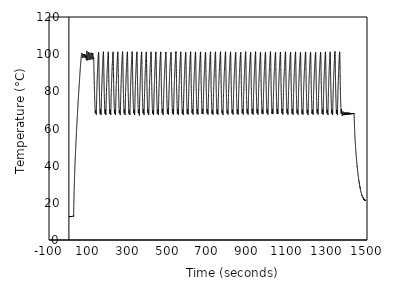
| Category | Series 0 |
|---|---|
| 0.0 | 12.5 |
| 0.63 | 12.5 |
| 0.7 | 12.5 |
| 0.77 | 12.5 |
| 0.84 | 12.5 |
| 0.91 | 12.5 |
| 0.97 | 12.5 |
| 1.04 | 12.5 |
| 1.11 | 12.5 |
| 1.18 | 12.5 |
| 1.25 | 12.5 |
| 1.31 | 12.5 |
| 1.38 | 12.5 |
| 1.45 | 12.5 |
| 1.52 | 12.5 |
| 1.59 | 12.5 |
| 1.65 | 12.5 |
| 1.72 | 12.5 |
| 1.79 | 12.5 |
| 1.86 | 12.5 |
| 1.93 | 12.5 |
| 2.0 | 12.5 |
| 2.06 | 12.5 |
| 2.13 | 12.5 |
| 2.2 | 12.5 |
| 2.27 | 12.5 |
| 2.34 | 12.5 |
| 2.4 | 12.5 |
| 2.47 | 12.5 |
| 2.54 | 12.5 |
| 2.61 | 12.5 |
| 2.68 | 12.5 |
| 2.74 | 12.5 |
| 2.81 | 12.5 |
| 2.88 | 12.5 |
| 2.95 | 12.5 |
| 3.02 | 12.5 |
| 3.08 | 12.5 |
| 3.15 | 12.5 |
| 3.22 | 12.5 |
| 3.29 | 12.5 |
| 3.36 | 12.5 |
| 3.42 | 12.5 |
| 3.49 | 12.5 |
| 3.56 | 12.5 |
| 3.63 | 12.5 |
| 3.7 | 12.5 |
| 3.76 | 12.5 |
| 3.83 | 12.5 |
| 3.9 | 12.5 |
| 3.97 | 12.5 |
| 4.04 | 12.5 |
| 4.1 | 12.5 |
| 4.17 | 12.5 |
| 4.24 | 12.5 |
| 4.31 | 12.5 |
| 4.38 | 12.5 |
| 4.44 | 12.5 |
| 4.51 | 12.5 |
| 4.58 | 12.5 |
| 4.65 | 12.5 |
| 4.72 | 12.5 |
| 4.78 | 12.5 |
| 4.85 | 12.75 |
| 4.92 | 12.5 |
| 4.99 | 12.5 |
| 5.06 | 12.5 |
| 5.12 | 12.5 |
| 5.19 | 12.5 |
| 5.26 | 12.5 |
| 5.33 | 12.75 |
| 5.4 | 12.5 |
| 5.47 | 12.75 |
| 5.53 | 12.75 |
| 5.6 | 12.5 |
| 5.67 | 12.75 |
| 5.74 | 12.75 |
| 5.8 | 12.5 |
| 5.87 | 12.5 |
| 5.94 | 12.5 |
| 6.01 | 12.5 |
| 6.08 | 12.5 |
| 6.15 | 12.5 |
| 6.21 | 12.5 |
| 6.28 | 12.5 |
| 6.35 | 12.5 |
| 6.42 | 12.75 |
| 6.48 | 12.5 |
| 6.55 | 12.5 |
| 6.62 | 12.5 |
| 6.69 | 12.75 |
| 6.76 | 12.75 |
| 6.82 | 12.5 |
| 6.89 | 12.5 |
| 6.96 | 12.5 |
| 7.03 | 12.5 |
| 7.1 | 12.5 |
| 7.17 | 12.5 |
| 7.23 | 12.75 |
| 7.3 | 12.75 |
| 7.37 | 12.75 |
| 7.44 | 12.75 |
| 7.51 | 12.5 |
| 7.57 | 12.75 |
| 7.64 | 12.75 |
| 7.71 | 12.5 |
| 7.78 | 12.75 |
| 7.84 | 12.5 |
| 7.91 | 12.5 |
| 7.98 | 12.75 |
| 8.05 | 12.5 |
| 8.12 | 12.75 |
| 8.19 | 12.75 |
| 8.25 | 12.5 |
| 8.32 | 12.5 |
| 8.39 | 12.5 |
| 8.46 | 12.75 |
| 8.52 | 12.5 |
| 8.59 | 12.5 |
| 8.66 | 12.5 |
| 8.73 | 12.5 |
| 8.8 | 12.75 |
| 8.87 | 12.5 |
| 8.93 | 12.5 |
| 9.0 | 12.75 |
| 9.07 | 12.5 |
| 9.14 | 12.5 |
| 9.21 | 12.5 |
| 9.27 | 12.5 |
| 9.34 | 12.5 |
| 9.41 | 12.75 |
| 9.48 | 12.5 |
| 9.55 | 12.5 |
| 9.61 | 12.5 |
| 9.68 | 12.75 |
| 9.75 | 12.75 |
| 9.82 | 12.75 |
| 9.89 | 12.5 |
| 9.96 | 12.75 |
| 10.02 | 12.5 |
| 10.09 | 12.75 |
| 10.16 | 12.75 |
| 10.23 | 12.5 |
| 10.3 | 12.75 |
| 10.36 | 12.75 |
| 10.43 | 12.5 |
| 10.5 | 12.75 |
| 10.57 | 12.75 |
| 10.64 | 12.75 |
| 10.7 | 12.75 |
| 10.77 | 12.75 |
| 10.84 | 12.75 |
| 10.91 | 12.5 |
| 10.98 | 12.5 |
| 11.04 | 12.75 |
| 11.11 | 12.75 |
| 11.18 | 12.75 |
| 11.25 | 12.5 |
| 11.32 | 12.5 |
| 11.38 | 12.5 |
| 11.45 | 12.5 |
| 11.52 | 12.75 |
| 11.59 | 12.75 |
| 11.66 | 12.75 |
| 11.73 | 12.75 |
| 11.79 | 12.5 |
| 11.86 | 12.75 |
| 11.93 | 12.75 |
| 12.0 | 12.75 |
| 12.06 | 12.75 |
| 12.13 | 12.75 |
| 12.2 | 12.75 |
| 12.27 | 12.75 |
| 12.34 | 12.75 |
| 12.41 | 12.75 |
| 12.47 | 12.75 |
| 12.54 | 12.75 |
| 12.61 | 12.5 |
| 12.68 | 12.75 |
| 12.75 | 12.75 |
| 12.81 | 12.75 |
| 12.88 | 12.75 |
| 12.95 | 12.75 |
| 13.02 | 12.75 |
| 13.09 | 12.75 |
| 13.15 | 12.5 |
| 13.22 | 12.75 |
| 13.29 | 12.75 |
| 13.36 | 12.75 |
| 13.43 | 12.5 |
| 13.5 | 12.75 |
| 13.56 | 12.75 |
| 13.63 | 12.75 |
| 13.7 | 12.75 |
| 13.77 | 12.75 |
| 13.84 | 12.75 |
| 13.9 | 12.75 |
| 13.97 | 12.75 |
| 14.04 | 12.75 |
| 14.11 | 12.75 |
| 14.18 | 12.75 |
| 14.24 | 12.75 |
| 14.31 | 12.75 |
| 14.38 | 12.75 |
| 14.45 | 12.75 |
| 14.52 | 12.75 |
| 14.59 | 12.75 |
| 14.65 | 12.75 |
| 14.72 | 12.75 |
| 14.79 | 12.75 |
| 14.86 | 12.75 |
| 14.93 | 12.75 |
| 14.99 | 12.75 |
| 15.06 | 12.75 |
| 15.13 | 12.75 |
| 15.2 | 12.75 |
| 15.27 | 12.75 |
| 15.33 | 12.75 |
| 15.4 | 12.75 |
| 15.47 | 12.75 |
| 15.54 | 12.75 |
| 15.61 | 12.75 |
| 15.67 | 12.75 |
| 15.74 | 12.75 |
| 15.81 | 12.75 |
| 15.88 | 12.75 |
| 15.95 | 12.75 |
| 16.01 | 12.75 |
| 16.08 | 12.75 |
| 16.15 | 12.75 |
| 16.22 | 12.75 |
| 16.29 | 12.75 |
| 16.35 | 12.75 |
| 16.42 | 12.75 |
| 16.49 | 12.75 |
| 16.56 | 12.75 |
| 16.63 | 12.75 |
| 16.7 | 12.75 |
| 16.76 | 12.75 |
| 16.83 | 12.75 |
| 16.9 | 12.75 |
| 16.97 | 12.75 |
| 17.04 | 12.75 |
| 17.1 | 12.75 |
| 17.17 | 12.75 |
| 17.24 | 12.75 |
| 17.31 | 12.75 |
| 17.38 | 12.75 |
| 17.44 | 12.75 |
| 17.51 | 12.75 |
| 17.58 | 12.75 |
| 17.65 | 12.75 |
| 17.72 | 12.75 |
| 17.78 | 12.75 |
| 17.85 | 12.75 |
| 17.92 | 12.75 |
| 17.99 | 12.75 |
| 18.06 | 12.75 |
| 18.12 | 12.75 |
| 18.19 | 12.75 |
| 18.26 | 12.75 |
| 18.33 | 12.75 |
| 18.4 | 12.75 |
| 18.46 | 12.75 |
| 18.53 | 12.75 |
| 18.6 | 12.75 |
| 18.67 | 12.75 |
| 18.74 | 12.75 |
| 18.81 | 12.75 |
| 18.87 | 12.75 |
| 18.94 | 12.75 |
| 19.01 | 12.75 |
| 19.08 | 12.75 |
| 19.15 | 12.75 |
| 19.21 | 12.75 |
| 19.28 | 12.75 |
| 19.35 | 12.75 |
| 19.42 | 12.75 |
| 19.49 | 12.75 |
| 19.55 | 12.75 |
| 19.62 | 12.75 |
| 19.69 | 12.75 |
| 19.76 | 12.75 |
| 19.83 | 12.75 |
| 19.9 | 12.75 |
| 19.96 | 12.75 |
| 20.03 | 12.75 |
| 20.1 | 12.75 |
| 20.17 | 12.75 |
| 20.24 | 12.75 |
| 20.3 | 12.75 |
| 20.37 | 12.75 |
| 20.44 | 12.75 |
| 20.51 | 12.75 |
| 20.58 | 12.75 |
| 20.64 | 12.75 |
| 20.71 | 12.75 |
| 20.78 | 12.75 |
| 20.85 | 12.75 |
| 20.92 | 12.75 |
| 20.98 | 12.75 |
| 21.05 | 12.75 |
| 21.12 | 12.75 |
| 21.19 | 12.75 |
| 21.26 | 12.75 |
| 21.32 | 12.75 |
| 21.39 | 12.75 |
| 21.46 | 13 |
| 21.53 | 12.75 |
| 21.6 | 12.75 |
| 21.67 | 12.75 |
| 21.73 | 12.75 |
| 21.8 | 12.75 |
| 21.87 | 12.75 |
| 21.94 | 12.75 |
| 22.0 | 12.75 |
| 22.07 | 12.75 |
| 22.14 | 12.75 |
| 22.21 | 12.75 |
| 22.28 | 12.75 |
| 22.35 | 12.75 |
| 22.41 | 12.75 |
| 22.48 | 12.75 |
| 22.55 | 12.75 |
| 22.62 | 12.75 |
| 22.69 | 13 |
| 22.75 | 12.75 |
| 22.82 | 12.75 |
| 22.89 | 12.75 |
| 22.96 | 13 |
| 23.03 | 13 |
| 23.09 | 12.75 |
| 23.16 | 13 |
| 23.23 | 12.75 |
| 23.3 | 12.75 |
| 23.37 | 13 |
| 23.44 | 13 |
| 23.5 | 13 |
| 23.57 | 13 |
| 23.64 | 13 |
| 23.71 | 12.75 |
| 23.78 | 12.75 |
| 23.84 | 12.75 |
| 23.91 | 13.75 |
| 23.98 | 14.25 |
| 24.05 | 14.75 |
| 24.12 | 15.25 |
| 24.18 | 15.5 |
| 24.25 | 15.5 |
| 24.32 | 16 |
| 24.39 | 16.5 |
| 24.46 | 16.75 |
| 24.52 | 17.25 |
| 24.59 | 17.5 |
| 24.66 | 18 |
| 24.73 | 18.5 |
| 24.8 | 18.75 |
| 24.86 | 19.25 |
| 24.93 | 19.5 |
| 25.0 | 20 |
| 25.07 | 20 |
| 25.14 | 20.25 |
| 25.21 | 20.75 |
| 25.27 | 21 |
| 25.34 | 21.5 |
| 25.41 | 21.75 |
| 25.48 | 22.25 |
| 25.55 | 22.5 |
| 25.61 | 22.75 |
| 25.68 | 23.25 |
| 25.75 | 23.5 |
| 25.82 | 24 |
| 25.89 | 24 |
| 25.95 | 24.25 |
| 26.02 | 24.5 |
| 26.09 | 25 |
| 26.16 | 25.25 |
| 26.23 | 25.5 |
| 26.3 | 26 |
| 26.36 | 26.25 |
| 26.43 | 26.5 |
| 26.5 | 27 |
| 26.57 | 27.25 |
| 26.64 | 27.25 |
| 26.7 | 27.5 |
| 26.77 | 27.75 |
| 26.84 | 28 |
| 26.91 | 28.5 |
| 26.98 | 28.5 |
| 27.04 | 28.75 |
| 27.11 | 29 |
| 27.18 | 29.25 |
| 27.25 | 29.5 |
| 27.32 | 30 |
| 27.38 | 30 |
| 27.45 | 30 |
| 27.52 | 30.5 |
| 27.59 | 30.75 |
| 27.66 | 31 |
| 27.72 | 31.25 |
| 27.79 | 31.5 |
| 27.86 | 31.75 |
| 27.93 | 32 |
| 28.0 | 32.25 |
| 28.07 | 32.5 |
| 28.13 | 32.75 |
| 28.2 | 33 |
| 28.27 | 33 |
| 28.34 | 33.25 |
| 28.41 | 33.75 |
| 28.47 | 33.75 |
| 28.54 | 34 |
| 28.61 | 34.25 |
| 28.68 | 34.5 |
| 28.75 | 34.75 |
| 28.81 | 35 |
| 28.88 | 35.25 |
| 28.95 | 35.5 |
| 29.02 | 35.75 |
| 29.09 | 35.75 |
| 29.16 | 36 |
| 29.22 | 36.25 |
| 29.29 | 36.5 |
| 29.36 | 36.75 |
| 29.43 | 36.75 |
| 29.5 | 37.25 |
| 29.56 | 37.25 |
| 29.63 | 37.5 |
| 29.7 | 37.75 |
| 29.77 | 38 |
| 29.84 | 38.25 |
| 29.9 | 38.25 |
| 29.97 | 38.5 |
| 30.04 | 38.75 |
| 30.11 | 38.75 |
| 30.18 | 39 |
| 30.25 | 39.25 |
| 30.31 | 39.5 |
| 30.38 | 39.75 |
| 30.45 | 40 |
| 30.52 | 40.25 |
| 30.58 | 40.25 |
| 30.65 | 40.5 |
| 30.72 | 40.5 |
| 30.79 | 40.75 |
| 30.86 | 41 |
| 30.93 | 41.25 |
| 30.99 | 41.25 |
| 31.06 | 41.5 |
| 31.13 | 41.75 |
| 31.2 | 41.75 |
| 31.27 | 42.25 |
| 31.33 | 42.25 |
| 31.4 | 42.5 |
| 31.47 | 42.5 |
| 31.54 | 42.75 |
| 31.61 | 43 |
| 31.67 | 43 |
| 31.74 | 43.25 |
| 31.81 | 43.5 |
| 31.88 | 43.75 |
| 31.95 | 43.75 |
| 32.02 | 44 |
| 32.08 | 44.25 |
| 32.15 | 44.5 |
| 32.22 | 44.5 |
| 32.29 | 44.5 |
| 32.36 | 44.75 |
| 32.42 | 45 |
| 32.49 | 45.25 |
| 32.56 | 45.25 |
| 32.63 | 45.5 |
| 32.7 | 45.75 |
| 32.76 | 46 |
| 32.83 | 46 |
| 32.9 | 46.25 |
| 32.97 | 46.5 |
| 33.04 | 46.5 |
| 33.11 | 46.5 |
| 33.17 | 46.75 |
| 33.24 | 47 |
| 33.31 | 47.25 |
| 33.38 | 47.25 |
| 33.45 | 47.5 |
| 33.51 | 47.75 |
| 33.58 | 47.75 |
| 33.65 | 48 |
| 33.72 | 48 |
| 33.79 | 48.25 |
| 33.85 | 48.5 |
| 33.92 | 48.5 |
| 33.99 | 48.75 |
| 34.06 | 49 |
| 34.13 | 49 |
| 34.2 | 49.25 |
| 34.26 | 49.25 |
| 34.33 | 49.5 |
| 34.4 | 49.75 |
| 34.47 | 50 |
| 34.54 | 50.25 |
| 34.6 | 50.25 |
| 34.67 | 50.5 |
| 34.74 | 50.5 |
| 34.81 | 50.5 |
| 34.88 | 50.75 |
| 34.94 | 51 |
| 35.01 | 51 |
| 35.08 | 51.25 |
| 35.15 | 51.25 |
| 35.22 | 51.5 |
| 35.28 | 51.5 |
| 35.35 | 51.75 |
| 35.42 | 52 |
| 35.49 | 52.25 |
| 35.56 | 52.25 |
| 35.62 | 52.5 |
| 35.69 | 52.5 |
| 35.76 | 52.75 |
| 35.83 | 52.75 |
| 35.9 | 53 |
| 35.97 | 53.25 |
| 36.03 | 53.25 |
| 36.1 | 53.5 |
| 36.17 | 53.75 |
| 36.24 | 53.75 |
| 36.31 | 53.75 |
| 36.37 | 54 |
| 36.44 | 54 |
| 36.51 | 54.25 |
| 36.58 | 54.5 |
| 36.65 | 54.5 |
| 36.71 | 54.75 |
| 36.78 | 55 |
| 36.85 | 55 |
| 36.92 | 55.25 |
| 36.99 | 55.25 |
| 37.06 | 55.5 |
| 37.12 | 55.5 |
| 37.19 | 55.75 |
| 37.26 | 56 |
| 37.33 | 56 |
| 37.4 | 56.25 |
| 37.46 | 56.25 |
| 37.53 | 56.75 |
| 37.6 | 56.75 |
| 37.67 | 56.75 |
| 37.74 | 57 |
| 37.8 | 57.25 |
| 37.87 | 57.25 |
| 37.94 | 57.25 |
| 38.01 | 57.5 |
| 38.08 | 57.75 |
| 38.15 | 57.75 |
| 38.21 | 58 |
| 38.28 | 58 |
| 38.35 | 58.25 |
| 38.42 | 58.5 |
| 38.48 | 58.5 |
| 38.55 | 58.75 |
| 38.62 | 59 |
| 38.69 | 59 |
| 38.76 | 59 |
| 38.83 | 59.25 |
| 38.89 | 59.25 |
| 38.96 | 59.5 |
| 39.03 | 59.75 |
| 39.1 | 59.75 |
| 39.17 | 60 |
| 39.23 | 60 |
| 39.3 | 60.25 |
| 39.37 | 60.5 |
| 39.44 | 60.5 |
| 39.51 | 60.75 |
| 39.57 | 60.75 |
| 39.64 | 60.75 |
| 39.71 | 61 |
| 39.78 | 61.25 |
| 39.85 | 61.25 |
| 39.92 | 61.5 |
| 39.98 | 61.75 |
| 40.05 | 61.75 |
| 40.12 | 62 |
| 40.19 | 62 |
| 40.26 | 62.25 |
| 40.32 | 62.5 |
| 40.39 | 62.5 |
| 40.46 | 62.75 |
| 40.53 | 62.75 |
| 40.6 | 62.75 |
| 40.66 | 63 |
| 40.73 | 63 |
| 40.8 | 63.25 |
| 40.87 | 63.5 |
| 40.94 | 63.5 |
| 41.01 | 63.75 |
| 41.07 | 63.75 |
| 41.14 | 63.75 |
| 41.21 | 64 |
| 41.28 | 64.25 |
| 41.35 | 64.25 |
| 41.41 | 64.5 |
| 41.48 | 64.5 |
| 41.55 | 64.75 |
| 41.62 | 65 |
| 41.69 | 65 |
| 41.75 | 65.25 |
| 41.82 | 65.25 |
| 41.89 | 65.5 |
| 41.96 | 65.5 |
| 42.03 | 65.5 |
| 42.09 | 65.75 |
| 42.16 | 65.75 |
| 42.23 | 66 |
| 42.3 | 66.25 |
| 42.37 | 66.25 |
| 42.43 | 66.5 |
| 42.5 | 66.5 |
| 42.57 | 66.75 |
| 42.64 | 67 |
| 42.71 | 67 |
| 42.78 | 67 |
| 42.84 | 67 |
| 42.91 | 67.25 |
| 42.98 | 67.5 |
| 43.05 | 67.5 |
| 43.12 | 67.75 |
| 43.18 | 68 |
| 43.25 | 68 |
| 43.32 | 68.25 |
| 43.39 | 68.25 |
| 43.46 | 68.5 |
| 43.52 | 68.5 |
| 43.59 | 68.5 |
| 43.66 | 68.75 |
| 43.73 | 68.75 |
| 43.8 | 69 |
| 43.87 | 69 |
| 43.93 | 69.25 |
| 44.0 | 69.25 |
| 44.07 | 69.5 |
| 44.14 | 69.75 |
| 44.21 | 69.75 |
| 44.27 | 70 |
| 44.34 | 70 |
| 44.41 | 70 |
| 44.48 | 70.25 |
| 44.55 | 70.5 |
| 44.61 | 70.5 |
| 44.68 | 70.75 |
| 44.75 | 70.75 |
| 44.82 | 71 |
| 44.89 | 71.25 |
| 44.95 | 71.25 |
| 45.02 | 71.5 |
| 45.09 | 71.5 |
| 45.16 | 71.5 |
| 45.22 | 71.5 |
| 45.29 | 71.75 |
| 45.36 | 72 |
| 45.43 | 72 |
| 45.5 | 72.25 |
| 45.57 | 72.25 |
| 45.63 | 72.5 |
| 45.7 | 72.75 |
| 45.77 | 72.75 |
| 45.84 | 73 |
| 45.91 | 73 |
| 45.97 | 73 |
| 46.04 | 73.25 |
| 46.11 | 73.25 |
| 46.18 | 73.5 |
| 46.25 | 73.5 |
| 46.31 | 73.75 |
| 46.38 | 74 |
| 46.45 | 74 |
| 46.52 | 74.25 |
| 46.59 | 74.25 |
| 46.66 | 74.5 |
| 46.72 | 74.5 |
| 46.79 | 74.5 |
| 46.86 | 74.75 |
| 46.93 | 75 |
| 47.0 | 75 |
| 47.06 | 75 |
| 47.13 | 75.25 |
| 47.2 | 75.5 |
| 47.27 | 75.5 |
| 47.34 | 75.75 |
| 47.4 | 75.75 |
| 47.47 | 76 |
| 47.54 | 76.25 |
| 47.61 | 76.25 |
| 47.68 | 76.25 |
| 47.75 | 76.25 |
| 47.81 | 76.5 |
| 47.88 | 76.5 |
| 47.95 | 76.75 |
| 48.02 | 76.75 |
| 48.09 | 77 |
| 48.15 | 77 |
| 48.22 | 77.25 |
| 48.29 | 77.5 |
| 48.36 | 77.5 |
| 48.43 | 77.5 |
| 48.49 | 77.5 |
| 48.56 | 77.75 |
| 48.63 | 77.75 |
| 48.7 | 78 |
| 48.77 | 78.25 |
| 48.83 | 78.25 |
| 48.9 | 78.5 |
| 48.97 | 78.75 |
| 49.04 | 78.75 |
| 49.11 | 78.75 |
| 49.18 | 79 |
| 49.24 | 79 |
| 49.31 | 79.25 |
| 49.38 | 79.25 |
| 49.45 | 79.25 |
| 49.52 | 79.5 |
| 49.58 | 79.5 |
| 49.65 | 79.75 |
| 49.72 | 79.75 |
| 49.79 | 80 |
| 49.86 | 80 |
| 49.92 | 80.25 |
| 49.99 | 80.25 |
| 50.06 | 80.25 |
| 50.13 | 80.5 |
| 50.2 | 80.5 |
| 50.27 | 80.75 |
| 50.33 | 80.75 |
| 50.4 | 81 |
| 50.47 | 81 |
| 50.54 | 81.25 |
| 50.61 | 81.25 |
| 50.67 | 81.5 |
| 50.74 | 81.5 |
| 50.81 | 81.5 |
| 50.88 | 81.75 |
| 50.95 | 81.75 |
| 51.01 | 82 |
| 51.08 | 82 |
| 51.15 | 82.25 |
| 51.22 | 82.25 |
| 51.29 | 82.25 |
| 51.35 | 82.5 |
| 51.42 | 82.5 |
| 51.49 | 82.75 |
| 51.56 | 82.75 |
| 51.63 | 82.75 |
| 51.69 | 83 |
| 51.76 | 83 |
| 51.83 | 83.25 |
| 51.9 | 83.5 |
| 51.97 | 83.5 |
| 52.04 | 83.75 |
| 52.1 | 83.75 |
| 52.17 | 83.75 |
| 52.24 | 84 |
| 52.31 | 84 |
| 52.38 | 84.25 |
| 52.44 | 84.25 |
| 52.51 | 84.5 |
| 52.58 | 84.5 |
| 52.65 | 84.75 |
| 52.72 | 84.75 |
| 52.78 | 85 |
| 52.85 | 85 |
| 52.92 | 85.25 |
| 52.99 | 85.25 |
| 53.06 | 85.25 |
| 53.13 | 85.5 |
| 53.19 | 85.5 |
| 53.26 | 85.5 |
| 53.33 | 85.75 |
| 53.4 | 85.75 |
| 53.47 | 86 |
| 53.53 | 86 |
| 53.6 | 86.25 |
| 53.67 | 86.25 |
| 53.74 | 86.5 |
| 53.81 | 86.5 |
| 53.87 | 86.75 |
| 53.94 | 86.75 |
| 54.01 | 87 |
| 54.08 | 87 |
| 54.15 | 87 |
| 54.21 | 87.25 |
| 54.28 | 87.25 |
| 54.35 | 87.5 |
| 54.42 | 87.5 |
| 54.49 | 87.5 |
| 54.55 | 87.75 |
| 54.62 | 88 |
| 54.69 | 88 |
| 54.76 | 88 |
| 54.83 | 88.25 |
| 54.9 | 88.25 |
| 54.96 | 88.5 |
| 55.03 | 88.5 |
| 55.1 | 88.5 |
| 55.17 | 88.75 |
| 55.24 | 89 |
| 55.3 | 89 |
| 55.37 | 89 |
| 55.44 | 89.25 |
| 55.51 | 89.5 |
| 55.58 | 89.5 |
| 55.64 | 89.5 |
| 55.71 | 89.5 |
| 55.78 | 89.75 |
| 55.85 | 90 |
| 55.92 | 90 |
| 55.99 | 90.25 |
| 56.05 | 90.25 |
| 56.12 | 90.5 |
| 56.19 | 90.5 |
| 56.26 | 90.5 |
| 56.33 | 90.5 |
| 56.39 | 90.75 |
| 56.46 | 90.75 |
| 56.53 | 90.75 |
| 56.6 | 91 |
| 56.67 | 91 |
| 56.73 | 91 |
| 56.8 | 91.25 |
| 56.87 | 91.25 |
| 56.94 | 91.5 |
| 57.01 | 91.5 |
| 57.07 | 91.75 |
| 57.14 | 91.75 |
| 57.21 | 92 |
| 57.28 | 92 |
| 57.35 | 92 |
| 57.41 | 92.25 |
| 57.48 | 92.25 |
| 57.55 | 92.5 |
| 57.62 | 92.5 |
| 57.69 | 92.5 |
| 57.76 | 92.5 |
| 57.82 | 92.75 |
| 57.89 | 92.75 |
| 57.96 | 93 |
| 58.03 | 93 |
| 58.1 | 93 |
| 58.16 | 93.25 |
| 58.23 | 93.25 |
| 58.3 | 93.5 |
| 58.37 | 93.5 |
| 58.44 | 93.5 |
| 58.5 | 93.75 |
| 58.57 | 93.75 |
| 58.64 | 94 |
| 58.71 | 94 |
| 58.78 | 94 |
| 58.85 | 94.25 |
| 58.91 | 94.25 |
| 58.98 | 94.25 |
| 59.05 | 94.25 |
| 59.12 | 94.5 |
| 59.19 | 94.5 |
| 59.25 | 94.75 |
| 59.32 | 94.75 |
| 59.39 | 95 |
| 59.46 | 95.25 |
| 59.53 | 95.25 |
| 59.59 | 95.25 |
| 59.66 | 95.5 |
| 59.73 | 95.5 |
| 59.8 | 95.5 |
| 59.87 | 95.75 |
| 59.93 | 95.75 |
| 60.0 | 95.75 |
| 60.07 | 96 |
| 60.14 | 96 |
| 60.21 | 96.25 |
| 60.27 | 96.25 |
| 60.34 | 96.25 |
| 60.41 | 96.25 |
| 60.48 | 96.5 |
| 60.55 | 96.5 |
| 60.62 | 96.5 |
| 60.68 | 96.5 |
| 60.75 | 96.75 |
| 60.82 | 96.75 |
| 60.89 | 97 |
| 60.96 | 97 |
| 61.02 | 97 |
| 61.09 | 97.25 |
| 61.16 | 97.25 |
| 61.23 | 97.25 |
| 61.3 | 97.25 |
| 61.36 | 97.5 |
| 61.43 | 97.5 |
| 61.5 | 97.5 |
| 61.57 | 97.75 |
| 61.64 | 98 |
| 61.71 | 98 |
| 61.77 | 98 |
| 61.84 | 98.25 |
| 61.91 | 98.25 |
| 61.98 | 98.5 |
| 62.04 | 98.5 |
| 62.11 | 98.5 |
| 62.18 | 98.5 |
| 62.25 | 98.75 |
| 62.32 | 98.75 |
| 62.39 | 99 |
| 62.45 | 99 |
| 62.52 | 99 |
| 62.59 | 99 |
| 62.66 | 99.25 |
| 62.73 | 99.25 |
| 62.79 | 99.25 |
| 62.86 | 99.25 |
| 62.93 | 99.25 |
| 63.0 | 99.25 |
| 63.07 | 99.5 |
| 63.13 | 99.5 |
| 63.2 | 99.5 |
| 63.27 | 99.5 |
| 63.34 | 99.75 |
| 63.41 | 99.75 |
| 63.47 | 99.75 |
| 63.54 | 100 |
| 63.61 | 100 |
| 63.68 | 100 |
| 63.75 | 100 |
| 63.82 | 100 |
| 63.88 | 100.25 |
| 63.95 | 100.25 |
| 64.02 | 100.25 |
| 64.09 | 100.25 |
| 64.16 | 100.25 |
| 64.23 | 100.25 |
| 64.29 | 100.25 |
| 64.36 | 100.25 |
| 64.43 | 100.25 |
| 64.5 | 100.25 |
| 64.57 | 100.25 |
| 64.63 | 100.25 |
| 64.7 | 100.5 |
| 64.77 | 100.25 |
| 64.84 | 100.25 |
| 64.91 | 100.5 |
| 64.98 | 100.25 |
| 65.04 | 100.25 |
| 65.11 | 100.25 |
| 65.18 | 100.25 |
| 65.25 | 100.25 |
| 65.32 | 100.25 |
| 65.38 | 100.25 |
| 65.45 | 100.25 |
| 65.52 | 100.25 |
| 65.59 | 100.25 |
| 65.66 | 100.25 |
| 65.73 | 100.25 |
| 65.79 | 100.25 |
| 65.86 | 100.25 |
| 65.93 | 100.25 |
| 66.0 | 100.25 |
| 66.07 | 100.25 |
| 66.14 | 100.25 |
| 66.2 | 100.25 |
| 66.27 | 100.25 |
| 66.34 | 100.25 |
| 66.41 | 100.25 |
| 66.48 | 100 |
| 66.54 | 100 |
| 66.61 | 100 |
| 66.68 | 100 |
| 66.75 | 100 |
| 66.82 | 99.75 |
| 66.88 | 99.75 |
| 66.95 | 99.75 |
| 67.02 | 99.75 |
| 67.09 | 99.75 |
| 67.16 | 99.5 |
| 67.23 | 99.5 |
| 67.29 | 99.5 |
| 67.36 | 99.25 |
| 67.43 | 99.25 |
| 67.5 | 99.25 |
| 67.57 | 99.25 |
| 67.64 | 99 |
| 67.7 | 99 |
| 67.77 | 99 |
| 67.84 | 99 |
| 67.91 | 98.75 |
| 67.98 | 98.75 |
| 68.04 | 98.75 |
| 68.11 | 98.5 |
| 68.18 | 98.5 |
| 68.25 | 98.5 |
| 68.32 | 98.5 |
| 68.38 | 98.25 |
| 68.45 | 98.25 |
| 68.52 | 98.25 |
| 68.59 | 98.25 |
| 68.66 | 98.25 |
| 68.72 | 98.25 |
| 68.79 | 98 |
| 68.86 | 98 |
| 68.93 | 98 |
| 69.0 | 98 |
| 69.07 | 98 |
| 69.13 | 98 |
| 69.2 | 98 |
| 69.27 | 98 |
| 69.34 | 98 |
| 69.41 | 98 |
| 69.48 | 98 |
| 69.54 | 98 |
| 69.61 | 98 |
| 69.68 | 98 |
| 69.75 | 98 |
| 69.82 | 98 |
| 69.88 | 98.25 |
| 69.95 | 98.25 |
| 70.02 | 98.25 |
| 70.09 | 98.25 |
| 70.16 | 98.25 |
| 70.22 | 98.5 |
| 70.29 | 98.5 |
| 70.36 | 98.5 |
| 70.43 | 98.5 |
| 70.5 | 98.5 |
| 70.56 | 98.75 |
| 70.63 | 98.75 |
| 70.7 | 98.75 |
| 70.77 | 98.75 |
| 70.84 | 98.75 |
| 70.91 | 99 |
| 70.97 | 99 |
| 71.04 | 99.25 |
| 71.11 | 99.25 |
| 71.18 | 99.25 |
| 71.25 | 99.25 |
| 71.32 | 99.25 |
| 71.38 | 99.25 |
| 71.45 | 99.5 |
| 71.52 | 99.5 |
| 71.59 | 99.5 |
| 71.66 | 99.5 |
| 71.72 | 99.5 |
| 71.79 | 99.75 |
| 71.86 | 99.75 |
| 71.93 | 99.75 |
| 72.0 | 99.75 |
| 72.07 | 99.75 |
| 72.13 | 99.75 |
| 72.2 | 100 |
| 72.27 | 100 |
| 72.34 | 100 |
| 72.41 | 100 |
| 72.47 | 100 |
| 72.54 | 100 |
| 72.61 | 100 |
| 72.68 | 100 |
| 72.75 | 100 |
| 72.81 | 100 |
| 72.88 | 100 |
| 72.95 | 100 |
| 73.02 | 100 |
| 73.09 | 100 |
| 73.16 | 100 |
| 73.22 | 100 |
| 73.29 | 100 |
| 73.36 | 100 |
| 73.43 | 99.75 |
| 73.5 | 99.75 |
| 73.57 | 99.75 |
| 73.63 | 99.75 |
| 73.7 | 99.75 |
| 73.77 | 99.5 |
| 73.84 | 99.75 |
| 73.91 | 99.5 |
| 73.97 | 99.5 |
| 74.04 | 99.5 |
| 74.11 | 99.5 |
| 74.18 | 99.25 |
| 74.25 | 99.25 |
| 74.31 | 99.25 |
| 74.38 | 99.25 |
| 74.45 | 99.25 |
| 74.52 | 99 |
| 74.59 | 99 |
| 74.66 | 99 |
| 74.72 | 99 |
| 74.79 | 99 |
| 74.86 | 98.75 |
| 74.93 | 98.75 |
| 75.0 | 98.75 |
| 75.06 | 98.75 |
| 75.13 | 98.75 |
| 75.2 | 98.75 |
| 75.27 | 98.5 |
| 75.34 | 98.5 |
| 75.41 | 98.5 |
| 75.47 | 98.5 |
| 75.54 | 98.5 |
| 75.61 | 98.25 |
| 75.68 | 98.25 |
| 75.75 | 98.25 |
| 75.81 | 98.25 |
| 75.88 | 98.25 |
| 75.95 | 98.25 |
| 76.02 | 98.25 |
| 76.09 | 98.25 |
| 76.15 | 98.25 |
| 76.22 | 98.25 |
| 76.29 | 98.25 |
| 76.36 | 98.25 |
| 76.43 | 98.25 |
| 76.5 | 98.25 |
| 76.56 | 98.25 |
| 76.63 | 98.25 |
| 76.7 | 98.25 |
| 76.77 | 98.25 |
| 76.84 | 98.25 |
| 76.9 | 98.25 |
| 76.97 | 98.25 |
| 77.04 | 98.25 |
| 77.11 | 98.25 |
| 77.18 | 98.25 |
| 77.25 | 98.25 |
| 77.31 | 98.25 |
| 77.38 | 98.5 |
| 77.45 | 98.5 |
| 77.52 | 98.5 |
| 77.59 | 98.5 |
| 77.65 | 98.5 |
| 77.72 | 98.5 |
| 77.79 | 98.5 |
| 77.86 | 98.75 |
| 77.93 | 98.75 |
| 78.0 | 98.75 |
| 78.06 | 98.75 |
| 78.13 | 98.75 |
| 78.2 | 99 |
| 78.27 | 99 |
| 78.34 | 99 |
| 78.4 | 99 |
| 78.47 | 99 |
| 78.54 | 99.25 |
| 78.61 | 99.25 |
| 78.68 | 99.25 |
| 78.75 | 99.25 |
| 78.81 | 99.25 |
| 78.88 | 99.5 |
| 78.95 | 99.5 |
| 79.02 | 99.5 |
| 79.09 | 99.5 |
| 79.15 | 99.5 |
| 79.22 | 99.5 |
| 79.29 | 99.5 |
| 79.36 | 99.75 |
| 79.43 | 99.75 |
| 79.5 | 99.75 |
| 79.56 | 99.75 |
| 79.63 | 99.75 |
| 79.7 | 99.75 |
| 79.77 | 99.75 |
| 79.84 | 99.75 |
| 79.9 | 99.75 |
| 79.97 | 99.75 |
| 80.04 | 99.5 |
| 80.11 | 99.5 |
| 80.18 | 99.75 |
| 80.24 | 99.75 |
| 80.31 | 99.5 |
| 80.38 | 99.5 |
| 80.45 | 99.75 |
| 80.52 | 99.5 |
| 80.58 | 99.5 |
| 80.65 | 99.5 |
| 80.72 | 99.5 |
| 80.79 | 99.5 |
| 80.86 | 99.5 |
| 80.93 | 99.5 |
| 81.0 | 99.25 |
| 81.06 | 99.25 |
| 81.13 | 99.25 |
| 81.2 | 99.25 |
| 81.27 | 99.25 |
| 81.33 | 99.25 |
| 81.4 | 99.25 |
| 81.47 | 99 |
| 81.54 | 99 |
| 81.61 | 99 |
| 81.68 | 99 |
| 81.74 | 99 |
| 81.81 | 99 |
| 81.88 | 98.75 |
| 81.95 | 98.75 |
| 82.02 | 98.75 |
| 82.08 | 98.75 |
| 82.15 | 98.75 |
| 82.22 | 98.75 |
| 82.29 | 98.5 |
| 82.36 | 98.75 |
| 82.43 | 98.5 |
| 82.49 | 98.5 |
| 82.56 | 98.5 |
| 82.63 | 98.5 |
| 82.7 | 98.25 |
| 82.77 | 98.25 |
| 82.83 | 98.25 |
| 82.9 | 98 |
| 82.97 | 98 |
| 83.04 | 98 |
| 83.11 | 98 |
| 83.18 | 98 |
| 83.24 | 98 |
| 83.31 | 98 |
| 83.38 | 98 |
| 83.45 | 98 |
| 83.52 | 98 |
| 83.58 | 98.25 |
| 83.65 | 98 |
| 83.72 | 98 |
| 83.79 | 98 |
| 83.86 | 98.25 |
| 83.92 | 98.25 |
| 83.99 | 98.25 |
| 84.06 | 98.25 |
| 84.13 | 98.25 |
| 84.2 | 98.25 |
| 84.26 | 98.25 |
| 84.33 | 98.25 |
| 84.4 | 98.25 |
| 84.47 | 98.25 |
| 84.54 | 98.5 |
| 84.61 | 98.5 |
| 84.68 | 98.5 |
| 84.74 | 98.5 |
| 84.81 | 98.5 |
| 84.88 | 98.75 |
| 84.95 | 98.75 |
| 85.01 | 98.75 |
| 85.08 | 98.75 |
| 85.15 | 98.75 |
| 85.22 | 98.75 |
| 85.29 | 99 |
| 85.36 | 99 |
| 85.43 | 99 |
| 85.49 | 99.25 |
| 85.56 | 99.25 |
| 85.63 | 99.25 |
| 85.7 | 99.5 |
| 85.77 | 99.5 |
| 85.83 | 99.5 |
| 85.9 | 99.5 |
| 85.97 | 99.5 |
| 86.04 | 99.5 |
| 86.11 | 99.5 |
| 86.17 | 99.5 |
| 86.24 | 99.5 |
| 86.31 | 99.5 |
| 86.38 | 99.25 |
| 86.45 | 99 |
| 86.51 | 99 |
| 86.58 | 99 |
| 86.65 | 98.75 |
| 86.72 | 98.5 |
| 86.79 | 98.5 |
| 86.86 | 98.25 |
| 86.92 | 98 |
| 86.99 | 98 |
| 87.06 | 98 |
| 87.13 | 97.75 |
| 87.2 | 97.5 |
| 87.26 | 97.5 |
| 87.33 | 97.25 |
| 87.4 | 97.25 |
| 87.47 | 97.25 |
| 87.54 | 97 |
| 87.61 | 97 |
| 87.67 | 97 |
| 87.74 | 97 |
| 87.81 | 96.75 |
| 87.88 | 96.75 |
| 87.95 | 96.75 |
| 88.01 | 97 |
| 88.08 | 97 |
| 88.15 | 97.25 |
| 88.22 | 97.25 |
| 88.29 | 97.5 |
| 88.36 | 97.75 |
| 88.42 | 97.75 |
| 88.49 | 98.25 |
| 88.56 | 98.25 |
| 88.63 | 98.5 |
| 88.7 | 98.75 |
| 88.76 | 98.75 |
| 88.83 | 99 |
| 88.9 | 99.25 |
| 88.97 | 99.25 |
| 89.04 | 99.25 |
| 89.11 | 99.5 |
| 89.17 | 99.75 |
| 89.24 | 100 |
| 89.31 | 100 |
| 89.38 | 100.25 |
| 89.45 | 100.25 |
| 89.51 | 100.5 |
| 89.58 | 100.5 |
| 89.65 | 100.75 |
| 89.72 | 101 |
| 89.79 | 101 |
| 89.86 | 101 |
| 89.92 | 101.25 |
| 89.99 | 101.25 |
| 90.06 | 101.5 |
| 90.13 | 101.5 |
| 90.2 | 101.5 |
| 90.26 | 101.5 |
| 90.33 | 101.5 |
| 90.4 | 101.75 |
| 90.47 | 101.75 |
| 90.54 | 101.75 |
| 90.61 | 101.75 |
| 90.67 | 101.75 |
| 90.74 | 101.75 |
| 90.81 | 101.75 |
| 90.88 | 101.75 |
| 90.95 | 101.5 |
| 91.01 | 101.5 |
| 91.08 | 101.5 |
| 91.15 | 101.5 |
| 91.22 | 101.5 |
| 91.29 | 101.5 |
| 91.36 | 101.5 |
| 91.42 | 101.25 |
| 91.49 | 101.25 |
| 91.56 | 101.25 |
| 91.63 | 101.25 |
| 91.7 | 101 |
| 91.76 | 100.75 |
| 91.83 | 100.75 |
| 91.9 | 100.75 |
| 91.97 | 100.5 |
| 92.04 | 100.5 |
| 92.11 | 100.25 |
| 92.17 | 100.25 |
| 92.24 | 100.25 |
| 92.31 | 100.25 |
| 92.38 | 100 |
| 92.45 | 100 |
| 92.51 | 99.75 |
| 92.58 | 99.5 |
| 92.65 | 99.5 |
| 92.72 | 99.25 |
| 92.79 | 99.25 |
| 92.86 | 99 |
| 92.92 | 99 |
| 92.99 | 98.75 |
| 93.06 | 98.75 |
| 93.13 | 98.75 |
| 93.2 | 98.5 |
| 93.26 | 98.25 |
| 93.33 | 98.25 |
| 93.4 | 98 |
| 93.47 | 98 |
| 93.54 | 97.75 |
| 93.61 | 97.75 |
| 93.67 | 97.5 |
| 93.74 | 97.5 |
| 93.81 | 97.25 |
| 93.88 | 97.25 |
| 93.95 | 97.25 |
| 94.01 | 97.25 |
| 94.08 | 97 |
| 94.15 | 97 |
| 94.22 | 97 |
| 94.29 | 97 |
| 94.36 | 97 |
| 94.42 | 97 |
| 94.49 | 97 |
| 94.56 | 96.75 |
| 94.63 | 96.75 |
| 94.7 | 96.75 |
| 94.76 | 96.75 |
| 94.83 | 96.75 |
| 94.9 | 97 |
| 94.97 | 96.75 |
| 95.04 | 97 |
| 95.11 | 97 |
| 95.17 | 97 |
| 95.24 | 97 |
| 95.31 | 97 |
| 95.38 | 97.25 |
| 95.45 | 97.25 |
| 95.51 | 97.25 |
| 95.58 | 97.25 |
| 95.65 | 97.5 |
| 95.72 | 97.5 |
| 95.79 | 97.75 |
| 95.86 | 97.75 |
| 95.92 | 98 |
| 95.99 | 98 |
| 96.06 | 98.25 |
| 96.13 | 98.25 |
| 96.2 | 98.5 |
| 96.26 | 98.5 |
| 96.33 | 98.75 |
| 96.4 | 98.75 |
| 96.47 | 98.75 |
| 96.54 | 99 |
| 96.61 | 99.25 |
| 96.67 | 99.25 |
| 96.74 | 99.5 |
| 96.81 | 99.75 |
| 96.88 | 99.75 |
| 96.95 | 99.75 |
| 97.01 | 100 |
| 97.08 | 100 |
| 97.15 | 100 |
| 97.22 | 100 |
| 97.29 | 100.25 |
| 97.36 | 100.25 |
| 97.42 | 100.5 |
| 97.49 | 100.5 |
| 97.56 | 100.5 |
| 97.63 | 100.75 |
| 97.7 | 100.75 |
| 97.76 | 100.75 |
| 97.83 | 100.75 |
| 97.9 | 100.75 |
| 97.97 | 101 |
| 98.04 | 101 |
| 98.11 | 101 |
| 98.17 | 101 |
| 98.24 | 101 |
| 98.31 | 101 |
| 98.38 | 101 |
| 98.45 | 101 |
| 98.51 | 101 |
| 98.58 | 101 |
| 98.65 | 101 |
| 98.72 | 101 |
| 98.79 | 100.75 |
| 98.86 | 100.75 |
| 98.92 | 100.75 |
| 98.99 | 100.75 |
| 99.06 | 100.75 |
| 99.13 | 100.5 |
| 99.2 | 100.5 |
| 99.26 | 100.5 |
| 99.33 | 100.25 |
| 99.4 | 100.25 |
| 99.47 | 100.25 |
| 99.54 | 100 |
| 99.61 | 100 |
| 99.67 | 100 |
| 99.74 | 100 |
| 99.81 | 99.75 |
| 99.88 | 99.75 |
| 99.95 | 99.5 |
| 100.01 | 99.5 |
| 100.08 | 99.25 |
| 100.15 | 99.25 |
| 100.22 | 99 |
| 100.29 | 99 |
| 100.36 | 98.75 |
| 100.42 | 98.75 |
| 100.49 | 98.75 |
| 100.56 | 98.75 |
| 100.63 | 98.5 |
| 100.7 | 98.25 |
| 100.76 | 98.25 |
| 100.83 | 98.25 |
| 100.9 | 98 |
| 100.97 | 98 |
| 101.04 | 98 |
| 101.11 | 97.75 |
| 101.17 | 97.75 |
| 101.24 | 97.5 |
| 101.31 | 97.5 |
| 101.38 | 97.5 |
| 101.45 | 97.25 |
| 101.51 | 97.25 |
| 101.58 | 97.25 |
| 101.65 | 97.25 |
| 101.72 | 97.25 |
| 101.79 | 97 |
| 101.86 | 97 |
| 101.92 | 97 |
| 101.99 | 97 |
| 102.06 | 97 |
| 102.13 | 97 |
| 102.2 | 97 |
| 102.26 | 97 |
| 102.33 | 97 |
| 102.4 | 97.25 |
| 102.47 | 97 |
| 102.54 | 97.25 |
| 102.61 | 97.25 |
| 102.67 | 97.25 |
| 102.74 | 97.25 |
| 102.81 | 97.5 |
| 102.88 | 97.5 |
| 102.95 | 97.5 |
| 103.01 | 97.5 |
| 103.08 | 97.75 |
| 103.15 | 97.75 |
| 103.22 | 98 |
| 103.29 | 98 |
| 103.36 | 98 |
| 103.43 | 98.25 |
| 103.49 | 98.25 |
| 103.56 | 98.5 |
| 103.63 | 98.5 |
| 103.7 | 98.75 |
| 103.77 | 98.75 |
| 103.83 | 99 |
| 103.9 | 99 |
| 103.97 | 99.25 |
| 104.04 | 99.25 |
| 104.11 | 99.5 |
| 104.18 | 99.5 |
| 104.24 | 99.75 |
| 104.31 | 99.75 |
| 104.38 | 100 |
| 104.45 | 100 |
| 104.52 | 100 |
| 104.58 | 100 |
| 104.65 | 100.25 |
| 104.72 | 100.25 |
| 104.79 | 100.25 |
| 104.86 | 100.25 |
| 104.93 | 100.5 |
| 104.99 | 100.5 |
| 105.06 | 100.5 |
| 105.13 | 100.5 |
| 105.2 | 100.5 |
| 105.27 | 100.75 |
| 105.33 | 100.75 |
| 105.4 | 100.75 |
| 105.47 | 100.75 |
| 105.54 | 100.75 |
| 105.61 | 100.75 |
| 105.68 | 100.75 |
| 105.75 | 100.75 |
| 105.81 | 100.75 |
| 105.88 | 100.75 |
| 105.95 | 100.75 |
| 106.02 | 100.75 |
| 106.09 | 100.5 |
| 106.15 | 100.5 |
| 106.22 | 100.5 |
| 106.29 | 100.5 |
| 106.36 | 100.5 |
| 106.43 | 100.5 |
| 106.5 | 100.5 |
| 106.56 | 100.5 |
| 106.63 | 100.25 |
| 106.7 | 100.25 |
| 106.77 | 100.25 |
| 106.84 | 100 |
| 106.9 | 100 |
| 106.97 | 100 |
| 107.04 | 99.75 |
| 107.11 | 99.75 |
| 107.18 | 99.75 |
| 107.25 | 99.5 |
| 107.31 | 99.5 |
| 107.38 | 99.5 |
| 107.45 | 99.25 |
| 107.52 | 99.25 |
| 107.59 | 99 |
| 107.66 | 99 |
| 107.72 | 98.75 |
| 107.79 | 98.75 |
| 107.86 | 98.5 |
| 107.93 | 98.5 |
| 108.0 | 98.5 |
| 108.06 | 98.25 |
| 108.13 | 98.25 |
| 108.2 | 98 |
| 108.27 | 98 |
| 108.34 | 98 |
| 108.4 | 98 |
| 108.47 | 97.75 |
| 108.54 | 97.75 |
| 108.61 | 97.5 |
| 108.68 | 97.5 |
| 108.75 | 97.5 |
| 108.81 | 97.5 |
| 108.88 | 97.5 |
| 108.95 | 97.25 |
| 109.02 | 97.25 |
| 109.09 | 97.25 |
| 109.16 | 97.25 |
| 109.22 | 97.25 |
| 109.29 | 97.25 |
| 109.36 | 97.25 |
| 109.43 | 97.25 |
| 109.5 | 97.25 |
| 109.56 | 97.25 |
| 109.63 | 97.25 |
| 109.7 | 97.25 |
| 109.77 | 97.25 |
| 109.84 | 97.25 |
| 109.91 | 97.25 |
| 109.97 | 97.25 |
| 110.04 | 97.5 |
| 110.11 | 97.5 |
| 110.18 | 97.5 |
| 110.25 | 97.75 |
| 110.31 | 97.75 |
| 110.38 | 97.75 |
| 110.45 | 97.75 |
| 110.52 | 98 |
| 110.59 | 98.25 |
| 110.66 | 98.25 |
| 110.72 | 98.25 |
| 110.79 | 98.25 |
| 110.86 | 98.5 |
| 110.93 | 98.75 |
| 111.0 | 98.75 |
| 111.07 | 98.75 |
| 111.13 | 99 |
| 111.2 | 99 |
| 111.27 | 99 |
| 111.34 | 99 |
| 111.41 | 99.25 |
| 111.47 | 99.5 |
| 111.54 | 99.5 |
| 111.61 | 99.75 |
| 111.68 | 99.75 |
| 111.75 | 99.75 |
| 111.81 | 100 |
| 111.88 | 100 |
| 111.95 | 100 |
| 112.02 | 100 |
| 112.09 | 100.25 |
| 112.16 | 100.25 |
| 112.22 | 100.25 |
| 112.29 | 100.25 |
| 112.36 | 100.5 |
| 112.43 | 100.5 |
| 112.5 | 100.5 |
| 112.57 | 100.5 |
| 112.63 | 100.5 |
| 112.7 | 100.5 |
| 112.77 | 100.5 |
| 112.84 | 100.5 |
| 112.91 | 100.5 |
| 112.97 | 100.5 |
| 113.04 | 100.75 |
| 113.11 | 100.75 |
| 113.18 | 100.75 |
| 113.25 | 100.75 |
| 113.32 | 100.5 |
| 113.38 | 100.5 |
| 113.45 | 100.5 |
| 113.52 | 100.5 |
| 113.59 | 100.5 |
| 113.66 | 100.5 |
| 113.73 | 100.25 |
| 113.79 | 100.25 |
| 113.86 | 100.25 |
| 113.93 | 100.25 |
| 114.0 | 100.25 |
| 114.07 | 100 |
| 114.14 | 100 |
| 114.2 | 99.75 |
| 114.27 | 99.75 |
| 114.34 | 99.75 |
| 114.41 | 99.5 |
| 114.48 | 99.5 |
| 114.54 | 99.5 |
| 114.61 | 99.5 |
| 114.68 | 99.25 |
| 114.75 | 99.25 |
| 114.82 | 99 |
| 114.89 | 99 |
| 114.95 | 99 |
| 115.02 | 98.75 |
| 115.09 | 98.75 |
| 115.16 | 98.5 |
| 115.23 | 98.5 |
| 115.3 | 98.5 |
| 115.36 | 98.5 |
| 115.43 | 98.25 |
| 115.5 | 98.25 |
| 115.57 | 98.25 |
| 115.64 | 98 |
| 115.7 | 98 |
| 115.77 | 97.75 |
| 115.84 | 97.75 |
| 115.91 | 97.75 |
| 115.98 | 97.5 |
| 116.05 | 97.5 |
| 116.11 | 97.5 |
| 116.18 | 97.5 |
| 116.25 | 97.5 |
| 116.32 | 97.5 |
| 116.39 | 97.25 |
| 116.45 | 97.25 |
| 116.52 | 97.5 |
| 116.59 | 97.5 |
| 116.66 | 97.25 |
| 116.73 | 97.25 |
| 116.8 | 97.25 |
| 116.86 | 97.25 |
| 116.93 | 97.5 |
| 117.0 | 97.5 |
| 117.07 | 97.5 |
| 117.14 | 97.5 |
| 117.21 | 97.5 |
| 117.27 | 97.75 |
| 117.34 | 97.75 |
| 117.41 | 97.75 |
| 117.48 | 98 |
| 117.55 | 98 |
| 117.61 | 98 |
| 117.68 | 98 |
| 117.75 | 98 |
| 117.82 | 98 |
| 117.89 | 98.25 |
| 117.95 | 98.25 |
| 118.02 | 98.5 |
| 118.09 | 98.5 |
| 118.16 | 98.75 |
| 118.23 | 98.75 |
| 118.3 | 98.75 |
| 118.36 | 99 |
| 118.43 | 99 |
| 118.5 | 99.25 |
| 118.57 | 99.25 |
| 118.64 | 99.25 |
| 118.71 | 99.25 |
| 118.77 | 99.5 |
| 118.84 | 99.5 |
| 118.91 | 99.75 |
| 118.98 | 99.75 |
| 119.05 | 99.75 |
| 119.11 | 100 |
| 119.18 | 100 |
| 119.25 | 100 |
| 119.32 | 100 |
| 119.39 | 100 |
| 119.46 | 100 |
| 119.52 | 100.25 |
| 119.59 | 100.25 |
| 119.66 | 100.25 |
| 119.73 | 100.25 |
| 119.8 | 100.25 |
| 119.87 | 100.25 |
| 119.93 | 100.5 |
| 120.0 | 100.25 |
| 120.07 | 100.5 |
| 120.14 | 100.5 |
| 120.21 | 100.5 |
| 120.27 | 100.5 |
| 120.34 | 100.5 |
| 120.41 | 100.5 |
| 120.48 | 100.5 |
| 120.55 | 100.25 |
| 120.62 | 100.25 |
| 120.68 | 100.25 |
| 120.75 | 100.25 |
| 120.82 | 100.25 |
| 120.89 | 100.25 |
| 120.96 | 100.25 |
| 121.03 | 100 |
| 121.09 | 100 |
| 121.16 | 100 |
| 121.23 | 100 |
| 121.3 | 99.75 |
| 121.37 | 99.75 |
| 121.44 | 99.75 |
| 121.5 | 99.75 |
| 121.57 | 99.5 |
| 121.64 | 99.5 |
| 121.71 | 99.5 |
| 121.78 | 99.25 |
| 121.84 | 99.25 |
| 121.91 | 99.25 |
| 121.98 | 99.25 |
| 122.05 | 99 |
| 122.12 | 99 |
| 122.18 | 98.75 |
| 122.25 | 98.75 |
| 122.32 | 98.75 |
| 122.39 | 98.5 |
| 122.46 | 98.5 |
| 122.53 | 98.25 |
| 122.59 | 98.25 |
| 122.66 | 98 |
| 122.73 | 98 |
| 122.8 | 98.25 |
| 122.87 | 98 |
| 122.94 | 98 |
| 123.0 | 98 |
| 123.07 | 97.75 |
| 123.14 | 97.75 |
| 123.21 | 97.75 |
| 123.28 | 97.75 |
| 123.34 | 97.75 |
| 123.41 | 97.5 |
| 123.48 | 97.5 |
| 123.55 | 97.5 |
| 123.62 | 97.5 |
| 123.69 | 97.5 |
| 123.75 | 97.5 |
| 123.82 | 97.5 |
| 123.89 | 97.5 |
| 123.96 | 97.5 |
| 124.03 | 97.5 |
| 124.09 | 97.5 |
| 124.16 | 97.75 |
| 124.23 | 97.75 |
| 124.3 | 97.5 |
| 124.37 | 97.5 |
| 124.44 | 97.75 |
| 124.5 | 97.75 |
| 124.57 | 97.75 |
| 124.64 | 98 |
| 124.71 | 98 |
| 124.78 | 97.75 |
| 124.84 | 97.25 |
| 124.91 | 97.25 |
| 124.98 | 97 |
| 125.05 | 97 |
| 125.12 | 96.75 |
| 125.19 | 96.75 |
| 125.25 | 96.5 |
| 125.32 | 96 |
| 125.39 | 95.75 |
| 125.46 | 95.5 |
| 125.53 | 95 |
| 125.59 | 94.5 |
| 125.66 | 94.25 |
| 125.73 | 94 |
| 125.8 | 93.5 |
| 125.87 | 93.25 |
| 125.93 | 92.75 |
| 126.0 | 92.75 |
| 126.07 | 92.5 |
| 126.14 | 92 |
| 126.21 | 91.5 |
| 126.27 | 91.25 |
| 126.34 | 90.75 |
| 126.41 | 90.5 |
| 126.48 | 90 |
| 126.55 | 89.75 |
| 126.61 | 89.25 |
| 126.68 | 88.75 |
| 126.75 | 88.5 |
| 126.82 | 88.5 |
| 126.89 | 88 |
| 126.95 | 87.75 |
| 127.02 | 87.25 |
| 127.09 | 87 |
| 127.16 | 86.5 |
| 127.23 | 86.25 |
| 127.3 | 85.75 |
| 127.36 | 85.5 |
| 127.43 | 85.25 |
| 127.5 | 85 |
| 127.57 | 84.5 |
| 127.64 | 84.5 |
| 127.7 | 84.25 |
| 127.77 | 84 |
| 127.84 | 83.75 |
| 127.91 | 83.25 |
| 127.98 | 83 |
| 128.05 | 82.75 |
| 128.11 | 82.25 |
| 128.18 | 82.25 |
| 128.25 | 81.75 |
| 128.32 | 81.5 |
| 128.39 | 81.25 |
| 128.45 | 81.25 |
| 128.52 | 80.75 |
| 128.59 | 80.75 |
| 128.66 | 80.5 |
| 128.73 | 80.25 |
| 128.79 | 80 |
| 128.86 | 79.5 |
| 128.93 | 79.5 |
| 129.0 | 79 |
| 129.07 | 79 |
| 129.13 | 78.75 |
| 129.2 | 78.75 |
| 129.27 | 78.25 |
| 129.34 | 78 |
| 129.41 | 77.75 |
| 129.47 | 77.5 |
| 129.54 | 77.5 |
| 129.61 | 77 |
| 129.68 | 77 |
| 129.75 | 76.75 |
| 129.82 | 76.5 |
| 129.88 | 76 |
| 129.95 | 76 |
| 130.02 | 76 |
| 130.09 | 75.75 |
| 130.16 | 75.5 |
| 130.22 | 75.25 |
| 130.29 | 75 |
| 130.36 | 74.75 |
| 130.43 | 74.5 |
| 130.5 | 74.5 |
| 130.56 | 74.25 |
| 130.63 | 74 |
| 130.7 | 73.75 |
| 130.77 | 73.5 |
| 130.84 | 73.5 |
| 130.91 | 73.25 |
| 130.97 | 73 |
| 131.04 | 73 |
| 131.11 | 72.75 |
| 131.18 | 72.5 |
| 131.25 | 72.25 |
| 131.31 | 72 |
| 131.38 | 71.75 |
| 131.45 | 71.5 |
| 131.52 | 71.5 |
| 131.59 | 71.25 |
| 131.65 | 71.25 |
| 131.72 | 71 |
| 131.79 | 71 |
| 131.86 | 70.75 |
| 131.93 | 70.5 |
| 131.99 | 70.25 |
| 132.06 | 70 |
| 132.13 | 69.75 |
| 132.2 | 69.75 |
| 132.27 | 69.5 |
| 132.33 | 69.25 |
| 132.4 | 69.25 |
| 132.47 | 69.25 |
| 132.54 | 69 |
| 132.61 | 68.75 |
| 132.67 | 68.5 |
| 132.74 | 68.5 |
| 132.81 | 68.25 |
| 132.88 | 68.25 |
| 132.95 | 68.5 |
| 133.02 | 68.5 |
| 133.08 | 68.5 |
| 133.15 | 68.5 |
| 133.22 | 68.75 |
| 133.29 | 68.75 |
| 133.36 | 68.75 |
| 133.43 | 68.75 |
| 133.49 | 68.75 |
| 133.56 | 69 |
| 133.63 | 69 |
| 133.7 | 69.25 |
| 133.77 | 69.25 |
| 133.83 | 69.25 |
| 133.9 | 69.25 |
| 133.97 | 69.5 |
| 134.04 | 69.5 |
| 134.11 | 69.5 |
| 134.17 | 69.5 |
| 134.24 | 69.75 |
| 134.31 | 69.75 |
| 134.38 | 69.75 |
| 134.45 | 69.75 |
| 134.52 | 69.75 |
| 134.58 | 69.75 |
| 134.65 | 69.75 |
| 134.72 | 69.75 |
| 134.79 | 69.75 |
| 134.86 | 69.75 |
| 134.93 | 69.75 |
| 134.99 | 69.75 |
| 135.06 | 69.75 |
| 135.13 | 69.75 |
| 135.2 | 69.75 |
| 135.27 | 69.75 |
| 135.33 | 69.75 |
| 135.4 | 69.5 |
| 135.47 | 69.5 |
| 135.54 | 69.5 |
| 135.61 | 69.5 |
| 135.68 | 69.25 |
| 135.74 | 69.25 |
| 135.81 | 69.25 |
| 135.88 | 69.25 |
| 135.95 | 69.25 |
| 136.02 | 69 |
| 136.08 | 69 |
| 136.15 | 69 |
| 136.22 | 69 |
| 136.29 | 68.75 |
| 136.36 | 68.75 |
| 136.43 | 68.75 |
| 136.49 | 68.75 |
| 136.56 | 68.75 |
| 136.63 | 68.5 |
| 136.7 | 68.5 |
| 136.77 | 68.5 |
| 136.84 | 68.5 |
| 136.9 | 68.25 |
| 136.97 | 68.25 |
| 137.04 | 68.25 |
| 137.11 | 68.25 |
| 137.18 | 68 |
| 137.24 | 68 |
| 137.31 | 68 |
| 137.38 | 68 |
| 137.45 | 68 |
| 137.52 | 67.75 |
| 137.58 | 67.75 |
| 137.65 | 67.75 |
| 137.72 | 67.75 |
| 137.79 | 67.5 |
| 137.86 | 67.5 |
| 137.93 | 67.5 |
| 137.99 | 67.5 |
| 138.06 | 67.5 |
| 138.13 | 68 |
| 138.2 | 68 |
| 138.27 | 68.25 |
| 138.33 | 68.75 |
| 138.4 | 69.25 |
| 138.47 | 69.5 |
| 138.54 | 70 |
| 138.61 | 70.5 |
| 138.68 | 71 |
| 138.74 | 71.25 |
| 138.81 | 71.5 |
| 138.88 | 72 |
| 138.95 | 72.25 |
| 139.02 | 72.25 |
| 139.08 | 72.75 |
| 139.15 | 73 |
| 139.22 | 73.25 |
| 139.29 | 73.75 |
| 139.36 | 74 |
| 139.42 | 74.5 |
| 139.49 | 74.75 |
| 139.56 | 75 |
| 139.63 | 75.5 |
| 139.7 | 75.75 |
| 139.76 | 75.75 |
| 139.83 | 76 |
| 139.9 | 76.5 |
| 139.97 | 76.75 |
| 140.04 | 77 |
| 140.11 | 77.25 |
| 140.17 | 77.75 |
| 140.24 | 78 |
| 140.31 | 78.25 |
| 140.38 | 78.75 |
| 140.45 | 79 |
| 140.51 | 79.25 |
| 140.58 | 79.25 |
| 140.65 | 79.5 |
| 140.72 | 80 |
| 140.79 | 80.25 |
| 140.86 | 80.5 |
| 140.92 | 80.75 |
| 140.99 | 81 |
| 141.06 | 81.25 |
| 141.13 | 81.5 |
| 141.2 | 82 |
| 141.26 | 82.25 |
| 141.33 | 82.5 |
| 141.4 | 82.5 |
| 141.47 | 82.75 |
| 141.54 | 83 |
| 141.6 | 83.25 |
| 141.67 | 83.5 |
| 141.74 | 83.75 |
| 141.81 | 84 |
| 141.88 | 84.25 |
| 141.94 | 84.5 |
| 142.01 | 84.75 |
| 142.08 | 85 |
| 142.15 | 85.25 |
| 142.22 | 85.25 |
| 142.29 | 85.5 |
| 142.35 | 85.5 |
| 142.42 | 86 |
| 142.49 | 86.25 |
| 142.56 | 86.5 |
| 142.63 | 86.75 |
| 142.69 | 86.75 |
| 142.76 | 87 |
| 142.83 | 87.5 |
| 142.9 | 87.5 |
| 142.97 | 87.75 |
| 143.03 | 87.75 |
| 143.1 | 88 |
| 143.17 | 88.25 |
| 143.24 | 88.5 |
| 143.31 | 88.75 |
| 143.38 | 89 |
| 143.44 | 89 |
| 143.51 | 89.25 |
| 143.58 | 89.5 |
| 143.65 | 89.75 |
| 143.72 | 90 |
| 143.78 | 90.25 |
| 143.85 | 90.25 |
| 143.92 | 90.25 |
| 143.99 | 90.5 |
| 144.06 | 90.75 |
| 144.12 | 91 |
| 144.19 | 91 |
| 144.26 | 91.25 |
| 144.33 | 91.5 |
| 144.4 | 91.75 |
| 144.47 | 91.75 |
| 144.53 | 92 |
| 144.6 | 92.25 |
| 144.67 | 92.25 |
| 144.74 | 92.5 |
| 144.8 | 92.5 |
| 144.87 | 92.75 |
| 144.94 | 93 |
| 145.01 | 93.25 |
| 145.08 | 93.25 |
| 145.15 | 93.5 |
| 145.21 | 93.75 |
| 145.28 | 93.75 |
| 145.35 | 94 |
| 145.42 | 94.25 |
| 145.49 | 94.25 |
| 145.55 | 94.25 |
| 145.62 | 94.5 |
| 145.69 | 94.75 |
| 145.76 | 94.75 |
| 145.83 | 95 |
| 145.9 | 95.25 |
| 145.96 | 95.5 |
| 146.03 | 95.5 |
| 146.1 | 95.75 |
| 146.17 | 95.75 |
| 146.24 | 96 |
| 146.3 | 96 |
| 146.37 | 96.25 |
| 146.44 | 96.25 |
| 146.51 | 96.5 |
| 146.58 | 96.5 |
| 146.64 | 96.75 |
| 146.71 | 97 |
| 146.78 | 97 |
| 146.85 | 97.25 |
| 146.92 | 97.5 |
| 146.99 | 97.5 |
| 147.05 | 97.5 |
| 147.12 | 97.75 |
| 147.19 | 98 |
| 147.26 | 98 |
| 147.33 | 98.25 |
| 147.39 | 98.25 |
| 147.46 | 98.5 |
| 147.53 | 98.5 |
| 147.6 | 98.75 |
| 147.67 | 98.75 |
| 147.74 | 99 |
| 147.8 | 99.25 |
| 147.87 | 99.25 |
| 147.94 | 99.25 |
| 148.01 | 99.25 |
| 148.08 | 99.5 |
| 148.14 | 99.5 |
| 148.21 | 99.75 |
| 148.28 | 99.75 |
| 148.35 | 100 |
| 148.42 | 100 |
| 148.49 | 100.25 |
| 148.55 | 100.25 |
| 148.62 | 100.25 |
| 148.69 | 100.25 |
| 148.76 | 100.5 |
| 148.83 | 100.5 |
| 148.89 | 100.5 |
| 148.96 | 100.75 |
| 149.03 | 100.75 |
| 149.1 | 100.75 |
| 149.17 | 100.75 |
| 149.24 | 101 |
| 149.3 | 101 |
| 149.37 | 101 |
| 149.44 | 101 |
| 149.51 | 101 |
| 149.58 | 101 |
| 149.65 | 101 |
| 149.71 | 101 |
| 149.78 | 101 |
| 149.85 | 101 |
| 149.92 | 101 |
| 149.99 | 101 |
| 150.05 | 100.75 |
| 150.12 | 100.25 |
| 150.19 | 99.75 |
| 150.26 | 99.5 |
| 150.33 | 99.5 |
| 150.39 | 99.25 |
| 150.46 | 99 |
| 150.53 | 98.5 |
| 150.6 | 98 |
| 150.67 | 97.75 |
| 150.73 | 97.25 |
| 150.8 | 96.75 |
| 150.87 | 96.25 |
| 150.94 | 95.75 |
| 151.01 | 95 |
| 151.08 | 94.5 |
| 151.14 | 94.5 |
| 151.21 | 94 |
| 151.28 | 93.5 |
| 151.35 | 93 |
| 151.41 | 92.5 |
| 151.48 | 92 |
| 151.55 | 91.25 |
| 151.62 | 90.75 |
| 151.69 | 90.25 |
| 151.76 | 89.75 |
| 151.82 | 89.25 |
| 151.89 | 88.75 |
| 151.96 | 88.75 |
| 152.03 | 88.25 |
| 152.1 | 87.75 |
| 152.16 | 87.25 |
| 152.23 | 87 |
| 152.3 | 86.5 |
| 152.37 | 86 |
| 152.44 | 85.5 |
| 152.51 | 85.25 |
| 152.57 | 84.75 |
| 152.64 | 84.25 |
| 152.71 | 84 |
| 152.78 | 84 |
| 152.85 | 83.5 |
| 152.91 | 83 |
| 152.98 | 82.75 |
| 153.05 | 82.5 |
| 153.12 | 82 |
| 153.19 | 81.75 |
| 153.25 | 81.25 |
| 153.32 | 81 |
| 153.39 | 80.5 |
| 153.46 | 80.25 |
| 153.53 | 80 |
| 153.59 | 80 |
| 153.66 | 79.75 |
| 153.73 | 79.25 |
| 153.8 | 79 |
| 153.87 | 78.75 |
| 153.93 | 78.25 |
| 154.0 | 78 |
| 154.07 | 77.75 |
| 154.14 | 77.25 |
| 154.21 | 77 |
| 154.27 | 76.75 |
| 154.34 | 76.75 |
| 154.41 | 76.5 |
| 154.48 | 76.25 |
| 154.55 | 76 |
| 154.62 | 75.5 |
| 154.68 | 75.25 |
| 154.75 | 75 |
| 154.82 | 74.75 |
| 154.89 | 74.5 |
| 154.96 | 74.25 |
| 155.02 | 74 |
| 155.09 | 73.75 |
| 155.16 | 73.75 |
| 155.23 | 73.5 |
| 155.3 | 73.25 |
| 155.36 | 73 |
| 155.43 | 72.5 |
| 155.5 | 72.25 |
| 155.57 | 72 |
| 155.64 | 72 |
| 155.71 | 71.5 |
| 155.77 | 71.5 |
| 155.84 | 71.25 |
| 155.91 | 71 |
| 155.98 | 71 |
| 156.05 | 70.75 |
| 156.11 | 70.5 |
| 156.18 | 70.25 |
| 156.25 | 70 |
| 156.32 | 69.75 |
| 156.39 | 69.5 |
| 156.45 | 69.25 |
| 156.52 | 69 |
| 156.59 | 68.75 |
| 156.66 | 68.75 |
| 156.73 | 68.5 |
| 156.79 | 68.5 |
| 156.86 | 68.25 |
| 156.93 | 68 |
| 157.0 | 68.25 |
| 157.07 | 68.5 |
| 157.13 | 68.5 |
| 157.2 | 68.75 |
| 157.27 | 68.75 |
| 157.34 | 68.75 |
| 157.41 | 69 |
| 157.48 | 69 |
| 157.54 | 69.25 |
| 157.61 | 69.25 |
| 157.68 | 69.25 |
| 157.75 | 69.25 |
| 157.82 | 69.25 |
| 157.88 | 69.5 |
| 157.95 | 69.5 |
| 158.02 | 69.75 |
| 158.09 | 69.75 |
| 158.16 | 69.75 |
| 158.23 | 70 |
| 158.3 | 70 |
| 158.36 | 70 |
| 158.43 | 70 |
| 158.5 | 70.25 |
| 158.57 | 70.25 |
| 158.64 | 70.25 |
| 158.7 | 70.25 |
| 158.77 | 70.5 |
| 158.84 | 70.5 |
| 158.91 | 70.5 |
| 158.98 | 70.5 |
| 159.05 | 70.25 |
| 159.11 | 70.25 |
| 159.18 | 70.25 |
| 159.25 | 70.25 |
| 159.32 | 70.25 |
| 159.39 | 70.25 |
| 159.45 | 70 |
| 159.52 | 69.75 |
| 159.59 | 69.75 |
| 159.66 | 69.75 |
| 159.73 | 69.75 |
| 159.8 | 69.5 |
| 159.86 | 69.5 |
| 159.93 | 69.25 |
| 160.0 | 69.25 |
| 160.07 | 69.25 |
| 160.14 | 69.25 |
| 160.2 | 69.25 |
| 160.27 | 69 |
| 160.34 | 69 |
| 160.41 | 69 |
| 160.48 | 68.75 |
| 160.55 | 68.75 |
| 160.61 | 68.75 |
| 160.68 | 68.5 |
| 160.75 | 68.5 |
| 160.82 | 68.5 |
| 160.89 | 68.5 |
| 160.96 | 68.5 |
| 161.02 | 68.25 |
| 161.09 | 68.25 |
| 161.16 | 68.25 |
| 161.23 | 68 |
| 161.3 | 68 |
| 161.36 | 68 |
| 161.43 | 68 |
| 161.5 | 67.75 |
| 161.57 | 67.75 |
| 161.64 | 67.5 |
| 161.7 | 67.5 |
| 161.77 | 67.5 |
| 161.84 | 67.5 |
| 161.91 | 67.25 |
| 161.98 | 67.25 |
| 162.05 | 67.25 |
| 162.11 | 67.5 |
| 162.18 | 67.75 |
| 162.25 | 68 |
| 162.32 | 68.25 |
| 162.38 | 68.75 |
| 162.45 | 69.25 |
| 162.52 | 69.25 |
| 162.59 | 69.75 |
| 162.66 | 70.25 |
| 162.73 | 70.75 |
| 162.8 | 71 |
| 162.86 | 71.25 |
| 162.93 | 71.5 |
| 163.0 | 72 |
| 163.07 | 72.25 |
| 163.13 | 72.75 |
| 163.2 | 73 |
| 163.27 | 73.25 |
| 163.34 | 73.25 |
| 163.41 | 73.5 |
| 163.48 | 74 |
| 163.54 | 74.25 |
| 163.61 | 74.5 |
| 163.68 | 75 |
| 163.75 | 75.25 |
| 163.82 | 75.5 |
| 163.88 | 76 |
| 163.95 | 76.25 |
| 164.02 | 76.5 |
| 164.09 | 76.75 |
| 164.16 | 76.75 |
| 164.23 | 77.25 |
| 164.29 | 77.25 |
| 164.36 | 77.5 |
| 164.43 | 78 |
| 164.5 | 78.25 |
| 164.57 | 78.5 |
| 164.63 | 79 |
| 164.7 | 79.25 |
| 164.77 | 79.5 |
| 164.84 | 79.75 |
| 164.91 | 80 |
| 164.97 | 80 |
| 165.04 | 80.25 |
| 165.11 | 80.5 |
| 165.18 | 80.75 |
| 165.25 | 81 |
| 165.32 | 81.25 |
| 165.38 | 81.5 |
| 165.45 | 81.75 |
| 165.52 | 82 |
| 165.59 | 82.25 |
| 165.66 | 82.5 |
| 165.72 | 83 |
| 165.79 | 83 |
| 165.86 | 83 |
| 165.93 | 83.25 |
| 166.0 | 83.5 |
| 166.07 | 83.75 |
| 166.13 | 84 |
| 166.2 | 84.25 |
| 166.27 | 84.5 |
| 166.34 | 84.75 |
| 166.41 | 85 |
| 166.47 | 85.25 |
| 166.54 | 85.25 |
| 166.61 | 85.5 |
| 166.68 | 85.5 |
| 166.75 | 85.75 |
| 166.81 | 86.25 |
| 166.88 | 86.5 |
| 166.95 | 86.5 |
| 167.02 | 86.75 |
| 167.09 | 87 |
| 167.15 | 87.25 |
| 167.22 | 87.5 |
| 167.29 | 87.75 |
| 167.36 | 87.75 |
| 167.43 | 87.75 |
| 167.49 | 88 |
| 167.56 | 88.25 |
| 167.63 | 88.5 |
| 167.7 | 88.75 |
| 167.77 | 88.75 |
| 167.84 | 89 |
| 167.9 | 89.25 |
| 167.97 | 89.25 |
| 168.04 | 89.75 |
| 168.11 | 89.75 |
| 168.18 | 89.75 |
| 168.24 | 90 |
| 168.31 | 90.25 |
| 168.38 | 90.5 |
| 168.45 | 90.75 |
| 168.52 | 90.75 |
| 168.58 | 91 |
| 168.65 | 91.25 |
| 168.72 | 91.5 |
| 168.79 | 91.5 |
| 168.86 | 91.75 |
| 168.93 | 92 |
| 168.99 | 92 |
| 169.06 | 92 |
| 169.13 | 92.25 |
| 169.2 | 92.5 |
| 169.27 | 92.75 |
| 169.33 | 93 |
| 169.4 | 93 |
| 169.47 | 93.25 |
| 169.54 | 93.5 |
| 169.61 | 93.5 |
| 169.67 | 93.75 |
| 169.74 | 94 |
| 169.81 | 94 |
| 169.88 | 94 |
| 169.95 | 94.25 |
| 170.01 | 94.25 |
| 170.08 | 94.5 |
| 170.15 | 94.75 |
| 170.22 | 95 |
| 170.29 | 95 |
| 170.36 | 95.25 |
| 170.42 | 95.5 |
| 170.49 | 95.5 |
| 170.56 | 95.75 |
| 170.63 | 95.75 |
| 170.7 | 96 |
| 170.76 | 96 |
| 170.83 | 96.25 |
| 170.9 | 96.5 |
| 170.97 | 96.5 |
| 171.04 | 96.75 |
| 171.11 | 97 |
| 171.17 | 97 |
| 171.24 | 97.25 |
| 171.31 | 97.25 |
| 171.38 | 97.5 |
| 171.45 | 97.5 |
| 171.51 | 97.5 |
| 171.58 | 97.75 |
| 171.65 | 98 |
| 171.72 | 98 |
| 171.79 | 98.25 |
| 171.85 | 98.25 |
| 171.92 | 98.5 |
| 171.99 | 98.75 |
| 172.06 | 98.75 |
| 172.13 | 99 |
| 172.19 | 99 |
| 172.26 | 99 |
| 172.33 | 99.25 |
| 172.4 | 99.25 |
| 172.47 | 99.5 |
| 172.54 | 99.75 |
| 172.6 | 99.75 |
| 172.67 | 99.75 |
| 172.74 | 100 |
| 172.81 | 100 |
| 172.88 | 100.25 |
| 172.95 | 100.25 |
| 173.01 | 100.5 |
| 173.08 | 100.5 |
| 173.15 | 100.5 |
| 173.22 | 100.5 |
| 173.29 | 100.75 |
| 173.36 | 100.75 |
| 173.42 | 100.75 |
| 173.49 | 101 |
| 173.56 | 101 |
| 173.63 | 101 |
| 173.7 | 101 |
| 173.76 | 101 |
| 173.83 | 101.25 |
| 173.9 | 101.25 |
| 173.97 | 101 |
| 174.04 | 101.25 |
| 174.11 | 101.25 |
| 174.17 | 101 |
| 174.24 | 101 |
| 174.31 | 100.75 |
| 174.38 | 100.75 |
| 174.45 | 100.25 |
| 174.51 | 99.75 |
| 174.58 | 99.5 |
| 174.65 | 99.25 |
| 174.72 | 99.25 |
| 174.79 | 98.75 |
| 174.85 | 98.5 |
| 174.92 | 98 |
| 174.99 | 97.5 |
| 175.06 | 97 |
| 175.13 | 96.5 |
| 175.2 | 96 |
| 175.26 | 95.5 |
| 175.33 | 95 |
| 175.4 | 94.5 |
| 175.47 | 94 |
| 175.54 | 94 |
| 175.6 | 93.25 |
| 175.67 | 92.75 |
| 175.74 | 92.25 |
| 175.81 | 91.75 |
| 175.88 | 91.25 |
| 175.94 | 90.75 |
| 176.01 | 90 |
| 176.08 | 89.5 |
| 176.15 | 89.25 |
| 176.22 | 88.75 |
| 176.28 | 88.75 |
| 176.35 | 88 |
| 176.42 | 87.75 |
| 176.49 | 87.25 |
| 176.56 | 86.75 |
| 176.62 | 86.25 |
| 176.69 | 85.75 |
| 176.76 | 85.25 |
| 176.83 | 85 |
| 176.9 | 84.5 |
| 176.96 | 84.25 |
| 177.03 | 83.75 |
| 177.1 | 83.75 |
| 177.17 | 83.25 |
| 177.24 | 83 |
| 177.3 | 82.5 |
| 177.37 | 82.25 |
| 177.44 | 81.75 |
| 177.51 | 81.25 |
| 177.58 | 81 |
| 177.65 | 80.75 |
| 177.71 | 80.25 |
| 177.78 | 80 |
| 177.85 | 79.5 |
| 177.92 | 79.5 |
| 177.99 | 79.25 |
| 178.05 | 79 |
| 178.12 | 78.5 |
| 178.19 | 78.25 |
| 178.26 | 78 |
| 178.33 | 77.5 |
| 178.4 | 77.25 |
| 178.46 | 77 |
| 178.53 | 76.75 |
| 178.6 | 76.5 |
| 178.67 | 76 |
| 178.74 | 76 |
| 178.8 | 75.75 |
| 178.87 | 75.5 |
| 178.94 | 75.25 |
| 179.01 | 74.75 |
| 179.08 | 74.5 |
| 179.14 | 74.5 |
| 179.21 | 74.25 |
| 179.28 | 73.75 |
| 179.35 | 73.5 |
| 179.42 | 73.25 |
| 179.48 | 73 |
| 179.55 | 73 |
| 179.62 | 72.75 |
| 179.69 | 72.5 |
| 179.76 | 72.25 |
| 179.82 | 71.75 |
| 179.89 | 71.75 |
| 179.96 | 71.5 |
| 180.03 | 71.25 |
| 180.1 | 71 |
| 180.16 | 70.75 |
| 180.23 | 70.5 |
| 180.3 | 70.5 |
| 180.37 | 70.25 |
| 180.44 | 70 |
| 180.51 | 69.75 |
| 180.57 | 69.5 |
| 180.64 | 69.25 |
| 180.71 | 69 |
| 180.78 | 68.75 |
| 180.85 | 68.5 |
| 180.91 | 68.25 |
| 180.98 | 68 |
| 181.05 | 68.25 |
| 181.12 | 68.25 |
| 181.19 | 68.5 |
| 181.26 | 68.5 |
| 181.32 | 68.75 |
| 181.39 | 68.75 |
| 181.46 | 68.75 |
| 181.53 | 69 |
| 181.6 | 69 |
| 181.66 | 69.25 |
| 181.73 | 69.25 |
| 181.8 | 69.25 |
| 181.87 | 69.25 |
| 181.94 | 69.25 |
| 182.0 | 69.5 |
| 182.07 | 69.5 |
| 182.14 | 69.75 |
| 182.21 | 69.75 |
| 182.28 | 69.75 |
| 182.35 | 69.75 |
| 182.41 | 70 |
| 182.48 | 70 |
| 182.55 | 70 |
| 182.62 | 70 |
| 182.69 | 70 |
| 182.76 | 70 |
| 182.82 | 70.25 |
| 182.89 | 70.25 |
| 182.96 | 70.25 |
| 183.03 | 70.25 |
| 183.1 | 70 |
| 183.16 | 70.25 |
| 183.23 | 70 |
| 183.3 | 70 |
| 183.37 | 70 |
| 183.44 | 70 |
| 183.51 | 70 |
| 183.57 | 70 |
| 183.64 | 69.75 |
| 183.71 | 69.75 |
| 183.78 | 69.75 |
| 183.85 | 69.5 |
| 183.91 | 69.5 |
| 183.98 | 69.5 |
| 184.05 | 69.25 |
| 184.12 | 69.25 |
| 184.19 | 69.25 |
| 184.26 | 69.25 |
| 184.32 | 69 |
| 184.39 | 69 |
| 184.46 | 69 |
| 184.53 | 68.75 |
| 184.6 | 68.75 |
| 184.66 | 68.75 |
| 184.73 | 68.5 |
| 184.8 | 68.5 |
| 184.87 | 68.5 |
| 184.94 | 68.5 |
| 185.01 | 68.25 |
| 185.07 | 68.25 |
| 185.14 | 68.25 |
| 185.21 | 68.25 |
| 185.28 | 68 |
| 185.35 | 68 |
| 185.41 | 68 |
| 185.48 | 68 |
| 185.55 | 67.75 |
| 185.62 | 67.75 |
| 185.69 | 67.75 |
| 185.76 | 67.5 |
| 185.82 | 67.5 |
| 185.89 | 67.5 |
| 185.96 | 67.5 |
| 186.03 | 67.5 |
| 186.1 | 67.25 |
| 186.16 | 67.25 |
| 186.23 | 67.25 |
| 186.3 | 67.25 |
| 186.37 | 67.5 |
| 186.44 | 67.75 |
| 186.51 | 68 |
| 186.57 | 68.5 |
| 186.64 | 69.25 |
| 186.71 | 69.5 |
| 186.78 | 70 |
| 186.85 | 70 |
| 186.91 | 70.5 |
| 186.98 | 70.75 |
| 187.05 | 71 |
| 187.12 | 71.5 |
| 187.19 | 71.75 |
| 187.25 | 72 |
| 187.32 | 72.5 |
| 187.39 | 72.75 |
| 187.46 | 73 |
| 187.53 | 73.5 |
| 187.6 | 73.75 |
| 187.66 | 73.75 |
| 187.73 | 74.25 |
| 187.8 | 74.5 |
| 187.87 | 74.75 |
| 187.94 | 75 |
| 188.0 | 75.25 |
| 188.07 | 75.75 |
| 188.14 | 76 |
| 188.21 | 76.25 |
| 188.28 | 76.75 |
| 188.34 | 77 |
| 188.41 | 77.25 |
| 188.48 | 77.25 |
| 188.55 | 77.5 |
| 188.62 | 77.75 |
| 188.69 | 78 |
| 188.75 | 78.5 |
| 188.82 | 78.75 |
| 188.89 | 79 |
| 188.96 | 79.25 |
| 189.03 | 79.5 |
| 189.09 | 79.75 |
| 189.16 | 80 |
| 189.23 | 80.25 |
| 189.3 | 80.25 |
| 189.37 | 80.75 |
| 189.43 | 80.75 |
| 189.5 | 81.25 |
| 189.57 | 81.5 |
| 189.64 | 81.75 |
| 189.71 | 82 |
| 189.77 | 82 |
| 189.84 | 82.5 |
| 189.91 | 82.75 |
| 189.98 | 82.75 |
| 190.05 | 83 |
| 190.12 | 83 |
| 190.18 | 83.25 |
| 190.25 | 83.5 |
| 190.32 | 83.75 |
| 190.39 | 84.25 |
| 190.46 | 84.25 |
| 190.52 | 84.5 |
| 190.59 | 84.75 |
| 190.66 | 85 |
| 190.73 | 85.25 |
| 190.8 | 85.5 |
| 190.87 | 85.75 |
| 190.93 | 85.75 |
| 191.0 | 85.75 |
| 191.07 | 86.25 |
| 191.14 | 86.25 |
| 191.21 | 86.5 |
| 191.27 | 86.75 |
| 191.34 | 87 |
| 191.41 | 87.25 |
| 191.48 | 87.25 |
| 191.55 | 87.5 |
| 191.61 | 87.75 |
| 191.68 | 88 |
| 191.75 | 88 |
| 191.82 | 88 |
| 191.89 | 88.5 |
| 191.95 | 88.5 |
| 192.02 | 88.75 |
| 192.09 | 89 |
| 192.16 | 89.25 |
| 192.23 | 89.5 |
| 192.3 | 89.5 |
| 192.36 | 89.75 |
| 192.43 | 90 |
| 192.5 | 90.25 |
| 192.57 | 90.25 |
| 192.64 | 90.5 |
| 192.7 | 90.5 |
| 192.77 | 90.75 |
| 192.84 | 91 |
| 192.91 | 91 |
| 192.98 | 91.25 |
| 193.05 | 91.5 |
| 193.11 | 91.75 |
| 193.18 | 91.75 |
| 193.25 | 92 |
| 193.32 | 92 |
| 193.38 | 92.25 |
| 193.45 | 92.5 |
| 193.52 | 92.75 |
| 193.59 | 92.75 |
| 193.66 | 93 |
| 193.73 | 93.25 |
| 193.79 | 93.25 |
| 193.86 | 93.5 |
| 193.93 | 93.75 |
| 194.0 | 93.75 |
| 194.07 | 94 |
| 194.13 | 94 |
| 194.2 | 94.25 |
| 194.27 | 94.25 |
| 194.34 | 94.5 |
| 194.41 | 94.75 |
| 194.48 | 94.75 |
| 194.54 | 95 |
| 194.61 | 95.25 |
| 194.68 | 95.5 |
| 194.75 | 95.5 |
| 194.82 | 95.75 |
| 194.88 | 95.75 |
| 194.95 | 95.75 |
| 195.02 | 96 |
| 195.09 | 96.25 |
| 195.16 | 96.25 |
| 195.23 | 96.5 |
| 195.29 | 96.75 |
| 195.36 | 96.75 |
| 195.43 | 97 |
| 195.5 | 97 |
| 195.57 | 97.25 |
| 195.63 | 97.25 |
| 195.7 | 97.5 |
| 195.77 | 97.5 |
| 195.84 | 97.5 |
| 195.91 | 97.75 |
| 195.97 | 98 |
| 196.04 | 98 |
| 196.11 | 98.25 |
| 196.18 | 98.5 |
| 196.25 | 98.5 |
| 196.32 | 98.75 |
| 196.38 | 98.75 |
| 196.45 | 99 |
| 196.52 | 99 |
| 196.59 | 99 |
| 196.66 | 99.25 |
| 196.72 | 99.5 |
| 196.79 | 99.5 |
| 196.86 | 99.75 |
| 196.93 | 99.75 |
| 197.0 | 99.75 |
| 197.06 | 100 |
| 197.13 | 100.25 |
| 197.2 | 100.25 |
| 197.27 | 100.25 |
| 197.34 | 100.5 |
| 197.41 | 100.5 |
| 197.47 | 100.5 |
| 197.54 | 100.75 |
| 197.61 | 100.75 |
| 197.68 | 101 |
| 197.75 | 101 |
| 197.82 | 101 |
| 197.88 | 101 |
| 197.95 | 101.25 |
| 198.02 | 101.25 |
| 198.09 | 101.25 |
| 198.16 | 101.25 |
| 198.22 | 101.25 |
| 198.29 | 101.25 |
| 198.36 | 101.25 |
| 198.43 | 101.25 |
| 198.5 | 101 |
| 198.57 | 101 |
| 198.63 | 101 |
| 198.7 | 101 |
| 198.77 | 100.5 |
| 198.84 | 100.25 |
| 198.91 | 99.75 |
| 198.97 | 99.5 |
| 199.04 | 99.5 |
| 199.11 | 99.25 |
| 199.18 | 99 |
| 199.25 | 98.5 |
| 199.32 | 98 |
| 199.38 | 97.5 |
| 199.45 | 97 |
| 199.52 | 96.5 |
| 199.59 | 96 |
| 199.66 | 95.5 |
| 199.72 | 95 |
| 199.79 | 94.5 |
| 199.86 | 94.5 |
| 199.93 | 94 |
| 200.0 | 93.25 |
| 200.06 | 92.75 |
| 200.13 | 92.25 |
| 200.2 | 91.5 |
| 200.27 | 91.25 |
| 200.34 | 90.5 |
| 200.4 | 90 |
| 200.47 | 89.5 |
| 200.54 | 89 |
| 200.61 | 88.5 |
| 200.68 | 88.5 |
| 200.74 | 88 |
| 200.81 | 87.75 |
| 200.88 | 87 |
| 200.95 | 86.5 |
| 201.02 | 86.25 |
| 201.09 | 85.5 |
| 201.15 | 85.25 |
| 201.22 | 85 |
| 201.29 | 84.5 |
| 201.36 | 84 |
| 201.43 | 83.5 |
| 201.49 | 83.5 |
| 201.56 | 83.25 |
| 201.63 | 82.75 |
| 201.7 | 82.5 |
| 201.77 | 82 |
| 201.83 | 81.75 |
| 201.9 | 81.25 |
| 201.97 | 81 |
| 202.04 | 80.5 |
| 202.11 | 80.25 |
| 202.17 | 80 |
| 202.24 | 80 |
| 202.31 | 79.5 |
| 202.38 | 79.25 |
| 202.45 | 78.75 |
| 202.52 | 78.5 |
| 202.58 | 78 |
| 202.65 | 77.75 |
| 202.72 | 77.5 |
| 202.79 | 77.25 |
| 202.86 | 77 |
| 202.92 | 76.75 |
| 202.99 | 76.25 |
| 203.06 | 76.25 |
| 203.13 | 76 |
| 203.2 | 75.75 |
| 203.26 | 75.5 |
| 203.33 | 75.25 |
| 203.4 | 74.75 |
| 203.47 | 74.5 |
| 203.54 | 74.25 |
| 203.6 | 74 |
| 203.67 | 73.75 |
| 203.74 | 73.5 |
| 203.81 | 73.25 |
| 203.88 | 73.25 |
| 203.94 | 73 |
| 204.01 | 72.75 |
| 204.08 | 72.5 |
| 204.15 | 72.25 |
| 204.22 | 72 |
| 204.28 | 71.75 |
| 204.35 | 71.5 |
| 204.42 | 71.25 |
| 204.49 | 71 |
| 204.56 | 70.75 |
| 204.63 | 70.5 |
| 204.69 | 70.5 |
| 204.76 | 70.5 |
| 204.83 | 70 |
| 204.9 | 69.75 |
| 204.97 | 69.5 |
| 205.03 | 69.25 |
| 205.1 | 69 |
| 205.17 | 69 |
| 205.24 | 68.75 |
| 205.31 | 68.5 |
| 205.37 | 68.25 |
| 205.44 | 68 |
| 205.51 | 68 |
| 205.58 | 68.25 |
| 205.65 | 68.5 |
| 205.72 | 68.5 |
| 205.78 | 68.5 |
| 205.85 | 68.75 |
| 205.92 | 68.75 |
| 205.99 | 69 |
| 206.06 | 69 |
| 206.13 | 69 |
| 206.19 | 69 |
| 206.26 | 69.25 |
| 206.33 | 69.25 |
| 206.4 | 69.25 |
| 206.47 | 69.25 |
| 206.53 | 69.5 |
| 206.6 | 69.5 |
| 206.67 | 69.5 |
| 206.74 | 69.75 |
| 206.81 | 69.75 |
| 206.87 | 69.75 |
| 206.94 | 69.75 |
| 207.01 | 69.75 |
| 207.08 | 70 |
| 207.15 | 70 |
| 207.22 | 70 |
| 207.28 | 70 |
| 207.35 | 70 |
| 207.42 | 70 |
| 207.49 | 70 |
| 207.56 | 70 |
| 207.63 | 70 |
| 207.69 | 70 |
| 207.76 | 70 |
| 207.83 | 70 |
| 207.9 | 69.75 |
| 207.97 | 69.75 |
| 208.03 | 70 |
| 208.1 | 69.75 |
| 208.17 | 69.75 |
| 208.24 | 69.75 |
| 208.31 | 69.5 |
| 208.38 | 69.5 |
| 208.44 | 69.25 |
| 208.51 | 69.25 |
| 208.58 | 69.25 |
| 208.65 | 69.25 |
| 208.72 | 69.25 |
| 208.78 | 69.25 |
| 208.85 | 69 |
| 208.92 | 69 |
| 208.99 | 69 |
| 209.06 | 68.75 |
| 209.13 | 68.75 |
| 209.19 | 68.75 |
| 209.26 | 68.5 |
| 209.33 | 68.5 |
| 209.4 | 68.5 |
| 209.47 | 68.25 |
| 209.53 | 68.25 |
| 209.6 | 68.25 |
| 209.67 | 68.25 |
| 209.74 | 68.25 |
| 209.81 | 68 |
| 209.88 | 68 |
| 209.94 | 67.75 |
| 210.01 | 68 |
| 210.08 | 67.75 |
| 210.15 | 67.75 |
| 210.22 | 67.75 |
| 210.28 | 67.5 |
| 210.35 | 67.5 |
| 210.42 | 67.5 |
| 210.49 | 67.25 |
| 210.56 | 67.25 |
| 210.63 | 67.25 |
| 210.69 | 67.5 |
| 210.76 | 67.5 |
| 210.83 | 68 |
| 210.9 | 68.25 |
| 210.97 | 68.75 |
| 211.03 | 69.25 |
| 211.1 | 69.75 |
| 211.17 | 70.25 |
| 211.24 | 70.25 |
| 211.31 | 70.5 |
| 211.38 | 70.75 |
| 211.44 | 71.25 |
| 211.51 | 71.5 |
| 211.58 | 72 |
| 211.65 | 72.25 |
| 211.72 | 72.5 |
| 211.78 | 73 |
| 211.85 | 73.25 |
| 211.92 | 73.75 |
| 211.99 | 74 |
| 212.06 | 74 |
| 212.12 | 74.25 |
| 212.19 | 74.5 |
| 212.26 | 75 |
| 212.33 | 75.25 |
| 212.4 | 75.5 |
| 212.46 | 76 |
| 212.53 | 76.25 |
| 212.6 | 76.5 |
| 212.67 | 76.75 |
| 212.74 | 77.25 |
| 212.8 | 77.25 |
| 212.87 | 77.5 |
| 212.94 | 77.75 |
| 213.01 | 78 |
| 213.08 | 78.25 |
| 213.15 | 78.75 |
| 213.21 | 79 |
| 213.28 | 79.25 |
| 213.35 | 79.5 |
| 213.42 | 79.75 |
| 213.49 | 80 |
| 213.55 | 80.25 |
| 213.62 | 80.25 |
| 213.69 | 80.75 |
| 213.76 | 80.75 |
| 213.83 | 81 |
| 213.89 | 81.5 |
| 213.96 | 81.75 |
| 214.03 | 82 |
| 214.1 | 82.25 |
| 214.17 | 82.5 |
| 214.24 | 82.75 |
| 214.3 | 83 |
| 214.37 | 83.25 |
| 214.44 | 83.25 |
| 214.51 | 83.5 |
| 214.58 | 83.75 |
| 214.64 | 84 |
| 214.71 | 84.25 |
| 214.78 | 84.5 |
| 214.85 | 84.75 |
| 214.92 | 85 |
| 214.98 | 85.25 |
| 215.05 | 85.25 |
| 215.12 | 85.5 |
| 215.19 | 85.75 |
| 215.26 | 85.75 |
| 215.33 | 86 |
| 215.39 | 86.25 |
| 215.46 | 86.5 |
| 215.53 | 86.75 |
| 215.6 | 87 |
| 215.66 | 87.25 |
| 215.73 | 87.5 |
| 215.8 | 87.75 |
| 215.87 | 88 |
| 215.94 | 88 |
| 216.01 | 88.25 |
| 216.07 | 88.25 |
| 216.14 | 88.5 |
| 216.21 | 88.75 |
| 216.28 | 89 |
| 216.35 | 89 |
| 216.41 | 89.25 |
| 216.48 | 89.5 |
| 216.55 | 89.75 |
| 216.62 | 90 |
| 216.69 | 90 |
| 216.76 | 90.25 |
| 216.82 | 90.5 |
| 216.89 | 90.5 |
| 216.96 | 90.75 |
| 217.03 | 90.75 |
| 217.1 | 91 |
| 217.16 | 91.25 |
| 217.23 | 91.5 |
| 217.3 | 91.75 |
| 217.37 | 91.75 |
| 217.44 | 92 |
| 217.5 | 92.25 |
| 217.57 | 92.5 |
| 217.64 | 92.5 |
| 217.71 | 92.5 |
| 217.78 | 92.75 |
| 217.85 | 93 |
| 217.91 | 93.25 |
| 217.98 | 93.25 |
| 218.05 | 93.5 |
| 218.12 | 93.75 |
| 218.19 | 93.75 |
| 218.25 | 94 |
| 218.32 | 94.25 |
| 218.39 | 94.25 |
| 218.46 | 94.5 |
| 218.53 | 94.5 |
| 218.6 | 94.75 |
| 218.66 | 94.75 |
| 218.73 | 95 |
| 218.8 | 95.25 |
| 218.87 | 95.5 |
| 218.94 | 95.5 |
| 219.0 | 95.5 |
| 219.07 | 95.75 |
| 219.14 | 96 |
| 219.21 | 96.25 |
| 219.28 | 96.5 |
| 219.34 | 96.5 |
| 219.41 | 96.5 |
| 219.48 | 96.75 |
| 219.55 | 96.75 |
| 219.62 | 97 |
| 219.68 | 97.25 |
| 219.75 | 97.25 |
| 219.82 | 97.5 |
| 219.89 | 97.75 |
| 219.96 | 97.75 |
| 220.02 | 98 |
| 220.09 | 98 |
| 220.16 | 98 |
| 220.23 | 98.25 |
| 220.3 | 98.5 |
| 220.37 | 98.5 |
| 220.43 | 98.75 |
| 220.5 | 99 |
| 220.57 | 99 |
| 220.64 | 99.25 |
| 220.71 | 99.5 |
| 220.77 | 99.5 |
| 220.84 | 99.75 |
| 220.91 | 99.75 |
| 220.98 | 99.75 |
| 221.05 | 99.75 |
| 221.12 | 100 |
| 221.18 | 100 |
| 221.25 | 100.25 |
| 221.32 | 100.25 |
| 221.39 | 100.5 |
| 221.46 | 100.5 |
| 221.53 | 100.5 |
| 221.59 | 100.75 |
| 221.66 | 100.75 |
| 221.73 | 100.75 |
| 221.8 | 100.75 |
| 221.87 | 101 |
| 221.94 | 101 |
| 222.0 | 101 |
| 222.07 | 101 |
| 222.14 | 101 |
| 222.21 | 101 |
| 222.28 | 101.25 |
| 222.34 | 101 |
| 222.41 | 101 |
| 222.48 | 101 |
| 222.55 | 101 |
| 222.62 | 101 |
| 222.69 | 101 |
| 222.75 | 101 |
| 222.82 | 101 |
| 222.89 | 100.25 |
| 222.96 | 100 |
| 223.03 | 99.75 |
| 223.09 | 99.5 |
| 223.16 | 99 |
| 223.23 | 98.75 |
| 223.3 | 98.25 |
| 223.37 | 97.75 |
| 223.43 | 97.75 |
| 223.5 | 97.25 |
| 223.57 | 96.75 |
| 223.64 | 96.25 |
| 223.71 | 95.75 |
| 223.77 | 95.25 |
| 223.84 | 94.75 |
| 223.91 | 94 |
| 223.98 | 93.5 |
| 224.05 | 93 |
| 224.12 | 92.5 |
| 224.18 | 92.5 |
| 224.25 | 92 |
| 224.32 | 91.25 |
| 224.39 | 90.75 |
| 224.46 | 90.25 |
| 224.52 | 89.75 |
| 224.59 | 89.25 |
| 224.66 | 88.75 |
| 224.73 | 88.25 |
| 224.8 | 87.75 |
| 224.86 | 87.25 |
| 224.93 | 86.75 |
| 225.0 | 86.75 |
| 225.07 | 86.25 |
| 225.14 | 85.75 |
| 225.21 | 85.5 |
| 225.27 | 85 |
| 225.34 | 84.5 |
| 225.41 | 84.25 |
| 225.48 | 83.75 |
| 225.55 | 83.25 |
| 225.61 | 83 |
| 225.68 | 82.5 |
| 225.75 | 82.25 |
| 225.82 | 82.25 |
| 225.89 | 81.75 |
| 225.95 | 81.5 |
| 226.02 | 81 |
| 226.09 | 80.75 |
| 226.16 | 80.25 |
| 226.23 | 80 |
| 226.29 | 79.75 |
| 226.36 | 79.25 |
| 226.43 | 79 |
| 226.5 | 78.75 |
| 226.57 | 78.25 |
| 226.63 | 78.25 |
| 226.7 | 78 |
| 226.77 | 77.75 |
| 226.84 | 77.25 |
| 226.91 | 77 |
| 226.97 | 76.75 |
| 227.04 | 76.5 |
| 227.11 | 76.25 |
| 227.18 | 76 |
| 227.25 | 75.5 |
| 227.32 | 75.25 |
| 227.38 | 75 |
| 227.45 | 75 |
| 227.52 | 74.75 |
| 227.59 | 74.5 |
| 227.66 | 74.25 |
| 227.72 | 73.75 |
| 227.79 | 73.5 |
| 227.86 | 73.25 |
| 227.93 | 73 |
| 228.0 | 72.75 |
| 228.06 | 72.5 |
| 228.13 | 72.25 |
| 228.2 | 72.25 |
| 228.27 | 72 |
| 228.34 | 71.75 |
| 228.41 | 71.5 |
| 228.47 | 71.25 |
| 228.54 | 71 |
| 228.61 | 70.75 |
| 228.68 | 70.5 |
| 228.75 | 70.5 |
| 228.81 | 70.25 |
| 228.88 | 69.75 |
| 228.95 | 69.5 |
| 229.02 | 69.5 |
| 229.09 | 69.25 |
| 229.15 | 69.25 |
| 229.22 | 69 |
| 229.29 | 68.75 |
| 229.36 | 68.5 |
| 229.43 | 68.25 |
| 229.49 | 68.25 |
| 229.56 | 68 |
| 229.63 | 68.5 |
| 229.7 | 68.5 |
| 229.77 | 68.75 |
| 229.84 | 68.75 |
| 229.9 | 68.5 |
| 229.97 | 68.75 |
| 230.04 | 69 |
| 230.11 | 69 |
| 230.18 | 69 |
| 230.24 | 69 |
| 230.31 | 69.25 |
| 230.38 | 69.25 |
| 230.45 | 69.25 |
| 230.52 | 69.5 |
| 230.59 | 69.5 |
| 230.65 | 69.5 |
| 230.72 | 69.5 |
| 230.79 | 69.75 |
| 230.86 | 69.75 |
| 230.93 | 69.75 |
| 230.99 | 69.75 |
| 231.06 | 69.75 |
| 231.13 | 70 |
| 231.2 | 70 |
| 231.27 | 70 |
| 231.34 | 70 |
| 231.4 | 70 |
| 231.47 | 70 |
| 231.54 | 70 |
| 231.61 | 70 |
| 231.68 | 70 |
| 231.74 | 70 |
| 231.81 | 70 |
| 231.88 | 70 |
| 231.95 | 69.75 |
| 232.02 | 69.75 |
| 232.09 | 69.75 |
| 232.15 | 69.75 |
| 232.22 | 69.75 |
| 232.29 | 69.75 |
| 232.36 | 69.5 |
| 232.43 | 69.5 |
| 232.5 | 69.5 |
| 232.56 | 69.25 |
| 232.63 | 69.25 |
| 232.7 | 69.25 |
| 232.77 | 69.25 |
| 232.84 | 69 |
| 232.9 | 69 |
| 232.97 | 69 |
| 233.04 | 68.75 |
| 233.11 | 68.75 |
| 233.18 | 68.75 |
| 233.25 | 68.5 |
| 233.31 | 68.5 |
| 233.38 | 68.5 |
| 233.45 | 68.5 |
| 233.52 | 68.25 |
| 233.59 | 68.25 |
| 233.65 | 68.25 |
| 233.72 | 68.25 |
| 233.79 | 68 |
| 233.86 | 68 |
| 233.93 | 68 |
| 234.0 | 68 |
| 234.06 | 67.75 |
| 234.13 | 67.75 |
| 234.2 | 67.75 |
| 234.27 | 67.75 |
| 234.34 | 67.5 |
| 234.4 | 67.5 |
| 234.47 | 67.5 |
| 234.54 | 67.25 |
| 234.61 | 67.25 |
| 234.68 | 67.25 |
| 234.74 | 67.25 |
| 234.81 | 67.25 |
| 234.88 | 67.5 |
| 234.95 | 67.75 |
| 235.02 | 68 |
| 235.09 | 68.5 |
| 235.15 | 69 |
| 235.22 | 69.5 |
| 235.29 | 69.75 |
| 235.36 | 70.5 |
| 235.43 | 70.75 |
| 235.49 | 71 |
| 235.56 | 71 |
| 235.63 | 71.5 |
| 235.7 | 71.75 |
| 235.77 | 72 |
| 235.84 | 72.5 |
| 235.9 | 72.75 |
| 235.97 | 73.25 |
| 236.04 | 73.5 |
| 236.11 | 74 |
| 236.18 | 74.25 |
| 236.24 | 74.5 |
| 236.31 | 74.75 |
| 236.38 | 74.75 |
| 236.45 | 75.25 |
| 236.52 | 75.5 |
| 236.58 | 75.75 |
| 236.65 | 76.25 |
| 236.72 | 76.5 |
| 236.79 | 76.75 |
| 236.86 | 77 |
| 236.92 | 77.25 |
| 236.99 | 77.75 |
| 237.06 | 78 |
| 237.13 | 78.25 |
| 237.2 | 78.25 |
| 237.27 | 78.5 |
| 237.33 | 79 |
| 237.4 | 79.25 |
| 237.47 | 79.5 |
| 237.54 | 79.75 |
| 237.61 | 80.25 |
| 237.67 | 80.25 |
| 237.74 | 80.75 |
| 237.81 | 81 |
| 237.88 | 81.25 |
| 237.95 | 81.5 |
| 238.02 | 81.5 |
| 238.08 | 81.75 |
| 238.15 | 82 |
| 238.22 | 82.25 |
| 238.29 | 82.5 |
| 238.36 | 82.75 |
| 238.42 | 83 |
| 238.49 | 83.25 |
| 238.56 | 83.5 |
| 238.63 | 83.75 |
| 238.7 | 84 |
| 238.77 | 84.25 |
| 238.83 | 84.25 |
| 238.9 | 84.5 |
| 238.97 | 85 |
| 239.04 | 85 |
| 239.11 | 85.25 |
| 239.17 | 85.5 |
| 239.24 | 85.75 |
| 239.31 | 86 |
| 239.38 | 86.25 |
| 239.45 | 86.5 |
| 239.51 | 86.75 |
| 239.58 | 87 |
| 239.65 | 87 |
| 239.72 | 87 |
| 239.79 | 87.25 |
| 239.85 | 87.5 |
| 239.92 | 87.75 |
| 239.99 | 88 |
| 240.06 | 88.25 |
| 240.13 | 88.5 |
| 240.2 | 88.5 |
| 240.26 | 88.75 |
| 240.33 | 89 |
| 240.4 | 89.25 |
| 240.47 | 89.25 |
| 240.54 | 89.5 |
| 240.6 | 89.75 |
| 240.67 | 89.75 |
| 240.74 | 90 |
| 240.81 | 90.25 |
| 240.88 | 90.5 |
| 240.94 | 90.75 |
| 241.01 | 90.75 |
| 241.08 | 91 |
| 241.15 | 91.25 |
| 241.22 | 91.25 |
| 241.29 | 91.5 |
| 241.35 | 91.75 |
| 241.42 | 91.75 |
| 241.49 | 92 |
| 241.56 | 92.25 |
| 241.63 | 92.5 |
| 241.69 | 92.75 |
| 241.76 | 92.75 |
| 241.83 | 93 |
| 241.9 | 93.25 |
| 241.97 | 93.25 |
| 242.03 | 93.25 |
| 242.1 | 93.5 |
| 242.17 | 93.75 |
| 242.24 | 94 |
| 242.31 | 94 |
| 242.38 | 94.25 |
| 242.44 | 94.5 |
| 242.51 | 94.5 |
| 242.58 | 94.75 |
| 242.65 | 95 |
| 242.72 | 95.25 |
| 242.78 | 95.25 |
| 242.85 | 95.25 |
| 242.92 | 95.5 |
| 242.99 | 95.75 |
| 243.06 | 95.75 |
| 243.12 | 96 |
| 243.19 | 96.25 |
| 243.26 | 96.25 |
| 243.33 | 96.5 |
| 243.4 | 96.75 |
| 243.47 | 97 |
| 243.53 | 97 |
| 243.6 | 97.25 |
| 243.67 | 97.25 |
| 243.74 | 97.25 |
| 243.81 | 97.5 |
| 243.87 | 97.75 |
| 243.94 | 97.75 |
| 244.01 | 98 |
| 244.08 | 98.25 |
| 244.15 | 98.25 |
| 244.21 | 98.5 |
| 244.28 | 98.5 |
| 244.35 | 98.75 |
| 244.42 | 98.75 |
| 244.49 | 98.75 |
| 244.55 | 99 |
| 244.62 | 99.25 |
| 244.69 | 99.5 |
| 244.76 | 99.5 |
| 244.83 | 99.75 |
| 244.9 | 99.75 |
| 244.96 | 100 |
| 245.03 | 100 |
| 245.1 | 100 |
| 245.17 | 100.25 |
| 245.24 | 100.25 |
| 245.3 | 100.25 |
| 245.37 | 100.5 |
| 245.44 | 100.5 |
| 245.51 | 100.75 |
| 245.58 | 100.75 |
| 245.65 | 100.75 |
| 245.71 | 101 |
| 245.78 | 101 |
| 245.85 | 101 |
| 245.92 | 101.25 |
| 245.99 | 101.25 |
| 246.05 | 101.25 |
| 246.12 | 101.25 |
| 246.19 | 101.25 |
| 246.26 | 101.25 |
| 246.33 | 101.25 |
| 246.4 | 101.25 |
| 246.47 | 101 |
| 246.53 | 101 |
| 246.6 | 101 |
| 246.67 | 101 |
| 246.74 | 101 |
| 246.81 | 100.75 |
| 246.88 | 100.5 |
| 246.94 | 100.5 |
| 247.01 | 100 |
| 247.08 | 99.75 |
| 247.15 | 99.5 |
| 247.22 | 99.25 |
| 247.28 | 98.75 |
| 247.35 | 98.5 |
| 247.42 | 98 |
| 247.49 | 97.5 |
| 247.56 | 96.75 |
| 247.62 | 96.25 |
| 247.69 | 96 |
| 247.76 | 96 |
| 247.83 | 95.25 |
| 247.9 | 94.75 |
| 247.96 | 94.25 |
| 248.03 | 93.75 |
| 248.1 | 93 |
| 248.17 | 92.5 |
| 248.24 | 92 |
| 248.3 | 91.25 |
| 248.37 | 90.75 |
| 248.44 | 90.25 |
| 248.51 | 89.75 |
| 248.58 | 89.75 |
| 248.65 | 89.25 |
| 248.71 | 88.75 |
| 248.78 | 88.25 |
| 248.85 | 87.75 |
| 248.92 | 87.25 |
| 248.99 | 86.75 |
| 249.05 | 86.5 |
| 249.12 | 85.75 |
| 249.19 | 85.5 |
| 249.26 | 85 |
| 249.33 | 84.75 |
| 249.39 | 84.75 |
| 249.46 | 84.25 |
| 249.53 | 83.75 |
| 249.6 | 83.25 |
| 249.67 | 83 |
| 249.73 | 82.75 |
| 249.8 | 82.25 |
| 249.87 | 81.75 |
| 249.94 | 81.5 |
| 250.01 | 81.25 |
| 250.08 | 80.75 |
| 250.14 | 80.5 |
| 250.21 | 80.5 |
| 250.28 | 80 |
| 250.35 | 79.75 |
| 250.41 | 79.5 |
| 250.48 | 79 |
| 250.55 | 78.75 |
| 250.62 | 78.25 |
| 250.69 | 78 |
| 250.76 | 77.75 |
| 250.82 | 77.5 |
| 250.89 | 77.25 |
| 250.96 | 77.25 |
| 251.03 | 76.75 |
| 251.1 | 76.75 |
| 251.16 | 76.25 |
| 251.23 | 76 |
| 251.3 | 75.5 |
| 251.37 | 75.25 |
| 251.44 | 75 |
| 251.5 | 74.75 |
| 251.57 | 74.5 |
| 251.64 | 74.25 |
| 251.71 | 74 |
| 251.78 | 74 |
| 251.84 | 73.75 |
| 251.91 | 73.5 |
| 251.98 | 73.25 |
| 252.05 | 72.75 |
| 252.12 | 72.75 |
| 252.19 | 72.5 |
| 252.25 | 72 |
| 252.32 | 71.75 |
| 252.39 | 71.5 |
| 252.46 | 71.5 |
| 252.52 | 71 |
| 252.59 | 71 |
| 252.66 | 71 |
| 252.73 | 70.75 |
| 252.8 | 70.5 |
| 252.87 | 70.25 |
| 252.93 | 70 |
| 253.0 | 69.75 |
| 253.07 | 69.5 |
| 253.14 | 69.25 |
| 253.21 | 69 |
| 253.27 | 68.75 |
| 253.34 | 68.5 |
| 253.41 | 68.5 |
| 253.48 | 68.5 |
| 253.55 | 68.25 |
| 253.62 | 68.5 |
| 253.68 | 68.5 |
| 253.75 | 68.5 |
| 253.82 | 68.5 |
| 253.89 | 68.75 |
| 253.96 | 68.75 |
| 254.02 | 68.75 |
| 254.09 | 68.75 |
| 254.16 | 68.75 |
| 254.23 | 68.75 |
| 254.3 | 69 |
| 254.37 | 69 |
| 254.43 | 69.25 |
| 254.5 | 69.25 |
| 254.57 | 69.25 |
| 254.64 | 69.25 |
| 254.71 | 69.25 |
| 254.77 | 69.5 |
| 254.84 | 69.5 |
| 254.91 | 69.5 |
| 254.98 | 69.5 |
| 255.05 | 69.5 |
| 255.12 | 69.5 |
| 255.18 | 69.5 |
| 255.25 | 69.5 |
| 255.32 | 69.75 |
| 255.39 | 69.75 |
| 255.46 | 69.75 |
| 255.52 | 69.75 |
| 255.59 | 69.5 |
| 255.66 | 69.75 |
| 255.73 | 69.75 |
| 255.8 | 69.5 |
| 255.87 | 69.5 |
| 255.93 | 69.5 |
| 256.0 | 69.5 |
| 256.07 | 69.5 |
| 256.14 | 69.5 |
| 256.21 | 69.25 |
| 256.27 | 69.25 |
| 256.34 | 69.25 |
| 256.41 | 69.25 |
| 256.48 | 69 |
| 256.55 | 69 |
| 256.62 | 69 |
| 256.69 | 69 |
| 256.75 | 68.75 |
| 256.82 | 68.75 |
| 256.89 | 68.75 |
| 256.96 | 68.75 |
| 257.03 | 68.5 |
| 257.09 | 68.5 |
| 257.16 | 68.5 |
| 257.23 | 68.25 |
| 257.3 | 68.25 |
| 257.37 | 68.25 |
| 257.43 | 68.25 |
| 257.5 | 68.25 |
| 257.57 | 68 |
| 257.64 | 68 |
| 257.71 | 68 |
| 257.77 | 68 |
| 257.84 | 67.75 |
| 257.91 | 67.75 |
| 257.98 | 67.75 |
| 258.05 | 67.75 |
| 258.12 | 67.5 |
| 258.19 | 67.5 |
| 258.25 | 67.25 |
| 258.32 | 67.25 |
| 258.39 | 67.25 |
| 258.46 | 67.25 |
| 258.53 | 67.25 |
| 258.59 | 67.25 |
| 258.66 | 67.25 |
| 258.73 | 67.25 |
| 258.8 | 67.25 |
| 258.87 | 67.5 |
| 258.93 | 67.75 |
| 259.0 | 68.25 |
| 259.07 | 68.75 |
| 259.14 | 68.75 |
| 259.21 | 69.25 |
| 259.27 | 69.75 |
| 259.34 | 70.25 |
| 259.41 | 70.5 |
| 259.48 | 71 |
| 259.55 | 71.25 |
| 259.61 | 71.5 |
| 259.68 | 72 |
| 259.75 | 72.25 |
| 259.82 | 72.5 |
| 259.89 | 73 |
| 259.96 | 73 |
| 260.02 | 73.25 |
| 260.09 | 73.75 |
| 260.16 | 74 |
| 260.23 | 74.25 |
| 260.3 | 74.5 |
| 260.36 | 75 |
| 260.43 | 75.25 |
| 260.5 | 75.75 |
| 260.57 | 76 |
| 260.64 | 76.25 |
| 260.71 | 76.5 |
| 260.77 | 76.5 |
| 260.84 | 77 |
| 260.91 | 77.25 |
| 260.98 | 77.5 |
| 261.05 | 77.75 |
| 261.11 | 78.25 |
| 261.18 | 78.5 |
| 261.25 | 78.75 |
| 261.32 | 79 |
| 261.39 | 79.25 |
| 261.45 | 79.5 |
| 261.52 | 80 |
| 261.59 | 80 |
| 261.66 | 80.25 |
| 261.73 | 80.5 |
| 261.8 | 80.75 |
| 261.86 | 81 |
| 261.93 | 81.5 |
| 262.0 | 81.75 |
| 262.07 | 81.75 |
| 262.14 | 82.25 |
| 262.2 | 82.25 |
| 262.27 | 82.75 |
| 262.34 | 83 |
| 262.41 | 83 |
| 262.48 | 83.25 |
| 262.55 | 83.5 |
| 262.61 | 83.75 |
| 262.68 | 84 |
| 262.75 | 84 |
| 262.82 | 84.25 |
| 262.89 | 84.75 |
| 262.95 | 85 |
| 263.02 | 85 |
| 263.09 | 85.25 |
| 263.16 | 85.25 |
| 263.23 | 85.5 |
| 263.29 | 86 |
| 263.36 | 86 |
| 263.43 | 86.25 |
| 263.5 | 86.5 |
| 263.57 | 86.75 |
| 263.63 | 87 |
| 263.7 | 87.25 |
| 263.77 | 87.5 |
| 263.84 | 87.5 |
| 263.91 | 87.75 |
| 263.98 | 87.75 |
| 264.04 | 88 |
| 264.11 | 88.25 |
| 264.18 | 88.5 |
| 264.25 | 88.75 |
| 264.32 | 89 |
| 264.38 | 89 |
| 264.45 | 89.5 |
| 264.52 | 89.5 |
| 264.59 | 89.75 |
| 264.66 | 90 |
| 264.73 | 90.25 |
| 264.79 | 90.25 |
| 264.86 | 90.5 |
| 264.93 | 90.5 |
| 265.0 | 90.75 |
| 265.07 | 91 |
| 265.13 | 91 |
| 265.2 | 91.25 |
| 265.27 | 91.5 |
| 265.34 | 91.75 |
| 265.41 | 92 |
| 265.48 | 92.25 |
| 265.54 | 92.25 |
| 265.61 | 92.25 |
| 265.68 | 92.5 |
| 265.75 | 92.75 |
| 265.82 | 93 |
| 265.88 | 93 |
| 265.95 | 93.25 |
| 266.02 | 93.5 |
| 266.09 | 93.5 |
| 266.16 | 93.75 |
| 266.22 | 94 |
| 266.29 | 94 |
| 266.36 | 94.25 |
| 266.43 | 94.25 |
| 266.5 | 94.5 |
| 266.56 | 94.5 |
| 266.63 | 94.75 |
| 266.7 | 95 |
| 266.77 | 95 |
| 266.84 | 95.25 |
| 266.91 | 95.5 |
| 266.97 | 95.75 |
| 267.04 | 95.75 |
| 267.11 | 96 |
| 267.18 | 96 |
| 267.25 | 96 |
| 267.31 | 96.25 |
| 267.38 | 96.5 |
| 267.45 | 96.5 |
| 267.52 | 96.75 |
| 267.59 | 96.75 |
| 267.66 | 97 |
| 267.72 | 97 |
| 267.79 | 97.25 |
| 267.86 | 97.5 |
| 267.93 | 97.75 |
| 268.0 | 97.75 |
| 268.06 | 97.75 |
| 268.13 | 97.75 |
| 268.2 | 98 |
| 268.27 | 98.25 |
| 268.34 | 98.25 |
| 268.4 | 98.5 |
| 268.47 | 98.5 |
| 268.54 | 98.75 |
| 268.61 | 99 |
| 268.68 | 99 |
| 268.74 | 99.25 |
| 268.81 | 99.25 |
| 268.88 | 99.25 |
| 268.95 | 99.5 |
| 269.02 | 99.5 |
| 269.08 | 99.75 |
| 269.15 | 99.75 |
| 269.22 | 100 |
| 269.29 | 100 |
| 269.36 | 100.25 |
| 269.43 | 100.25 |
| 269.5 | 100.5 |
| 269.56 | 100.5 |
| 269.63 | 100.75 |
| 269.7 | 100.75 |
| 269.77 | 100.75 |
| 269.84 | 101 |
| 269.9 | 101.25 |
| 269.97 | 101 |
| 270.04 | 101.25 |
| 270.11 | 101.25 |
| 270.18 | 101.25 |
| 270.25 | 101.25 |
| 270.31 | 101.25 |
| 270.38 | 101.25 |
| 270.45 | 101.25 |
| 270.52 | 101.25 |
| 270.59 | 101.25 |
| 270.66 | 101.25 |
| 270.72 | 101.25 |
| 270.79 | 101.25 |
| 270.86 | 101 |
| 270.93 | 100.5 |
| 271.0 | 100 |
| 271.07 | 99.75 |
| 271.13 | 99.5 |
| 271.2 | 99.25 |
| 271.27 | 98.75 |
| 271.34 | 98.75 |
| 271.41 | 98.5 |
| 271.47 | 98 |
| 271.54 | 97.5 |
| 271.61 | 97 |
| 271.68 | 96.5 |
| 271.75 | 96 |
| 271.81 | 95.25 |
| 271.88 | 94.75 |
| 271.95 | 94.25 |
| 272.02 | 93.75 |
| 272.09 | 93.25 |
| 272.15 | 93.25 |
| 272.22 | 92.5 |
| 272.29 | 92 |
| 272.36 | 91.5 |
| 272.42 | 91 |
| 272.49 | 90.5 |
| 272.56 | 90 |
| 272.63 | 89.25 |
| 272.7 | 88.75 |
| 272.77 | 88.25 |
| 272.83 | 87.75 |
| 272.9 | 87.25 |
| 272.97 | 87.25 |
| 273.04 | 87 |
| 273.11 | 86.5 |
| 273.17 | 86 |
| 273.24 | 85.5 |
| 273.31 | 85 |
| 273.38 | 84.75 |
| 273.45 | 84.25 |
| 273.52 | 83.75 |
| 273.58 | 83.25 |
| 273.65 | 83 |
| 273.72 | 83 |
| 273.79 | 82.5 |
| 273.86 | 82.25 |
| 273.92 | 81.75 |
| 273.99 | 81.5 |
| 274.06 | 81 |
| 274.13 | 80.75 |
| 274.2 | 80.25 |
| 274.27 | 80 |
| 274.33 | 79.75 |
| 274.4 | 79.5 |
| 274.47 | 79 |
| 274.54 | 79 |
| 274.61 | 78.75 |
| 274.67 | 78.25 |
| 274.74 | 78 |
| 274.81 | 77.75 |
| 274.88 | 77.5 |
| 274.95 | 77 |
| 275.01 | 76.75 |
| 275.08 | 76.5 |
| 275.15 | 76.25 |
| 275.22 | 76 |
| 275.29 | 75.5 |
| 275.35 | 75.5 |
| 275.42 | 75.25 |
| 275.49 | 75 |
| 275.56 | 74.75 |
| 275.63 | 74.25 |
| 275.69 | 74.25 |
| 275.76 | 74 |
| 275.83 | 73.75 |
| 275.9 | 73.5 |
| 275.97 | 73.25 |
| 276.03 | 73 |
| 276.1 | 72.75 |
| 276.17 | 72.75 |
| 276.24 | 72.5 |
| 276.31 | 72.25 |
| 276.38 | 72 |
| 276.44 | 71.75 |
| 276.51 | 71.5 |
| 276.58 | 71.25 |
| 276.65 | 71 |
| 276.72 | 70.75 |
| 276.78 | 70.5 |
| 276.85 | 70.5 |
| 276.92 | 70.25 |
| 276.99 | 70.25 |
| 277.06 | 69.75 |
| 277.12 | 69.75 |
| 277.19 | 69.25 |
| 277.26 | 69.25 |
| 277.33 | 69 |
| 277.4 | 68.75 |
| 277.47 | 68.5 |
| 277.53 | 68.25 |
| 277.6 | 68.25 |
| 277.67 | 68.25 |
| 277.74 | 68.5 |
| 277.81 | 68.5 |
| 277.87 | 68.5 |
| 277.94 | 68.75 |
| 278.01 | 68.75 |
| 278.08 | 69 |
| 278.15 | 69 |
| 278.21 | 69.25 |
| 278.28 | 69.25 |
| 278.35 | 69.25 |
| 278.42 | 69.5 |
| 278.49 | 69.5 |
| 278.55 | 69.5 |
| 278.62 | 69.5 |
| 278.69 | 69.75 |
| 278.76 | 69.75 |
| 278.83 | 69.75 |
| 278.9 | 69.75 |
| 278.97 | 70 |
| 279.03 | 70 |
| 279.1 | 70 |
| 279.17 | 70 |
| 279.24 | 70 |
| 279.31 | 70.25 |
| 279.37 | 70.25 |
| 279.44 | 70.25 |
| 279.51 | 70.25 |
| 279.58 | 70.25 |
| 279.65 | 70.25 |
| 279.72 | 70.25 |
| 279.78 | 70.25 |
| 279.85 | 70 |
| 279.92 | 70 |
| 279.99 | 70 |
| 280.06 | 69.75 |
| 280.13 | 69.75 |
| 280.19 | 69.75 |
| 280.26 | 69.75 |
| 280.33 | 69.5 |
| 280.4 | 69.5 |
| 280.47 | 69.5 |
| 280.53 | 69.25 |
| 280.6 | 69.25 |
| 280.67 | 69.25 |
| 280.74 | 69.25 |
| 280.81 | 69.25 |
| 280.88 | 69 |
| 280.94 | 69 |
| 281.01 | 68.75 |
| 281.08 | 68.75 |
| 281.15 | 68.75 |
| 281.22 | 68.75 |
| 281.28 | 68.5 |
| 281.35 | 68.5 |
| 281.42 | 68.5 |
| 281.49 | 68.5 |
| 281.56 | 68.25 |
| 281.63 | 68.25 |
| 281.69 | 68.25 |
| 281.76 | 68.25 |
| 281.83 | 68 |
| 281.9 | 68 |
| 281.97 | 68 |
| 282.04 | 67.75 |
| 282.1 | 67.75 |
| 282.17 | 67.75 |
| 282.24 | 67.75 |
| 282.31 | 67.5 |
| 282.38 | 67.5 |
| 282.44 | 67.5 |
| 282.51 | 67.5 |
| 282.58 | 67.25 |
| 282.65 | 67.25 |
| 282.72 | 67.25 |
| 282.78 | 67.25 |
| 282.85 | 67.5 |
| 282.92 | 67.5 |
| 282.99 | 67.75 |
| 283.06 | 68.25 |
| 283.13 | 68.75 |
| 283.19 | 69.25 |
| 283.26 | 69.75 |
| 283.33 | 70.25 |
| 283.4 | 70.5 |
| 283.47 | 71 |
| 283.53 | 71 |
| 283.6 | 71.25 |
| 283.67 | 71.5 |
| 283.74 | 72 |
| 283.81 | 72.25 |
| 283.87 | 72.75 |
| 283.94 | 73 |
| 284.01 | 73.25 |
| 284.08 | 73.75 |
| 284.15 | 74 |
| 284.22 | 74.25 |
| 284.28 | 74.75 |
| 284.35 | 74.75 |
| 284.42 | 75 |
| 284.49 | 75.25 |
| 284.56 | 75.5 |
| 284.62 | 76 |
| 284.69 | 76.25 |
| 284.76 | 76.75 |
| 284.83 | 77 |
| 284.9 | 77.25 |
| 284.96 | 77.5 |
| 285.03 | 78 |
| 285.1 | 78.25 |
| 285.17 | 78.25 |
| 285.24 | 78.5 |
| 285.3 | 78.75 |
| 285.37 | 79.25 |
| 285.44 | 79.5 |
| 285.51 | 79.75 |
| 285.58 | 80 |
| 285.64 | 80.25 |
| 285.71 | 80.5 |
| 285.78 | 80.75 |
| 285.85 | 81.25 |
| 285.92 | 81.5 |
| 285.99 | 81.5 |
| 286.05 | 81.75 |
| 286.12 | 82 |
| 286.19 | 82.25 |
| 286.26 | 82.5 |
| 286.33 | 82.75 |
| 286.39 | 83 |
| 286.46 | 83.25 |
| 286.53 | 83.5 |
| 286.6 | 83.75 |
| 286.67 | 84 |
| 286.74 | 84 |
| 286.8 | 84.25 |
| 286.87 | 84.5 |
| 286.94 | 84.75 |
| 287.01 | 85 |
| 287.08 | 85.25 |
| 287.14 | 85.5 |
| 287.21 | 85.75 |
| 287.28 | 86 |
| 287.35 | 86.25 |
| 287.42 | 86.5 |
| 287.48 | 86.75 |
| 287.55 | 86.75 |
| 287.62 | 87 |
| 287.69 | 87 |
| 287.76 | 87.25 |
| 287.83 | 87.5 |
| 287.89 | 87.75 |
| 287.96 | 88 |
| 288.03 | 88.25 |
| 288.1 | 88.5 |
| 288.17 | 88.75 |
| 288.23 | 89 |
| 288.3 | 89 |
| 288.37 | 89 |
| 288.44 | 89.25 |
| 288.51 | 89.5 |
| 288.58 | 89.75 |
| 288.64 | 89.75 |
| 288.71 | 90 |
| 288.78 | 90.25 |
| 288.85 | 90.5 |
| 288.92 | 90.5 |
| 288.98 | 90.75 |
| 289.05 | 91 |
| 289.12 | 91.25 |
| 289.19 | 91.25 |
| 289.26 | 91.25 |
| 289.33 | 91.5 |
| 289.39 | 91.75 |
| 289.46 | 92 |
| 289.53 | 92 |
| 289.6 | 92.25 |
| 289.67 | 92.5 |
| 289.73 | 92.75 |
| 289.8 | 93 |
| 289.87 | 93 |
| 289.94 | 93.25 |
| 290.01 | 93.25 |
| 290.07 | 93.5 |
| 290.14 | 93.5 |
| 290.21 | 93.75 |
| 290.28 | 94 |
| 290.35 | 94 |
| 290.41 | 94.25 |
| 290.48 | 94.5 |
| 290.55 | 94.75 |
| 290.62 | 94.75 |
| 290.69 | 95 |
| 290.76 | 95.25 |
| 290.82 | 95.25 |
| 290.89 | 95.5 |
| 290.96 | 95.75 |
| 291.03 | 95.75 |
| 291.1 | 96 |
| 291.16 | 96 |
| 291.23 | 96.25 |
| 291.3 | 96.5 |
| 291.37 | 96.5 |
| 291.44 | 96.75 |
| 291.51 | 96.75 |
| 291.57 | 97 |
| 291.64 | 97 |
| 291.71 | 97 |
| 291.78 | 97.25 |
| 291.85 | 97.5 |
| 291.91 | 97.5 |
| 291.98 | 97.75 |
| 292.05 | 97.75 |
| 292.12 | 98 |
| 292.19 | 98.25 |
| 292.25 | 98.25 |
| 292.32 | 98.5 |
| 292.39 | 98.5 |
| 292.46 | 98.5 |
| 292.53 | 98.75 |
| 292.59 | 98.75 |
| 292.66 | 99 |
| 292.73 | 99.25 |
| 292.8 | 99.25 |
| 292.87 | 99.5 |
| 292.94 | 99.5 |
| 293.0 | 99.75 |
| 293.07 | 99.75 |
| 293.14 | 100 |
| 293.21 | 100 |
| 293.28 | 100 |
| 293.35 | 100.25 |
| 293.41 | 100.25 |
| 293.48 | 100.5 |
| 293.55 | 100.5 |
| 293.62 | 100.75 |
| 293.69 | 100.75 |
| 293.75 | 100.75 |
| 293.82 | 101 |
| 293.89 | 101 |
| 293.96 | 101.25 |
| 294.03 | 101.25 |
| 294.1 | 101.25 |
| 294.16 | 101.25 |
| 294.23 | 101.25 |
| 294.3 | 101.25 |
| 294.37 | 101.25 |
| 294.44 | 101.25 |
| 294.51 | 101.25 |
| 294.57 | 101.25 |
| 294.64 | 101.25 |
| 294.71 | 101 |
| 294.78 | 101 |
| 294.85 | 101 |
| 294.92 | 101 |
| 294.98 | 100.75 |
| 295.05 | 100.25 |
| 295.12 | 100 |
| 295.19 | 99.75 |
| 295.26 | 99.5 |
| 295.32 | 99 |
| 295.39 | 98.75 |
| 295.46 | 98.25 |
| 295.53 | 97.75 |
| 295.6 | 97.5 |
| 295.66 | 97 |
| 295.73 | 97 |
| 295.8 | 96.5 |
| 295.87 | 96 |
| 295.94 | 95.5 |
| 296.0 | 94.75 |
| 296.07 | 94.25 |
| 296.14 | 93.75 |
| 296.21 | 93.25 |
| 296.28 | 92.75 |
| 296.35 | 92.25 |
| 296.41 | 91.75 |
| 296.48 | 91 |
| 296.55 | 91 |
| 296.62 | 90.5 |
| 296.69 | 90 |
| 296.75 | 89.5 |
| 296.82 | 89 |
| 296.89 | 88.5 |
| 296.96 | 88 |
| 297.03 | 87.5 |
| 297.09 | 87 |
| 297.16 | 86.5 |
| 297.23 | 86 |
| 297.3 | 85.5 |
| 297.37 | 85.5 |
| 297.43 | 85.25 |
| 297.5 | 84.75 |
| 297.57 | 84.25 |
| 297.64 | 84 |
| 297.71 | 83.5 |
| 297.77 | 83.25 |
| 297.84 | 82.75 |
| 297.91 | 82.25 |
| 297.98 | 82 |
| 298.05 | 81.75 |
| 298.11 | 81.75 |
| 298.18 | 81.25 |
| 298.25 | 81 |
| 298.32 | 80.5 |
| 298.39 | 80.25 |
| 298.46 | 80 |
| 298.52 | 79.5 |
| 298.59 | 79.25 |
| 298.66 | 78.75 |
| 298.73 | 78.5 |
| 298.8 | 78.25 |
| 298.86 | 78 |
| 298.93 | 78 |
| 299.0 | 77.5 |
| 299.07 | 77.25 |
| 299.14 | 77 |
| 299.2 | 76.75 |
| 299.27 | 76.5 |
| 299.34 | 76.25 |
| 299.41 | 75.75 |
| 299.48 | 75.5 |
| 299.55 | 75.25 |
| 299.61 | 75 |
| 299.68 | 74.75 |
| 299.75 | 74.75 |
| 299.82 | 74.25 |
| 299.89 | 74.25 |
| 299.95 | 74 |
| 300.02 | 73.5 |
| 300.09 | 73.5 |
| 300.16 | 73.25 |
| 300.23 | 72.75 |
| 300.29 | 72.75 |
| 300.36 | 72.25 |
| 300.43 | 72.25 |
| 300.5 | 72 |
| 300.57 | 72 |
| 300.64 | 71.75 |
| 300.7 | 71.5 |
| 300.77 | 71.25 |
| 300.84 | 71 |
| 300.91 | 70.75 |
| 300.98 | 70.5 |
| 301.04 | 70.5 |
| 301.11 | 70 |
| 301.18 | 69.75 |
| 301.25 | 69.5 |
| 301.32 | 69.25 |
| 301.38 | 69.25 |
| 301.45 | 69.25 |
| 301.52 | 69 |
| 301.59 | 68.75 |
| 301.66 | 68.5 |
| 301.72 | 68.25 |
| 301.79 | 68.25 |
| 301.86 | 68 |
| 301.93 | 68.25 |
| 302.0 | 68.5 |
| 302.07 | 68.5 |
| 302.13 | 68.5 |
| 302.2 | 68.5 |
| 302.27 | 68.75 |
| 302.34 | 68.75 |
| 302.41 | 68.75 |
| 302.47 | 69 |
| 302.54 | 69 |
| 302.61 | 69 |
| 302.68 | 69.25 |
| 302.75 | 69.25 |
| 302.82 | 69.25 |
| 302.88 | 69.25 |
| 302.95 | 69.5 |
| 303.02 | 69.5 |
| 303.09 | 69.5 |
| 303.16 | 69.75 |
| 303.22 | 69.75 |
| 303.29 | 69.75 |
| 303.36 | 69.75 |
| 303.43 | 69.75 |
| 303.5 | 69.75 |
| 303.57 | 69.75 |
| 303.63 | 69.75 |
| 303.7 | 69.75 |
| 303.77 | 69.75 |
| 303.84 | 69.75 |
| 303.91 | 69.75 |
| 303.98 | 69.75 |
| 304.04 | 69.75 |
| 304.11 | 69.75 |
| 304.18 | 69.75 |
| 304.25 | 69.75 |
| 304.32 | 69.75 |
| 304.38 | 69.5 |
| 304.45 | 69.5 |
| 304.52 | 69.5 |
| 304.59 | 69.5 |
| 304.66 | 69.5 |
| 304.72 | 69.25 |
| 304.79 | 69.25 |
| 304.86 | 69.25 |
| 304.93 | 69 |
| 305.0 | 69 |
| 305.07 | 69 |
| 305.13 | 68.75 |
| 305.2 | 68.75 |
| 305.27 | 68.75 |
| 305.34 | 68.5 |
| 305.41 | 68.5 |
| 305.48 | 68.5 |
| 305.54 | 68.5 |
| 305.61 | 68.5 |
| 305.68 | 68.25 |
| 305.75 | 68.25 |
| 305.82 | 68.25 |
| 305.88 | 68.25 |
| 305.95 | 68.25 |
| 306.02 | 68 |
| 306.09 | 68 |
| 306.16 | 68 |
| 306.23 | 67.75 |
| 306.29 | 67.75 |
| 306.36 | 67.75 |
| 306.43 | 67.75 |
| 306.5 | 67.5 |
| 306.57 | 67.5 |
| 306.63 | 67.5 |
| 306.7 | 67.25 |
| 306.77 | 67.25 |
| 306.84 | 67.25 |
| 306.91 | 67.25 |
| 306.98 | 67.25 |
| 307.04 | 67.25 |
| 307.11 | 67.25 |
| 307.18 | 67.5 |
| 307.25 | 67.75 |
| 307.32 | 68 |
| 307.38 | 68.5 |
| 307.45 | 69 |
| 307.52 | 69.5 |
| 307.59 | 69.75 |
| 307.66 | 70.5 |
| 307.73 | 70.75 |
| 307.79 | 71 |
| 307.86 | 71.5 |
| 307.93 | 71.5 |
| 308.0 | 71.75 |
| 308.07 | 72 |
| 308.13 | 72.5 |
| 308.2 | 72.75 |
| 308.27 | 73 |
| 308.34 | 73.5 |
| 308.41 | 73.75 |
| 308.47 | 74.25 |
| 308.54 | 74.5 |
| 308.61 | 74.75 |
| 308.68 | 75 |
| 308.75 | 75 |
| 308.81 | 75.25 |
| 308.88 | 75.75 |
| 308.95 | 76 |
| 309.02 | 76.5 |
| 309.09 | 76.5 |
| 309.16 | 77 |
| 309.22 | 77.25 |
| 309.29 | 77.5 |
| 309.36 | 77.75 |
| 309.43 | 78.25 |
| 309.5 | 78.5 |
| 309.56 | 78.5 |
| 309.63 | 78.75 |
| 309.7 | 79.25 |
| 309.77 | 79.25 |
| 309.84 | 79.75 |
| 309.91 | 80 |
| 309.97 | 80.25 |
| 310.04 | 80.5 |
| 310.11 | 80.75 |
| 310.18 | 81 |
| 310.25 | 81.5 |
| 310.31 | 81.5 |
| 310.38 | 81.75 |
| 310.45 | 82 |
| 310.52 | 82.25 |
| 310.59 | 82.5 |
| 310.65 | 82.75 |
| 310.72 | 83 |
| 310.79 | 83.25 |
| 310.86 | 83.5 |
| 310.93 | 83.75 |
| 310.99 | 84 |
| 311.06 | 84.25 |
| 311.13 | 84.25 |
| 311.2 | 84.5 |
| 311.27 | 84.75 |
| 311.33 | 85 |
| 311.4 | 85.25 |
| 311.47 | 85.25 |
| 311.54 | 85.75 |
| 311.61 | 85.75 |
| 311.68 | 86 |
| 311.74 | 86.25 |
| 311.81 | 86.5 |
| 311.88 | 86.75 |
| 311.95 | 86.75 |
| 312.02 | 87 |
| 312.08 | 87.25 |
| 312.15 | 87.5 |
| 312.22 | 87.75 |
| 312.29 | 88 |
| 312.36 | 88 |
| 312.42 | 88.25 |
| 312.49 | 88.5 |
| 312.56 | 88.75 |
| 312.63 | 89 |
| 312.7 | 89.25 |
| 312.77 | 89.25 |
| 312.83 | 89.25 |
| 312.9 | 89.5 |
| 312.97 | 89.75 |
| 313.04 | 90 |
| 313.11 | 90.25 |
| 313.17 | 90.25 |
| 313.24 | 90.75 |
| 313.31 | 90.75 |
| 313.38 | 91 |
| 313.45 | 91.25 |
| 313.52 | 91.5 |
| 313.58 | 91.5 |
| 313.65 | 91.75 |
| 313.72 | 91.75 |
| 313.79 | 92 |
| 313.86 | 92.25 |
| 313.92 | 92.5 |
| 313.99 | 92.5 |
| 314.06 | 92.75 |
| 314.13 | 93 |
| 314.2 | 93.25 |
| 314.27 | 93.5 |
| 314.33 | 93.5 |
| 314.4 | 93.5 |
| 314.47 | 93.75 |
| 314.54 | 94 |
| 314.61 | 94 |
| 314.67 | 94.25 |
| 314.74 | 94.5 |
| 314.81 | 94.75 |
| 314.88 | 94.75 |
| 314.95 | 95 |
| 315.02 | 95.25 |
| 315.08 | 95.5 |
| 315.15 | 95.5 |
| 315.22 | 95.5 |
| 315.29 | 95.75 |
| 315.36 | 95.75 |
| 315.42 | 96 |
| 315.49 | 96.25 |
| 315.56 | 96.5 |
| 315.63 | 96.5 |
| 315.7 | 96.75 |
| 315.76 | 97 |
| 315.83 | 97 |
| 315.9 | 97.25 |
| 315.97 | 97.25 |
| 316.04 | 97.25 |
| 316.1 | 97.5 |
| 316.17 | 97.75 |
| 316.24 | 97.75 |
| 316.31 | 98 |
| 316.38 | 98.25 |
| 316.45 | 98.25 |
| 316.51 | 98.5 |
| 316.58 | 98.5 |
| 316.65 | 98.75 |
| 316.72 | 99 |
| 316.79 | 99 |
| 316.85 | 99 |
| 316.92 | 99.25 |
| 316.99 | 99.25 |
| 317.06 | 99.5 |
| 317.13 | 99.5 |
| 317.2 | 99.75 |
| 317.26 | 99.75 |
| 317.33 | 100 |
| 317.4 | 100 |
| 317.47 | 100 |
| 317.54 | 100.25 |
| 317.6 | 100.25 |
| 317.67 | 100.25 |
| 317.74 | 100.5 |
| 317.81 | 100.5 |
| 317.88 | 100.75 |
| 317.95 | 100.75 |
| 318.01 | 100.75 |
| 318.08 | 101 |
| 318.15 | 101 |
| 318.22 | 101.25 |
| 318.29 | 101 |
| 318.36 | 101.25 |
| 318.42 | 101.25 |
| 318.49 | 101.25 |
| 318.56 | 101.25 |
| 318.63 | 101.25 |
| 318.7 | 101.25 |
| 318.77 | 101.25 |
| 318.83 | 101.25 |
| 318.9 | 101.25 |
| 318.97 | 101.25 |
| 319.04 | 101 |
| 319.11 | 100.25 |
| 319.17 | 100 |
| 319.24 | 99.75 |
| 319.31 | 99.75 |
| 319.38 | 99.5 |
| 319.45 | 99.25 |
| 319.51 | 98.75 |
| 319.58 | 98.25 |
| 319.65 | 97.75 |
| 319.72 | 97.25 |
| 319.79 | 96.75 |
| 319.85 | 96.25 |
| 319.92 | 95.75 |
| 319.99 | 95.25 |
| 320.06 | 94.5 |
| 320.13 | 94.5 |
| 320.2 | 94 |
| 320.26 | 93.5 |
| 320.33 | 93 |
| 320.4 | 92.5 |
| 320.47 | 91.75 |
| 320.54 | 91.25 |
| 320.6 | 90.75 |
| 320.67 | 90.25 |
| 320.74 | 89.75 |
| 320.81 | 89.25 |
| 320.88 | 88.5 |
| 320.94 | 88.5 |
| 321.01 | 88 |
| 321.08 | 87.75 |
| 321.15 | 87.25 |
| 321.22 | 86.75 |
| 321.29 | 86.25 |
| 321.35 | 85.75 |
| 321.42 | 85.25 |
| 321.49 | 85 |
| 321.56 | 84.5 |
| 321.63 | 84 |
| 321.69 | 84 |
| 321.76 | 83.5 |
| 321.83 | 83.25 |
| 321.9 | 82.75 |
| 321.97 | 82.5 |
| 322.03 | 82 |
| 322.1 | 81.5 |
| 322.17 | 81.25 |
| 322.24 | 80.75 |
| 322.31 | 80.5 |
| 322.37 | 80.25 |
| 322.44 | 79.75 |
| 322.51 | 79.75 |
| 322.58 | 79.5 |
| 322.65 | 79 |
| 322.71 | 78.75 |
| 322.78 | 78.5 |
| 322.85 | 78 |
| 322.92 | 77.75 |
| 322.99 | 77.5 |
| 323.05 | 77.25 |
| 323.12 | 77 |
| 323.19 | 76.5 |
| 323.26 | 76.25 |
| 323.33 | 76.25 |
| 323.39 | 76 |
| 323.46 | 75.75 |
| 323.53 | 75.25 |
| 323.6 | 75.25 |
| 323.67 | 74.75 |
| 323.73 | 74.5 |
| 323.8 | 74.25 |
| 323.87 | 74 |
| 323.94 | 73.75 |
| 324.01 | 73.5 |
| 324.08 | 73.25 |
| 324.14 | 73.25 |
| 324.21 | 73 |
| 324.28 | 72.75 |
| 324.35 | 72.5 |
| 324.42 | 72.25 |
| 324.48 | 72 |
| 324.55 | 71.75 |
| 324.62 | 71.5 |
| 324.69 | 71.25 |
| 324.76 | 71 |
| 324.83 | 70.75 |
| 324.89 | 70.75 |
| 324.96 | 70.75 |
| 325.03 | 70.5 |
| 325.1 | 70.25 |
| 325.17 | 70 |
| 325.23 | 69.75 |
| 325.3 | 69.5 |
| 325.37 | 69.25 |
| 325.44 | 69 |
| 325.51 | 68.75 |
| 325.57 | 68.5 |
| 325.64 | 68.5 |
| 325.71 | 68.25 |
| 325.78 | 68.25 |
| 325.85 | 68.5 |
| 325.92 | 68.75 |
| 325.98 | 68.75 |
| 326.05 | 68.75 |
| 326.12 | 69 |
| 326.19 | 69 |
| 326.26 | 69 |
| 326.32 | 69 |
| 326.39 | 69.25 |
| 326.46 | 69.25 |
| 326.53 | 69.25 |
| 326.6 | 69.25 |
| 326.67 | 69.5 |
| 326.73 | 69.5 |
| 326.8 | 69.5 |
| 326.87 | 69.75 |
| 326.94 | 69.75 |
| 327.01 | 69.75 |
| 327.07 | 69.75 |
| 327.14 | 69.75 |
| 327.21 | 70 |
| 327.28 | 70 |
| 327.35 | 70 |
| 327.42 | 70 |
| 327.48 | 70 |
| 327.55 | 70 |
| 327.62 | 70 |
| 327.69 | 70 |
| 327.76 | 70 |
| 327.83 | 70 |
| 327.89 | 70 |
| 327.96 | 70 |
| 328.03 | 70 |
| 328.1 | 69.75 |
| 328.17 | 69.75 |
| 328.23 | 69.75 |
| 328.3 | 69.75 |
| 328.37 | 69.5 |
| 328.44 | 69.5 |
| 328.51 | 69.5 |
| 328.57 | 69.25 |
| 328.64 | 69.25 |
| 328.71 | 69.25 |
| 328.78 | 69.25 |
| 328.85 | 69.25 |
| 328.92 | 69 |
| 328.98 | 69 |
| 329.05 | 69 |
| 329.12 | 68.75 |
| 329.19 | 68.75 |
| 329.26 | 68.75 |
| 329.33 | 68.75 |
| 329.39 | 68.5 |
| 329.46 | 68.5 |
| 329.53 | 68.5 |
| 329.6 | 68.25 |
| 329.67 | 68.25 |
| 329.73 | 68.25 |
| 329.8 | 68.25 |
| 329.87 | 68.25 |
| 329.94 | 68 |
| 330.01 | 68 |
| 330.08 | 68 |
| 330.14 | 67.75 |
| 330.21 | 67.75 |
| 330.28 | 67.75 |
| 330.35 | 67.75 |
| 330.42 | 67.5 |
| 330.48 | 67.5 |
| 330.55 | 67.5 |
| 330.62 | 67.5 |
| 330.69 | 67.5 |
| 330.76 | 67.25 |
| 330.83 | 67.25 |
| 330.89 | 67.25 |
| 330.96 | 67.25 |
| 331.03 | 67.5 |
| 331.1 | 67.5 |
| 331.17 | 67.75 |
| 331.23 | 68.25 |
| 331.3 | 68.5 |
| 331.37 | 69.25 |
| 331.44 | 69.75 |
| 331.51 | 69.75 |
| 331.58 | 70 |
| 331.64 | 70.5 |
| 331.71 | 71 |
| 331.78 | 71.25 |
| 331.85 | 71.5 |
| 331.92 | 72 |
| 331.98 | 72.25 |
| 332.05 | 72.75 |
| 332.12 | 73 |
| 332.19 | 73.25 |
| 332.26 | 73.75 |
| 332.33 | 73.75 |
| 332.39 | 74 |
| 332.46 | 74.5 |
| 332.53 | 74.75 |
| 332.6 | 75 |
| 332.67 | 75.25 |
| 332.73 | 75.75 |
| 332.8 | 76 |
| 332.87 | 76.25 |
| 332.94 | 76.75 |
| 333.01 | 77 |
| 333.08 | 77.25 |
| 333.14 | 77.25 |
| 333.21 | 77.5 |
| 333.28 | 77.75 |
| 333.35 | 78.25 |
| 333.42 | 78.5 |
| 333.48 | 78.75 |
| 333.55 | 79 |
| 333.62 | 79.5 |
| 333.69 | 79.75 |
| 333.76 | 80 |
| 333.83 | 80.25 |
| 333.89 | 80.5 |
| 333.96 | 80.5 |
| 334.03 | 80.75 |
| 334.1 | 81 |
| 334.17 | 81.5 |
| 334.23 | 81.75 |
| 334.3 | 82 |
| 334.37 | 82.25 |
| 334.44 | 82.5 |
| 334.51 | 82.75 |
| 334.58 | 83 |
| 334.64 | 83.25 |
| 334.71 | 83.75 |
| 334.78 | 83.75 |
| 334.85 | 84 |
| 334.92 | 84.25 |
| 334.98 | 84.25 |
| 335.05 | 84.5 |
| 335.12 | 85 |
| 335.19 | 85.25 |
| 335.26 | 85.25 |
| 335.33 | 85.5 |
| 335.39 | 85.75 |
| 335.46 | 86 |
| 335.53 | 86.25 |
| 335.6 | 86.25 |
| 335.67 | 86.5 |
| 335.73 | 86.75 |
| 335.8 | 87 |
| 335.87 | 87.25 |
| 335.94 | 87.5 |
| 336.01 | 87.75 |
| 336.08 | 87.75 |
| 336.14 | 88 |
| 336.21 | 88.25 |
| 336.28 | 88.5 |
| 336.35 | 88.75 |
| 336.42 | 88.75 |
| 336.48 | 89 |
| 336.55 | 89 |
| 336.62 | 89.5 |
| 336.69 | 89.5 |
| 336.76 | 89.75 |
| 336.83 | 90 |
| 336.89 | 90.25 |
| 336.96 | 90.25 |
| 337.03 | 90.5 |
| 337.1 | 90.75 |
| 337.17 | 91 |
| 337.23 | 91 |
| 337.3 | 91.25 |
| 337.37 | 91.25 |
| 337.44 | 91.5 |
| 337.51 | 91.75 |
| 337.57 | 92 |
| 337.64 | 92.25 |
| 337.71 | 92.5 |
| 337.78 | 92.5 |
| 337.85 | 92.75 |
| 337.92 | 93 |
| 337.98 | 93.25 |
| 338.05 | 93.25 |
| 338.12 | 93.25 |
| 338.19 | 93.5 |
| 338.26 | 93.75 |
| 338.33 | 94 |
| 338.39 | 94 |
| 338.46 | 94.25 |
| 338.53 | 94.5 |
| 338.6 | 94.75 |
| 338.67 | 94.75 |
| 338.73 | 95 |
| 338.8 | 95.25 |
| 338.87 | 95.25 |
| 338.94 | 95.5 |
| 339.01 | 95.75 |
| 339.08 | 95.75 |
| 339.14 | 96 |
| 339.21 | 96.25 |
| 339.28 | 96.25 |
| 339.35 | 96.5 |
| 339.42 | 96.5 |
| 339.48 | 96.75 |
| 339.55 | 97 |
| 339.62 | 97 |
| 339.69 | 97 |
| 339.76 | 97.25 |
| 339.83 | 97.5 |
| 339.89 | 97.5 |
| 339.96 | 97.75 |
| 340.03 | 98 |
| 340.1 | 98 |
| 340.17 | 98.25 |
| 340.23 | 98.25 |
| 340.3 | 98.5 |
| 340.37 | 98.75 |
| 340.44 | 98.75 |
| 340.51 | 98.75 |
| 340.58 | 99 |
| 340.64 | 99 |
| 340.71 | 99.25 |
| 340.78 | 99.5 |
| 340.85 | 99.5 |
| 340.92 | 99.75 |
| 340.98 | 99.75 |
| 341.05 | 99.75 |
| 341.12 | 100 |
| 341.19 | 100.25 |
| 341.26 | 100.25 |
| 341.33 | 100.25 |
| 341.39 | 100.25 |
| 341.46 | 100.5 |
| 341.53 | 100.5 |
| 341.6 | 100.75 |
| 341.67 | 100.75 |
| 341.74 | 100.75 |
| 341.8 | 101 |
| 341.87 | 101 |
| 341.94 | 101 |
| 342.01 | 101.25 |
| 342.08 | 101.25 |
| 342.15 | 101.25 |
| 342.21 | 101.25 |
| 342.28 | 101.25 |
| 342.35 | 101.25 |
| 342.42 | 101.25 |
| 342.49 | 101.25 |
| 342.55 | 101 |
| 342.62 | 101 |
| 342.69 | 101 |
| 342.76 | 101 |
| 342.83 | 100.5 |
| 342.9 | 100.25 |
| 342.96 | 100.25 |
| 343.03 | 99.75 |
| 343.1 | 99.5 |
| 343.17 | 99.25 |
| 343.24 | 99 |
| 343.3 | 98.5 |
| 343.37 | 98 |
| 343.44 | 97.5 |
| 343.51 | 97 |
| 343.58 | 96.5 |
| 343.65 | 96 |
| 343.71 | 95.5 |
| 343.78 | 95.5 |
| 343.85 | 95 |
| 343.92 | 94.25 |
| 343.99 | 93.75 |
| 344.05 | 93.25 |
| 344.12 | 92.75 |
| 344.19 | 92.25 |
| 344.26 | 91.75 |
| 344.33 | 91 |
| 344.39 | 90.75 |
| 344.46 | 90.25 |
| 344.53 | 89.5 |
| 344.6 | 89.5 |
| 344.67 | 89 |
| 344.73 | 88.5 |
| 344.8 | 88 |
| 344.87 | 87.75 |
| 344.94 | 87.25 |
| 345.01 | 86.75 |
| 345.08 | 86.25 |
| 345.14 | 85.75 |
| 345.21 | 85.25 |
| 345.28 | 84.75 |
| 345.35 | 84.5 |
| 345.42 | 84.5 |
| 345.48 | 84 |
| 345.55 | 83.75 |
| 345.62 | 83.25 |
| 345.69 | 82.75 |
| 345.76 | 82.5 |
| 345.83 | 82 |
| 345.89 | 81.75 |
| 345.96 | 81.25 |
| 346.03 | 81 |
| 346.1 | 80.5 |
| 346.17 | 80.25 |
| 346.23 | 80.25 |
| 346.3 | 79.75 |
| 346.37 | 79.5 |
| 346.44 | 79.25 |
| 346.51 | 79 |
| 346.57 | 78.5 |
| 346.64 | 78.25 |
| 346.71 | 78 |
| 346.78 | 77.5 |
| 346.85 | 77.25 |
| 346.92 | 77 |
| 346.98 | 76.75 |
| 347.05 | 76.75 |
| 347.12 | 76.5 |
| 347.19 | 76 |
| 347.26 | 75.75 |
| 347.32 | 75.5 |
| 347.39 | 75.25 |
| 347.46 | 75 |
| 347.53 | 74.75 |
| 347.6 | 74.5 |
| 347.67 | 74.25 |
| 347.73 | 74 |
| 347.8 | 73.5 |
| 347.87 | 73.5 |
| 347.94 | 73.25 |
| 348.01 | 73 |
| 348.07 | 72.75 |
| 348.14 | 72.5 |
| 348.21 | 72.25 |
| 348.28 | 72 |
| 348.35 | 71.75 |
| 348.41 | 71.5 |
| 348.48 | 71.25 |
| 348.55 | 71 |
| 348.62 | 71 |
| 348.69 | 71 |
| 348.75 | 70.75 |
| 348.82 | 70.5 |
| 348.89 | 70.25 |
| 348.96 | 70 |
| 349.03 | 69.75 |
| 349.1 | 69.5 |
| 349.16 | 69.25 |
| 349.23 | 69 |
| 349.3 | 68.75 |
| 349.37 | 68.5 |
| 349.44 | 68.5 |
| 349.5 | 68.5 |
| 349.57 | 68.25 |
| 349.64 | 68.5 |
| 349.71 | 68.75 |
| 349.78 | 68.75 |
| 349.85 | 68.75 |
| 349.91 | 69 |
| 349.98 | 69 |
| 350.05 | 69 |
| 350.12 | 69.25 |
| 350.19 | 69.25 |
| 350.26 | 69.25 |
| 350.32 | 69.25 |
| 350.39 | 69.5 |
| 350.46 | 69.5 |
| 350.53 | 69.5 |
| 350.6 | 69.5 |
| 350.66 | 69.75 |
| 350.73 | 69.75 |
| 350.8 | 69.75 |
| 350.87 | 70 |
| 350.94 | 70 |
| 351.01 | 70 |
| 351.07 | 70 |
| 351.14 | 70 |
| 351.21 | 70 |
| 351.28 | 70 |
| 351.35 | 70 |
| 351.42 | 70 |
| 351.48 | 70 |
| 351.55 | 70 |
| 351.62 | 70 |
| 351.69 | 70 |
| 351.76 | 69.75 |
| 351.83 | 69.75 |
| 351.89 | 69.75 |
| 351.96 | 69.75 |
| 352.03 | 69.5 |
| 352.1 | 69.5 |
| 352.17 | 69.5 |
| 352.23 | 69.5 |
| 352.3 | 69.25 |
| 352.37 | 69.25 |
| 352.44 | 69.25 |
| 352.51 | 69 |
| 352.58 | 69 |
| 352.64 | 68.75 |
| 352.71 | 68.75 |
| 352.78 | 68.75 |
| 352.85 | 68.75 |
| 352.92 | 68.5 |
| 352.99 | 68.75 |
| 353.05 | 68.5 |
| 353.12 | 68.5 |
| 353.19 | 68.5 |
| 353.26 | 68.25 |
| 353.33 | 68.25 |
| 353.39 | 68.25 |
| 353.46 | 68.25 |
| 353.53 | 68 |
| 353.6 | 68 |
| 353.67 | 68 |
| 353.74 | 68 |
| 353.8 | 67.75 |
| 353.87 | 67.75 |
| 353.94 | 67.75 |
| 354.01 | 67.75 |
| 354.08 | 67.5 |
| 354.15 | 67.5 |
| 354.21 | 67.5 |
| 354.28 | 67.25 |
| 354.35 | 67.25 |
| 354.42 | 67.25 |
| 354.49 | 67.25 |
| 354.55 | 67 |
| 354.62 | 67 |
| 354.69 | 67.25 |
| 354.76 | 67.25 |
| 354.83 | 67.5 |
| 354.89 | 68 |
| 354.96 | 68.25 |
| 355.03 | 68.75 |
| 355.1 | 69.25 |
| 355.17 | 69.75 |
| 355.24 | 69.75 |
| 355.3 | 70 |
| 355.37 | 70.5 |
| 355.44 | 71 |
| 355.51 | 71.25 |
| 355.58 | 71.5 |
| 355.65 | 72 |
| 355.71 | 72.25 |
| 355.78 | 72.75 |
| 355.85 | 73 |
| 355.92 | 73.5 |
| 355.99 | 73.75 |
| 356.05 | 73.75 |
| 356.12 | 74.25 |
| 356.19 | 74.25 |
| 356.26 | 74.75 |
| 356.33 | 75 |
| 356.4 | 75.5 |
| 356.46 | 75.75 |
| 356.53 | 76 |
| 356.6 | 76.5 |
| 356.67 | 76.75 |
| 356.74 | 77 |
| 356.8 | 77.25 |
| 356.87 | 77.25 |
| 356.94 | 77.75 |
| 357.01 | 78 |
| 357.08 | 78.25 |
| 357.14 | 78.75 |
| 357.21 | 79 |
| 357.28 | 79.25 |
| 357.35 | 79.5 |
| 357.42 | 80 |
| 357.49 | 80.25 |
| 357.55 | 80.5 |
| 357.62 | 80.75 |
| 357.69 | 80.75 |
| 357.76 | 81 |
| 357.83 | 81.25 |
| 357.9 | 81.5 |
| 357.96 | 81.75 |
| 358.03 | 82 |
| 358.1 | 82.25 |
| 358.17 | 82.75 |
| 358.24 | 83 |
| 358.3 | 83 |
| 358.37 | 83.5 |
| 358.44 | 83.75 |
| 358.51 | 83.75 |
| 358.58 | 84 |
| 358.64 | 84.25 |
| 358.71 | 84.5 |
| 358.78 | 84.75 |
| 358.85 | 85 |
| 358.92 | 85.25 |
| 358.99 | 85.5 |
| 359.05 | 85.75 |
| 359.12 | 86 |
| 359.19 | 86.25 |
| 359.26 | 86.5 |
| 359.33 | 86.5 |
| 359.4 | 86.75 |
| 359.46 | 87 |
| 359.53 | 87.25 |
| 359.6 | 87.5 |
| 359.67 | 87.75 |
| 359.74 | 87.75 |
| 359.8 | 88 |
| 359.87 | 88.25 |
| 359.94 | 88.5 |
| 360.01 | 88.75 |
| 360.08 | 89 |
| 360.14 | 89 |
| 360.21 | 89 |
| 360.28 | 89.5 |
| 360.35 | 89.75 |
| 360.42 | 90 |
| 360.49 | 90 |
| 360.55 | 90.25 |
| 360.62 | 90.5 |
| 360.69 | 90.75 |
| 360.76 | 91 |
| 360.83 | 91 |
| 360.89 | 91.25 |
| 360.96 | 91.25 |
| 361.03 | 91.5 |
| 361.1 | 91.75 |
| 361.17 | 91.75 |
| 361.24 | 92.25 |
| 361.3 | 92.5 |
| 361.37 | 92.5 |
| 361.44 | 92.75 |
| 361.51 | 93 |
| 361.58 | 93 |
| 361.65 | 93.25 |
| 361.71 | 93.5 |
| 361.78 | 93.5 |
| 361.85 | 93.5 |
| 361.92 | 93.75 |
| 361.99 | 94 |
| 362.05 | 94.25 |
| 362.12 | 94.25 |
| 362.19 | 94.5 |
| 362.26 | 94.75 |
| 362.33 | 95 |
| 362.39 | 95 |
| 362.46 | 95.25 |
| 362.53 | 95.5 |
| 362.6 | 95.5 |
| 362.67 | 95.75 |
| 362.74 | 95.75 |
| 362.8 | 96 |
| 362.87 | 96.25 |
| 362.94 | 96.25 |
| 363.01 | 96.5 |
| 363.08 | 96.75 |
| 363.14 | 97 |
| 363.21 | 97 |
| 363.28 | 97.25 |
| 363.35 | 97.25 |
| 363.42 | 97.25 |
| 363.49 | 97.5 |
| 363.55 | 97.5 |
| 363.62 | 97.75 |
| 363.69 | 98 |
| 363.76 | 98 |
| 363.83 | 98.25 |
| 363.89 | 98.5 |
| 363.96 | 98.5 |
| 364.03 | 98.75 |
| 364.1 | 99 |
| 364.17 | 99 |
| 364.24 | 99 |
| 364.3 | 99 |
| 364.37 | 99.25 |
| 364.44 | 99.5 |
| 364.51 | 99.5 |
| 364.58 | 99.75 |
| 364.65 | 99.75 |
| 364.71 | 100 |
| 364.78 | 100 |
| 364.85 | 100.25 |
| 364.92 | 100.25 |
| 364.99 | 100.25 |
| 365.06 | 100.25 |
| 365.12 | 100.5 |
| 365.19 | 100.5 |
| 365.26 | 100.75 |
| 365.33 | 100.75 |
| 365.4 | 100.75 |
| 365.47 | 101 |
| 365.53 | 101 |
| 365.6 | 101 |
| 365.67 | 101 |
| 365.74 | 101.25 |
| 365.81 | 101.25 |
| 365.88 | 101.25 |
| 365.94 | 101.25 |
| 366.01 | 101.25 |
| 366.08 | 101.25 |
| 366.15 | 101.25 |
| 366.22 | 101 |
| 366.28 | 101 |
| 366.35 | 101 |
| 366.42 | 100.25 |
| 366.49 | 100 |
| 366.56 | 99.75 |
| 366.63 | 99.5 |
| 366.69 | 99 |
| 366.76 | 99 |
| 366.83 | 98.5 |
| 366.9 | 98.25 |
| 366.97 | 97.75 |
| 367.03 | 97.25 |
| 367.1 | 97 |
| 367.17 | 96.25 |
| 367.24 | 95.75 |
| 367.31 | 95.25 |
| 367.38 | 94.5 |
| 367.44 | 94 |
| 367.51 | 93.5 |
| 367.58 | 93.5 |
| 367.65 | 93 |
| 367.72 | 92.5 |
| 367.78 | 92 |
| 367.85 | 91.5 |
| 367.92 | 90.75 |
| 367.99 | 90.25 |
| 368.06 | 89.75 |
| 368.12 | 89.25 |
| 368.19 | 88.75 |
| 368.26 | 88.25 |
| 368.33 | 88.25 |
| 368.4 | 88 |
| 368.46 | 87.5 |
| 368.53 | 87 |
| 368.6 | 86.5 |
| 368.67 | 86 |
| 368.74 | 85.5 |
| 368.8 | 85 |
| 368.87 | 84.75 |
| 368.94 | 84.25 |
| 369.01 | 83.75 |
| 369.08 | 83.5 |
| 369.15 | 83.5 |
| 369.21 | 83 |
| 369.28 | 82.75 |
| 369.35 | 82.25 |
| 369.42 | 82 |
| 369.49 | 81.5 |
| 369.55 | 81.25 |
| 369.62 | 80.75 |
| 369.69 | 80.25 |
| 369.76 | 80 |
| 369.83 | 79.75 |
| 369.89 | 79.25 |
| 369.96 | 79.25 |
| 370.03 | 79 |
| 370.1 | 78.75 |
| 370.17 | 78.25 |
| 370.24 | 78 |
| 370.3 | 77.75 |
| 370.37 | 77.5 |
| 370.44 | 77.25 |
| 370.51 | 76.75 |
| 370.58 | 76.5 |
| 370.64 | 76.25 |
| 370.71 | 76 |
| 370.78 | 76 |
| 370.85 | 75.5 |
| 370.92 | 75.25 |
| 370.98 | 75.25 |
| 371.05 | 74.75 |
| 371.12 | 74.5 |
| 371.19 | 74.25 |
| 371.26 | 74 |
| 371.33 | 73.75 |
| 371.39 | 73.5 |
| 371.46 | 73.25 |
| 371.53 | 73 |
| 371.6 | 73 |
| 371.67 | 72.5 |
| 371.73 | 72.5 |
| 371.8 | 72.25 |
| 371.87 | 71.75 |
| 371.94 | 71.75 |
| 372.01 | 71.5 |
| 372.08 | 71.25 |
| 372.14 | 71 |
| 372.21 | 70.75 |
| 372.28 | 70.5 |
| 372.35 | 70.25 |
| 372.42 | 70.25 |
| 372.48 | 70 |
| 372.55 | 69.75 |
| 372.62 | 69.5 |
| 372.69 | 69.25 |
| 372.76 | 69 |
| 372.83 | 68.75 |
| 372.89 | 68.5 |
| 372.96 | 68.25 |
| 373.03 | 68.25 |
| 373.1 | 68.25 |
| 373.17 | 68.5 |
| 373.23 | 68.5 |
| 373.3 | 68.75 |
| 373.37 | 68.75 |
| 373.44 | 69 |
| 373.51 | 69 |
| 373.58 | 69 |
| 373.64 | 69.25 |
| 373.71 | 69.25 |
| 373.78 | 69.5 |
| 373.85 | 69.5 |
| 373.92 | 69.75 |
| 373.98 | 69.75 |
| 374.05 | 69.75 |
| 374.12 | 69.75 |
| 374.19 | 70 |
| 374.26 | 70 |
| 374.33 | 70 |
| 374.39 | 70.25 |
| 374.46 | 70.25 |
| 374.53 | 70.25 |
| 374.6 | 70.25 |
| 374.67 | 70.25 |
| 374.74 | 70.25 |
| 374.8 | 70.25 |
| 374.87 | 70.25 |
| 374.94 | 70.25 |
| 375.01 | 70.25 |
| 375.08 | 70.25 |
| 375.15 | 70.25 |
| 375.21 | 70.25 |
| 375.28 | 70 |
| 375.35 | 70 |
| 375.42 | 70 |
| 375.49 | 70 |
| 375.55 | 69.75 |
| 375.62 | 69.75 |
| 375.69 | 69.75 |
| 375.76 | 69.75 |
| 375.83 | 69.5 |
| 375.9 | 69.5 |
| 375.96 | 69.25 |
| 376.03 | 69.25 |
| 376.1 | 69.25 |
| 376.17 | 69.25 |
| 376.24 | 69.25 |
| 376.31 | 69 |
| 376.37 | 69 |
| 376.44 | 68.75 |
| 376.51 | 68.75 |
| 376.58 | 68.75 |
| 376.65 | 68.75 |
| 376.72 | 68.75 |
| 376.78 | 68.5 |
| 376.85 | 68.5 |
| 376.92 | 68.5 |
| 376.99 | 68.25 |
| 377.06 | 68.25 |
| 377.13 | 68.25 |
| 377.19 | 68.25 |
| 377.26 | 68 |
| 377.33 | 68 |
| 377.4 | 68 |
| 377.47 | 68 |
| 377.53 | 68 |
| 377.6 | 67.75 |
| 377.67 | 67.75 |
| 377.74 | 67.75 |
| 377.81 | 67.5 |
| 377.88 | 67.5 |
| 377.94 | 67.5 |
| 378.01 | 67.5 |
| 378.08 | 67.25 |
| 378.15 | 67.25 |
| 378.22 | 67.25 |
| 378.29 | 67.5 |
| 378.35 | 67.5 |
| 378.42 | 68 |
| 378.49 | 68.25 |
| 378.56 | 68.75 |
| 378.63 | 69.25 |
| 378.69 | 69.75 |
| 378.76 | 70 |
| 378.83 | 70.5 |
| 378.9 | 71 |
| 378.97 | 71.25 |
| 379.04 | 71.25 |
| 379.1 | 71.5 |
| 379.17 | 72 |
| 379.24 | 72.25 |
| 379.31 | 72.5 |
| 379.38 | 73 |
| 379.44 | 73.5 |
| 379.51 | 73.75 |
| 379.58 | 74 |
| 379.65 | 74.5 |
| 379.72 | 74.75 |
| 379.79 | 75 |
| 379.85 | 75 |
| 379.92 | 75.5 |
| 379.99 | 75.75 |
| 380.06 | 76 |
| 380.13 | 76.5 |
| 380.19 | 76.75 |
| 380.26 | 77 |
| 380.33 | 77.25 |
| 380.4 | 77.5 |
| 380.47 | 78 |
| 380.53 | 78.25 |
| 380.6 | 78.5 |
| 380.67 | 78.5 |
| 380.74 | 78.75 |
| 380.81 | 79.25 |
| 380.88 | 79.5 |
| 380.94 | 79.75 |
| 381.01 | 80 |
| 381.08 | 80.25 |
| 381.15 | 80.5 |
| 381.22 | 81 |
| 381.29 | 81.25 |
| 381.35 | 81.5 |
| 381.42 | 81.75 |
| 381.49 | 81.75 |
| 381.56 | 82 |
| 381.63 | 82.25 |
| 381.69 | 82.5 |
| 381.76 | 82.75 |
| 381.83 | 83 |
| 381.9 | 83.25 |
| 381.97 | 83.75 |
| 382.03 | 84 |
| 382.1 | 84 |
| 382.17 | 84.25 |
| 382.24 | 84.75 |
| 382.31 | 84.75 |
| 382.38 | 85 |
| 382.44 | 85 |
| 382.51 | 85.25 |
| 382.58 | 85.5 |
| 382.65 | 85.75 |
| 382.72 | 86 |
| 382.79 | 86.25 |
| 382.85 | 86.5 |
| 382.92 | 86.75 |
| 382.99 | 87 |
| 383.06 | 87.25 |
| 383.13 | 87.25 |
| 383.19 | 87.5 |
| 383.26 | 87.75 |
| 383.33 | 88 |
| 383.4 | 88 |
| 383.47 | 88.25 |
| 383.54 | 88.5 |
| 383.6 | 88.75 |
| 383.67 | 89 |
| 383.74 | 89.25 |
| 383.81 | 89.5 |
| 383.88 | 89.75 |
| 383.94 | 89.75 |
| 384.01 | 89.75 |
| 384.08 | 90 |
| 384.15 | 90.25 |
| 384.22 | 90.5 |
| 384.28 | 90.75 |
| 384.35 | 91 |
| 384.42 | 91 |
| 384.49 | 91.25 |
| 384.56 | 91.5 |
| 384.63 | 91.75 |
| 384.69 | 91.75 |
| 384.76 | 91.75 |
| 384.83 | 92 |
| 384.9 | 92.25 |
| 384.97 | 92.5 |
| 385.04 | 92.75 |
| 385.1 | 92.75 |
| 385.17 | 93 |
| 385.24 | 93.25 |
| 385.31 | 93.5 |
| 385.38 | 93.5 |
| 385.44 | 93.75 |
| 385.51 | 94 |
| 385.58 | 94 |
| 385.65 | 94.25 |
| 385.72 | 94.25 |
| 385.78 | 94.5 |
| 385.85 | 94.75 |
| 385.92 | 95 |
| 385.99 | 95 |
| 386.06 | 95.25 |
| 386.13 | 95.5 |
| 386.19 | 95.5 |
| 386.26 | 95.75 |
| 386.33 | 96 |
| 386.4 | 96 |
| 386.47 | 96.25 |
| 386.54 | 96.25 |
| 386.6 | 96.5 |
| 386.67 | 96.5 |
| 386.74 | 97 |
| 386.81 | 97 |
| 386.88 | 97 |
| 386.94 | 97.25 |
| 387.01 | 97.5 |
| 387.08 | 97.75 |
| 387.15 | 97.75 |
| 387.22 | 97.75 |
| 387.28 | 98 |
| 387.35 | 98 |
| 387.42 | 98.25 |
| 387.49 | 98.5 |
| 387.56 | 98.75 |
| 387.63 | 98.75 |
| 387.69 | 99 |
| 387.76 | 99 |
| 387.83 | 99.25 |
| 387.9 | 99.25 |
| 387.97 | 99.5 |
| 388.03 | 99.5 |
| 388.1 | 99.5 |
| 388.17 | 99.75 |
| 388.24 | 99.75 |
| 388.31 | 100 |
| 388.38 | 100 |
| 388.45 | 100.25 |
| 388.51 | 100.25 |
| 388.58 | 100.5 |
| 388.65 | 100.5 |
| 388.72 | 100.5 |
| 388.79 | 100.75 |
| 388.85 | 100.75 |
| 388.92 | 100.75 |
| 388.99 | 101 |
| 389.06 | 101 |
| 389.13 | 101.25 |
| 389.2 | 101.25 |
| 389.26 | 101.25 |
| 389.33 | 101.25 |
| 389.4 | 101.25 |
| 389.47 | 101.25 |
| 389.54 | 101.25 |
| 389.61 | 101.25 |
| 389.67 | 101.25 |
| 389.74 | 101.25 |
| 389.81 | 101.25 |
| 389.88 | 101.25 |
| 389.95 | 101.25 |
| 390.01 | 101 |
| 390.08 | 100.5 |
| 390.15 | 100 |
| 390.22 | 99.75 |
| 390.29 | 99.5 |
| 390.36 | 99.25 |
| 390.42 | 98.75 |
| 390.49 | 98.75 |
| 390.56 | 98.25 |
| 390.63 | 97.75 |
| 390.7 | 97.25 |
| 390.76 | 97 |
| 390.83 | 96.25 |
| 390.9 | 95.75 |
| 390.97 | 95.25 |
| 391.04 | 94.75 |
| 391.11 | 94 |
| 391.17 | 93.75 |
| 391.24 | 93 |
| 391.31 | 93 |
| 391.38 | 92.5 |
| 391.45 | 92 |
| 391.51 | 91.5 |
| 391.58 | 91 |
| 391.65 | 90.25 |
| 391.72 | 90 |
| 391.79 | 89.25 |
| 391.86 | 88.75 |
| 391.92 | 88.25 |
| 391.99 | 87.75 |
| 392.06 | 87.5 |
| 392.13 | 87.5 |
| 392.2 | 87 |
| 392.26 | 86.5 |
| 392.33 | 86 |
| 392.4 | 85.5 |
| 392.47 | 85 |
| 392.54 | 84.75 |
| 392.6 | 84.25 |
| 392.67 | 83.75 |
| 392.74 | 83.25 |
| 392.81 | 83 |
| 392.88 | 82.5 |
| 392.94 | 82.5 |
| 393.01 | 82.25 |
| 393.08 | 82 |
| 393.15 | 81.5 |
| 393.22 | 81.25 |
| 393.29 | 80.75 |
| 393.35 | 80.5 |
| 393.42 | 80 |
| 393.49 | 79.75 |
| 393.56 | 79.5 |
| 393.63 | 79 |
| 393.69 | 78.75 |
| 393.76 | 78.75 |
| 393.83 | 78.25 |
| 393.9 | 78 |
| 393.97 | 77.75 |
| 394.04 | 77.25 |
| 394.1 | 77 |
| 394.17 | 76.75 |
| 394.24 | 76.5 |
| 394.31 | 76.25 |
| 394.38 | 76 |
| 394.44 | 75.5 |
| 394.51 | 75.25 |
| 394.58 | 75.25 |
| 394.65 | 75 |
| 394.72 | 74.75 |
| 394.78 | 74.5 |
| 394.85 | 74.25 |
| 394.92 | 74 |
| 394.99 | 73.75 |
| 395.06 | 73.5 |
| 395.12 | 73.25 |
| 395.19 | 73 |
| 395.26 | 72.75 |
| 395.33 | 72.5 |
| 395.4 | 72.5 |
| 395.47 | 72.25 |
| 395.53 | 72 |
| 395.6 | 71.5 |
| 395.67 | 71.5 |
| 395.74 | 71.25 |
| 395.81 | 71 |
| 395.87 | 70.75 |
| 395.94 | 70.5 |
| 396.01 | 70.5 |
| 396.08 | 70 |
| 396.15 | 69.75 |
| 396.22 | 69.75 |
| 396.28 | 69.75 |
| 396.35 | 69.25 |
| 396.42 | 69.25 |
| 396.49 | 69 |
| 396.56 | 68.75 |
| 396.62 | 68.5 |
| 396.69 | 68.25 |
| 396.76 | 68.25 |
| 396.83 | 68.25 |
| 396.9 | 68.5 |
| 396.96 | 68.5 |
| 397.03 | 68.5 |
| 397.1 | 68.5 |
| 397.17 | 68.5 |
| 397.24 | 68.75 |
| 397.3 | 68.75 |
| 397.37 | 69 |
| 397.44 | 69 |
| 397.51 | 69 |
| 397.58 | 69.25 |
| 397.65 | 69.25 |
| 397.72 | 69.5 |
| 397.78 | 69.5 |
| 397.85 | 69.5 |
| 397.92 | 69.5 |
| 397.99 | 69.5 |
| 398.06 | 69.75 |
| 398.13 | 69.75 |
| 398.19 | 69.75 |
| 398.26 | 69.75 |
| 398.33 | 70 |
| 398.4 | 70 |
| 398.47 | 70 |
| 398.53 | 70 |
| 398.6 | 70 |
| 398.67 | 70 |
| 398.74 | 70 |
| 398.81 | 70 |
| 398.88 | 70 |
| 398.94 | 70 |
| 399.01 | 70 |
| 399.08 | 70 |
| 399.15 | 69.75 |
| 399.22 | 69.75 |
| 399.29 | 69.75 |
| 399.35 | 69.75 |
| 399.42 | 69.5 |
| 399.49 | 69.5 |
| 399.56 | 69.5 |
| 399.63 | 69.25 |
| 399.69 | 69.25 |
| 399.76 | 69.25 |
| 399.83 | 69.25 |
| 399.9 | 69 |
| 399.97 | 69 |
| 400.04 | 69 |
| 400.1 | 69 |
| 400.17 | 68.75 |
| 400.24 | 68.75 |
| 400.31 | 68.75 |
| 400.38 | 68.75 |
| 400.45 | 68.5 |
| 400.51 | 68.5 |
| 400.58 | 68.5 |
| 400.65 | 68.5 |
| 400.72 | 68.25 |
| 400.79 | 68.25 |
| 400.86 | 68.25 |
| 400.92 | 68 |
| 400.99 | 68 |
| 401.06 | 68 |
| 401.13 | 68 |
| 401.2 | 67.75 |
| 401.26 | 67.75 |
| 401.33 | 67.75 |
| 401.4 | 67.75 |
| 401.47 | 67.5 |
| 401.54 | 67.5 |
| 401.61 | 67.5 |
| 401.67 | 67.5 |
| 401.74 | 67.25 |
| 401.81 | 67.25 |
| 401.88 | 67.25 |
| 401.95 | 67.25 |
| 402.02 | 67.25 |
| 402.08 | 67.25 |
| 402.15 | 67.5 |
| 402.22 | 67.75 |
| 402.29 | 68 |
| 402.36 | 68.5 |
| 402.42 | 69 |
| 402.49 | 69.5 |
| 402.56 | 69.75 |
| 402.63 | 70.5 |
| 402.7 | 70.75 |
| 402.76 | 70.75 |
| 402.83 | 71 |
| 402.9 | 71.5 |
| 402.97 | 71.75 |
| 403.04 | 72.25 |
| 403.11 | 72.5 |
| 403.17 | 73 |
| 403.24 | 73.25 |
| 403.31 | 73.5 |
| 403.38 | 74 |
| 403.45 | 74.25 |
| 403.51 | 74.5 |
| 403.58 | 74.5 |
| 403.65 | 75 |
| 403.72 | 75.25 |
| 403.79 | 75.5 |
| 403.86 | 76 |
| 403.92 | 76.25 |
| 403.99 | 76.75 |
| 404.06 | 77 |
| 404.13 | 77.25 |
| 404.2 | 77.5 |
| 404.26 | 78 |
| 404.33 | 78.25 |
| 404.4 | 78.25 |
| 404.47 | 78.5 |
| 404.54 | 78.75 |
| 404.6 | 79.25 |
| 404.67 | 79.25 |
| 404.74 | 79.75 |
| 404.81 | 80 |
| 404.88 | 80.25 |
| 404.95 | 80.5 |
| 405.01 | 80.75 |
| 405.08 | 81.25 |
| 405.15 | 81.5 |
| 405.22 | 81.5 |
| 405.29 | 81.75 |
| 405.36 | 82 |
| 405.42 | 82.25 |
| 405.49 | 82.5 |
| 405.56 | 82.75 |
| 405.63 | 83 |
| 405.7 | 83.25 |
| 405.76 | 83.5 |
| 405.83 | 83.75 |
| 405.9 | 84 |
| 405.97 | 84.25 |
| 406.04 | 84.25 |
| 406.11 | 84.5 |
| 406.17 | 85 |
| 406.24 | 85 |
| 406.31 | 85.25 |
| 406.38 | 85.5 |
| 406.45 | 85.75 |
| 406.51 | 86 |
| 406.58 | 86.25 |
| 406.65 | 86.5 |
| 406.72 | 86.5 |
| 406.79 | 86.75 |
| 406.85 | 86.75 |
| 406.92 | 87 |
| 406.99 | 87.25 |
| 407.06 | 87.5 |
| 407.13 | 87.75 |
| 407.2 | 88 |
| 407.26 | 88 |
| 407.33 | 88.25 |
| 407.4 | 88.5 |
| 407.47 | 88.75 |
| 407.54 | 89 |
| 407.61 | 89 |
| 407.67 | 89 |
| 407.74 | 89.25 |
| 407.81 | 89.5 |
| 407.88 | 89.75 |
| 407.95 | 90 |
| 408.01 | 90 |
| 408.08 | 90.25 |
| 408.15 | 90.5 |
| 408.22 | 90.75 |
| 408.29 | 90.75 |
| 408.35 | 91 |
| 408.42 | 91.25 |
| 408.49 | 91.25 |
| 408.56 | 91.5 |
| 408.63 | 91.75 |
| 408.7 | 91.75 |
| 408.76 | 92 |
| 408.83 | 92.25 |
| 408.9 | 92.5 |
| 408.97 | 92.75 |
| 409.04 | 92.75 |
| 409.1 | 93 |
| 409.17 | 93.25 |
| 409.24 | 93.5 |
| 409.31 | 93.5 |
| 409.38 | 93.5 |
| 409.45 | 93.75 |
| 409.51 | 94 |
| 409.58 | 94 |
| 409.65 | 94.25 |
| 409.72 | 94.5 |
| 409.79 | 94.5 |
| 409.85 | 94.75 |
| 409.92 | 95 |
| 409.99 | 95 |
| 410.06 | 95.25 |
| 410.13 | 95.25 |
| 410.2 | 95.5 |
| 410.26 | 95.75 |
| 410.33 | 95.75 |
| 410.4 | 96 |
| 410.47 | 96.25 |
| 410.54 | 96.25 |
| 410.6 | 96.5 |
| 410.67 | 96.75 |
| 410.74 | 96.75 |
| 410.81 | 97 |
| 410.88 | 97 |
| 410.95 | 97 |
| 411.01 | 97.25 |
| 411.08 | 97.5 |
| 411.15 | 97.5 |
| 411.22 | 97.75 |
| 411.29 | 98 |
| 411.35 | 98 |
| 411.42 | 98.25 |
| 411.49 | 98.25 |
| 411.56 | 98.5 |
| 411.63 | 98.5 |
| 411.7 | 98.75 |
| 411.76 | 98.75 |
| 411.83 | 99 |
| 411.9 | 99 |
| 411.97 | 99.25 |
| 412.04 | 99.5 |
| 412.1 | 99.5 |
| 412.17 | 99.75 |
| 412.24 | 99.75 |
| 412.31 | 100 |
| 412.38 | 100 |
| 412.45 | 100.25 |
| 412.51 | 100.25 |
| 412.58 | 100.25 |
| 412.65 | 100.5 |
| 412.72 | 100.5 |
| 412.79 | 100.75 |
| 412.86 | 100.75 |
| 412.92 | 101 |
| 412.99 | 101 |
| 413.06 | 101 |
| 413.13 | 101.25 |
| 413.2 | 101.25 |
| 413.27 | 101.25 |
| 413.33 | 101.25 |
| 413.4 | 101.25 |
| 413.47 | 101.25 |
| 413.54 | 101.25 |
| 413.61 | 101.25 |
| 413.67 | 101.25 |
| 413.74 | 101.25 |
| 413.81 | 101 |
| 413.88 | 101 |
| 413.95 | 101 |
| 414.02 | 101 |
| 414.08 | 101 |
| 414.15 | 100.5 |
| 414.22 | 100 |
| 414.29 | 100 |
| 414.36 | 99.75 |
| 414.43 | 99.5 |
| 414.49 | 99.25 |
| 414.56 | 98.75 |
| 414.63 | 98.5 |
| 414.7 | 98 |
| 414.77 | 97.5 |
| 414.83 | 97 |
| 414.9 | 96.5 |
| 414.97 | 96 |
| 415.04 | 95.5 |
| 415.11 | 95.5 |
| 415.17 | 95 |
| 415.24 | 94.5 |
| 415.31 | 93.75 |
| 415.38 | 93.25 |
| 415.45 | 92.75 |
| 415.52 | 92.25 |
| 415.58 | 91.75 |
| 415.65 | 91 |
| 415.72 | 90.5 |
| 415.79 | 90 |
| 415.86 | 90 |
| 415.92 | 89.5 |
| 415.99 | 89 |
| 416.06 | 88.5 |
| 416.13 | 88 |
| 416.2 | 87.5 |
| 416.27 | 87 |
| 416.33 | 86.5 |
| 416.4 | 86 |
| 416.47 | 85.5 |
| 416.54 | 85.25 |
| 416.61 | 84.75 |
| 416.67 | 84.75 |
| 416.74 | 84.25 |
| 416.81 | 84 |
| 416.88 | 83.5 |
| 416.95 | 83 |
| 417.01 | 82.75 |
| 417.08 | 82.5 |
| 417.15 | 82 |
| 417.22 | 81.75 |
| 417.29 | 81.25 |
| 417.36 | 80.75 |
| 417.42 | 80.5 |
| 417.49 | 80.5 |
| 417.56 | 80.25 |
| 417.63 | 80 |
| 417.7 | 79.5 |
| 417.76 | 79.25 |
| 417.83 | 79 |
| 417.9 | 78.5 |
| 417.97 | 78.25 |
| 418.04 | 77.75 |
| 418.1 | 77.5 |
| 418.17 | 77.25 |
| 418.24 | 77 |
| 418.31 | 77 |
| 418.38 | 76.75 |
| 418.45 | 76.5 |
| 418.51 | 76.25 |
| 418.58 | 76 |
| 418.65 | 75.5 |
| 418.72 | 75.25 |
| 418.79 | 75 |
| 418.85 | 74.75 |
| 418.92 | 74.5 |
| 418.99 | 74.25 |
| 419.06 | 74 |
| 419.13 | 74 |
| 419.19 | 73.75 |
| 419.26 | 73.5 |
| 419.33 | 73.25 |
| 419.4 | 73 |
| 419.47 | 72.75 |
| 419.54 | 72.5 |
| 419.6 | 72.25 |
| 419.67 | 72 |
| 419.74 | 71.75 |
| 419.81 | 71.5 |
| 419.88 | 71.25 |
| 419.94 | 71.25 |
| 420.01 | 71 |
| 420.08 | 70.75 |
| 420.15 | 70.5 |
| 420.22 | 70.25 |
| 420.28 | 70 |
| 420.35 | 69.75 |
| 420.42 | 69.5 |
| 420.49 | 69.25 |
| 420.56 | 69.25 |
| 420.63 | 69 |
| 420.69 | 68.75 |
| 420.76 | 68.75 |
| 420.83 | 68.5 |
| 420.9 | 68.25 |
| 420.97 | 68.25 |
| 421.04 | 68 |
| 421.1 | 68.25 |
| 421.17 | 68.25 |
| 421.24 | 68.5 |
| 421.31 | 68.5 |
| 421.38 | 68.5 |
| 421.44 | 68.5 |
| 421.51 | 68.75 |
| 421.58 | 68.75 |
| 421.65 | 68.75 |
| 421.72 | 68.75 |
| 421.79 | 69 |
| 421.85 | 69 |
| 421.92 | 69 |
| 421.99 | 69.25 |
| 422.06 | 69.25 |
| 422.13 | 69.25 |
| 422.2 | 69.5 |
| 422.26 | 69.5 |
| 422.33 | 69.5 |
| 422.4 | 69.5 |
| 422.47 | 69.75 |
| 422.54 | 69.5 |
| 422.6 | 69.75 |
| 422.67 | 69.75 |
| 422.74 | 69.75 |
| 422.81 | 69.75 |
| 422.88 | 69.75 |
| 422.95 | 69.75 |
| 423.01 | 69.75 |
| 423.08 | 69.75 |
| 423.15 | 69.75 |
| 423.22 | 69.75 |
| 423.29 | 69.75 |
| 423.36 | 69.75 |
| 423.42 | 69.75 |
| 423.49 | 69.75 |
| 423.56 | 69.75 |
| 423.63 | 69.5 |
| 423.7 | 69.5 |
| 423.76 | 69.5 |
| 423.83 | 69.25 |
| 423.9 | 69.25 |
| 423.97 | 69.25 |
| 424.04 | 69.25 |
| 424.11 | 69.25 |
| 424.17 | 69 |
| 424.24 | 69 |
| 424.31 | 68.75 |
| 424.38 | 69 |
| 424.45 | 68.75 |
| 424.52 | 68.75 |
| 424.58 | 68.5 |
| 424.65 | 68.5 |
| 424.72 | 68.5 |
| 424.79 | 68.5 |
| 424.86 | 68.5 |
| 424.92 | 68.5 |
| 424.99 | 68.25 |
| 425.06 | 68.25 |
| 425.13 | 68 |
| 425.2 | 68 |
| 425.27 | 68 |
| 425.33 | 68 |
| 425.4 | 67.75 |
| 425.47 | 67.75 |
| 425.54 | 67.75 |
| 425.61 | 67.75 |
| 425.67 | 67.5 |
| 425.74 | 67.5 |
| 425.81 | 67.5 |
| 425.88 | 67.5 |
| 425.95 | 67.25 |
| 426.02 | 67.25 |
| 426.08 | 67.25 |
| 426.15 | 67.25 |
| 426.22 | 67.25 |
| 426.29 | 67.5 |
| 426.36 | 67.75 |
| 426.43 | 68 |
| 426.49 | 68.25 |
| 426.56 | 68.25 |
| 426.63 | 69 |
| 426.7 | 69.5 |
| 426.77 | 69.75 |
| 426.83 | 70.25 |
| 426.9 | 70.75 |
| 426.97 | 71 |
| 427.04 | 71.5 |
| 427.11 | 71.5 |
| 427.17 | 72 |
| 427.24 | 72.25 |
| 427.31 | 72.75 |
| 427.38 | 72.75 |
| 427.45 | 73 |
| 427.52 | 73.5 |
| 427.58 | 73.75 |
| 427.65 | 74 |
| 427.72 | 74.25 |
| 427.79 | 74.75 |
| 427.86 | 75 |
| 427.92 | 75.25 |
| 427.99 | 75.75 |
| 428.06 | 76 |
| 428.13 | 76.5 |
| 428.2 | 76.5 |
| 428.27 | 76.75 |
| 428.33 | 77 |
| 428.4 | 77.25 |
| 428.47 | 77.5 |
| 428.54 | 78 |
| 428.61 | 78.25 |
| 428.68 | 78.5 |
| 428.74 | 78.75 |
| 428.81 | 79.25 |
| 428.88 | 79.5 |
| 428.95 | 79.75 |
| 429.02 | 79.75 |
| 429.08 | 80.25 |
| 429.15 | 80.25 |
| 429.22 | 80.5 |
| 429.29 | 80.75 |
| 429.36 | 81.25 |
| 429.42 | 81.5 |
| 429.49 | 81.75 |
| 429.56 | 82 |
| 429.63 | 82.25 |
| 429.7 | 82.5 |
| 429.77 | 82.75 |
| 429.83 | 82.75 |
| 429.9 | 83 |
| 429.97 | 83.25 |
| 430.04 | 83.5 |
| 430.11 | 83.75 |
| 430.18 | 84 |
| 430.24 | 84.25 |
| 430.31 | 84.5 |
| 430.38 | 84.75 |
| 430.45 | 85 |
| 430.52 | 85.25 |
| 430.58 | 85.5 |
| 430.65 | 85.5 |
| 430.72 | 85.75 |
| 430.79 | 86 |
| 430.86 | 86.25 |
| 430.92 | 86.5 |
| 430.99 | 86.75 |
| 431.06 | 87 |
| 431.13 | 87 |
| 431.2 | 87.25 |
| 431.27 | 87.5 |
| 431.33 | 87.75 |
| 431.4 | 88 |
| 431.47 | 88 |
| 431.54 | 88 |
| 431.61 | 88.25 |
| 431.67 | 88.5 |
| 431.74 | 88.75 |
| 431.81 | 88.75 |
| 431.88 | 89 |
| 431.95 | 89.5 |
| 432.02 | 89.5 |
| 432.08 | 89.75 |
| 432.15 | 90 |
| 432.22 | 90.25 |
| 432.29 | 90.25 |
| 432.36 | 90.5 |
| 432.42 | 90.5 |
| 432.49 | 90.75 |
| 432.56 | 91 |
| 432.63 | 91 |
| 432.7 | 91.25 |
| 432.77 | 91.5 |
| 432.83 | 91.75 |
| 432.9 | 92 |
| 432.97 | 92.25 |
| 433.04 | 92.5 |
| 433.11 | 92.5 |
| 433.17 | 92.5 |
| 433.24 | 92.75 |
| 433.31 | 93 |
| 433.38 | 93.25 |
| 433.45 | 93.25 |
| 433.52 | 93.5 |
| 433.58 | 93.75 |
| 433.65 | 94 |
| 433.72 | 94 |
| 433.79 | 94.25 |
| 433.86 | 94.25 |
| 433.92 | 94.25 |
| 433.99 | 94.5 |
| 434.06 | 94.75 |
| 434.13 | 95 |
| 434.2 | 95.25 |
| 434.27 | 95.25 |
| 434.33 | 95.5 |
| 434.4 | 95.75 |
| 434.47 | 95.75 |
| 434.54 | 96 |
| 434.61 | 96.25 |
| 434.67 | 96.25 |
| 434.74 | 96.25 |
| 434.81 | 96.5 |
| 434.88 | 96.75 |
| 434.95 | 96.75 |
| 435.02 | 97 |
| 435.08 | 97.25 |
| 435.15 | 97.25 |
| 435.22 | 97.25 |
| 435.29 | 97.75 |
| 435.36 | 97.75 |
| 435.42 | 97.75 |
| 435.49 | 98 |
| 435.56 | 98 |
| 435.63 | 98.25 |
| 435.7 | 98.25 |
| 435.77 | 98.5 |
| 435.83 | 98.75 |
| 435.9 | 98.75 |
| 435.97 | 98.75 |
| 436.04 | 99 |
| 436.11 | 99.25 |
| 436.17 | 99.5 |
| 436.24 | 99.5 |
| 436.31 | 99.75 |
| 436.38 | 99.75 |
| 436.45 | 99.75 |
| 436.52 | 100 |
| 436.58 | 100 |
| 436.65 | 100.25 |
| 436.72 | 100.25 |
| 436.79 | 100.25 |
| 436.86 | 100.5 |
| 436.93 | 100.5 |
| 437.0 | 100.75 |
| 437.06 | 100.75 |
| 437.13 | 101 |
| 437.2 | 101 |
| 437.27 | 101 |
| 437.34 | 101 |
| 437.4 | 101.25 |
| 437.47 | 101.25 |
| 437.54 | 101.25 |
| 437.61 | 101.25 |
| 437.68 | 101.25 |
| 437.75 | 101.25 |
| 437.81 | 101.25 |
| 437.88 | 101.25 |
| 437.95 | 101.25 |
| 438.02 | 101.25 |
| 438.09 | 101.25 |
| 438.16 | 101.25 |
| 438.22 | 101 |
| 438.29 | 101 |
| 438.36 | 101 |
| 438.43 | 100.5 |
| 438.5 | 100 |
| 438.56 | 99.75 |
| 438.63 | 99.5 |
| 438.7 | 99 |
| 438.77 | 98.75 |
| 438.84 | 98.75 |
| 438.91 | 98.25 |
| 438.97 | 97.75 |
| 439.04 | 97.25 |
| 439.11 | 97 |
| 439.18 | 96.25 |
| 439.25 | 95.75 |
| 439.31 | 95.25 |
| 439.38 | 94.5 |
| 439.45 | 94 |
| 439.52 | 93.5 |
| 439.59 | 93 |
| 439.65 | 93 |
| 439.72 | 92.5 |
| 439.79 | 92 |
| 439.86 | 91.25 |
| 439.93 | 90.75 |
| 440.0 | 90.25 |
| 440.06 | 89.75 |
| 440.13 | 89.25 |
| 440.2 | 88.75 |
| 440.27 | 88.25 |
| 440.34 | 87.75 |
| 440.4 | 87.25 |
| 440.47 | 87.25 |
| 440.54 | 86.75 |
| 440.61 | 86.5 |
| 440.68 | 85.75 |
| 440.74 | 85.25 |
| 440.81 | 85 |
| 440.88 | 84.5 |
| 440.95 | 84.25 |
| 441.02 | 83.75 |
| 441.08 | 83.25 |
| 441.15 | 83 |
| 441.22 | 82.5 |
| 441.29 | 82.5 |
| 441.36 | 82.25 |
| 441.42 | 81.75 |
| 441.49 | 81.5 |
| 441.56 | 81 |
| 441.63 | 80.75 |
| 441.7 | 80.25 |
| 441.77 | 80 |
| 441.83 | 79.5 |
| 441.9 | 79.25 |
| 441.97 | 79 |
| 442.04 | 78.5 |
| 442.11 | 78.5 |
| 442.17 | 78.25 |
| 442.24 | 78 |
| 442.31 | 77.75 |
| 442.38 | 77.25 |
| 442.45 | 77 |
| 442.52 | 76.75 |
| 442.58 | 76.5 |
| 442.65 | 76.25 |
| 442.72 | 76 |
| 442.79 | 75.5 |
| 442.86 | 75.5 |
| 442.92 | 75.5 |
| 442.99 | 75 |
| 443.06 | 74.75 |
| 443.13 | 74.5 |
| 443.2 | 74.25 |
| 443.27 | 74 |
| 443.33 | 73.75 |
| 443.4 | 73.5 |
| 443.47 | 73.25 |
| 443.54 | 73 |
| 443.61 | 72.75 |
| 443.67 | 72.75 |
| 443.74 | 72.5 |
| 443.81 | 72.25 |
| 443.88 | 72 |
| 443.95 | 71.75 |
| 444.02 | 71.5 |
| 444.08 | 71.25 |
| 444.15 | 71 |
| 444.22 | 70.75 |
| 444.29 | 70.5 |
| 444.36 | 70.25 |
| 444.42 | 70.25 |
| 444.49 | 70.25 |
| 444.56 | 69.75 |
| 444.63 | 69.75 |
| 444.7 | 69.5 |
| 444.76 | 69.25 |
| 444.83 | 69 |
| 444.9 | 68.75 |
| 444.97 | 68.5 |
| 445.04 | 68.25 |
| 445.11 | 68 |
| 445.17 | 68.25 |
| 445.24 | 68.25 |
| 445.31 | 68.25 |
| 445.38 | 68.5 |
| 445.45 | 68.5 |
| 445.51 | 68.5 |
| 445.58 | 68.5 |
| 445.65 | 68.75 |
| 445.72 | 68.75 |
| 445.79 | 69 |
| 445.86 | 69 |
| 445.92 | 69 |
| 445.99 | 69.25 |
| 446.06 | 69.25 |
| 446.13 | 69.25 |
| 446.2 | 69.25 |
| 446.27 | 69.25 |
| 446.33 | 69.5 |
| 446.4 | 69.5 |
| 446.47 | 69.5 |
| 446.54 | 69.75 |
| 446.61 | 69.75 |
| 446.67 | 69.75 |
| 446.74 | 69.75 |
| 446.81 | 69.75 |
| 446.88 | 70 |
| 446.95 | 69.75 |
| 447.02 | 69.75 |
| 447.08 | 69.75 |
| 447.15 | 70 |
| 447.22 | 70 |
| 447.29 | 70 |
| 447.36 | 69.75 |
| 447.43 | 70 |
| 447.49 | 69.75 |
| 447.56 | 69.75 |
| 447.63 | 69.75 |
| 447.7 | 69.75 |
| 447.77 | 69.75 |
| 447.84 | 69.75 |
| 447.9 | 69.5 |
| 447.97 | 69.5 |
| 448.04 | 69.5 |
| 448.11 | 69.25 |
| 448.18 | 69.25 |
| 448.25 | 69.25 |
| 448.31 | 69.25 |
| 448.38 | 69 |
| 448.45 | 69 |
| 448.52 | 68.75 |
| 448.59 | 68.75 |
| 448.66 | 68.75 |
| 448.72 | 68.75 |
| 448.79 | 68.5 |
| 448.86 | 68.5 |
| 448.93 | 68.5 |
| 449.0 | 68.5 |
| 449.06 | 68.25 |
| 449.13 | 68.25 |
| 449.2 | 68.25 |
| 449.27 | 68.25 |
| 449.34 | 68 |
| 449.41 | 68 |
| 449.47 | 68 |
| 449.54 | 68 |
| 449.61 | 68 |
| 449.68 | 67.75 |
| 449.75 | 67.75 |
| 449.81 | 67.75 |
| 449.88 | 67.5 |
| 449.95 | 67.5 |
| 450.02 | 67.5 |
| 450.09 | 67.5 |
| 450.16 | 67.5 |
| 450.22 | 67.25 |
| 450.29 | 67.25 |
| 450.36 | 67.5 |
| 450.43 | 67.5 |
| 450.5 | 67.75 |
| 450.57 | 68.25 |
| 450.63 | 68.5 |
| 450.7 | 69.25 |
| 450.77 | 69.5 |
| 450.84 | 70 |
| 450.91 | 70.75 |
| 450.97 | 70.75 |
| 451.04 | 71.25 |
| 451.11 | 71.25 |
| 451.18 | 71.5 |
| 451.25 | 72 |
| 451.31 | 72.25 |
| 451.38 | 72.75 |
| 451.45 | 73 |
| 451.52 | 73.25 |
| 451.59 | 73.75 |
| 451.66 | 74 |
| 451.72 | 74.5 |
| 451.79 | 74.75 |
| 451.86 | 75 |
| 451.93 | 75 |
| 452.0 | 75.5 |
| 452.07 | 75.75 |
| 452.13 | 76 |
| 452.2 | 76.5 |
| 452.27 | 76.75 |
| 452.34 | 77 |
| 452.41 | 77.25 |
| 452.47 | 77.5 |
| 452.54 | 78 |
| 452.61 | 78.25 |
| 452.68 | 78.5 |
| 452.75 | 78.5 |
| 452.81 | 78.75 |
| 452.88 | 79.25 |
| 452.95 | 79.5 |
| 453.02 | 79.5 |
| 453.09 | 80 |
| 453.16 | 80.25 |
| 453.22 | 80.5 |
| 453.29 | 80.75 |
| 453.36 | 81 |
| 453.43 | 81.25 |
| 453.5 | 81.5 |
| 453.56 | 81.5 |
| 453.63 | 81.75 |
| 453.7 | 82 |
| 453.77 | 82.25 |
| 453.84 | 82.5 |
| 453.91 | 82.75 |
| 453.97 | 83 |
| 454.04 | 83.25 |
| 454.11 | 83.5 |
| 454.18 | 84 |
| 454.25 | 84 |
| 454.32 | 84.25 |
| 454.38 | 84.25 |
| 454.45 | 84.5 |
| 454.52 | 84.75 |
| 454.59 | 85 |
| 454.66 | 85 |
| 454.72 | 85.25 |
| 454.79 | 85.5 |
| 454.86 | 85.75 |
| 454.93 | 86 |
| 455.0 | 86.25 |
| 455.06 | 86.5 |
| 455.13 | 86.75 |
| 455.2 | 86.75 |
| 455.27 | 87 |
| 455.34 | 87.25 |
| 455.41 | 87.25 |
| 455.47 | 87.5 |
| 455.54 | 87.75 |
| 455.61 | 88 |
| 455.68 | 88.25 |
| 455.75 | 88.5 |
| 455.82 | 88.75 |
| 455.88 | 89 |
| 455.95 | 89 |
| 456.02 | 89 |
| 456.09 | 89.25 |
| 456.16 | 89.5 |
| 456.22 | 89.75 |
| 456.29 | 90 |
| 456.36 | 90 |
| 456.43 | 90.25 |
| 456.5 | 90.5 |
| 456.56 | 90.75 |
| 456.63 | 91 |
| 456.7 | 91 |
| 456.77 | 91.25 |
| 456.84 | 91.25 |
| 456.91 | 91.5 |
| 456.97 | 91.75 |
| 457.04 | 92 |
| 457.11 | 92.25 |
| 457.18 | 92.5 |
| 457.25 | 92.5 |
| 457.32 | 92.75 |
| 457.38 | 93 |
| 457.45 | 93 |
| 457.52 | 93.25 |
| 457.59 | 93.5 |
| 457.66 | 93.5 |
| 457.72 | 93.75 |
| 457.79 | 93.75 |
| 457.86 | 94 |
| 457.93 | 94.25 |
| 458.0 | 94.25 |
| 458.06 | 94.5 |
| 458.13 | 94.75 |
| 458.2 | 95 |
| 458.27 | 95 |
| 458.34 | 95.25 |
| 458.41 | 95.5 |
| 458.47 | 95.5 |
| 458.54 | 95.75 |
| 458.61 | 95.75 |
| 458.68 | 95.75 |
| 458.75 | 96 |
| 458.81 | 96.25 |
| 458.88 | 96.25 |
| 458.95 | 96.5 |
| 459.02 | 96.75 |
| 459.09 | 96.75 |
| 459.16 | 96.75 |
| 459.22 | 97 |
| 459.29 | 97 |
| 459.36 | 97.25 |
| 459.43 | 97.25 |
| 459.5 | 97.5 |
| 459.57 | 97.75 |
| 459.63 | 97.75 |
| 459.7 | 98 |
| 459.77 | 98 |
| 459.84 | 98.25 |
| 459.91 | 98.25 |
| 459.97 | 98.5 |
| 460.04 | 98.5 |
| 460.11 | 98.5 |
| 460.18 | 98.75 |
| 460.25 | 99 |
| 460.31 | 99 |
| 460.38 | 99.25 |
| 460.45 | 99.5 |
| 460.52 | 99.5 |
| 460.59 | 99.75 |
| 460.66 | 99.75 |
| 460.72 | 99.75 |
| 460.79 | 100 |
| 460.86 | 100 |
| 460.93 | 100 |
| 461.0 | 100.25 |
| 461.07 | 100.25 |
| 461.13 | 100.5 |
| 461.2 | 100.5 |
| 461.27 | 100.75 |
| 461.34 | 100.5 |
| 461.41 | 100.75 |
| 461.47 | 100.75 |
| 461.54 | 101 |
| 461.61 | 101 |
| 461.68 | 101 |
| 461.75 | 101 |
| 461.82 | 101 |
| 461.89 | 101.25 |
| 461.95 | 101.25 |
| 462.02 | 101.25 |
| 462.09 | 101.25 |
| 462.16 | 101.25 |
| 462.23 | 101.25 |
| 462.3 | 101.25 |
| 462.36 | 101 |
| 462.43 | 101 |
| 462.5 | 100.75 |
| 462.57 | 100.25 |
| 462.64 | 100.25 |
| 462.7 | 100 |
| 462.77 | 99.75 |
| 462.84 | 99.25 |
| 462.91 | 99 |
| 462.98 | 98.5 |
| 463.04 | 98 |
| 463.11 | 97.75 |
| 463.18 | 97 |
| 463.25 | 96.5 |
| 463.32 | 96 |
| 463.39 | 95.5 |
| 463.45 | 95.5 |
| 463.52 | 95 |
| 463.59 | 94.25 |
| 463.66 | 93.75 |
| 463.73 | 93.25 |
| 463.79 | 92.75 |
| 463.86 | 92.25 |
| 463.93 | 91.5 |
| 464.0 | 91 |
| 464.07 | 90.5 |
| 464.14 | 90 |
| 464.2 | 90 |
| 464.27 | 89.5 |
| 464.34 | 89 |
| 464.41 | 88.25 |
| 464.48 | 88 |
| 464.54 | 87.5 |
| 464.61 | 87 |
| 464.68 | 86.5 |
| 464.75 | 86 |
| 464.82 | 85.5 |
| 464.88 | 85.25 |
| 464.95 | 84.75 |
| 465.02 | 84.75 |
| 465.09 | 84.25 |
| 465.16 | 84 |
| 465.22 | 83.5 |
| 465.29 | 83 |
| 465.36 | 82.75 |
| 465.43 | 82.25 |
| 465.5 | 82 |
| 465.57 | 81.5 |
| 465.63 | 81.25 |
| 465.7 | 80.75 |
| 465.77 | 80.5 |
| 465.84 | 80.5 |
| 465.91 | 80.25 |
| 465.97 | 79.75 |
| 466.04 | 79.5 |
| 466.11 | 79.25 |
| 466.18 | 78.75 |
| 466.25 | 78.5 |
| 466.32 | 78.25 |
| 466.38 | 77.75 |
| 466.45 | 77.5 |
| 466.52 | 77.25 |
| 466.59 | 77 |
| 466.66 | 77 |
| 466.72 | 76.75 |
| 466.79 | 76.25 |
| 466.86 | 76 |
| 466.93 | 75.75 |
| 467.0 | 75.5 |
| 467.06 | 75.25 |
| 467.13 | 75 |
| 467.2 | 74.75 |
| 467.27 | 74.5 |
| 467.34 | 74.25 |
| 467.4 | 73.75 |
| 467.47 | 73.75 |
| 467.54 | 73.75 |
| 467.61 | 73.25 |
| 467.68 | 73.25 |
| 467.75 | 72.75 |
| 467.81 | 72.5 |
| 467.88 | 72.25 |
| 467.95 | 72 |
| 468.02 | 71.75 |
| 468.08 | 71.5 |
| 468.15 | 71.25 |
| 468.22 | 71 |
| 468.29 | 71 |
| 468.36 | 70.75 |
| 468.43 | 70.75 |
| 468.5 | 70.5 |
| 468.56 | 70.25 |
| 468.63 | 70 |
| 468.7 | 69.75 |
| 468.77 | 69.5 |
| 468.83 | 69.25 |
| 468.9 | 69 |
| 468.97 | 68.75 |
| 469.04 | 68.5 |
| 469.11 | 68.5 |
| 469.18 | 68.5 |
| 469.24 | 68.25 |
| 469.31 | 68.5 |
| 469.38 | 68.5 |
| 469.45 | 68.75 |
| 469.52 | 68.75 |
| 469.58 | 69 |
| 469.65 | 69 |
| 469.72 | 69 |
| 469.79 | 69.25 |
| 469.86 | 69.25 |
| 469.93 | 69.25 |
| 470.0 | 69.25 |
| 470.06 | 69.5 |
| 470.13 | 69.5 |
| 470.2 | 69.75 |
| 470.27 | 69.75 |
| 470.34 | 69.75 |
| 470.41 | 69.75 |
| 470.47 | 69.75 |
| 470.54 | 70 |
| 470.61 | 70 |
| 470.68 | 70 |
| 470.75 | 70 |
| 470.81 | 70 |
| 470.88 | 70.25 |
| 470.95 | 70 |
| 471.02 | 70.25 |
| 471.09 | 70 |
| 471.16 | 70.25 |
| 471.22 | 70 |
| 471.29 | 70 |
| 471.36 | 70 |
| 471.43 | 70 |
| 471.5 | 69.75 |
| 471.57 | 69.75 |
| 471.63 | 69.75 |
| 471.7 | 69.75 |
| 471.77 | 69.75 |
| 471.84 | 69.5 |
| 471.91 | 69.5 |
| 471.97 | 69.5 |
| 472.04 | 69.25 |
| 472.11 | 69.25 |
| 472.18 | 69.25 |
| 472.25 | 69.25 |
| 472.32 | 69 |
| 472.38 | 69 |
| 472.45 | 69 |
| 472.52 | 69 |
| 472.59 | 68.75 |
| 472.66 | 68.75 |
| 472.73 | 68.75 |
| 472.79 | 68.75 |
| 472.86 | 68.5 |
| 472.93 | 68.5 |
| 473.0 | 68.5 |
| 473.07 | 68.5 |
| 473.14 | 68.25 |
| 473.2 | 68.25 |
| 473.27 | 68.25 |
| 473.34 | 68.25 |
| 473.41 | 68.25 |
| 473.48 | 68 |
| 473.54 | 68 |
| 473.61 | 68 |
| 473.68 | 68 |
| 473.75 | 67.75 |
| 473.82 | 67.75 |
| 473.89 | 67.75 |
| 473.95 | 67.5 |
| 474.02 | 67.5 |
| 474.09 | 67.5 |
| 474.16 | 67.5 |
| 474.23 | 67.5 |
| 474.3 | 67.25 |
| 474.36 | 67.25 |
| 474.43 | 67.25 |
| 474.5 | 67.5 |
| 474.57 | 67.5 |
| 474.64 | 67.75 |
| 474.7 | 68 |
| 474.77 | 68.5 |
| 474.84 | 69 |
| 474.91 | 69 |
| 474.98 | 69.25 |
| 475.04 | 69.75 |
| 475.11 | 70 |
| 475.18 | 70.5 |
| 475.25 | 70.75 |
| 475.32 | 71 |
| 475.39 | 71.25 |
| 475.45 | 71.5 |
| 475.52 | 72 |
| 475.59 | 72.25 |
| 475.66 | 72.5 |
| 475.73 | 72.5 |
| 475.79 | 72.75 |
| 475.86 | 73 |
| 475.93 | 73.5 |
| 476.0 | 73.75 |
| 476.07 | 74 |
| 476.14 | 74.25 |
| 476.2 | 74.5 |
| 476.27 | 74.75 |
| 476.34 | 75 |
| 476.41 | 75.5 |
| 476.48 | 75.75 |
| 476.55 | 75.75 |
| 476.61 | 76 |
| 476.68 | 76.25 |
| 476.75 | 76.5 |
| 476.82 | 76.75 |
| 476.89 | 77 |
| 476.95 | 77.25 |
| 477.02 | 77.5 |
| 477.09 | 77.75 |
| 477.16 | 78 |
| 477.23 | 78.25 |
| 477.29 | 78.75 |
| 477.36 | 78.75 |
| 477.43 | 79 |
| 477.5 | 79 |
| 477.57 | 79.5 |
| 477.64 | 79.75 |
| 477.7 | 80 |
| 477.77 | 80.25 |
| 477.84 | 80.25 |
| 477.91 | 80.5 |
| 477.98 | 80.75 |
| 478.04 | 81 |
| 478.11 | 81.25 |
| 478.18 | 81.25 |
| 478.25 | 81.5 |
| 478.32 | 81.75 |
| 478.39 | 82 |
| 478.45 | 82 |
| 478.52 | 82.25 |
| 478.59 | 82.5 |
| 478.66 | 82.75 |
| 478.73 | 83 |
| 478.79 | 83.25 |
| 478.86 | 83.5 |
| 478.93 | 83.5 |
| 479.0 | 83.5 |
| 479.07 | 83.75 |
| 479.13 | 84 |
| 479.2 | 84.25 |
| 479.27 | 84.5 |
| 479.34 | 84.75 |
| 479.41 | 84.75 |
| 479.48 | 85 |
| 479.54 | 85.25 |
| 479.61 | 85.25 |
| 479.68 | 85.5 |
| 479.75 | 85.75 |
| 479.82 | 85.75 |
| 479.89 | 86 |
| 479.95 | 86.25 |
| 480.02 | 86.25 |
| 480.09 | 86.5 |
| 480.16 | 86.75 |
| 480.23 | 87 |
| 480.29 | 87 |
| 480.36 | 87.25 |
| 480.43 | 87.5 |
| 480.5 | 87.75 |
| 480.57 | 87.75 |
| 480.63 | 87.75 |
| 480.7 | 88 |
| 480.77 | 88 |
| 480.84 | 88.25 |
| 480.91 | 88.5 |
| 480.98 | 88.75 |
| 481.04 | 89 |
| 481.11 | 89 |
| 481.18 | 89.25 |
| 481.25 | 89.25 |
| 481.32 | 89.5 |
| 481.39 | 89.75 |
| 481.45 | 89.75 |
| 481.52 | 90 |
| 481.59 | 90 |
| 481.66 | 90.25 |
| 481.73 | 90.25 |
| 481.79 | 90.5 |
| 481.86 | 90.75 |
| 481.93 | 90.75 |
| 482.0 | 91 |
| 482.07 | 91 |
| 482.14 | 91.25 |
| 482.2 | 91.5 |
| 482.27 | 91.5 |
| 482.34 | 91.75 |
| 482.41 | 91.75 |
| 482.48 | 92 |
| 482.54 | 92.25 |
| 482.61 | 92.25 |
| 482.68 | 92.5 |
| 482.75 | 92.5 |
| 482.82 | 92.75 |
| 482.88 | 92.75 |
| 482.95 | 93 |
| 483.02 | 93 |
| 483.09 | 93 |
| 483.16 | 93.25 |
| 483.23 | 93.5 |
| 483.29 | 93.5 |
| 483.36 | 93.75 |
| 483.43 | 93.75 |
| 483.5 | 94 |
| 483.57 | 94.25 |
| 483.64 | 94.25 |
| 483.7 | 94.5 |
| 483.77 | 94.5 |
| 483.84 | 94.75 |
| 483.91 | 94.75 |
| 483.98 | 95 |
| 484.04 | 95 |
| 484.11 | 95.25 |
| 484.18 | 95.25 |
| 484.25 | 95.5 |
| 484.32 | 95.5 |
| 484.38 | 95.5 |
| 484.45 | 95.75 |
| 484.52 | 96 |
| 484.59 | 96 |
| 484.66 | 96 |
| 484.73 | 96 |
| 484.79 | 96.25 |
| 484.86 | 96.5 |
| 484.93 | 96.5 |
| 485.0 | 96.75 |
| 485.07 | 96.75 |
| 485.13 | 97 |
| 485.2 | 97 |
| 485.27 | 97.25 |
| 485.34 | 97.25 |
| 485.41 | 97.5 |
| 485.48 | 97.5 |
| 485.54 | 97.5 |
| 485.61 | 97.75 |
| 485.68 | 97.75 |
| 485.75 | 98 |
| 485.82 | 98 |
| 485.88 | 98.25 |
| 485.95 | 98.25 |
| 486.02 | 98.5 |
| 486.09 | 98.5 |
| 486.16 | 98.75 |
| 486.23 | 98.75 |
| 486.29 | 99 |
| 486.36 | 99 |
| 486.43 | 99 |
| 486.5 | 99.25 |
| 486.57 | 99.25 |
| 486.63 | 99.25 |
| 486.7 | 99.5 |
| 486.77 | 99.5 |
| 486.84 | 99.75 |
| 486.91 | 99.75 |
| 486.98 | 99.75 |
| 487.04 | 100 |
| 487.11 | 100 |
| 487.18 | 100 |
| 487.25 | 100 |
| 487.32 | 100.25 |
| 487.39 | 100.25 |
| 487.45 | 100.5 |
| 487.52 | 100.5 |
| 487.59 | 100.5 |
| 487.66 | 100.75 |
| 487.73 | 100.75 |
| 487.8 | 100.75 |
| 487.86 | 100.75 |
| 487.93 | 100.75 |
| 488.0 | 100.75 |
| 488.07 | 100.75 |
| 488.14 | 101 |
| 488.2 | 101 |
| 488.27 | 101 |
| 488.34 | 101 |
| 488.41 | 100.75 |
| 488.48 | 101 |
| 488.55 | 100.75 |
| 488.61 | 100.5 |
| 488.68 | 100.25 |
| 488.75 | 99.75 |
| 488.82 | 99.75 |
| 488.89 | 99.5 |
| 488.95 | 99.25 |
| 489.02 | 99 |
| 489.09 | 98.5 |
| 489.16 | 98 |
| 489.23 | 97.5 |
| 489.3 | 97 |
| 489.36 | 96.75 |
| 489.43 | 96 |
| 489.5 | 95.5 |
| 489.57 | 95 |
| 489.64 | 95 |
| 489.7 | 94.5 |
| 489.77 | 94 |
| 489.84 | 93.25 |
| 489.91 | 92.75 |
| 489.98 | 92.25 |
| 490.05 | 91.75 |
| 490.11 | 91.25 |
| 490.18 | 90.75 |
| 490.25 | 90.25 |
| 490.32 | 89.75 |
| 490.39 | 89.25 |
| 490.45 | 89.25 |
| 490.52 | 88.75 |
| 490.59 | 88.25 |
| 490.66 | 87.75 |
| 490.73 | 87.25 |
| 490.8 | 86.75 |
| 490.86 | 86.5 |
| 490.93 | 86 |
| 491.0 | 85.5 |
| 491.07 | 85 |
| 491.14 | 84.75 |
| 491.2 | 84.25 |
| 491.27 | 84.25 |
| 491.34 | 83.75 |
| 491.41 | 83.5 |
| 491.48 | 83 |
| 491.54 | 82.75 |
| 491.61 | 82.25 |
| 491.68 | 82 |
| 491.75 | 81.5 |
| 491.82 | 81.25 |
| 491.89 | 81 |
| 491.95 | 80.5 |
| 492.02 | 80.25 |
| 492.09 | 80.25 |
| 492.16 | 80 |
| 492.23 | 79.5 |
| 492.29 | 79.25 |
| 492.36 | 79 |
| 492.43 | 78.75 |
| 492.5 | 78.25 |
| 492.57 | 78 |
| 492.63 | 77.75 |
| 492.7 | 77.5 |
| 492.77 | 77 |
| 492.84 | 76.75 |
| 492.91 | 76.75 |
| 492.98 | 76.5 |
| 493.04 | 76.25 |
| 493.11 | 76 |
| 493.18 | 75.75 |
| 493.25 | 75.5 |
| 493.32 | 75.25 |
| 493.38 | 74.75 |
| 493.45 | 74.75 |
| 493.52 | 74.25 |
| 493.59 | 74 |
| 493.66 | 74 |
| 493.72 | 73.75 |
| 493.79 | 73.5 |
| 493.86 | 73.5 |
| 493.93 | 73 |
| 494.0 | 73 |
| 494.07 | 72.5 |
| 494.13 | 72.5 |
| 494.2 | 72 |
| 494.27 | 71.75 |
| 494.34 | 71.75 |
| 494.41 | 71.25 |
| 494.47 | 71.25 |
| 494.54 | 71.25 |
| 494.61 | 71 |
| 494.68 | 70.75 |
| 494.75 | 70.5 |
| 494.82 | 70.25 |
| 494.88 | 70 |
| 494.95 | 69.75 |
| 495.02 | 69.5 |
| 495.09 | 69.25 |
| 495.16 | 69.25 |
| 495.22 | 69 |
| 495.29 | 69 |
| 495.36 | 68.75 |
| 495.43 | 68.5 |
| 495.5 | 68.5 |
| 495.56 | 68.25 |
| 495.63 | 68 |
| 495.7 | 68.25 |
| 495.77 | 68.5 |
| 495.84 | 68.75 |
| 495.91 | 68.75 |
| 495.97 | 68.75 |
| 496.04 | 69 |
| 496.11 | 69 |
| 496.18 | 69 |
| 496.25 | 69 |
| 496.32 | 69.25 |
| 496.38 | 69.25 |
| 496.45 | 69.5 |
| 496.52 | 69.5 |
| 496.59 | 69.5 |
| 496.66 | 69.75 |
| 496.72 | 70 |
| 496.79 | 70 |
| 496.86 | 70 |
| 496.93 | 70 |
| 497.0 | 70.25 |
| 497.07 | 70.25 |
| 497.13 | 70.5 |
| 497.2 | 70.5 |
| 497.27 | 70.5 |
| 497.34 | 70.5 |
| 497.41 | 70.5 |
| 497.48 | 70.5 |
| 497.54 | 70.5 |
| 497.61 | 70.5 |
| 497.68 | 70.5 |
| 497.75 | 70.5 |
| 497.82 | 70.5 |
| 497.89 | 70.5 |
| 497.95 | 70.5 |
| 498.02 | 70.25 |
| 498.09 | 70.25 |
| 498.16 | 70.25 |
| 498.23 | 70 |
| 498.29 | 70 |
| 498.36 | 70 |
| 498.43 | 69.75 |
| 498.5 | 69.75 |
| 498.57 | 69.5 |
| 498.64 | 69.5 |
| 498.7 | 69.5 |
| 498.77 | 69.5 |
| 498.84 | 69.25 |
| 498.91 | 69.25 |
| 498.98 | 69.25 |
| 499.05 | 69.25 |
| 499.11 | 69 |
| 499.18 | 69 |
| 499.25 | 69 |
| 499.32 | 68.75 |
| 499.39 | 68.75 |
| 499.45 | 68.75 |
| 499.52 | 68.75 |
| 499.59 | 68.75 |
| 499.66 | 68.75 |
| 499.73 | 68.5 |
| 499.8 | 68.5 |
| 499.86 | 68.5 |
| 499.93 | 68.25 |
| 500.0 | 68.25 |
| 500.07 | 68.25 |
| 500.14 | 68.25 |
| 500.2 | 68 |
| 500.27 | 68 |
| 500.34 | 68 |
| 500.41 | 67.75 |
| 500.48 | 67.75 |
| 500.55 | 67.75 |
| 500.61 | 67.75 |
| 500.68 | 67.5 |
| 500.75 | 67.5 |
| 500.82 | 67.75 |
| 500.89 | 67.75 |
| 500.96 | 68 |
| 501.02 | 68.25 |
| 501.09 | 68.25 |
| 501.16 | 68.5 |
| 501.23 | 69 |
| 501.3 | 69.5 |
| 501.36 | 69.75 |
| 501.43 | 70.25 |
| 501.5 | 70.5 |
| 501.57 | 71 |
| 501.64 | 71.25 |
| 501.7 | 71.5 |
| 501.77 | 71.75 |
| 501.84 | 72.25 |
| 501.91 | 72.25 |
| 501.98 | 72.5 |
| 502.05 | 72.75 |
| 502.11 | 73.25 |
| 502.18 | 73.25 |
| 502.25 | 73.75 |
| 502.32 | 74 |
| 502.39 | 74.25 |
| 502.46 | 74.5 |
| 502.52 | 74.75 |
| 502.59 | 75.25 |
| 502.66 | 75.5 |
| 502.73 | 75.5 |
| 502.8 | 75.75 |
| 502.86 | 76 |
| 502.93 | 76.25 |
| 503.0 | 76.75 |
| 503.07 | 77 |
| 503.14 | 77.25 |
| 503.2 | 77.5 |
| 503.27 | 77.75 |
| 503.34 | 78 |
| 503.41 | 78.25 |
| 503.48 | 78.5 |
| 503.55 | 78.5 |
| 503.61 | 79 |
| 503.68 | 79 |
| 503.75 | 79.5 |
| 503.82 | 79.5 |
| 503.89 | 80 |
| 503.96 | 80 |
| 504.02 | 80.5 |
| 504.09 | 80.75 |
| 504.16 | 80.75 |
| 504.23 | 81 |
| 504.3 | 81.5 |
| 504.36 | 81.5 |
| 504.43 | 81.75 |
| 504.5 | 81.75 |
| 504.57 | 82 |
| 504.64 | 82.25 |
| 504.71 | 82.75 |
| 504.77 | 82.75 |
| 504.84 | 83 |
| 504.91 | 83.25 |
| 504.98 | 83.5 |
| 505.05 | 83.75 |
| 505.11 | 84 |
| 505.18 | 84 |
| 505.25 | 84 |
| 505.32 | 84.5 |
| 505.39 | 84.5 |
| 505.45 | 84.75 |
| 505.52 | 85 |
| 505.59 | 85.25 |
| 505.66 | 85.5 |
| 505.73 | 85.5 |
| 505.8 | 85.75 |
| 505.86 | 86 |
| 505.93 | 86.25 |
| 506.0 | 86.25 |
| 506.07 | 86.5 |
| 506.14 | 86.75 |
| 506.21 | 87 |
| 506.27 | 87 |
| 506.34 | 87.25 |
| 506.41 | 87.5 |
| 506.48 | 87.75 |
| 506.55 | 87.75 |
| 506.61 | 88 |
| 506.68 | 88.25 |
| 506.75 | 88.25 |
| 506.82 | 88.25 |
| 506.89 | 88.5 |
| 506.95 | 88.75 |
| 507.02 | 89 |
| 507.09 | 89 |
| 507.16 | 89.25 |
| 507.23 | 89.5 |
| 507.3 | 89.75 |
| 507.36 | 89.75 |
| 507.43 | 90 |
| 507.5 | 90.25 |
| 507.57 | 90.25 |
| 507.64 | 90.25 |
| 507.7 | 90.5 |
| 507.77 | 90.75 |
| 507.84 | 90.75 |
| 507.91 | 91 |
| 507.98 | 91.25 |
| 508.05 | 91.5 |
| 508.11 | 91.5 |
| 508.18 | 91.75 |
| 508.25 | 92 |
| 508.32 | 92 |
| 508.39 | 92.25 |
| 508.45 | 92.25 |
| 508.52 | 92.5 |
| 508.59 | 92.5 |
| 508.66 | 92.75 |
| 508.73 | 93 |
| 508.8 | 93 |
| 508.86 | 93.25 |
| 508.93 | 93.5 |
| 509.0 | 93.5 |
| 509.07 | 93.75 |
| 509.14 | 94 |
| 509.2 | 94 |
| 509.27 | 94 |
| 509.34 | 94 |
| 509.41 | 94.25 |
| 509.48 | 94.5 |
| 509.55 | 94.5 |
| 509.61 | 94.75 |
| 509.68 | 95 |
| 509.75 | 95 |
| 509.82 | 95 |
| 509.89 | 95.5 |
| 509.96 | 95.5 |
| 510.02 | 95.5 |
| 510.09 | 95.5 |
| 510.16 | 95.75 |
| 510.23 | 96 |
| 510.3 | 96 |
| 510.36 | 96 |
| 510.43 | 96.25 |
| 510.5 | 96.5 |
| 510.57 | 96.5 |
| 510.64 | 96.75 |
| 510.7 | 96.75 |
| 510.77 | 97 |
| 510.84 | 97 |
| 510.91 | 97 |
| 510.98 | 97 |
| 511.05 | 97.25 |
| 511.11 | 97.25 |
| 511.18 | 97.5 |
| 511.25 | 97.75 |
| 511.32 | 97.75 |
| 511.39 | 97.75 |
| 511.45 | 98 |
| 511.52 | 98 |
| 511.59 | 98.25 |
| 511.66 | 98.25 |
| 511.73 | 98.25 |
| 511.8 | 98.5 |
| 511.86 | 98.5 |
| 511.93 | 98.75 |
| 512.0 | 98.75 |
| 512.07 | 99 |
| 512.14 | 99.25 |
| 512.21 | 99.25 |
| 512.27 | 99.25 |
| 512.34 | 99.5 |
| 512.41 | 99.5 |
| 512.48 | 99.75 |
| 512.55 | 99.75 |
| 512.61 | 99.75 |
| 512.68 | 99.75 |
| 512.75 | 100 |
| 512.82 | 100 |
| 512.89 | 100.25 |
| 512.96 | 100.25 |
| 513.03 | 100.25 |
| 513.09 | 100.5 |
| 513.16 | 100.5 |
| 513.23 | 100.75 |
| 513.3 | 100.75 |
| 513.37 | 100.75 |
| 513.43 | 100.75 |
| 513.5 | 101 |
| 513.57 | 101 |
| 513.64 | 101 |
| 513.71 | 101 |
| 513.78 | 101 |
| 513.84 | 101 |
| 513.91 | 101 |
| 513.98 | 101 |
| 514.05 | 101 |
| 514.12 | 101 |
| 514.19 | 101 |
| 514.25 | 101 |
| 514.32 | 101 |
| 514.39 | 100.5 |
| 514.46 | 100.25 |
| 514.53 | 99.75 |
| 514.59 | 99.5 |
| 514.66 | 99.25 |
| 514.73 | 98.75 |
| 514.8 | 98.5 |
| 514.87 | 98 |
| 514.93 | 97.25 |
| 515.0 | 97.25 |
| 515.07 | 97 |
| 515.14 | 96.5 |
| 515.21 | 96 |
| 515.28 | 95.5 |
| 515.34 | 94.75 |
| 515.41 | 94.25 |
| 515.48 | 93.75 |
| 515.55 | 93.25 |
| 515.62 | 92.75 |
| 515.68 | 92.25 |
| 515.75 | 91.5 |
| 515.82 | 91.5 |
| 515.89 | 91 |
| 515.96 | 90.5 |
| 516.03 | 90 |
| 516.09 | 89.5 |
| 516.16 | 89 |
| 516.23 | 88.5 |
| 516.3 | 88 |
| 516.37 | 87.75 |
| 516.43 | 87.25 |
| 516.5 | 86.75 |
| 516.57 | 86.25 |
| 516.64 | 86.25 |
| 516.71 | 85.75 |
| 516.77 | 85.25 |
| 516.84 | 85 |
| 516.91 | 84.5 |
| 516.98 | 84 |
| 517.05 | 83.75 |
| 517.11 | 83.25 |
| 517.18 | 83 |
| 517.25 | 82.5 |
| 517.32 | 82.25 |
| 517.39 | 82 |
| 517.46 | 82 |
| 517.52 | 81.5 |
| 517.59 | 81.25 |
| 517.66 | 80.75 |
| 517.73 | 80.5 |
| 517.8 | 80.25 |
| 517.86 | 79.75 |
| 517.93 | 79.25 |
| 518.0 | 79 |
| 518.07 | 78.75 |
| 518.14 | 78.5 |
| 518.21 | 78 |
| 518.27 | 78 |
| 518.34 | 77.75 |
| 518.41 | 77.5 |
| 518.48 | 77.25 |
| 518.55 | 77 |
| 518.61 | 76.75 |
| 518.68 | 76.25 |
| 518.75 | 76 |
| 518.82 | 75.75 |
| 518.89 | 75.5 |
| 518.96 | 75.25 |
| 519.02 | 75 |
| 519.09 | 75 |
| 519.16 | 74.75 |
| 519.23 | 74.5 |
| 519.29 | 74.25 |
| 519.36 | 74 |
| 519.43 | 73.5 |
| 519.5 | 73.5 |
| 519.57 | 73 |
| 519.64 | 72.75 |
| 519.7 | 72.75 |
| 519.77 | 72.25 |
| 519.84 | 72.25 |
| 519.91 | 72.25 |
| 519.98 | 71.75 |
| 520.04 | 71.75 |
| 520.11 | 71.5 |
| 520.18 | 71.25 |
| 520.25 | 71 |
| 520.32 | 70.75 |
| 520.39 | 70.5 |
| 520.45 | 70.25 |
| 520.52 | 70 |
| 520.59 | 69.75 |
| 520.66 | 69.5 |
| 520.73 | 69.5 |
| 520.79 | 69.25 |
| 520.86 | 69.25 |
| 520.93 | 68.75 |
| 521.0 | 68.75 |
| 521.07 | 68.5 |
| 521.14 | 68.25 |
| 521.2 | 68 |
| 521.27 | 68 |
| 521.34 | 68.25 |
| 521.41 | 68.5 |
| 521.48 | 68.5 |
| 521.54 | 68.5 |
| 521.61 | 68.75 |
| 521.68 | 69 |
| 521.75 | 69 |
| 521.82 | 69 |
| 521.89 | 69.25 |
| 521.95 | 69.25 |
| 522.02 | 69.5 |
| 522.09 | 69.5 |
| 522.16 | 69.75 |
| 522.23 | 69.75 |
| 522.29 | 70 |
| 522.36 | 70 |
| 522.43 | 70 |
| 522.5 | 70 |
| 522.57 | 70.25 |
| 522.64 | 70.25 |
| 522.7 | 70.5 |
| 522.77 | 70.5 |
| 522.84 | 70.5 |
| 522.91 | 70.5 |
| 522.98 | 70.5 |
| 523.04 | 70.5 |
| 523.11 | 70.5 |
| 523.18 | 70.5 |
| 523.25 | 70.5 |
| 523.32 | 70.5 |
| 523.39 | 70.5 |
| 523.46 | 70.5 |
| 523.52 | 70.5 |
| 523.59 | 70.25 |
| 523.66 | 70.25 |
| 523.73 | 70 |
| 523.8 | 70 |
| 523.86 | 69.75 |
| 523.93 | 69.75 |
| 524.0 | 69.75 |
| 524.07 | 69.75 |
| 524.14 | 69.75 |
| 524.21 | 69.75 |
| 524.27 | 69.5 |
| 524.34 | 69.5 |
| 524.41 | 69.25 |
| 524.48 | 69.25 |
| 524.55 | 69.25 |
| 524.62 | 69.25 |
| 524.68 | 69.25 |
| 524.75 | 69 |
| 524.82 | 69 |
| 524.89 | 69 |
| 524.96 | 68.75 |
| 525.03 | 68.75 |
| 525.09 | 68.75 |
| 525.16 | 68.75 |
| 525.23 | 68.5 |
| 525.3 | 68.5 |
| 525.37 | 68.5 |
| 525.43 | 68.25 |
| 525.5 | 68.25 |
| 525.57 | 68.25 |
| 525.64 | 68.25 |
| 525.71 | 68.25 |
| 525.78 | 68 |
| 525.84 | 68 |
| 525.91 | 68 |
| 525.98 | 67.75 |
| 526.05 | 67.75 |
| 526.12 | 67.75 |
| 526.19 | 67.75 |
| 526.25 | 67.5 |
| 526.32 | 67.5 |
| 526.39 | 67.5 |
| 526.46 | 67.75 |
| 526.53 | 67.75 |
| 526.59 | 67.75 |
| 526.66 | 68 |
| 526.73 | 68.25 |
| 526.8 | 68.5 |
| 526.87 | 69 |
| 526.94 | 69.5 |
| 527.0 | 69.75 |
| 527.07 | 70.25 |
| 527.14 | 70.75 |
| 527.21 | 71 |
| 527.28 | 71.5 |
| 527.34 | 71.5 |
| 527.41 | 71.75 |
| 527.48 | 72 |
| 527.55 | 72.5 |
| 527.62 | 72.75 |
| 527.69 | 73 |
| 527.75 | 73.25 |
| 527.82 | 73.75 |
| 527.89 | 74 |
| 527.96 | 74.25 |
| 528.03 | 74.5 |
| 528.09 | 75 |
| 528.16 | 75 |
| 528.23 | 75.25 |
| 528.3 | 75.5 |
| 528.37 | 75.75 |
| 528.44 | 76.25 |
| 528.5 | 76.5 |
| 528.57 | 76.75 |
| 528.64 | 77 |
| 528.71 | 77.25 |
| 528.78 | 77.5 |
| 528.84 | 78 |
| 528.91 | 78.25 |
| 528.98 | 78.25 |
| 529.05 | 78.5 |
| 529.12 | 78.75 |
| 529.19 | 79 |
| 529.25 | 79.25 |
| 529.32 | 79.5 |
| 529.39 | 80 |
| 529.46 | 80.25 |
| 529.53 | 80.5 |
| 529.59 | 80.75 |
| 529.66 | 81 |
| 529.73 | 81.25 |
| 529.8 | 81.25 |
| 529.87 | 81.5 |
| 529.94 | 81.75 |
| 530.0 | 82 |
| 530.07 | 82.25 |
| 530.14 | 82.5 |
| 530.21 | 82.75 |
| 530.28 | 83 |
| 530.34 | 83.25 |
| 530.41 | 83.5 |
| 530.48 | 83.75 |
| 530.55 | 84 |
| 530.62 | 84 |
| 530.69 | 84.25 |
| 530.75 | 84.5 |
| 530.82 | 84.75 |
| 530.89 | 85 |
| 530.96 | 85.25 |
| 531.03 | 85.25 |
| 531.09 | 85.5 |
| 531.16 | 85.75 |
| 531.23 | 86 |
| 531.3 | 86.25 |
| 531.37 | 86.5 |
| 531.44 | 86.5 |
| 531.5 | 86.75 |
| 531.57 | 87 |
| 531.64 | 87 |
| 531.71 | 87.5 |
| 531.78 | 87.5 |
| 531.84 | 87.75 |
| 531.91 | 88 |
| 531.98 | 88 |
| 532.05 | 88.25 |
| 532.12 | 88.75 |
| 532.19 | 88.75 |
| 532.25 | 88.75 |
| 532.32 | 89 |
| 532.39 | 89.25 |
| 532.46 | 89.5 |
| 532.53 | 89.5 |
| 532.59 | 89.75 |
| 532.66 | 90 |
| 532.73 | 90 |
| 532.8 | 90.25 |
| 532.87 | 90.5 |
| 532.94 | 90.75 |
| 533.0 | 90.75 |
| 533.07 | 90.75 |
| 533.14 | 91 |
| 533.21 | 91.25 |
| 533.28 | 91.25 |
| 533.34 | 91.5 |
| 533.41 | 91.75 |
| 533.48 | 91.75 |
| 533.55 | 92 |
| 533.62 | 92.25 |
| 533.69 | 92.5 |
| 533.75 | 92.75 |
| 533.82 | 92.75 |
| 533.89 | 92.75 |
| 533.96 | 93 |
| 534.03 | 93.25 |
| 534.09 | 93.25 |
| 534.16 | 93.5 |
| 534.23 | 93.75 |
| 534.3 | 93.75 |
| 534.37 | 94 |
| 534.43 | 94 |
| 534.5 | 94.25 |
| 534.57 | 94.5 |
| 534.64 | 94.5 |
| 534.71 | 94.5 |
| 534.78 | 94.75 |
| 534.84 | 95 |
| 534.91 | 95.25 |
| 534.98 | 95.25 |
| 535.05 | 95.5 |
| 535.12 | 95.75 |
| 535.19 | 95.75 |
| 535.25 | 96 |
| 535.32 | 96 |
| 535.39 | 96.25 |
| 535.46 | 96.25 |
| 535.53 | 96.25 |
| 535.59 | 96.5 |
| 535.66 | 96.75 |
| 535.73 | 96.75 |
| 535.8 | 97 |
| 535.87 | 97 |
| 535.93 | 97.25 |
| 536.0 | 97.5 |
| 536.07 | 97.5 |
| 536.14 | 97.75 |
| 536.21 | 97.75 |
| 536.28 | 98 |
| 536.34 | 98 |
| 536.41 | 98 |
| 536.48 | 98.25 |
| 536.55 | 98.5 |
| 536.62 | 98.5 |
| 536.69 | 98.75 |
| 536.75 | 98.75 |
| 536.82 | 99 |
| 536.89 | 99 |
| 536.96 | 99.25 |
| 537.03 | 99.5 |
| 537.09 | 99.5 |
| 537.16 | 99.5 |
| 537.23 | 99.75 |
| 537.3 | 99.75 |
| 537.37 | 99.75 |
| 537.44 | 100 |
| 537.5 | 100 |
| 537.57 | 100.25 |
| 537.64 | 100.25 |
| 537.71 | 100.5 |
| 537.78 | 100.5 |
| 537.84 | 100.5 |
| 537.91 | 100.75 |
| 537.98 | 100.75 |
| 538.05 | 100.75 |
| 538.12 | 100.75 |
| 538.19 | 101 |
| 538.26 | 101 |
| 538.32 | 101 |
| 538.39 | 101 |
| 538.46 | 101.25 |
| 538.53 | 101.25 |
| 538.6 | 101 |
| 538.66 | 101.25 |
| 538.73 | 101 |
| 538.8 | 101 |
| 538.87 | 101 |
| 538.94 | 101.25 |
| 539.01 | 101.25 |
| 539.07 | 101 |
| 539.14 | 101 |
| 539.21 | 100.5 |
| 539.28 | 100 |
| 539.35 | 99.75 |
| 539.41 | 99.5 |
| 539.48 | 99.25 |
| 539.55 | 98.75 |
| 539.62 | 98.75 |
| 539.69 | 98.25 |
| 539.76 | 98 |
| 539.82 | 97.5 |
| 539.89 | 97 |
| 539.96 | 96.5 |
| 540.03 | 95.75 |
| 540.1 | 95.25 |
| 540.16 | 94.75 |
| 540.23 | 94.25 |
| 540.3 | 93.5 |
| 540.37 | 93 |
| 540.44 | 93 |
| 540.51 | 92.5 |
| 540.57 | 92 |
| 540.64 | 91.5 |
| 540.71 | 91 |
| 540.78 | 90.5 |
| 540.85 | 89.75 |
| 540.91 | 89.25 |
| 540.98 | 88.75 |
| 541.05 | 88.25 |
| 541.12 | 87.75 |
| 541.19 | 87.25 |
| 541.25 | 87.25 |
| 541.32 | 86.75 |
| 541.39 | 86.25 |
| 541.46 | 86 |
| 541.53 | 85.5 |
| 541.59 | 85 |
| 541.66 | 84.5 |
| 541.73 | 84.25 |
| 541.8 | 83.75 |
| 541.87 | 83.5 |
| 541.94 | 83 |
| 542.0 | 82.75 |
| 542.07 | 82.75 |
| 542.14 | 82.25 |
| 542.21 | 82 |
| 542.28 | 81.5 |
| 542.34 | 81.25 |
| 542.41 | 80.75 |
| 542.48 | 80.5 |
| 542.55 | 80 |
| 542.62 | 79.75 |
| 542.69 | 79.5 |
| 542.75 | 79 |
| 542.82 | 78.75 |
| 542.89 | 78.75 |
| 542.96 | 78.5 |
| 543.03 | 78.25 |
| 543.09 | 77.75 |
| 543.16 | 77.5 |
| 543.23 | 77.25 |
| 543.3 | 77 |
| 543.37 | 76.75 |
| 543.43 | 76.5 |
| 543.5 | 76 |
| 543.57 | 75.75 |
| 543.64 | 75.75 |
| 543.71 | 75.5 |
| 543.78 | 75.25 |
| 543.84 | 75 |
| 543.91 | 74.5 |
| 543.98 | 74.25 |
| 544.05 | 74.25 |
| 544.11 | 73.75 |
| 544.18 | 73.5 |
| 544.25 | 73.25 |
| 544.32 | 73 |
| 544.39 | 72.75 |
| 544.46 | 72.75 |
| 544.52 | 72.5 |
| 544.59 | 72.25 |
| 544.66 | 72 |
| 544.73 | 71.75 |
| 544.8 | 71.5 |
| 544.86 | 71.5 |
| 544.93 | 71.25 |
| 545.0 | 71 |
| 545.07 | 70.75 |
| 545.14 | 70.5 |
| 545.21 | 70.25 |
| 545.27 | 70.25 |
| 545.34 | 70 |
| 545.41 | 69.75 |
| 545.48 | 69.5 |
| 545.55 | 69.25 |
| 545.61 | 69.25 |
| 545.68 | 69 |
| 545.75 | 68.75 |
| 545.82 | 68.5 |
| 545.89 | 68.25 |
| 545.96 | 68 |
| 546.02 | 68.25 |
| 546.09 | 68.25 |
| 546.16 | 68.5 |
| 546.23 | 68.5 |
| 546.3 | 68.75 |
| 546.36 | 68.75 |
| 546.43 | 68.75 |
| 546.5 | 69 |
| 546.57 | 69 |
| 546.64 | 69.25 |
| 546.71 | 69.25 |
| 546.78 | 69.25 |
| 546.84 | 69.25 |
| 546.91 | 69.25 |
| 546.98 | 69.5 |
| 547.05 | 69.5 |
| 547.12 | 69.75 |
| 547.18 | 69.75 |
| 547.25 | 69.75 |
| 547.32 | 69.75 |
| 547.39 | 70 |
| 547.46 | 70 |
| 547.53 | 70 |
| 547.59 | 70 |
| 547.66 | 70 |
| 547.73 | 70.25 |
| 547.8 | 70.25 |
| 547.87 | 70 |
| 547.94 | 70.25 |
| 548.0 | 70.25 |
| 548.07 | 70 |
| 548.14 | 70.25 |
| 548.21 | 70 |
| 548.28 | 70 |
| 548.34 | 70 |
| 548.41 | 70 |
| 548.48 | 69.75 |
| 548.55 | 69.75 |
| 548.62 | 69.75 |
| 548.69 | 69.75 |
| 548.75 | 69.75 |
| 548.82 | 69.5 |
| 548.89 | 69.25 |
| 548.96 | 69.25 |
| 549.03 | 69.25 |
| 549.09 | 69.25 |
| 549.16 | 69.25 |
| 549.23 | 69 |
| 549.3 | 69 |
| 549.37 | 69 |
| 549.44 | 69 |
| 549.51 | 68.75 |
| 549.57 | 68.75 |
| 549.64 | 68.75 |
| 549.71 | 68.5 |
| 549.78 | 68.5 |
| 549.85 | 68.5 |
| 549.91 | 68.5 |
| 549.98 | 68.25 |
| 550.05 | 68.25 |
| 550.12 | 68.25 |
| 550.19 | 68.25 |
| 550.26 | 68.25 |
| 550.32 | 68.25 |
| 550.39 | 68 |
| 550.46 | 68 |
| 550.53 | 68 |
| 550.6 | 67.75 |
| 550.66 | 67.75 |
| 550.73 | 67.75 |
| 550.8 | 67.75 |
| 550.87 | 67.5 |
| 550.94 | 67.5 |
| 551.01 | 67.5 |
| 551.07 | 67.5 |
| 551.14 | 67.25 |
| 551.21 | 67.5 |
| 551.28 | 67.5 |
| 551.35 | 68 |
| 551.41 | 68.25 |
| 551.48 | 68.75 |
| 551.55 | 69.25 |
| 551.62 | 69.75 |
| 551.69 | 70 |
| 551.76 | 70.5 |
| 551.82 | 71 |
| 551.89 | 71 |
| 551.96 | 71.25 |
| 552.03 | 71.5 |
| 552.1 | 71.75 |
| 552.16 | 72.25 |
| 552.23 | 72.5 |
| 552.3 | 73 |
| 552.37 | 73.25 |
| 552.44 | 73.5 |
| 552.51 | 74 |
| 552.57 | 74.25 |
| 552.64 | 74.5 |
| 552.71 | 74.5 |
| 552.78 | 75 |
| 552.85 | 75.25 |
| 552.91 | 75.5 |
| 552.98 | 76 |
| 553.05 | 76.25 |
| 553.12 | 76.5 |
| 553.19 | 76.75 |
| 553.26 | 77 |
| 553.32 | 77.5 |
| 553.39 | 77.75 |
| 553.46 | 78 |
| 553.53 | 78 |
| 553.6 | 78.25 |
| 553.66 | 78.75 |
| 553.73 | 79 |
| 553.8 | 79.25 |
| 553.87 | 79.5 |
| 553.94 | 80 |
| 554.01 | 80.25 |
| 554.07 | 80.5 |
| 554.14 | 80.75 |
| 554.21 | 80.75 |
| 554.28 | 81.25 |
| 554.35 | 81.25 |
| 554.41 | 81.5 |
| 554.48 | 81.75 |
| 554.55 | 82.25 |
| 554.62 | 82.25 |
| 554.69 | 82.5 |
| 554.76 | 82.75 |
| 554.82 | 83 |
| 554.89 | 83.25 |
| 554.96 | 83.5 |
| 555.03 | 83.75 |
| 555.1 | 84 |
| 555.16 | 84 |
| 555.23 | 84.25 |
| 555.3 | 84.5 |
| 555.37 | 84.75 |
| 555.44 | 85 |
| 555.51 | 85.25 |
| 555.57 | 85.5 |
| 555.64 | 85.75 |
| 555.71 | 86 |
| 555.78 | 86 |
| 555.85 | 86.25 |
| 555.91 | 86.5 |
| 555.98 | 86.5 |
| 556.05 | 86.75 |
| 556.12 | 87 |
| 556.19 | 87 |
| 556.26 | 87.25 |
| 556.32 | 87.5 |
| 556.39 | 87.75 |
| 556.46 | 88 |
| 556.53 | 88 |
| 556.6 | 88.25 |
| 556.66 | 88.5 |
| 556.73 | 88.75 |
| 556.8 | 88.75 |
| 556.87 | 89 |
| 556.94 | 89.25 |
| 557.01 | 89.25 |
| 557.07 | 89.5 |
| 557.14 | 89.75 |
| 557.21 | 90 |
| 557.28 | 90 |
| 557.35 | 90.5 |
| 557.41 | 90.5 |
| 557.48 | 90.75 |
| 557.55 | 91 |
| 557.62 | 91 |
| 557.69 | 91 |
| 557.76 | 91.25 |
| 557.82 | 91.5 |
| 557.89 | 91.75 |
| 557.96 | 92 |
| 558.03 | 92 |
| 558.1 | 92.25 |
| 558.16 | 92.5 |
| 558.23 | 92.75 |
| 558.3 | 92.75 |
| 558.37 | 93 |
| 558.44 | 93 |
| 558.51 | 93.25 |
| 558.57 | 93.5 |
| 558.64 | 93.5 |
| 558.71 | 93.75 |
| 558.78 | 94 |
| 558.85 | 94 |
| 558.91 | 94.25 |
| 558.98 | 94.5 |
| 559.05 | 94.5 |
| 559.12 | 94.75 |
| 559.19 | 95 |
| 559.26 | 95 |
| 559.32 | 95.25 |
| 559.39 | 95.25 |
| 559.46 | 95.5 |
| 559.53 | 95.75 |
| 559.6 | 95.75 |
| 559.66 | 96 |
| 559.73 | 96.25 |
| 559.8 | 96.25 |
| 559.87 | 96.5 |
| 559.94 | 96.5 |
| 560.01 | 96.75 |
| 560.07 | 96.75 |
| 560.14 | 97 |
| 560.21 | 97 |
| 560.28 | 97.25 |
| 560.35 | 97.25 |
| 560.41 | 97.5 |
| 560.48 | 97.75 |
| 560.55 | 97.75 |
| 560.62 | 98 |
| 560.69 | 98 |
| 560.76 | 98.25 |
| 560.82 | 98.25 |
| 560.89 | 98.25 |
| 560.96 | 98.5 |
| 561.03 | 98.5 |
| 561.1 | 98.75 |
| 561.16 | 99 |
| 561.23 | 99 |
| 561.3 | 99.25 |
| 561.37 | 99.5 |
| 561.44 | 99.5 |
| 561.51 | 99.5 |
| 561.57 | 99.75 |
| 561.64 | 100 |
| 561.71 | 100 |
| 561.78 | 100 |
| 561.85 | 100 |
| 561.91 | 100.25 |
| 561.98 | 100.25 |
| 562.05 | 100.5 |
| 562.12 | 100.5 |
| 562.19 | 100.5 |
| 562.26 | 100.75 |
| 562.33 | 100.75 |
| 562.39 | 101 |
| 562.46 | 101 |
| 562.53 | 101 |
| 562.6 | 101 |
| 562.67 | 101 |
| 562.73 | 101 |
| 562.8 | 101.25 |
| 562.87 | 101.25 |
| 562.94 | 101.25 |
| 563.01 | 101.25 |
| 563.08 | 101.25 |
| 563.14 | 101.25 |
| 563.21 | 101 |
| 563.28 | 101 |
| 563.35 | 101 |
| 563.42 | 101 |
| 563.48 | 101 |
| 563.55 | 100.5 |
| 563.62 | 100.25 |
| 563.69 | 99.75 |
| 563.76 | 99.5 |
| 563.83 | 99.25 |
| 563.89 | 99 |
| 563.96 | 98.5 |
| 564.03 | 98 |
| 564.1 | 97.5 |
| 564.17 | 97.5 |
| 564.23 | 97 |
| 564.3 | 96.5 |
| 564.37 | 95.75 |
| 564.44 | 95.5 |
| 564.51 | 94.75 |
| 564.58 | 94.25 |
| 564.64 | 93.75 |
| 564.71 | 93 |
| 564.78 | 92.5 |
| 564.85 | 92 |
| 564.92 | 91.5 |
| 564.98 | 91.5 |
| 565.05 | 90.75 |
| 565.12 | 90.25 |
| 565.19 | 89.75 |
| 565.26 | 89.25 |
| 565.33 | 88.75 |
| 565.39 | 88.25 |
| 565.46 | 87.75 |
| 565.53 | 87.25 |
| 565.6 | 86.75 |
| 565.66 | 86.25 |
| 565.73 | 85.75 |
| 565.8 | 85.75 |
| 565.87 | 85.25 |
| 565.94 | 85 |
| 566.01 | 84.5 |
| 566.07 | 84.25 |
| 566.14 | 83.75 |
| 566.21 | 83.25 |
| 566.28 | 83 |
| 566.35 | 82.5 |
| 566.41 | 82.25 |
| 566.48 | 81.75 |
| 566.55 | 81.5 |
| 566.62 | 81.5 |
| 566.69 | 81 |
| 566.76 | 80.75 |
| 566.82 | 80.5 |
| 566.89 | 80 |
| 566.96 | 79.75 |
| 567.03 | 79.5 |
| 567.1 | 79 |
| 567.16 | 78.75 |
| 567.23 | 78.5 |
| 567.3 | 78 |
| 567.37 | 77.75 |
| 567.44 | 77.75 |
| 567.51 | 77.5 |
| 567.57 | 77.25 |
| 567.64 | 76.75 |
| 567.71 | 76.5 |
| 567.78 | 76.25 |
| 567.84 | 76 |
| 567.91 | 75.75 |
| 567.98 | 75.25 |
| 568.05 | 75 |
| 568.12 | 74.75 |
| 568.19 | 74.5 |
| 568.25 | 74.5 |
| 568.32 | 74.25 |
| 568.39 | 74 |
| 568.46 | 73.75 |
| 568.53 | 73.5 |
| 568.59 | 73.25 |
| 568.66 | 73 |
| 568.73 | 72.75 |
| 568.8 | 72.5 |
| 568.87 | 72.25 |
| 568.94 | 72 |
| 569.0 | 71.75 |
| 569.07 | 71.75 |
| 569.14 | 71.5 |
| 569.21 | 71.25 |
| 569.28 | 71.25 |
| 569.34 | 71 |
| 569.41 | 70.5 |
| 569.48 | 70.5 |
| 569.55 | 70.25 |
| 569.62 | 70 |
| 569.69 | 69.75 |
| 569.75 | 69.5 |
| 569.82 | 69.25 |
| 569.89 | 69.25 |
| 569.96 | 69 |
| 570.03 | 68.75 |
| 570.09 | 68.5 |
| 570.16 | 68.5 |
| 570.23 | 68.25 |
| 570.3 | 68 |
| 570.37 | 68.25 |
| 570.44 | 68.5 |
| 570.5 | 68.5 |
| 570.57 | 68.5 |
| 570.64 | 68.5 |
| 570.71 | 68.5 |
| 570.78 | 68.75 |
| 570.84 | 68.75 |
| 570.91 | 68.75 |
| 570.98 | 68.75 |
| 571.05 | 69 |
| 571.12 | 69 |
| 571.19 | 69.25 |
| 571.25 | 69.25 |
| 571.32 | 69.25 |
| 571.39 | 69.25 |
| 571.46 | 69.5 |
| 571.53 | 69.5 |
| 571.59 | 69.5 |
| 571.66 | 69.5 |
| 571.73 | 69.5 |
| 571.8 | 69.75 |
| 571.87 | 69.75 |
| 571.94 | 69.75 |
| 572.01 | 69.75 |
| 572.07 | 69.75 |
| 572.14 | 69.75 |
| 572.21 | 70 |
| 572.28 | 70 |
| 572.35 | 70 |
| 572.41 | 70 |
| 572.48 | 69.75 |
| 572.55 | 70 |
| 572.62 | 69.75 |
| 572.69 | 69.75 |
| 572.76 | 69.75 |
| 572.82 | 69.75 |
| 572.89 | 69.75 |
| 572.96 | 69.5 |
| 573.03 | 69.5 |
| 573.1 | 69.5 |
| 573.16 | 69.5 |
| 573.23 | 69.5 |
| 573.3 | 69.25 |
| 573.37 | 69.25 |
| 573.44 | 69.25 |
| 573.51 | 69.25 |
| 573.58 | 69.25 |
| 573.64 | 69 |
| 573.71 | 69 |
| 573.78 | 69 |
| 573.85 | 68.75 |
| 573.92 | 68.75 |
| 573.98 | 68.75 |
| 574.05 | 68.5 |
| 574.12 | 68.5 |
| 574.19 | 68.5 |
| 574.26 | 68.5 |
| 574.33 | 68.25 |
| 574.39 | 68.25 |
| 574.46 | 68.25 |
| 574.53 | 68 |
| 574.6 | 68 |
| 574.67 | 68 |
| 574.73 | 68 |
| 574.8 | 67.75 |
| 574.87 | 67.75 |
| 574.94 | 67.75 |
| 575.01 | 67.75 |
| 575.08 | 67.75 |
| 575.14 | 67.5 |
| 575.21 | 67.5 |
| 575.28 | 67.25 |
| 575.35 | 67.25 |
| 575.42 | 67.25 |
| 575.48 | 67.25 |
| 575.55 | 67.5 |
| 575.62 | 67.75 |
| 575.69 | 67.75 |
| 575.76 | 68 |
| 575.83 | 68.25 |
| 575.9 | 68.75 |
| 575.96 | 69.25 |
| 576.03 | 69.5 |
| 576.1 | 70 |
| 576.17 | 70.5 |
| 576.23 | 70.75 |
| 576.3 | 71 |
| 576.37 | 71.25 |
| 576.44 | 71.5 |
| 576.51 | 71.5 |
| 576.58 | 72 |
| 576.65 | 72.25 |
| 576.71 | 72.5 |
| 576.78 | 73 |
| 576.85 | 73.25 |
| 576.92 | 73.5 |
| 576.99 | 73.75 |
| 577.05 | 74.25 |
| 577.12 | 74.25 |
| 577.19 | 74.75 |
| 577.26 | 75 |
| 577.33 | 75 |
| 577.39 | 75.25 |
| 577.46 | 75.75 |
| 577.53 | 76 |
| 577.6 | 76.25 |
| 577.67 | 76.5 |
| 577.73 | 77 |
| 577.8 | 77 |
| 577.87 | 77.25 |
| 577.94 | 77.5 |
| 578.01 | 78 |
| 578.08 | 78.25 |
| 578.15 | 78.25 |
| 578.21 | 78.5 |
| 578.28 | 78.75 |
| 578.35 | 79 |
| 578.42 | 79.25 |
| 578.49 | 79.5 |
| 578.55 | 80 |
| 578.62 | 80.25 |
| 578.69 | 80.5 |
| 578.76 | 80.75 |
| 578.83 | 80.75 |
| 578.89 | 81.25 |
| 578.96 | 81.25 |
| 579.03 | 81.5 |
| 579.1 | 81.75 |
| 579.17 | 82 |
| 579.23 | 82.25 |
| 579.3 | 82.5 |
| 579.37 | 82.5 |
| 579.44 | 83 |
| 579.51 | 83 |
| 579.58 | 83.25 |
| 579.64 | 83.5 |
| 579.71 | 84 |
| 579.78 | 84 |
| 579.85 | 84 |
| 579.92 | 84.25 |
| 579.98 | 84.5 |
| 580.05 | 84.75 |
| 580.12 | 85 |
| 580.19 | 85.25 |
| 580.26 | 85.25 |
| 580.33 | 85.5 |
| 580.4 | 85.75 |
| 580.46 | 86 |
| 580.53 | 86.25 |
| 580.6 | 86.25 |
| 580.67 | 86.5 |
| 580.74 | 86.75 |
| 580.8 | 86.75 |
| 580.87 | 87 |
| 580.94 | 87.25 |
| 581.01 | 87.5 |
| 581.08 | 87.75 |
| 581.14 | 87.75 |
| 581.21 | 88 |
| 581.28 | 88.25 |
| 581.35 | 88.5 |
| 581.42 | 88.5 |
| 581.48 | 88.75 |
| 581.55 | 89 |
| 581.62 | 89 |
| 581.69 | 89.25 |
| 581.76 | 89.5 |
| 581.83 | 89.75 |
| 581.89 | 90 |
| 581.96 | 90 |
| 582.03 | 90.25 |
| 582.1 | 90.5 |
| 582.17 | 90.5 |
| 582.23 | 90.5 |
| 582.3 | 90.75 |
| 582.37 | 91 |
| 582.44 | 91 |
| 582.51 | 91.25 |
| 582.58 | 91.5 |
| 582.64 | 91.75 |
| 582.71 | 91.75 |
| 582.78 | 92 |
| 582.85 | 92.25 |
| 582.92 | 92.5 |
| 582.98 | 92.5 |
| 583.05 | 92.5 |
| 583.12 | 92.75 |
| 583.19 | 93 |
| 583.26 | 93 |
| 583.33 | 93.25 |
| 583.39 | 93.5 |
| 583.46 | 93.5 |
| 583.53 | 93.75 |
| 583.6 | 93.75 |
| 583.67 | 94 |
| 583.73 | 94.25 |
| 583.8 | 94.25 |
| 583.87 | 94.25 |
| 583.94 | 94.5 |
| 584.01 | 94.75 |
| 584.08 | 94.75 |
| 584.14 | 95 |
| 584.21 | 95.25 |
| 584.28 | 95.5 |
| 584.35 | 95.5 |
| 584.42 | 95.75 |
| 584.48 | 95.75 |
| 584.55 | 96 |
| 584.62 | 96.25 |
| 584.69 | 96.25 |
| 584.76 | 96.25 |
| 584.83 | 96.25 |
| 584.89 | 96.5 |
| 584.96 | 96.75 |
| 585.03 | 97 |
| 585.1 | 97 |
| 585.17 | 97 |
| 585.23 | 97.25 |
| 585.3 | 97.5 |
| 585.37 | 97.5 |
| 585.44 | 97.75 |
| 585.51 | 97.75 |
| 585.58 | 97.75 |
| 585.64 | 98 |
| 585.71 | 98 |
| 585.78 | 98.25 |
| 585.85 | 98.25 |
| 585.92 | 98.5 |
| 585.98 | 98.5 |
| 586.05 | 98.75 |
| 586.12 | 99 |
| 586.19 | 99 |
| 586.26 | 99.25 |
| 586.33 | 99.25 |
| 586.39 | 99.25 |
| 586.46 | 99.5 |
| 586.53 | 99.5 |
| 586.6 | 99.5 |
| 586.67 | 99.75 |
| 586.73 | 100 |
| 586.8 | 100 |
| 586.87 | 100 |
| 586.94 | 100.25 |
| 587.01 | 100.25 |
| 587.08 | 100.25 |
| 587.15 | 100.25 |
| 587.21 | 100.25 |
| 587.28 | 100.5 |
| 587.35 | 100.5 |
| 587.42 | 100.5 |
| 587.49 | 100.5 |
| 587.55 | 100.75 |
| 587.62 | 100.75 |
| 587.69 | 100.75 |
| 587.76 | 100.75 |
| 587.83 | 101 |
| 587.9 | 101 |
| 587.97 | 101 |
| 588.03 | 101 |
| 588.1 | 101 |
| 588.17 | 101 |
| 588.24 | 101 |
| 588.31 | 101 |
| 588.38 | 101 |
| 588.44 | 100.75 |
| 588.51 | 100 |
| 588.58 | 99.75 |
| 588.65 | 99.5 |
| 588.72 | 99.25 |
| 588.78 | 99.25 |
| 588.85 | 98.75 |
| 588.92 | 98.5 |
| 588.99 | 98 |
| 589.06 | 97.5 |
| 589.12 | 97 |
| 589.19 | 96.5 |
| 589.26 | 96 |
| 589.33 | 95.25 |
| 589.4 | 94.75 |
| 589.46 | 94.25 |
| 589.53 | 93.75 |
| 589.6 | 93.75 |
| 589.67 | 93.25 |
| 589.74 | 92.5 |
| 589.8 | 92 |
| 589.87 | 91.5 |
| 589.94 | 91 |
| 590.01 | 90.5 |
| 590.08 | 89.75 |
| 590.15 | 89.25 |
| 590.21 | 88.75 |
| 590.28 | 88.25 |
| 590.35 | 87.75 |
| 590.42 | 87.75 |
| 590.49 | 87.25 |
| 590.55 | 86.75 |
| 590.62 | 86.25 |
| 590.69 | 86 |
| 590.76 | 85.25 |
| 590.83 | 85 |
| 590.9 | 84.5 |
| 590.96 | 84 |
| 591.03 | 83.75 |
| 591.1 | 83.25 |
| 591.17 | 83 |
| 591.24 | 83 |
| 591.3 | 82.5 |
| 591.37 | 82 |
| 591.44 | 81.75 |
| 591.51 | 81.5 |
| 591.58 | 81 |
| 591.64 | 80.75 |
| 591.71 | 80.25 |
| 591.78 | 80 |
| 591.85 | 79.75 |
| 591.92 | 79.25 |
| 591.98 | 79 |
| 592.05 | 79 |
| 592.12 | 78.75 |
| 592.19 | 78.25 |
| 592.26 | 78 |
| 592.33 | 77.75 |
| 592.39 | 77.25 |
| 592.46 | 77 |
| 592.53 | 76.75 |
| 592.6 | 76.5 |
| 592.67 | 76.25 |
| 592.73 | 76 |
| 592.8 | 75.75 |
| 592.87 | 75.75 |
| 592.94 | 75.25 |
| 593.01 | 75 |
| 593.08 | 74.75 |
| 593.14 | 74.5 |
| 593.21 | 74.25 |
| 593.28 | 74 |
| 593.35 | 73.75 |
| 593.42 | 73.5 |
| 593.48 | 73.25 |
| 593.55 | 73 |
| 593.62 | 73 |
| 593.69 | 72.75 |
| 593.76 | 72.5 |
| 593.82 | 72 |
| 593.89 | 71.75 |
| 593.96 | 71.75 |
| 594.03 | 71.25 |
| 594.1 | 71.25 |
| 594.16 | 71 |
| 594.23 | 70.75 |
| 594.3 | 70.5 |
| 594.37 | 70.25 |
| 594.44 | 70.25 |
| 594.51 | 70 |
| 594.57 | 69.75 |
| 594.64 | 69.5 |
| 594.71 | 69.25 |
| 594.78 | 69 |
| 594.85 | 69 |
| 594.91 | 68.75 |
| 594.98 | 68.5 |
| 595.05 | 68.25 |
| 595.12 | 68 |
| 595.19 | 68.25 |
| 595.26 | 68.25 |
| 595.32 | 68.25 |
| 595.39 | 68.5 |
| 595.46 | 68.5 |
| 595.53 | 68.75 |
| 595.6 | 68.75 |
| 595.66 | 69 |
| 595.73 | 69 |
| 595.8 | 69.25 |
| 595.87 | 69.25 |
| 595.94 | 69.25 |
| 596.01 | 69.5 |
| 596.08 | 69.5 |
| 596.14 | 69.5 |
| 596.21 | 69.75 |
| 596.28 | 69.75 |
| 596.35 | 70 |
| 596.42 | 70 |
| 596.48 | 70.25 |
| 596.55 | 70.25 |
| 596.62 | 70.25 |
| 596.69 | 70.25 |
| 596.76 | 70.5 |
| 596.83 | 70.5 |
| 596.89 | 70.5 |
| 596.96 | 70.5 |
| 597.03 | 70.5 |
| 597.1 | 70.5 |
| 597.17 | 70.5 |
| 597.23 | 70.5 |
| 597.3 | 70.5 |
| 597.37 | 70.5 |
| 597.44 | 70.25 |
| 597.51 | 70.25 |
| 597.58 | 70.25 |
| 597.65 | 70.25 |
| 597.71 | 70 |
| 597.78 | 70 |
| 597.85 | 70 |
| 597.92 | 69.75 |
| 597.99 | 69.75 |
| 598.05 | 69.75 |
| 598.12 | 69.5 |
| 598.19 | 69.5 |
| 598.26 | 69.5 |
| 598.33 | 69.5 |
| 598.4 | 69.25 |
| 598.46 | 69.25 |
| 598.53 | 69.25 |
| 598.6 | 69.25 |
| 598.67 | 69 |
| 598.74 | 69 |
| 598.8 | 69 |
| 598.87 | 68.75 |
| 598.94 | 68.75 |
| 599.01 | 68.75 |
| 599.08 | 68.75 |
| 599.15 | 68.5 |
| 599.22 | 68.5 |
| 599.28 | 68.25 |
| 599.35 | 68.25 |
| 599.42 | 68.25 |
| 599.49 | 68.25 |
| 599.56 | 68.25 |
| 599.62 | 68.25 |
| 599.69 | 68 |
| 599.76 | 68 |
| 599.83 | 68 |
| 599.9 | 67.75 |
| 599.97 | 67.75 |
| 600.03 | 67.75 |
| 600.1 | 67.5 |
| 600.17 | 67.5 |
| 600.24 | 67.5 |
| 600.31 | 67.5 |
| 600.38 | 67.75 |
| 600.44 | 67.75 |
| 600.51 | 68 |
| 600.58 | 68.25 |
| 600.65 | 68.75 |
| 600.72 | 69.25 |
| 600.78 | 69.75 |
| 600.85 | 70.25 |
| 600.92 | 70.5 |
| 600.99 | 70.75 |
| 601.06 | 70.75 |
| 601.12 | 71.25 |
| 601.19 | 71.5 |
| 601.26 | 71.75 |
| 601.33 | 72 |
| 601.4 | 72.25 |
| 601.47 | 72.75 |
| 601.53 | 73 |
| 601.6 | 73.25 |
| 601.67 | 73.75 |
| 601.74 | 74 |
| 601.81 | 74.25 |
| 601.87 | 74.25 |
| 601.94 | 74.5 |
| 602.01 | 75 |
| 602.08 | 75.25 |
| 602.15 | 75.5 |
| 602.22 | 75.75 |
| 602.28 | 76.25 |
| 602.35 | 76.5 |
| 602.42 | 76.75 |
| 602.49 | 77 |
| 602.56 | 77.25 |
| 602.63 | 77.5 |
| 602.69 | 77.5 |
| 602.76 | 78 |
| 602.83 | 78.25 |
| 602.9 | 78.5 |
| 602.97 | 78.75 |
| 603.03 | 79 |
| 603.1 | 79.5 |
| 603.17 | 79.5 |
| 603.24 | 80 |
| 603.3 | 80 |
| 603.37 | 80.5 |
| 603.44 | 80.75 |
| 603.51 | 80.75 |
| 603.58 | 81 |
| 603.65 | 81.25 |
| 603.72 | 81.5 |
| 603.78 | 81.75 |
| 603.85 | 82 |
| 603.92 | 82.25 |
| 603.99 | 82.5 |
| 604.06 | 82.75 |
| 604.12 | 83 |
| 604.19 | 83.25 |
| 604.26 | 83.5 |
| 604.33 | 83.5 |
| 604.4 | 83.75 |
| 604.47 | 84 |
| 604.53 | 84.25 |
| 604.6 | 84.5 |
| 604.67 | 84.75 |
| 604.74 | 84.75 |
| 604.81 | 85 |
| 604.87 | 85.25 |
| 604.94 | 85.5 |
| 605.01 | 85.75 |
| 605.08 | 86 |
| 605.15 | 86 |
| 605.22 | 86.25 |
| 605.28 | 86.25 |
| 605.35 | 86.5 |
| 605.42 | 86.75 |
| 605.49 | 87 |
| 605.56 | 87.25 |
| 605.62 | 87.5 |
| 605.69 | 87.75 |
| 605.76 | 87.75 |
| 605.83 | 88 |
| 605.9 | 88.25 |
| 605.97 | 88.25 |
| 606.03 | 88.5 |
| 606.1 | 88.75 |
| 606.17 | 88.75 |
| 606.24 | 89 |
| 606.31 | 89.25 |
| 606.37 | 89.5 |
| 606.44 | 89.75 |
| 606.51 | 89.75 |
| 606.58 | 90 |
| 606.65 | 90.25 |
| 606.71 | 90.5 |
| 606.78 | 90.5 |
| 606.85 | 90.5 |
| 606.92 | 90.75 |
| 606.99 | 91 |
| 607.05 | 91 |
| 607.12 | 91.25 |
| 607.19 | 91.5 |
| 607.26 | 91.75 |
| 607.33 | 91.75 |
| 607.4 | 92 |
| 607.47 | 92.25 |
| 607.53 | 92.25 |
| 607.6 | 92.25 |
| 607.67 | 92.5 |
| 607.74 | 92.75 |
| 607.81 | 93 |
| 607.87 | 93 |
| 607.94 | 93.25 |
| 608.01 | 93.5 |
| 608.08 | 93.5 |
| 608.15 | 93.75 |
| 608.22 | 93.75 |
| 608.28 | 94 |
| 608.35 | 94.25 |
| 608.42 | 94.25 |
| 608.49 | 94.5 |
| 608.56 | 94.5 |
| 608.62 | 94.75 |
| 608.69 | 95 |
| 608.76 | 95 |
| 608.83 | 95.25 |
| 608.9 | 95.25 |
| 608.97 | 95.5 |
| 609.03 | 95.75 |
| 609.1 | 95.75 |
| 609.17 | 96 |
| 609.24 | 96 |
| 609.3 | 96 |
| 609.37 | 96.25 |
| 609.44 | 96.5 |
| 609.51 | 96.5 |
| 609.58 | 96.75 |
| 609.65 | 97 |
| 609.72 | 97 |
| 609.78 | 97.25 |
| 609.85 | 97.25 |
| 609.92 | 97.5 |
| 609.99 | 97.75 |
| 610.06 | 97.75 |
| 610.12 | 97.75 |
| 610.19 | 98 |
| 610.26 | 98 |
| 610.33 | 98.25 |
| 610.4 | 98.5 |
| 610.46 | 98.5 |
| 610.53 | 98.75 |
| 610.6 | 98.75 |
| 610.67 | 99 |
| 610.74 | 99 |
| 610.8 | 99.25 |
| 610.87 | 99.25 |
| 610.94 | 99.5 |
| 611.01 | 99.5 |
| 611.08 | 99.75 |
| 611.15 | 99.75 |
| 611.22 | 100 |
| 611.28 | 100 |
| 611.35 | 100 |
| 611.42 | 100.25 |
| 611.49 | 100.25 |
| 611.56 | 100.5 |
| 611.62 | 100.5 |
| 611.69 | 100.5 |
| 611.76 | 100.75 |
| 611.83 | 100.75 |
| 611.9 | 101 |
| 611.97 | 101 |
| 612.03 | 101 |
| 612.1 | 101 |
| 612.17 | 101.25 |
| 612.24 | 101.25 |
| 612.31 | 101.25 |
| 612.38 | 101.25 |
| 612.44 | 101.25 |
| 612.51 | 101.25 |
| 612.58 | 101.25 |
| 612.65 | 101.25 |
| 612.72 | 101 |
| 612.79 | 101.25 |
| 612.85 | 101 |
| 612.92 | 101 |
| 612.99 | 100.5 |
| 613.06 | 100 |
| 613.13 | 99.75 |
| 613.19 | 99.5 |
| 613.26 | 99.25 |
| 613.33 | 99.25 |
| 613.4 | 98.75 |
| 613.47 | 98.25 |
| 613.53 | 97.75 |
| 613.6 | 97.5 |
| 613.67 | 97 |
| 613.74 | 96.5 |
| 613.81 | 95.75 |
| 613.88 | 95.5 |
| 613.94 | 94.75 |
| 614.01 | 94.25 |
| 614.08 | 93.75 |
| 614.15 | 93.75 |
| 614.22 | 93.25 |
| 614.28 | 92.5 |
| 614.35 | 92 |
| 614.42 | 91.5 |
| 614.49 | 91 |
| 614.56 | 90.5 |
| 614.63 | 90 |
| 614.69 | 89.5 |
| 614.76 | 88.75 |
| 614.83 | 88.25 |
| 614.9 | 88 |
| 614.97 | 88 |
| 615.03 | 87.5 |
| 615.1 | 87 |
| 615.17 | 86.5 |
| 615.24 | 86 |
| 615.31 | 85.5 |
| 615.37 | 85 |
| 615.44 | 84.75 |
| 615.51 | 84.25 |
| 615.58 | 83.75 |
| 615.65 | 83.5 |
| 615.72 | 83 |
| 615.78 | 83 |
| 615.85 | 82.5 |
| 615.92 | 82.25 |
| 615.99 | 81.75 |
| 616.06 | 81.5 |
| 616.12 | 81 |
| 616.19 | 80.75 |
| 616.26 | 80.25 |
| 616.33 | 80 |
| 616.4 | 79.75 |
| 616.47 | 79.25 |
| 616.53 | 79 |
| 616.6 | 79 |
| 616.67 | 78.5 |
| 616.74 | 78.25 |
| 616.8 | 78 |
| 616.87 | 77.5 |
| 616.94 | 77.25 |
| 617.01 | 77 |
| 617.08 | 76.75 |
| 617.15 | 76.5 |
| 617.21 | 76.25 |
| 617.28 | 75.75 |
| 617.35 | 75.5 |
| 617.42 | 75.5 |
| 617.49 | 75.25 |
| 617.55 | 75 |
| 617.62 | 74.75 |
| 617.69 | 74.5 |
| 617.76 | 74.25 |
| 617.83 | 74 |
| 617.9 | 73.75 |
| 617.96 | 73.25 |
| 618.03 | 73 |
| 618.1 | 72.75 |
| 618.17 | 72.5 |
| 618.23 | 72.5 |
| 618.3 | 72.25 |
| 618.37 | 72 |
| 618.44 | 72 |
| 618.51 | 71.5 |
| 618.58 | 71.5 |
| 618.65 | 71 |
| 618.71 | 71 |
| 618.78 | 70.75 |
| 618.85 | 70.5 |
| 618.92 | 70.25 |
| 618.98 | 70 |
| 619.05 | 70 |
| 619.12 | 69.75 |
| 619.19 | 69.5 |
| 619.26 | 69.25 |
| 619.33 | 69 |
| 619.39 | 68.75 |
| 619.46 | 68.5 |
| 619.53 | 68.5 |
| 619.6 | 68.25 |
| 619.67 | 68.25 |
| 619.74 | 68.5 |
| 619.8 | 68.5 |
| 619.87 | 68.5 |
| 619.94 | 68.75 |
| 620.01 | 68.75 |
| 620.08 | 68.75 |
| 620.15 | 68.75 |
| 620.21 | 69 |
| 620.28 | 69 |
| 620.35 | 69.25 |
| 620.42 | 69.25 |
| 620.49 | 69.25 |
| 620.55 | 69.25 |
| 620.62 | 69.25 |
| 620.69 | 69.25 |
| 620.76 | 69.5 |
| 620.83 | 69.75 |
| 620.9 | 69.5 |
| 620.96 | 69.75 |
| 621.03 | 69.75 |
| 621.1 | 69.75 |
| 621.17 | 69.75 |
| 621.24 | 70 |
| 621.3 | 70 |
| 621.37 | 70 |
| 621.44 | 70 |
| 621.51 | 70 |
| 621.58 | 70.25 |
| 621.65 | 70.25 |
| 621.72 | 70 |
| 621.78 | 70.25 |
| 621.85 | 70.25 |
| 621.92 | 70 |
| 621.99 | 70 |
| 622.06 | 70 |
| 622.13 | 70 |
| 622.19 | 69.75 |
| 622.26 | 69.75 |
| 622.33 | 69.75 |
| 622.4 | 69.75 |
| 622.47 | 69.75 |
| 622.53 | 69.5 |
| 622.6 | 69.5 |
| 622.67 | 69.25 |
| 622.74 | 69.25 |
| 622.81 | 69.25 |
| 622.88 | 69.25 |
| 622.94 | 69 |
| 623.01 | 69 |
| 623.08 | 69 |
| 623.15 | 69 |
| 623.22 | 69 |
| 623.28 | 68.75 |
| 623.35 | 68.75 |
| 623.42 | 68.75 |
| 623.49 | 68.5 |
| 623.56 | 68.5 |
| 623.63 | 68.5 |
| 623.69 | 68.25 |
| 623.76 | 68.25 |
| 623.83 | 68.25 |
| 623.9 | 68.25 |
| 623.97 | 68.25 |
| 624.03 | 68.25 |
| 624.1 | 68 |
| 624.17 | 68 |
| 624.24 | 68 |
| 624.31 | 67.75 |
| 624.38 | 67.75 |
| 624.45 | 67.75 |
| 624.51 | 67.5 |
| 624.58 | 67.5 |
| 624.65 | 67.5 |
| 624.72 | 67.5 |
| 624.79 | 67.5 |
| 624.85 | 67.5 |
| 624.92 | 67.5 |
| 624.99 | 67.75 |
| 625.06 | 67.75 |
| 625.13 | 68.25 |
| 625.2 | 68.5 |
| 625.26 | 69 |
| 625.33 | 69.5 |
| 625.4 | 70 |
| 625.47 | 70.5 |
| 625.54 | 70.75 |
| 625.6 | 71 |
| 625.67 | 71 |
| 625.74 | 71.5 |
| 625.81 | 71.5 |
| 625.88 | 72 |
| 625.95 | 72.25 |
| 626.01 | 72.75 |
| 626.08 | 73 |
| 626.15 | 73.25 |
| 626.22 | 73.75 |
| 626.29 | 74 |
| 626.35 | 74.25 |
| 626.42 | 74.5 |
| 626.49 | 74.5 |
| 626.56 | 74.75 |
| 626.63 | 75.25 |
| 626.7 | 75.5 |
| 626.76 | 75.75 |
| 626.83 | 76 |
| 626.9 | 76.5 |
| 626.97 | 76.75 |
| 627.04 | 77 |
| 627.1 | 77.25 |
| 627.17 | 77.5 |
| 627.24 | 77.75 |
| 627.31 | 77.75 |
| 627.38 | 78.25 |
| 627.44 | 78.5 |
| 627.51 | 78.75 |
| 627.58 | 79 |
| 627.65 | 79.25 |
| 627.72 | 79.5 |
| 627.78 | 79.75 |
| 627.85 | 80 |
| 627.92 | 80.25 |
| 627.99 | 80.5 |
| 628.06 | 80.75 |
| 628.13 | 80.75 |
| 628.2 | 81.25 |
| 628.26 | 81.5 |
| 628.33 | 81.75 |
| 628.4 | 81.75 |
| 628.47 | 82.25 |
| 628.54 | 82.25 |
| 628.6 | 82.75 |
| 628.67 | 82.75 |
| 628.74 | 83 |
| 628.81 | 83.25 |
| 628.88 | 83.5 |
| 628.94 | 83.5 |
| 629.01 | 83.75 |
| 629.08 | 84 |
| 629.15 | 84.25 |
| 629.22 | 84.5 |
| 629.28 | 84.75 |
| 629.35 | 85 |
| 629.42 | 85.25 |
| 629.49 | 85.25 |
| 629.56 | 85.5 |
| 629.63 | 85.75 |
| 629.69 | 86 |
| 629.76 | 86 |
| 629.83 | 86.25 |
| 629.9 | 86.5 |
| 629.97 | 86.5 |
| 630.03 | 86.75 |
| 630.1 | 87 |
| 630.17 | 87.25 |
| 630.24 | 87.5 |
| 630.31 | 87.75 |
| 630.38 | 88 |
| 630.45 | 88 |
| 630.51 | 88.25 |
| 630.58 | 88.25 |
| 630.65 | 88.5 |
| 630.72 | 88.5 |
| 630.79 | 88.75 |
| 630.85 | 89 |
| 630.92 | 89.25 |
| 630.99 | 89.5 |
| 631.06 | 89.5 |
| 631.13 | 89.75 |
| 631.19 | 90 |
| 631.26 | 90.25 |
| 631.33 | 90.25 |
| 631.4 | 90.25 |
| 631.47 | 90.5 |
| 631.53 | 90.75 |
| 631.6 | 91 |
| 631.67 | 91 |
| 631.74 | 91.25 |
| 631.81 | 91.5 |
| 631.88 | 91.5 |
| 631.95 | 91.75 |
| 632.01 | 92 |
| 632.08 | 92.25 |
| 632.15 | 92.5 |
| 632.22 | 92.5 |
| 632.28 | 92.5 |
| 632.35 | 92.75 |
| 632.42 | 93 |
| 632.49 | 93 |
| 632.56 | 93.25 |
| 632.63 | 93.5 |
| 632.69 | 93.5 |
| 632.76 | 93.75 |
| 632.83 | 94 |
| 632.9 | 94 |
| 632.97 | 94.25 |
| 633.03 | 94.25 |
| 633.1 | 94.25 |
| 633.17 | 94.5 |
| 633.24 | 94.5 |
| 633.31 | 94.75 |
| 633.38 | 95 |
| 633.45 | 95.25 |
| 633.51 | 95.25 |
| 633.58 | 95.5 |
| 633.65 | 95.5 |
| 633.72 | 95.75 |
| 633.78 | 95.75 |
| 633.85 | 95.75 |
| 633.92 | 96 |
| 633.99 | 96.25 |
| 634.06 | 96.25 |
| 634.13 | 96.5 |
| 634.19 | 96.75 |
| 634.26 | 96.75 |
| 634.33 | 97 |
| 634.4 | 97 |
| 634.47 | 97.25 |
| 634.53 | 97.25 |
| 634.6 | 97.25 |
| 634.67 | 97.25 |
| 634.74 | 97.5 |
| 634.81 | 97.75 |
| 634.88 | 97.75 |
| 634.95 | 98 |
| 635.01 | 98 |
| 635.08 | 98.25 |
| 635.15 | 98.25 |
| 635.22 | 98.5 |
| 635.28 | 98.5 |
| 635.35 | 98.75 |
| 635.42 | 99 |
| 635.49 | 99 |
| 635.56 | 99 |
| 635.63 | 99.25 |
| 635.7 | 99.25 |
| 635.76 | 99.5 |
| 635.83 | 99.5 |
| 635.9 | 99.75 |
| 635.97 | 99.75 |
| 636.04 | 99.75 |
| 636.1 | 100 |
| 636.17 | 100 |
| 636.24 | 100.25 |
| 636.31 | 100.25 |
| 636.38 | 100.25 |
| 636.45 | 100.5 |
| 636.51 | 100.5 |
| 636.58 | 100.5 |
| 636.65 | 100.75 |
| 636.72 | 100.75 |
| 636.79 | 100.75 |
| 636.86 | 101 |
| 636.92 | 101 |
| 636.99 | 101 |
| 637.06 | 101.25 |
| 637.13 | 101.25 |
| 637.2 | 101.25 |
| 637.27 | 101.25 |
| 637.33 | 101.25 |
| 637.4 | 101.25 |
| 637.47 | 101.25 |
| 637.54 | 101 |
| 637.61 | 101 |
| 637.67 | 100.75 |
| 637.74 | 100.25 |
| 637.81 | 100 |
| 637.88 | 99.75 |
| 637.95 | 99.75 |
| 638.02 | 99.25 |
| 638.08 | 99 |
| 638.15 | 98.5 |
| 638.22 | 98 |
| 638.29 | 97.75 |
| 638.36 | 97.25 |
| 638.42 | 96.75 |
| 638.49 | 96.25 |
| 638.56 | 95.75 |
| 638.63 | 95 |
| 638.7 | 94.5 |
| 638.77 | 94.5 |
| 638.83 | 94 |
| 638.9 | 93.5 |
| 638.97 | 93 |
| 639.04 | 92.25 |
| 639.11 | 91.75 |
| 639.17 | 91.25 |
| 639.24 | 90.75 |
| 639.31 | 90 |
| 639.38 | 89.75 |
| 639.45 | 89 |
| 639.51 | 88.5 |
| 639.58 | 88.5 |
| 639.65 | 88 |
| 639.72 | 87.75 |
| 639.79 | 87.25 |
| 639.85 | 86.75 |
| 639.92 | 86.25 |
| 639.99 | 85.75 |
| 640.06 | 85.25 |
| 640.13 | 84.75 |
| 640.2 | 84.5 |
| 640.26 | 84 |
| 640.33 | 83.75 |
| 640.4 | 83.75 |
| 640.47 | 83.25 |
| 640.54 | 82.75 |
| 640.6 | 82.5 |
| 640.67 | 82 |
| 640.74 | 81.75 |
| 640.81 | 81.25 |
| 640.88 | 81 |
| 640.95 | 80.5 |
| 641.01 | 80.25 |
| 641.08 | 80 |
| 641.15 | 79.5 |
| 641.22 | 79.5 |
| 641.29 | 79.25 |
| 641.35 | 78.75 |
| 641.42 | 78.5 |
| 641.49 | 78.25 |
| 641.56 | 77.75 |
| 641.63 | 77.5 |
| 641.69 | 77.25 |
| 641.76 | 77 |
| 641.83 | 76.75 |
| 641.9 | 76.5 |
| 641.97 | 76.25 |
| 642.03 | 76.25 |
| 642.1 | 75.75 |
| 642.17 | 75.5 |
| 642.24 | 75.25 |
| 642.31 | 74.75 |
| 642.38 | 74.75 |
| 642.44 | 74.5 |
| 642.51 | 74.25 |
| 642.58 | 74 |
| 642.65 | 73.75 |
| 642.72 | 73.25 |
| 642.78 | 73 |
| 642.85 | 73 |
| 642.92 | 72.75 |
| 642.99 | 72.5 |
| 643.06 | 72.25 |
| 643.13 | 72.25 |
| 643.19 | 71.75 |
| 643.26 | 71.5 |
| 643.33 | 71.5 |
| 643.4 | 71.25 |
| 643.47 | 70.75 |
| 643.53 | 70.75 |
| 643.6 | 70.75 |
| 643.67 | 70.5 |
| 643.74 | 70.25 |
| 643.81 | 70 |
| 643.87 | 69.75 |
| 643.94 | 69.5 |
| 644.01 | 69.25 |
| 644.08 | 69 |
| 644.15 | 69 |
| 644.22 | 68.75 |
| 644.28 | 68.5 |
| 644.35 | 68.25 |
| 644.42 | 68.25 |
| 644.49 | 68 |
| 644.56 | 68.25 |
| 644.63 | 68.5 |
| 644.69 | 68.5 |
| 644.76 | 68.5 |
| 644.83 | 68.75 |
| 644.9 | 68.75 |
| 644.97 | 68.75 |
| 645.03 | 69 |
| 645.1 | 69 |
| 645.17 | 69.25 |
| 645.24 | 69.25 |
| 645.31 | 69.25 |
| 645.38 | 69.5 |
| 645.44 | 69.5 |
| 645.51 | 69.5 |
| 645.58 | 69.75 |
| 645.65 | 69.75 |
| 645.72 | 69.75 |
| 645.78 | 70 |
| 645.85 | 70 |
| 645.92 | 70.25 |
| 645.99 | 70.25 |
| 646.06 | 70.25 |
| 646.13 | 70.25 |
| 646.2 | 70.25 |
| 646.26 | 70.25 |
| 646.33 | 70.25 |
| 646.4 | 70.5 |
| 646.47 | 70.5 |
| 646.54 | 70.25 |
| 646.6 | 70.25 |
| 646.67 | 70.25 |
| 646.74 | 70.25 |
| 646.81 | 70.25 |
| 646.88 | 70.25 |
| 646.95 | 70.25 |
| 647.01 | 70.25 |
| 647.08 | 70 |
| 647.15 | 70 |
| 647.22 | 69.75 |
| 647.29 | 69.75 |
| 647.35 | 69.75 |
| 647.42 | 69.75 |
| 647.49 | 69.5 |
| 647.56 | 69.5 |
| 647.63 | 69.5 |
| 647.7 | 69.25 |
| 647.76 | 69.25 |
| 647.83 | 69.25 |
| 647.9 | 69.25 |
| 647.97 | 69.25 |
| 648.04 | 69 |
| 648.1 | 69 |
| 648.17 | 69 |
| 648.24 | 68.75 |
| 648.31 | 68.75 |
| 648.38 | 68.75 |
| 648.45 | 68.5 |
| 648.52 | 68.5 |
| 648.58 | 68.5 |
| 648.65 | 68.5 |
| 648.72 | 68.25 |
| 648.79 | 68.25 |
| 648.86 | 68.25 |
| 648.92 | 68.25 |
| 648.99 | 68.25 |
| 649.06 | 68 |
| 649.13 | 68 |
| 649.2 | 68 |
| 649.27 | 67.75 |
| 649.33 | 67.75 |
| 649.4 | 67.75 |
| 649.47 | 67.75 |
| 649.54 | 67.5 |
| 649.61 | 67.5 |
| 649.67 | 67.5 |
| 649.74 | 67.75 |
| 649.81 | 67.75 |
| 649.88 | 68 |
| 649.95 | 68.25 |
| 650.02 | 68.75 |
| 650.08 | 69.25 |
| 650.15 | 69.5 |
| 650.22 | 69.5 |
| 650.29 | 70 |
| 650.36 | 70.5 |
| 650.42 | 70.75 |
| 650.49 | 71 |
| 650.56 | 71.25 |
| 650.63 | 71.5 |
| 650.7 | 72 |
| 650.77 | 72.25 |
| 650.83 | 72.5 |
| 650.9 | 72.75 |
| 650.97 | 73.25 |
| 651.04 | 73.25 |
| 651.11 | 73.5 |
| 651.17 | 73.75 |
| 651.24 | 74 |
| 651.31 | 74.25 |
| 651.38 | 74.75 |
| 651.45 | 75 |
| 651.52 | 75.25 |
| 651.58 | 75.5 |
| 651.65 | 75.75 |
| 651.72 | 76 |
| 651.79 | 76.5 |
| 651.86 | 76.5 |
| 651.92 | 76.5 |
| 651.99 | 77 |
| 652.06 | 77.25 |
| 652.13 | 77.5 |
| 652.2 | 77.75 |
| 652.27 | 78 |
| 652.33 | 78.25 |
| 652.4 | 78.5 |
| 652.47 | 79 |
| 652.54 | 79 |
| 652.61 | 79.25 |
| 652.67 | 79.25 |
| 652.74 | 79.75 |
| 652.81 | 80 |
| 652.88 | 80.25 |
| 652.95 | 80.25 |
| 653.02 | 80.75 |
| 653.08 | 80.75 |
| 653.15 | 81.25 |
| 653.22 | 81.5 |
| 653.29 | 81.5 |
| 653.36 | 82 |
| 653.42 | 82 |
| 653.49 | 82 |
| 653.56 | 82.25 |
| 653.63 | 82.5 |
| 653.7 | 82.75 |
| 653.77 | 83 |
| 653.83 | 83.25 |
| 653.9 | 83.5 |
| 653.97 | 83.75 |
| 654.04 | 84 |
| 654.11 | 84.25 |
| 654.17 | 84.5 |
| 654.24 | 84.75 |
| 654.31 | 84.75 |
| 654.38 | 85 |
| 654.45 | 85 |
| 654.52 | 85.25 |
| 654.58 | 85.5 |
| 654.65 | 85.75 |
| 654.72 | 86 |
| 654.79 | 86.25 |
| 654.86 | 86.25 |
| 654.92 | 86.5 |
| 654.99 | 86.75 |
| 655.06 | 87 |
| 655.13 | 87 |
| 655.2 | 87 |
| 655.27 | 87.25 |
| 655.33 | 87.5 |
| 655.4 | 87.75 |
| 655.47 | 88 |
| 655.54 | 88 |
| 655.61 | 88.25 |
| 655.67 | 88.5 |
| 655.74 | 88.75 |
| 655.81 | 89 |
| 655.88 | 89 |
| 655.95 | 89 |
| 656.02 | 89.25 |
| 656.08 | 89.5 |
| 656.15 | 89.75 |
| 656.22 | 89.75 |
| 656.29 | 90 |
| 656.36 | 90.25 |
| 656.42 | 90.5 |
| 656.49 | 90.5 |
| 656.56 | 90.75 |
| 656.63 | 91 |
| 656.7 | 91 |
| 656.77 | 91 |
| 656.83 | 91.25 |
| 656.9 | 91.5 |
| 656.97 | 91.5 |
| 657.04 | 91.75 |
| 657.11 | 92 |
| 657.17 | 92 |
| 657.24 | 92.25 |
| 657.31 | 92.5 |
| 657.38 | 92.5 |
| 657.45 | 92.75 |
| 657.52 | 92.75 |
| 657.58 | 92.75 |
| 657.65 | 93 |
| 657.72 | 93.25 |
| 657.79 | 93.25 |
| 657.86 | 93.5 |
| 657.92 | 93.75 |
| 657.99 | 93.75 |
| 658.06 | 93.75 |
| 658.13 | 94 |
| 658.2 | 94.25 |
| 658.27 | 94.25 |
| 658.33 | 94.5 |
| 658.4 | 94.5 |
| 658.47 | 94.5 |
| 658.54 | 94.75 |
| 658.61 | 95 |
| 658.67 | 95 |
| 658.74 | 95.25 |
| 658.81 | 95.25 |
| 658.88 | 95.5 |
| 658.95 | 95.75 |
| 659.02 | 95.75 |
| 659.08 | 96 |
| 659.15 | 96 |
| 659.22 | 96 |
| 659.29 | 96.25 |
| 659.36 | 96.25 |
| 659.42 | 96.5 |
| 659.49 | 96.75 |
| 659.56 | 96.75 |
| 659.63 | 97 |
| 659.7 | 97 |
| 659.77 | 97.25 |
| 659.83 | 97.25 |
| 659.9 | 97.25 |
| 659.97 | 97.5 |
| 660.04 | 97.5 |
| 660.11 | 97.75 |
| 660.17 | 97.75 |
| 660.24 | 98 |
| 660.31 | 98 |
| 660.38 | 98.25 |
| 660.45 | 98.25 |
| 660.52 | 98.5 |
| 660.58 | 98.5 |
| 660.65 | 98.75 |
| 660.72 | 99 |
| 660.79 | 99 |
| 660.85 | 99 |
| 660.92 | 99.25 |
| 660.99 | 99.25 |
| 661.06 | 99.25 |
| 661.13 | 99.5 |
| 661.2 | 99.5 |
| 661.27 | 99.75 |
| 661.33 | 99.75 |
| 661.4 | 100 |
| 661.47 | 100 |
| 661.54 | 100 |
| 661.61 | 100.25 |
| 661.67 | 100.25 |
| 661.74 | 100.25 |
| 661.81 | 100.5 |
| 661.88 | 100.5 |
| 661.95 | 100.5 |
| 662.02 | 100.75 |
| 662.08 | 100.75 |
| 662.15 | 101 |
| 662.22 | 101 |
| 662.29 | 101 |
| 662.36 | 101 |
| 662.43 | 101 |
| 662.5 | 101 |
| 662.56 | 101 |
| 662.63 | 101 |
| 662.7 | 101 |
| 662.77 | 101.25 |
| 662.84 | 101.25 |
| 662.9 | 101 |
| 662.97 | 101 |
| 663.04 | 100.75 |
| 663.11 | 100.25 |
| 663.18 | 99.75 |
| 663.24 | 99.75 |
| 663.31 | 99.75 |
| 663.38 | 99.25 |
| 663.45 | 99 |
| 663.52 | 98.5 |
| 663.59 | 98.25 |
| 663.65 | 97.75 |
| 663.72 | 97.25 |
| 663.79 | 96.75 |
| 663.86 | 96.25 |
| 663.93 | 95.5 |
| 663.99 | 95 |
| 664.06 | 94.5 |
| 664.13 | 94.5 |
| 664.2 | 94 |
| 664.27 | 93.25 |
| 664.34 | 92.75 |
| 664.4 | 92.25 |
| 664.47 | 91.75 |
| 664.54 | 91 |
| 664.61 | 90.5 |
| 664.68 | 90 |
| 664.74 | 89.5 |
| 664.81 | 89 |
| 664.88 | 88.5 |
| 664.95 | 88.5 |
| 665.02 | 88 |
| 665.08 | 87.5 |
| 665.15 | 87.25 |
| 665.22 | 86.75 |
| 665.29 | 86.25 |
| 665.36 | 85.75 |
| 665.42 | 85.25 |
| 665.49 | 85 |
| 665.56 | 84.5 |
| 665.63 | 84 |
| 665.7 | 83.75 |
| 665.77 | 83.75 |
| 665.83 | 83.25 |
| 665.9 | 83 |
| 665.97 | 82.75 |
| 666.04 | 82.25 |
| 666.11 | 81.75 |
| 666.17 | 81.5 |
| 666.24 | 81.25 |
| 666.31 | 80.75 |
| 666.38 | 80.25 |
| 666.45 | 80 |
| 666.52 | 79.75 |
| 666.58 | 79.75 |
| 666.65 | 79.5 |
| 666.72 | 79 |
| 666.79 | 78.75 |
| 666.85 | 78.5 |
| 666.92 | 78 |
| 666.99 | 77.75 |
| 667.06 | 77.5 |
| 667.13 | 77.25 |
| 667.2 | 77 |
| 667.27 | 76.5 |
| 667.33 | 76.25 |
| 667.4 | 76.25 |
| 667.47 | 76 |
| 667.54 | 75.75 |
| 667.6 | 75.5 |
| 667.67 | 75.25 |
| 667.74 | 75 |
| 667.81 | 74.75 |
| 667.88 | 74.25 |
| 667.95 | 74.25 |
| 668.01 | 74 |
| 668.08 | 73.5 |
| 668.15 | 73.25 |
| 668.22 | 73.25 |
| 668.29 | 73 |
| 668.35 | 72.75 |
| 668.42 | 72.5 |
| 668.49 | 72.25 |
| 668.56 | 72 |
| 668.63 | 71.75 |
| 668.7 | 71.5 |
| 668.76 | 71.25 |
| 668.83 | 71 |
| 668.9 | 71 |
| 668.97 | 70.75 |
| 669.03 | 70.75 |
| 669.1 | 70.5 |
| 669.17 | 70.25 |
| 669.24 | 70 |
| 669.31 | 69.75 |
| 669.38 | 69.5 |
| 669.45 | 69.25 |
| 669.51 | 69 |
| 669.58 | 68.75 |
| 669.65 | 68.75 |
| 669.72 | 68.5 |
| 669.78 | 68.25 |
| 669.85 | 68.25 |
| 669.92 | 68 |
| 669.99 | 68.25 |
| 670.06 | 68.25 |
| 670.13 | 68.5 |
| 670.19 | 68.5 |
| 670.26 | 68.75 |
| 670.33 | 68.75 |
| 670.4 | 68.75 |
| 670.47 | 68.75 |
| 670.53 | 69 |
| 670.6 | 69 |
| 670.67 | 69 |
| 670.74 | 69.25 |
| 670.81 | 69.25 |
| 670.88 | 69.5 |
| 670.95 | 69.5 |
| 671.01 | 69.5 |
| 671.08 | 69.75 |
| 671.15 | 69.75 |
| 671.22 | 69.75 |
| 671.29 | 70 |
| 671.35 | 70.25 |
| 671.42 | 70.25 |
| 671.49 | 70.25 |
| 671.56 | 70.25 |
| 671.63 | 70.25 |
| 671.7 | 70.25 |
| 671.76 | 70.25 |
| 671.83 | 70.5 |
| 671.9 | 70.5 |
| 671.97 | 70.5 |
| 672.04 | 70.25 |
| 672.11 | 70.25 |
| 672.17 | 70.25 |
| 672.24 | 70.25 |
| 672.31 | 70.25 |
| 672.38 | 70.25 |
| 672.45 | 70.25 |
| 672.52 | 70.25 |
| 672.58 | 70 |
| 672.65 | 70 |
| 672.72 | 69.75 |
| 672.79 | 69.75 |
| 672.86 | 69.75 |
| 672.92 | 69.5 |
| 672.99 | 69.5 |
| 673.06 | 69.5 |
| 673.13 | 69.5 |
| 673.2 | 69.25 |
| 673.27 | 69.25 |
| 673.33 | 69.25 |
| 673.4 | 69.25 |
| 673.47 | 69 |
| 673.54 | 69 |
| 673.61 | 69 |
| 673.68 | 69 |
| 673.74 | 68.75 |
| 673.81 | 68.75 |
| 673.88 | 68.5 |
| 673.95 | 68.5 |
| 674.02 | 68.5 |
| 674.09 | 68.5 |
| 674.15 | 68.5 |
| 674.22 | 68.5 |
| 674.29 | 68.25 |
| 674.36 | 68.25 |
| 674.43 | 68.25 |
| 674.49 | 68.25 |
| 674.56 | 68 |
| 674.63 | 68 |
| 674.7 | 68 |
| 674.77 | 68 |
| 674.84 | 67.75 |
| 674.9 | 67.75 |
| 674.97 | 67.75 |
| 675.04 | 67.75 |
| 675.11 | 67.75 |
| 675.18 | 67.75 |
| 675.25 | 67.75 |
| 675.31 | 68.25 |
| 675.38 | 68.5 |
| 675.45 | 68.75 |
| 675.52 | 69.25 |
| 675.59 | 69.25 |
| 675.65 | 69.75 |
| 675.72 | 70.25 |
| 675.79 | 70.5 |
| 675.86 | 71 |
| 675.93 | 71.25 |
| 675.99 | 71.5 |
| 676.06 | 71.75 |
| 676.13 | 72.25 |
| 676.2 | 72.5 |
| 676.27 | 72.75 |
| 676.34 | 73 |
| 676.4 | 73 |
| 676.47 | 73.5 |
| 676.54 | 73.75 |
| 676.61 | 74 |
| 676.68 | 74.25 |
| 676.75 | 74.5 |
| 676.81 | 75 |
| 676.88 | 75.25 |
| 676.95 | 75.5 |
| 677.02 | 75.75 |
| 677.09 | 76 |
| 677.15 | 76.5 |
| 677.22 | 76.5 |
| 677.29 | 76.5 |
| 677.36 | 77 |
| 677.43 | 77.25 |
| 677.49 | 77.5 |
| 677.56 | 77.75 |
| 677.63 | 78 |
| 677.7 | 78.25 |
| 677.77 | 78.5 |
| 677.84 | 78.75 |
| 677.9 | 79.25 |
| 677.97 | 79.5 |
| 678.04 | 79.5 |
| 678.11 | 79.75 |
| 678.18 | 80 |
| 678.24 | 80.25 |
| 678.31 | 80.5 |
| 678.38 | 80.75 |
| 678.45 | 81 |
| 678.52 | 81.25 |
| 678.59 | 81.5 |
| 678.65 | 81.75 |
| 678.72 | 82 |
| 678.79 | 82.25 |
| 678.86 | 82.25 |
| 678.93 | 82.5 |
| 678.99 | 82.75 |
| 679.06 | 83 |
| 679.13 | 83 |
| 679.2 | 83.5 |
| 679.27 | 83.5 |
| 679.33 | 83.75 |
| 679.4 | 84 |
| 679.47 | 84.25 |
| 679.54 | 84.5 |
| 679.61 | 84.75 |
| 679.67 | 84.75 |
| 679.74 | 85 |
| 679.81 | 85 |
| 679.88 | 85.25 |
| 679.95 | 85.5 |
| 680.02 | 85.75 |
| 680.09 | 86 |
| 680.15 | 86.25 |
| 680.22 | 86.5 |
| 680.29 | 86.5 |
| 680.36 | 86.75 |
| 680.43 | 87 |
| 680.49 | 87 |
| 680.56 | 87.25 |
| 680.63 | 87.25 |
| 680.7 | 87.5 |
| 680.77 | 87.75 |
| 680.84 | 88 |
| 680.9 | 88.25 |
| 680.97 | 88.25 |
| 681.04 | 88.5 |
| 681.11 | 88.75 |
| 681.18 | 89 |
| 681.24 | 89.25 |
| 681.31 | 89.25 |
| 681.38 | 89.5 |
| 681.45 | 89.5 |
| 681.52 | 89.75 |
| 681.58 | 90 |
| 681.65 | 90.25 |
| 681.72 | 90.25 |
| 681.79 | 90.5 |
| 681.86 | 90.75 |
| 681.92 | 91 |
| 681.99 | 91 |
| 682.06 | 91.25 |
| 682.13 | 91.25 |
| 682.2 | 91.5 |
| 682.27 | 91.5 |
| 682.34 | 91.75 |
| 682.4 | 92 |
| 682.47 | 92.25 |
| 682.54 | 92.25 |
| 682.61 | 92.5 |
| 682.68 | 92.75 |
| 682.74 | 92.75 |
| 682.81 | 93 |
| 682.88 | 93.25 |
| 682.95 | 93.25 |
| 683.02 | 93.5 |
| 683.08 | 93.5 |
| 683.15 | 93.75 |
| 683.22 | 93.75 |
| 683.29 | 94 |
| 683.36 | 94.25 |
| 683.42 | 94.5 |
| 683.49 | 94.5 |
| 683.56 | 94.75 |
| 683.63 | 95 |
| 683.7 | 95 |
| 683.77 | 95 |
| 683.84 | 95.25 |
| 683.9 | 95.25 |
| 683.97 | 95.5 |
| 684.04 | 95.75 |
| 684.11 | 95.75 |
| 684.18 | 96 |
| 684.24 | 96.25 |
| 684.31 | 96.25 |
| 684.38 | 96.5 |
| 684.45 | 96.5 |
| 684.52 | 96.75 |
| 684.58 | 96.75 |
| 684.65 | 96.75 |
| 684.72 | 97 |
| 684.79 | 97 |
| 684.86 | 97.25 |
| 684.92 | 97.25 |
| 684.99 | 97.5 |
| 685.06 | 97.75 |
| 685.13 | 97.75 |
| 685.2 | 98 |
| 685.27 | 98 |
| 685.34 | 98.25 |
| 685.4 | 98.25 |
| 685.47 | 98.5 |
| 685.54 | 98.5 |
| 685.61 | 98.75 |
| 685.67 | 98.75 |
| 685.74 | 99 |
| 685.81 | 99 |
| 685.88 | 99.25 |
| 685.95 | 99.5 |
| 686.02 | 99.5 |
| 686.09 | 99.5 |
| 686.15 | 99.75 |
| 686.22 | 99.75 |
| 686.29 | 99.75 |
| 686.36 | 100 |
| 686.43 | 100 |
| 686.49 | 100 |
| 686.56 | 100.25 |
| 686.63 | 100.25 |
| 686.7 | 100.5 |
| 686.77 | 100.5 |
| 686.84 | 100.5 |
| 686.9 | 100.75 |
| 686.97 | 100.75 |
| 687.04 | 100.75 |
| 687.11 | 100.75 |
| 687.18 | 101 |
| 687.25 | 101 |
| 687.31 | 101 |
| 687.38 | 101 |
| 687.45 | 101 |
| 687.52 | 101 |
| 687.59 | 101 |
| 687.66 | 101 |
| 687.72 | 101 |
| 687.79 | 101 |
| 687.86 | 101 |
| 687.93 | 101 |
| 688.0 | 101 |
| 688.06 | 101 |
| 688.13 | 100.25 |
| 688.2 | 100 |
| 688.27 | 99.75 |
| 688.34 | 99.5 |
| 688.41 | 99.25 |
| 688.47 | 98.75 |
| 688.54 | 98.25 |
| 688.61 | 97.75 |
| 688.68 | 97.5 |
| 688.75 | 97.5 |
| 688.81 | 96.75 |
| 688.88 | 96.25 |
| 688.95 | 95.75 |
| 689.02 | 95.25 |
| 689.09 | 94.75 |
| 689.16 | 94.25 |
| 689.22 | 93.75 |
| 689.29 | 93 |
| 689.36 | 92.5 |
| 689.43 | 92 |
| 689.5 | 91.5 |
| 689.56 | 91.5 |
| 689.63 | 91 |
| 689.7 | 90.25 |
| 689.77 | 89.75 |
| 689.84 | 89.25 |
| 689.9 | 88.75 |
| 689.97 | 88.25 |
| 690.04 | 88 |
| 690.11 | 87.25 |
| 690.18 | 86.75 |
| 690.24 | 86.5 |
| 690.31 | 86 |
| 690.38 | 86 |
| 690.45 | 85.5 |
| 690.52 | 85 |
| 690.59 | 84.75 |
| 690.65 | 84.25 |
| 690.72 | 83.75 |
| 690.79 | 83.5 |
| 690.86 | 83 |
| 690.93 | 82.5 |
| 690.99 | 82.25 |
| 691.06 | 82 |
| 691.13 | 82 |
| 691.2 | 81.5 |
| 691.27 | 81 |
| 691.34 | 80.75 |
| 691.4 | 80.5 |
| 691.47 | 80.25 |
| 691.54 | 79.75 |
| 691.61 | 79.25 |
| 691.67 | 79 |
| 691.74 | 78.75 |
| 691.81 | 78.5 |
| 691.88 | 78 |
| 691.95 | 78 |
| 692.02 | 77.75 |
| 692.08 | 77.5 |
| 692.15 | 77.25 |
| 692.22 | 76.75 |
| 692.29 | 76.5 |
| 692.36 | 76.25 |
| 692.42 | 76 |
| 692.49 | 75.75 |
| 692.56 | 75.25 |
| 692.63 | 75 |
| 692.7 | 74.75 |
| 692.77 | 74.75 |
| 692.83 | 74.5 |
| 692.9 | 74.25 |
| 692.97 | 74 |
| 693.04 | 73.75 |
| 693.11 | 73.5 |
| 693.17 | 73.25 |
| 693.24 | 73 |
| 693.31 | 72.75 |
| 693.38 | 72.5 |
| 693.45 | 72.25 |
| 693.52 | 72 |
| 693.58 | 72 |
| 693.65 | 71.75 |
| 693.72 | 71.5 |
| 693.79 | 71.25 |
| 693.85 | 71 |
| 693.92 | 71 |
| 693.99 | 70.75 |
| 694.06 | 70.5 |
| 694.13 | 70.25 |
| 694.2 | 70 |
| 694.26 | 69.5 |
| 694.33 | 69.5 |
| 694.4 | 69.5 |
| 694.47 | 69.25 |
| 694.54 | 69 |
| 694.6 | 68.75 |
| 694.67 | 68.5 |
| 694.74 | 68.5 |
| 694.81 | 68.25 |
| 694.88 | 68.25 |
| 694.95 | 68.25 |
| 695.01 | 68.5 |
| 695.08 | 68.5 |
| 695.15 | 68.5 |
| 695.22 | 68.5 |
| 695.29 | 68.75 |
| 695.35 | 68.75 |
| 695.42 | 69 |
| 695.49 | 69 |
| 695.56 | 69 |
| 695.63 | 69.25 |
| 695.7 | 69.25 |
| 695.76 | 69.25 |
| 695.83 | 69.25 |
| 695.9 | 69.5 |
| 695.97 | 69.75 |
| 696.04 | 69.75 |
| 696.1 | 69.75 |
| 696.17 | 69.75 |
| 696.24 | 69.75 |
| 696.31 | 69.75 |
| 696.38 | 70 |
| 696.45 | 70 |
| 696.52 | 70 |
| 696.58 | 70.25 |
| 696.65 | 70.25 |
| 696.72 | 70.25 |
| 696.79 | 70.25 |
| 696.86 | 70.25 |
| 696.92 | 70.25 |
| 696.99 | 70 |
| 697.06 | 70.25 |
| 697.13 | 70 |
| 697.2 | 70 |
| 697.27 | 70 |
| 697.33 | 70 |
| 697.4 | 69.75 |
| 697.47 | 69.75 |
| 697.54 | 69.75 |
| 697.61 | 69.75 |
| 697.67 | 69.75 |
| 697.74 | 69.5 |
| 697.81 | 69.5 |
| 697.88 | 69.5 |
| 697.95 | 69.5 |
| 698.02 | 69.25 |
| 698.09 | 69.25 |
| 698.15 | 69.25 |
| 698.22 | 69 |
| 698.29 | 69 |
| 698.36 | 69 |
| 698.43 | 68.75 |
| 698.49 | 69 |
| 698.56 | 69 |
| 698.63 | 68.75 |
| 698.7 | 68.5 |
| 698.77 | 68.5 |
| 698.84 | 68.5 |
| 698.9 | 68.5 |
| 698.97 | 68.25 |
| 699.04 | 68.25 |
| 699.11 | 68.25 |
| 699.18 | 68.25 |
| 699.25 | 68.25 |
| 699.31 | 68.25 |
| 699.38 | 68.25 |
| 699.45 | 68 |
| 699.52 | 68 |
| 699.59 | 67.75 |
| 699.66 | 67.75 |
| 699.72 | 67.75 |
| 699.79 | 67.75 |
| 699.86 | 67.5 |
| 699.93 | 67.5 |
| 700.0 | 67.5 |
| 700.06 | 67.75 |
| 700.13 | 68 |
| 700.2 | 68 |
| 700.27 | 68.25 |
| 700.34 | 68.5 |
| 700.4 | 69 |
| 700.47 | 69.5 |
| 700.54 | 70 |
| 700.61 | 70.5 |
| 700.68 | 70.75 |
| 700.75 | 71 |
| 700.81 | 71.25 |
| 700.88 | 71.5 |
| 700.95 | 72 |
| 701.02 | 72 |
| 701.09 | 72.25 |
| 701.16 | 72.5 |
| 701.22 | 73 |
| 701.29 | 73.25 |
| 701.36 | 73.5 |
| 701.43 | 74 |
| 701.5 | 74.25 |
| 701.56 | 74.5 |
| 701.63 | 74.75 |
| 701.7 | 75 |
| 701.77 | 75.25 |
| 701.84 | 75.25 |
| 701.9 | 75.75 |
| 701.97 | 76 |
| 702.04 | 76.25 |
| 702.11 | 76.5 |
| 702.18 | 76.75 |
| 702.25 | 77 |
| 702.31 | 77.5 |
| 702.38 | 77.5 |
| 702.45 | 78 |
| 702.52 | 78.25 |
| 702.59 | 78.5 |
| 702.66 | 78.5 |
| 702.72 | 78.75 |
| 702.79 | 79 |
| 702.86 | 79.25 |
| 702.93 | 79.5 |
| 703.0 | 79.75 |
| 703.06 | 80 |
| 703.13 | 80.25 |
| 703.2 | 80.5 |
| 703.27 | 80.75 |
| 703.34 | 81 |
| 703.41 | 81.25 |
| 703.47 | 81.25 |
| 703.54 | 81.5 |
| 703.61 | 81.75 |
| 703.68 | 82 |
| 703.75 | 82.25 |
| 703.81 | 82.5 |
| 703.88 | 82.75 |
| 703.95 | 83 |
| 704.02 | 83.25 |
| 704.09 | 83.25 |
| 704.15 | 83.5 |
| 704.22 | 84 |
| 704.29 | 84 |
| 704.36 | 84 |
| 704.43 | 84.25 |
| 704.5 | 84.5 |
| 704.56 | 84.75 |
| 704.63 | 85 |
| 704.7 | 85 |
| 704.77 | 85.25 |
| 704.84 | 85.5 |
| 704.91 | 85.5 |
| 704.97 | 86 |
| 705.04 | 86 |
| 705.11 | 86 |
| 705.18 | 86.25 |
| 705.25 | 86.5 |
| 705.31 | 86.75 |
| 705.38 | 87 |
| 705.45 | 87 |
| 705.52 | 87.25 |
| 705.59 | 87.5 |
| 705.65 | 87.75 |
| 705.72 | 87.75 |
| 705.79 | 88 |
| 705.86 | 88.25 |
| 705.93 | 88.25 |
| 706.0 | 88.5 |
| 706.06 | 88.75 |
| 706.13 | 88.75 |
| 706.2 | 89 |
| 706.27 | 89.25 |
| 706.34 | 89.5 |
| 706.4 | 89.5 |
| 706.47 | 89.75 |
| 706.54 | 90 |
| 706.61 | 90.25 |
| 706.68 | 90.25 |
| 706.75 | 90.25 |
| 706.81 | 90.5 |
| 706.88 | 90.75 |
| 706.95 | 91 |
| 707.02 | 91 |
| 707.09 | 91.25 |
| 707.15 | 91.5 |
| 707.22 | 91.5 |
| 707.29 | 91.75 |
| 707.36 | 92 |
| 707.43 | 92 |
| 707.49 | 92.25 |
| 707.56 | 92.25 |
| 707.63 | 92.5 |
| 707.7 | 92.5 |
| 707.77 | 92.75 |
| 707.84 | 93 |
| 707.9 | 93.25 |
| 707.97 | 93.25 |
| 708.04 | 93.5 |
| 708.11 | 93.5 |
| 708.18 | 93.75 |
| 708.25 | 94 |
| 708.31 | 94.25 |
| 708.38 | 94.25 |
| 708.45 | 94.25 |
| 708.52 | 94.5 |
| 708.59 | 94.75 |
| 708.65 | 94.75 |
| 708.72 | 95 |
| 708.79 | 95.25 |
| 708.86 | 95.25 |
| 708.93 | 95.5 |
| 709.0 | 95.5 |
| 709.06 | 95.75 |
| 709.13 | 96 |
| 709.2 | 96 |
| 709.27 | 96 |
| 709.34 | 96 |
| 709.4 | 96.25 |
| 709.47 | 96.5 |
| 709.54 | 96.5 |
| 709.61 | 96.75 |
| 709.68 | 96.75 |
| 709.75 | 97 |
| 709.81 | 97 |
| 709.88 | 97.25 |
| 709.95 | 97.5 |
| 710.02 | 97.5 |
| 710.09 | 97.5 |
| 710.15 | 97.75 |
| 710.22 | 97.75 |
| 710.29 | 98 |
| 710.36 | 98 |
| 710.43 | 98.25 |
| 710.5 | 98.25 |
| 710.56 | 98.5 |
| 710.63 | 98.75 |
| 710.7 | 98.75 |
| 710.77 | 99 |
| 710.84 | 99 |
| 710.9 | 99 |
| 710.97 | 99.25 |
| 711.04 | 99.5 |
| 711.11 | 99.5 |
| 711.18 | 99.5 |
| 711.25 | 99.75 |
| 711.31 | 99.75 |
| 711.38 | 100 |
| 711.45 | 100 |
| 711.52 | 100.25 |
| 711.59 | 100.25 |
| 711.66 | 100.25 |
| 711.72 | 100.5 |
| 711.79 | 100.5 |
| 711.86 | 100.75 |
| 711.93 | 100.75 |
| 712.0 | 101 |
| 712.07 | 101 |
| 712.13 | 101 |
| 712.2 | 101 |
| 712.27 | 101.25 |
| 712.34 | 101.25 |
| 712.41 | 101.25 |
| 712.47 | 101.25 |
| 712.54 | 101.25 |
| 712.61 | 101.25 |
| 712.68 | 101.25 |
| 712.75 | 101.25 |
| 712.82 | 101.25 |
| 712.88 | 101 |
| 712.95 | 101 |
| 713.02 | 101 |
| 713.09 | 100.25 |
| 713.16 | 100 |
| 713.22 | 99.75 |
| 713.29 | 99.75 |
| 713.36 | 99.5 |
| 713.43 | 99.25 |
| 713.5 | 98.75 |
| 713.57 | 98.25 |
| 713.63 | 97.75 |
| 713.7 | 97.25 |
| 713.77 | 96.75 |
| 713.84 | 96.25 |
| 713.91 | 95.75 |
| 713.97 | 95.25 |
| 714.04 | 94.5 |
| 714.11 | 94.5 |
| 714.18 | 94 |
| 714.25 | 93.5 |
| 714.31 | 92.75 |
| 714.38 | 92.25 |
| 714.45 | 91.75 |
| 714.52 | 91.25 |
| 714.59 | 90.75 |
| 714.66 | 90.25 |
| 714.72 | 89.5 |
| 714.79 | 89.25 |
| 714.86 | 88.75 |
| 714.93 | 88.75 |
| 715.0 | 88.25 |
| 715.06 | 87.75 |
| 715.13 | 87.25 |
| 715.2 | 86.75 |
| 715.27 | 86.25 |
| 715.34 | 85.75 |
| 715.41 | 85.25 |
| 715.47 | 85 |
| 715.54 | 84.5 |
| 715.61 | 84 |
| 715.68 | 83.75 |
| 715.75 | 83.75 |
| 715.81 | 83.25 |
| 715.88 | 82.75 |
| 715.95 | 82.5 |
| 716.02 | 82 |
| 716.09 | 81.75 |
| 716.15 | 81.5 |
| 716.22 | 81 |
| 716.29 | 80.5 |
| 716.36 | 80.25 |
| 716.43 | 80 |
| 716.49 | 79.5 |
| 716.56 | 79.5 |
| 716.63 | 79.25 |
| 716.7 | 79 |
| 716.77 | 78.75 |
| 716.84 | 78.25 |
| 716.9 | 78 |
| 716.97 | 77.5 |
| 717.04 | 77.25 |
| 717.11 | 77 |
| 717.18 | 76.75 |
| 717.24 | 76.5 |
| 717.31 | 76.25 |
| 717.38 | 76.25 |
| 717.45 | 75.75 |
| 717.52 | 75.5 |
| 717.59 | 75.25 |
| 717.65 | 75 |
| 717.72 | 74.75 |
| 717.79 | 74.5 |
| 717.86 | 74.25 |
| 717.93 | 74 |
| 717.99 | 73.75 |
| 718.06 | 73.25 |
| 718.13 | 73.25 |
| 718.2 | 73 |
| 718.27 | 72.75 |
| 718.33 | 72.75 |
| 718.4 | 72.25 |
| 718.47 | 72 |
| 718.54 | 72 |
| 718.61 | 71.75 |
| 718.67 | 71.25 |
| 718.74 | 71.25 |
| 718.81 | 71 |
| 718.88 | 70.75 |
| 718.95 | 70.75 |
| 719.02 | 70.5 |
| 719.08 | 70.25 |
| 719.15 | 70 |
| 719.22 | 69.75 |
| 719.29 | 69.5 |
| 719.36 | 69.25 |
| 719.42 | 69 |
| 719.49 | 68.75 |
| 719.56 | 68.75 |
| 719.63 | 68.5 |
| 719.7 | 68.25 |
| 719.77 | 68.25 |
| 719.83 | 68 |
| 719.9 | 68.25 |
| 719.97 | 68.5 |
| 720.04 | 68.5 |
| 720.11 | 68.5 |
| 720.17 | 68.5 |
| 720.24 | 68.75 |
| 720.31 | 68.75 |
| 720.38 | 69 |
| 720.45 | 69 |
| 720.52 | 69 |
| 720.58 | 69 |
| 720.65 | 69 |
| 720.72 | 69.25 |
| 720.79 | 69.25 |
| 720.86 | 69.25 |
| 720.92 | 69.5 |
| 720.99 | 69.5 |
| 721.06 | 69.75 |
| 721.13 | 69.75 |
| 721.2 | 69.75 |
| 721.27 | 69.75 |
| 721.34 | 69.75 |
| 721.4 | 70 |
| 721.47 | 70 |
| 721.54 | 70 |
| 721.61 | 70 |
| 721.68 | 70 |
| 721.74 | 70 |
| 721.81 | 70 |
| 721.88 | 70 |
| 721.95 | 70 |
| 722.02 | 70 |
| 722.09 | 70 |
| 722.15 | 70 |
| 722.22 | 70 |
| 722.29 | 70 |
| 722.36 | 70 |
| 722.43 | 69.75 |
| 722.5 | 69.75 |
| 722.56 | 69.75 |
| 722.63 | 69.5 |
| 722.7 | 69.5 |
| 722.77 | 69.5 |
| 722.84 | 69.25 |
| 722.91 | 69.25 |
| 722.97 | 69.25 |
| 723.04 | 69.25 |
| 723.11 | 69.25 |
| 723.18 | 69 |
| 723.25 | 69 |
| 723.31 | 69 |
| 723.38 | 69 |
| 723.45 | 68.75 |
| 723.52 | 68.75 |
| 723.59 | 68.5 |
| 723.66 | 68.5 |
| 723.72 | 68.5 |
| 723.79 | 68.5 |
| 723.86 | 68.5 |
| 723.93 | 68.5 |
| 724.0 | 68.25 |
| 724.07 | 68.25 |
| 724.13 | 68.25 |
| 724.2 | 68.25 |
| 724.27 | 68 |
| 724.34 | 68 |
| 724.41 | 68 |
| 724.47 | 67.75 |
| 724.54 | 67.75 |
| 724.61 | 67.75 |
| 724.68 | 67.5 |
| 724.75 | 67.5 |
| 724.82 | 67.5 |
| 724.88 | 67.5 |
| 724.95 | 67.5 |
| 725.02 | 67.5 |
| 725.09 | 67.5 |
| 725.16 | 67.75 |
| 725.22 | 68 |
| 725.29 | 68.25 |
| 725.36 | 68.5 |
| 725.43 | 69 |
| 725.5 | 69.5 |
| 725.57 | 69.5 |
| 725.63 | 69.75 |
| 725.7 | 70.25 |
| 725.77 | 70.75 |
| 725.84 | 71 |
| 725.91 | 71.25 |
| 725.97 | 71.5 |
| 726.04 | 72 |
| 726.11 | 72.25 |
| 726.18 | 72.5 |
| 726.25 | 73 |
| 726.32 | 73.25 |
| 726.38 | 73.25 |
| 726.45 | 73.5 |
| 726.52 | 74 |
| 726.59 | 74.25 |
| 726.66 | 74.5 |
| 726.72 | 74.75 |
| 726.79 | 75 |
| 726.86 | 75.25 |
| 726.93 | 75.5 |
| 727.0 | 76 |
| 727.07 | 76.25 |
| 727.13 | 76.5 |
| 727.2 | 76.5 |
| 727.27 | 76.75 |
| 727.34 | 77 |
| 727.41 | 77.25 |
| 727.47 | 77.5 |
| 727.54 | 78 |
| 727.61 | 78.25 |
| 727.68 | 78.5 |
| 727.75 | 78.75 |
| 727.82 | 79 |
| 727.88 | 79.25 |
| 727.95 | 79.5 |
| 728.02 | 79.5 |
| 728.09 | 79.75 |
| 728.16 | 80 |
| 728.22 | 80.25 |
| 728.29 | 80.5 |
| 728.36 | 80.75 |
| 728.43 | 81 |
| 728.5 | 81.25 |
| 728.57 | 81.75 |
| 728.63 | 81.75 |
| 728.7 | 82 |
| 728.77 | 82.25 |
| 728.84 | 82.25 |
| 728.91 | 82.5 |
| 728.97 | 82.75 |
| 729.04 | 83 |
| 729.11 | 83.25 |
| 729.18 | 83.5 |
| 729.25 | 83.75 |
| 729.32 | 84 |
| 729.38 | 84.25 |
| 729.45 | 84.25 |
| 729.52 | 84.5 |
| 729.59 | 84.75 |
| 729.66 | 84.75 |
| 729.72 | 85 |
| 729.79 | 85.25 |
| 729.86 | 85.25 |
| 729.93 | 85.5 |
| 730.0 | 85.75 |
| 730.07 | 86 |
| 730.13 | 86.25 |
| 730.2 | 86.5 |
| 730.27 | 86.5 |
| 730.34 | 86.75 |
| 730.41 | 87 |
| 730.47 | 87 |
| 730.54 | 87.25 |
| 730.61 | 87.5 |
| 730.68 | 87.75 |
| 730.75 | 87.75 |
| 730.82 | 88 |
| 730.88 | 88.25 |
| 730.95 | 88.25 |
| 731.02 | 88.5 |
| 731.09 | 88.75 |
| 731.16 | 88.75 |
| 731.22 | 89.25 |
| 731.29 | 89.25 |
| 731.36 | 89.25 |
| 731.43 | 89.5 |
| 731.5 | 89.75 |
| 731.57 | 90 |
| 731.63 | 90 |
| 731.7 | 90.25 |
| 731.77 | 90.5 |
| 731.84 | 90.75 |
| 731.91 | 90.75 |
| 731.97 | 91 |
| 732.04 | 91.25 |
| 732.11 | 91.25 |
| 732.18 | 91.5 |
| 732.25 | 91.5 |
| 732.32 | 91.75 |
| 732.38 | 92 |
| 732.45 | 92.25 |
| 732.52 | 92.25 |
| 732.59 | 92.5 |
| 732.66 | 92.5 |
| 732.72 | 92.75 |
| 732.79 | 93 |
| 732.86 | 93 |
| 732.93 | 93 |
| 733.0 | 93.25 |
| 733.07 | 93.25 |
| 733.13 | 93.5 |
| 733.2 | 93.75 |
| 733.27 | 94 |
| 733.34 | 94 |
| 733.41 | 94.25 |
| 733.47 | 94.25 |
| 733.54 | 94.5 |
| 733.61 | 94.75 |
| 733.68 | 95 |
| 733.75 | 95 |
| 733.82 | 95 |
| 733.88 | 95.25 |
| 733.95 | 95.5 |
| 734.02 | 95.5 |
| 734.09 | 95.75 |
| 734.16 | 95.75 |
| 734.22 | 96 |
| 734.29 | 96.25 |
| 734.36 | 96.25 |
| 734.43 | 96.25 |
| 734.5 | 96.5 |
| 734.57 | 96.5 |
| 734.63 | 96.75 |
| 734.7 | 96.75 |
| 734.77 | 97 |
| 734.84 | 97 |
| 734.91 | 97.25 |
| 734.97 | 97.5 |
| 735.04 | 97.75 |
| 735.11 | 97.75 |
| 735.18 | 98 |
| 735.25 | 98 |
| 735.31 | 98 |
| 735.38 | 98 |
| 735.45 | 98.25 |
| 735.52 | 98.5 |
| 735.59 | 98.5 |
| 735.66 | 98.75 |
| 735.72 | 98.75 |
| 735.79 | 99 |
| 735.86 | 99.25 |
| 735.93 | 99.25 |
| 736.0 | 99.5 |
| 736.07 | 99.5 |
| 736.13 | 99.75 |
| 736.2 | 99.75 |
| 736.27 | 99.75 |
| 736.34 | 100 |
| 736.41 | 100 |
| 736.47 | 100.25 |
| 736.54 | 100.25 |
| 736.61 | 100.5 |
| 736.68 | 100.5 |
| 736.75 | 100.5 |
| 736.82 | 100.75 |
| 736.88 | 100.75 |
| 736.95 | 101 |
| 737.02 | 101 |
| 737.09 | 101 |
| 737.16 | 101 |
| 737.23 | 101.25 |
| 737.29 | 101.25 |
| 737.36 | 101.25 |
| 737.43 | 101.25 |
| 737.5 | 101.25 |
| 737.57 | 101.25 |
| 737.64 | 101.25 |
| 737.7 | 101.25 |
| 737.77 | 101.25 |
| 737.84 | 101.25 |
| 737.91 | 101.25 |
| 737.98 | 101 |
| 738.04 | 101 |
| 738.11 | 101 |
| 738.18 | 100.5 |
| 738.25 | 100 |
| 738.32 | 99.75 |
| 738.39 | 99.5 |
| 738.45 | 99.25 |
| 738.52 | 98.75 |
| 738.59 | 98.25 |
| 738.66 | 98.25 |
| 738.73 | 97.75 |
| 738.79 | 97.5 |
| 738.86 | 97 |
| 738.93 | 96.5 |
| 739.0 | 95.75 |
| 739.07 | 95.25 |
| 739.14 | 94.75 |
| 739.2 | 94 |
| 739.27 | 93.75 |
| 739.34 | 93 |
| 739.41 | 92.5 |
| 739.48 | 92.5 |
| 739.54 | 92 |
| 739.61 | 91.25 |
| 739.68 | 91 |
| 739.75 | 90.25 |
| 739.82 | 89.75 |
| 739.89 | 89.25 |
| 739.95 | 88.75 |
| 740.02 | 88.25 |
| 740.09 | 87.75 |
| 740.16 | 87.25 |
| 740.23 | 86.75 |
| 740.29 | 86.75 |
| 740.36 | 86.5 |
| 740.43 | 86 |
| 740.5 | 85.5 |
| 740.57 | 85 |
| 740.63 | 84.5 |
| 740.7 | 84.25 |
| 740.77 | 83.75 |
| 740.84 | 83.25 |
| 740.91 | 83 |
| 740.97 | 82.5 |
| 741.04 | 82.25 |
| 741.11 | 82.25 |
| 741.18 | 81.75 |
| 741.25 | 81.5 |
| 741.32 | 81.25 |
| 741.38 | 80.75 |
| 741.45 | 80.5 |
| 741.52 | 80 |
| 741.59 | 79.75 |
| 741.66 | 79.25 |
| 741.72 | 79 |
| 741.79 | 78.75 |
| 741.86 | 78.25 |
| 741.93 | 78.25 |
| 742.0 | 78 |
| 742.07 | 77.75 |
| 742.13 | 77.25 |
| 742.2 | 77 |
| 742.27 | 76.75 |
| 742.34 | 76.5 |
| 742.41 | 76.25 |
| 742.47 | 76 |
| 742.54 | 75.75 |
| 742.61 | 75.25 |
| 742.68 | 75 |
| 742.75 | 75 |
| 742.81 | 74.75 |
| 742.88 | 74.5 |
| 742.95 | 74.25 |
| 743.02 | 74 |
| 743.09 | 73.75 |
| 743.16 | 73.5 |
| 743.22 | 73.25 |
| 743.29 | 73 |
| 743.36 | 72.75 |
| 743.43 | 72.5 |
| 743.5 | 72 |
| 743.56 | 72 |
| 743.63 | 72 |
| 743.7 | 71.75 |
| 743.77 | 71.5 |
| 743.84 | 71.25 |
| 743.9 | 71 |
| 743.97 | 70.75 |
| 744.04 | 70.5 |
| 744.11 | 70.25 |
| 744.18 | 70 |
| 744.25 | 69.75 |
| 744.31 | 69.5 |
| 744.38 | 69.5 |
| 744.45 | 69.25 |
| 744.52 | 69 |
| 744.59 | 69 |
| 744.65 | 68.75 |
| 744.72 | 68.5 |
| 744.79 | 68.25 |
| 744.86 | 68 |
| 744.93 | 68 |
| 744.99 | 68.25 |
| 745.06 | 68.25 |
| 745.13 | 68.25 |
| 745.2 | 68.25 |
| 745.27 | 68.5 |
| 745.34 | 68.5 |
| 745.4 | 68.5 |
| 745.47 | 68.75 |
| 745.54 | 68.75 |
| 745.61 | 68.75 |
| 745.68 | 69 |
| 745.75 | 69 |
| 745.81 | 69 |
| 745.88 | 69.25 |
| 745.95 | 69.25 |
| 746.02 | 69.25 |
| 746.09 | 69.5 |
| 746.16 | 69.5 |
| 746.22 | 69.5 |
| 746.29 | 69.5 |
| 746.36 | 69.75 |
| 746.43 | 69.75 |
| 746.5 | 69.75 |
| 746.56 | 70 |
| 746.63 | 70 |
| 746.7 | 70 |
| 746.77 | 70 |
| 746.84 | 70 |
| 746.91 | 70 |
| 746.97 | 70.25 |
| 747.04 | 70.25 |
| 747.11 | 70.25 |
| 747.18 | 70 |
| 747.25 | 70 |
| 747.32 | 70 |
| 747.38 | 70 |
| 747.45 | 70 |
| 747.52 | 69.75 |
| 747.59 | 69.75 |
| 747.66 | 69.75 |
| 747.72 | 69.75 |
| 747.79 | 69.5 |
| 747.86 | 69.5 |
| 747.93 | 69.5 |
| 748.0 | 69.5 |
| 748.07 | 69.25 |
| 748.13 | 69.25 |
| 748.2 | 69 |
| 748.27 | 69 |
| 748.34 | 69 |
| 748.41 | 69 |
| 748.48 | 69 |
| 748.54 | 68.75 |
| 748.61 | 68.75 |
| 748.68 | 68.75 |
| 748.75 | 68.5 |
| 748.82 | 68.5 |
| 748.88 | 68.5 |
| 748.95 | 68.5 |
| 749.02 | 68.25 |
| 749.09 | 68.25 |
| 749.16 | 68.25 |
| 749.23 | 68.25 |
| 749.29 | 68.25 |
| 749.36 | 68 |
| 749.43 | 68 |
| 749.5 | 68 |
| 749.57 | 67.75 |
| 749.64 | 67.75 |
| 749.7 | 67.75 |
| 749.77 | 67.75 |
| 749.84 | 67.5 |
| 749.91 | 67.5 |
| 749.98 | 67.5 |
| 750.04 | 67.5 |
| 750.11 | 67.5 |
| 750.18 | 67.5 |
| 750.25 | 67.75 |
| 750.32 | 68.25 |
| 750.39 | 68.5 |
| 750.45 | 69 |
| 750.52 | 69.5 |
| 750.59 | 69.75 |
| 750.66 | 70.25 |
| 750.73 | 70.5 |
| 750.79 | 71 |
| 750.86 | 71.25 |
| 750.93 | 71.5 |
| 751.0 | 71.5 |
| 751.07 | 71.75 |
| 751.14 | 72 |
| 751.2 | 72.5 |
| 751.27 | 72.75 |
| 751.34 | 73 |
| 751.41 | 73.5 |
| 751.48 | 73.75 |
| 751.54 | 74 |
| 751.61 | 74.25 |
| 751.68 | 74.75 |
| 751.75 | 75 |
| 751.82 | 75 |
| 751.89 | 75.25 |
| 751.95 | 75.5 |
| 752.02 | 76 |
| 752.09 | 76.25 |
| 752.16 | 76.5 |
| 752.23 | 76.75 |
| 752.29 | 77 |
| 752.36 | 77.25 |
| 752.43 | 77.5 |
| 752.5 | 78 |
| 752.57 | 78 |
| 752.64 | 78.25 |
| 752.7 | 78.5 |
| 752.77 | 78.75 |
| 752.84 | 79 |
| 752.91 | 79.25 |
| 752.98 | 79.5 |
| 753.04 | 79.75 |
| 753.11 | 80 |
| 753.18 | 80.25 |
| 753.25 | 80.5 |
| 753.32 | 81 |
| 753.39 | 81 |
| 753.45 | 81 |
| 753.52 | 81.25 |
| 753.59 | 81.5 |
| 753.66 | 81.75 |
| 753.73 | 82 |
| 753.79 | 82.25 |
| 753.86 | 82.5 |
| 753.93 | 82.75 |
| 754.0 | 83 |
| 754.07 | 83.25 |
| 754.14 | 83.5 |
| 754.2 | 83.5 |
| 754.27 | 83.75 |
| 754.34 | 83.75 |
| 754.41 | 84 |
| 754.48 | 84.25 |
| 754.54 | 84.5 |
| 754.61 | 84.75 |
| 754.68 | 85 |
| 754.75 | 85 |
| 754.82 | 85.25 |
| 754.89 | 85.5 |
| 754.95 | 85.75 |
| 755.02 | 85.75 |
| 755.09 | 86 |
| 755.16 | 86.25 |
| 755.23 | 86.5 |
| 755.29 | 86.5 |
| 755.36 | 86.75 |
| 755.43 | 87 |
| 755.5 | 87.25 |
| 755.57 | 87.5 |
| 755.64 | 87.5 |
| 755.7 | 87.75 |
| 755.77 | 88 |
| 755.84 | 88 |
| 755.91 | 88.25 |
| 755.98 | 88.5 |
| 756.04 | 88.5 |
| 756.11 | 88.75 |
| 756.18 | 89 |
| 756.25 | 89 |
| 756.32 | 89.25 |
| 756.39 | 89.5 |
| 756.45 | 89.5 |
| 756.52 | 89.75 |
| 756.59 | 90 |
| 756.66 | 90 |
| 756.72 | 90.25 |
| 756.79 | 90.25 |
| 756.86 | 90.5 |
| 756.93 | 90.75 |
| 757.0 | 90.75 |
| 757.07 | 91 |
| 757.14 | 91.25 |
| 757.2 | 91.25 |
| 757.27 | 91.5 |
| 757.34 | 91.5 |
| 757.41 | 92 |
| 757.48 | 92 |
| 757.54 | 92 |
| 757.61 | 92.25 |
| 757.68 | 92.25 |
| 757.75 | 92.5 |
| 757.82 | 92.75 |
| 757.88 | 92.75 |
| 757.95 | 93 |
| 758.02 | 93 |
| 758.09 | 93.25 |
| 758.16 | 93.5 |
| 758.22 | 93.5 |
| 758.29 | 93.5 |
| 758.36 | 93.75 |
| 758.43 | 93.75 |
| 758.5 | 94 |
| 758.57 | 94 |
| 758.64 | 94.25 |
| 758.7 | 94.5 |
| 758.77 | 94.5 |
| 758.84 | 94.75 |
| 758.91 | 94.75 |
| 758.98 | 95 |
| 759.04 | 95.25 |
| 759.11 | 95.25 |
| 759.18 | 95.25 |
| 759.25 | 95.5 |
| 759.32 | 95.5 |
| 759.39 | 95.75 |
| 759.45 | 95.75 |
| 759.52 | 96 |
| 759.59 | 96.25 |
| 759.66 | 96.25 |
| 759.73 | 96.5 |
| 759.79 | 96.5 |
| 759.86 | 96.75 |
| 759.93 | 96.75 |
| 760.0 | 96.75 |
| 760.07 | 97 |
| 760.13 | 97 |
| 760.2 | 97.25 |
| 760.27 | 97.25 |
| 760.34 | 97.5 |
| 760.41 | 97.75 |
| 760.47 | 97.75 |
| 760.54 | 98 |
| 760.61 | 98 |
| 760.68 | 98.25 |
| 760.75 | 98.25 |
| 760.82 | 98.5 |
| 760.89 | 98.5 |
| 760.95 | 98.5 |
| 761.02 | 98.75 |
| 761.09 | 98.75 |
| 761.16 | 99 |
| 761.22 | 99.25 |
| 761.29 | 99.5 |
| 761.36 | 99.5 |
| 761.43 | 99.5 |
| 761.5 | 99.75 |
| 761.57 | 99.75 |
| 761.63 | 99.75 |
| 761.7 | 100 |
| 761.77 | 100 |
| 761.84 | 100.25 |
| 761.91 | 100.25 |
| 761.98 | 100.5 |
| 762.04 | 100.5 |
| 762.11 | 100.5 |
| 762.18 | 100.75 |
| 762.25 | 100.75 |
| 762.32 | 101 |
| 762.39 | 101 |
| 762.45 | 101 |
| 762.52 | 101 |
| 762.59 | 101 |
| 762.66 | 101.25 |
| 762.73 | 101.25 |
| 762.8 | 101.25 |
| 762.86 | 101.25 |
| 762.93 | 101.25 |
| 763.0 | 101 |
| 763.07 | 101 |
| 763.14 | 101.25 |
| 763.21 | 101 |
| 763.27 | 101 |
| 763.34 | 101 |
| 763.41 | 101 |
| 763.48 | 101 |
| 763.55 | 100.5 |
| 763.61 | 100 |
| 763.68 | 99.75 |
| 763.75 | 99.5 |
| 763.82 | 99.25 |
| 763.89 | 98.75 |
| 763.96 | 98.25 |
| 764.02 | 98 |
| 764.09 | 98 |
| 764.16 | 97.5 |
| 764.23 | 97 |
| 764.3 | 96.5 |
| 764.36 | 96 |
| 764.43 | 95.25 |
| 764.5 | 94.75 |
| 764.57 | 94.25 |
| 764.64 | 93.5 |
| 764.7 | 93 |
| 764.77 | 92.5 |
| 764.84 | 92 |
| 764.91 | 92 |
| 764.98 | 91.25 |
| 765.04 | 90.75 |
| 765.11 | 90.25 |
| 765.18 | 89.75 |
| 765.25 | 89.25 |
| 765.32 | 88.75 |
| 765.39 | 88.25 |
| 765.45 | 87.75 |
| 765.52 | 87.25 |
| 765.59 | 86.75 |
| 765.66 | 86.75 |
| 765.73 | 86.25 |
| 765.79 | 86 |
| 765.86 | 85.5 |
| 765.93 | 85 |
| 766.0 | 84.5 |
| 766.07 | 84 |
| 766.14 | 83.75 |
| 766.2 | 83.25 |
| 766.27 | 83 |
| 766.34 | 82.5 |
| 766.41 | 82.25 |
| 766.48 | 82.25 |
| 766.54 | 81.75 |
| 766.61 | 81.5 |
| 766.68 | 81 |
| 766.75 | 80.75 |
| 766.82 | 80.25 |
| 766.88 | 80 |
| 766.95 | 79.75 |
| 767.02 | 79.25 |
| 767.09 | 79 |
| 767.16 | 78.75 |
| 767.22 | 78.5 |
| 767.29 | 78.5 |
| 767.36 | 78 |
| 767.43 | 77.75 |
| 767.5 | 77.5 |
| 767.57 | 77 |
| 767.63 | 76.75 |
| 767.7 | 76.5 |
| 767.77 | 76.25 |
| 767.84 | 76 |
| 767.91 | 75.75 |
| 767.97 | 75.5 |
| 768.04 | 75.25 |
| 768.11 | 75.25 |
| 768.18 | 75 |
| 768.25 | 74.5 |
| 768.32 | 74.25 |
| 768.38 | 74 |
| 768.45 | 73.75 |
| 768.52 | 73.5 |
| 768.59 | 73.25 |
| 768.66 | 73 |
| 768.72 | 72.75 |
| 768.79 | 72.5 |
| 768.86 | 72.25 |
| 768.93 | 72.25 |
| 769.0 | 72 |
| 769.06 | 71.75 |
| 769.13 | 71.5 |
| 769.2 | 71.25 |
| 769.27 | 71.25 |
| 769.34 | 70.75 |
| 769.41 | 70.75 |
| 769.47 | 70.5 |
| 769.54 | 70.25 |
| 769.61 | 70 |
| 769.68 | 69.75 |
| 769.75 | 69.75 |
| 769.81 | 69.5 |
| 769.88 | 69.25 |
| 769.95 | 69 |
| 770.02 | 68.75 |
| 770.09 | 68.5 |
| 770.15 | 68.5 |
| 770.22 | 68.25 |
| 770.29 | 68.25 |
| 770.36 | 68.25 |
| 770.43 | 68.5 |
| 770.5 | 68.5 |
| 770.56 | 68.5 |
| 770.63 | 68.5 |
| 770.7 | 68.5 |
| 770.77 | 68.75 |
| 770.84 | 68.75 |
| 770.91 | 68.75 |
| 770.97 | 68.75 |
| 771.04 | 69 |
| 771.11 | 69 |
| 771.18 | 69 |
| 771.25 | 69.25 |
| 771.31 | 69.25 |
| 771.38 | 69.25 |
| 771.45 | 69.25 |
| 771.52 | 69.5 |
| 771.59 | 69.5 |
| 771.66 | 69.5 |
| 771.72 | 69.5 |
| 771.79 | 69.5 |
| 771.86 | 69.75 |
| 771.93 | 69.75 |
| 772.0 | 69.75 |
| 772.07 | 69.75 |
| 772.13 | 69.75 |
| 772.2 | 69.75 |
| 772.27 | 69.75 |
| 772.34 | 69.75 |
| 772.41 | 69.75 |
| 772.47 | 69.75 |
| 772.54 | 69.75 |
| 772.61 | 69.75 |
| 772.68 | 69.75 |
| 772.75 | 69.75 |
| 772.82 | 69.5 |
| 772.89 | 69.5 |
| 772.95 | 69.5 |
| 773.02 | 69.5 |
| 773.09 | 69.5 |
| 773.16 | 69.5 |
| 773.23 | 69.25 |
| 773.29 | 69.25 |
| 773.36 | 69.25 |
| 773.43 | 69 |
| 773.5 | 69 |
| 773.57 | 69 |
| 773.64 | 68.75 |
| 773.7 | 68.75 |
| 773.77 | 68.75 |
| 773.84 | 68.75 |
| 773.91 | 68.75 |
| 773.98 | 68.5 |
| 774.04 | 68.5 |
| 774.11 | 68.5 |
| 774.18 | 68.25 |
| 774.25 | 68.25 |
| 774.32 | 68.25 |
| 774.39 | 68.25 |
| 774.46 | 68 |
| 774.52 | 68 |
| 774.59 | 68 |
| 774.66 | 67.75 |
| 774.73 | 67.75 |
| 774.8 | 67.75 |
| 774.86 | 67.75 |
| 774.93 | 67.75 |
| 775.0 | 67.75 |
| 775.07 | 67.5 |
| 775.14 | 67.5 |
| 775.21 | 67.5 |
| 775.27 | 67.5 |
| 775.34 | 67.25 |
| 775.41 | 67.25 |
| 775.48 | 67.5 |
| 775.54 | 67.5 |
| 775.61 | 67.5 |
| 775.68 | 67.5 |
| 775.75 | 68 |
| 775.82 | 68.25 |
| 775.89 | 68.75 |
| 775.96 | 69.25 |
| 776.02 | 69.5 |
| 776.09 | 70.25 |
| 776.16 | 70.5 |
| 776.23 | 70.75 |
| 776.3 | 71 |
| 776.36 | 71 |
| 776.43 | 71.25 |
| 776.5 | 71.75 |
| 776.57 | 72 |
| 776.64 | 72.25 |
| 776.71 | 72.75 |
| 776.77 | 73 |
| 776.84 | 73.25 |
| 776.91 | 73.5 |
| 776.98 | 74 |
| 777.05 | 74.25 |
| 777.11 | 74.5 |
| 777.18 | 74.5 |
| 777.25 | 74.75 |
| 777.32 | 75 |
| 777.39 | 75.5 |
| 777.45 | 75.75 |
| 777.52 | 76 |
| 777.59 | 76.25 |
| 777.66 | 76.5 |
| 777.73 | 77 |
| 777.79 | 77.25 |
| 777.86 | 77.5 |
| 777.93 | 77.5 |
| 778.0 | 77.5 |
| 778.07 | 78 |
| 778.14 | 78.25 |
| 778.21 | 78.5 |
| 778.27 | 78.75 |
| 778.34 | 79 |
| 778.41 | 79.25 |
| 778.48 | 79.5 |
| 778.55 | 79.75 |
| 778.61 | 80 |
| 778.68 | 80.25 |
| 778.75 | 80.5 |
| 778.82 | 80.5 |
| 778.89 | 80.75 |
| 778.95 | 81 |
| 779.02 | 81.5 |
| 779.09 | 81.5 |
| 779.16 | 81.75 |
| 779.23 | 82 |
| 779.29 | 82.25 |
| 779.36 | 82.5 |
| 779.43 | 82.75 |
| 779.5 | 83 |
| 779.57 | 83.25 |
| 779.64 | 83.25 |
| 779.7 | 83.25 |
| 779.77 | 83.5 |
| 779.84 | 83.75 |
| 779.91 | 84 |
| 779.98 | 84.25 |
| 780.04 | 84.5 |
| 780.11 | 84.75 |
| 780.18 | 85 |
| 780.25 | 85 |
| 780.32 | 85.25 |
| 780.39 | 85.5 |
| 780.45 | 85.5 |
| 780.52 | 85.75 |
| 780.59 | 86 |
| 780.66 | 86 |
| 780.73 | 86.25 |
| 780.79 | 86.5 |
| 780.86 | 86.5 |
| 780.93 | 87 |
| 781.0 | 87 |
| 781.07 | 87.25 |
| 781.14 | 87.5 |
| 781.2 | 87.75 |
| 781.27 | 87.75 |
| 781.34 | 87.75 |
| 781.41 | 88 |
| 781.48 | 88.25 |
| 781.54 | 88.25 |
| 781.61 | 88.5 |
| 781.68 | 88.75 |
| 781.75 | 89 |
| 781.82 | 89.25 |
| 781.89 | 89.25 |
| 781.95 | 89.5 |
| 782.02 | 89.75 |
| 782.09 | 89.75 |
| 782.16 | 90 |
| 782.23 | 90 |
| 782.29 | 90.25 |
| 782.36 | 90.5 |
| 782.43 | 90.5 |
| 782.5 | 90.75 |
| 782.57 | 90.75 |
| 782.64 | 91.25 |
| 782.7 | 91.25 |
| 782.77 | 91.5 |
| 782.84 | 91.5 |
| 782.91 | 91.5 |
| 782.98 | 92 |
| 783.04 | 92 |
| 783.11 | 92.25 |
| 783.18 | 92.25 |
| 783.25 | 92.5 |
| 783.32 | 92.75 |
| 783.39 | 93 |
| 783.45 | 93 |
| 783.52 | 93.25 |
| 783.59 | 93.25 |
| 783.66 | 93.5 |
| 783.73 | 93.5 |
| 783.79 | 93.75 |
| 783.86 | 93.75 |
| 783.93 | 94 |
| 784.0 | 94.25 |
| 784.07 | 94.25 |
| 784.14 | 94.5 |
| 784.2 | 94.75 |
| 784.27 | 94.75 |
| 784.34 | 95 |
| 784.41 | 95.25 |
| 784.48 | 95.25 |
| 784.54 | 95.25 |
| 784.61 | 95.5 |
| 784.68 | 95.5 |
| 784.75 | 95.75 |
| 784.82 | 96 |
| 784.89 | 96 |
| 784.95 | 96.25 |
| 785.02 | 96.25 |
| 785.09 | 96.5 |
| 785.16 | 96.75 |
| 785.23 | 96.75 |
| 785.29 | 97 |
| 785.36 | 97 |
| 785.43 | 97 |
| 785.5 | 97.25 |
| 785.57 | 97.25 |
| 785.64 | 97.5 |
| 785.7 | 97.75 |
| 785.77 | 97.75 |
| 785.84 | 98 |
| 785.91 | 98 |
| 785.98 | 98.25 |
| 786.04 | 98.25 |
| 786.11 | 98.5 |
| 786.18 | 98.5 |
| 786.25 | 98.75 |
| 786.32 | 98.75 |
| 786.39 | 99 |
| 786.45 | 99 |
| 786.52 | 99.25 |
| 786.59 | 99.25 |
| 786.66 | 99.5 |
| 786.73 | 99.5 |
| 786.79 | 99.75 |
| 786.86 | 99.75 |
| 786.93 | 100 |
| 787.0 | 100 |
| 787.07 | 100 |
| 787.14 | 100.25 |
| 787.21 | 100.25 |
| 787.27 | 100.5 |
| 787.34 | 100.5 |
| 787.41 | 100.5 |
| 787.48 | 100.75 |
| 787.55 | 100.75 |
| 787.61 | 101 |
| 787.68 | 101 |
| 787.75 | 101 |
| 787.82 | 101 |
| 787.89 | 101.25 |
| 787.96 | 101.25 |
| 788.02 | 101.25 |
| 788.09 | 101.25 |
| 788.16 | 101.25 |
| 788.23 | 101.25 |
| 788.3 | 101 |
| 788.37 | 101.25 |
| 788.43 | 101.25 |
| 788.5 | 101.25 |
| 788.57 | 101 |
| 788.64 | 101 |
| 788.71 | 101 |
| 788.78 | 100.5 |
| 788.84 | 100.25 |
| 788.91 | 99.75 |
| 788.98 | 99.75 |
| 789.05 | 99.25 |
| 789.11 | 99 |
| 789.18 | 98.5 |
| 789.25 | 98 |
| 789.32 | 97.5 |
| 789.39 | 97 |
| 789.46 | 97 |
| 789.52 | 96.5 |
| 789.59 | 96 |
| 789.66 | 95.5 |
| 789.73 | 94.75 |
| 789.8 | 94.25 |
| 789.86 | 93.75 |
| 789.93 | 93.25 |
| 790.0 | 92.5 |
| 790.07 | 92 |
| 790.14 | 91.5 |
| 790.21 | 91 |
| 790.27 | 91 |
| 790.34 | 90.5 |
| 790.41 | 90 |
| 790.48 | 89.5 |
| 790.55 | 89 |
| 790.61 | 88.5 |
| 790.68 | 88 |
| 790.75 | 87.5 |
| 790.82 | 87 |
| 790.89 | 86.5 |
| 790.96 | 86 |
| 791.02 | 85.75 |
| 791.09 | 85.75 |
| 791.16 | 85 |
| 791.23 | 84.75 |
| 791.3 | 84.25 |
| 791.36 | 84 |
| 791.43 | 83.5 |
| 791.5 | 83 |
| 791.57 | 82.75 |
| 791.64 | 82.25 |
| 791.7 | 82 |
| 791.77 | 81.5 |
| 791.84 | 81.25 |
| 791.91 | 81.25 |
| 791.98 | 81 |
| 792.04 | 80.5 |
| 792.11 | 80.25 |
| 792.18 | 80 |
| 792.25 | 79.5 |
| 792.32 | 79.25 |
| 792.39 | 78.75 |
| 792.45 | 78.5 |
| 792.52 | 78.25 |
| 792.59 | 78 |
| 792.66 | 77.5 |
| 792.73 | 77.5 |
| 792.79 | 77.25 |
| 792.86 | 77.25 |
| 792.93 | 76.75 |
| 793.0 | 76.5 |
| 793.07 | 76.25 |
| 793.14 | 76 |
| 793.2 | 75.5 |
| 793.27 | 75.25 |
| 793.34 | 75 |
| 793.41 | 74.75 |
| 793.48 | 74.75 |
| 793.54 | 74.5 |
| 793.61 | 74.25 |
| 793.68 | 74 |
| 793.75 | 73.75 |
| 793.82 | 73.5 |
| 793.88 | 73.25 |
| 793.95 | 73 |
| 794.02 | 72.75 |
| 794.09 | 72.5 |
| 794.16 | 72.25 |
| 794.22 | 72 |
| 794.29 | 72 |
| 794.36 | 71.75 |
| 794.43 | 71.5 |
| 794.5 | 71.25 |
| 794.57 | 71 |
| 794.63 | 71 |
| 794.7 | 70.75 |
| 794.77 | 70.5 |
| 794.84 | 70.25 |
| 794.91 | 70 |
| 794.97 | 69.75 |
| 795.04 | 69.5 |
| 795.11 | 69.5 |
| 795.18 | 69.25 |
| 795.25 | 69 |
| 795.32 | 68.75 |
| 795.38 | 68.5 |
| 795.45 | 68.5 |
| 795.52 | 68.25 |
| 795.59 | 68.25 |
| 795.66 | 68.25 |
| 795.72 | 68.5 |
| 795.79 | 68.5 |
| 795.86 | 68.75 |
| 795.93 | 68.75 |
| 796.0 | 68.75 |
| 796.07 | 68.75 |
| 796.13 | 68.75 |
| 796.2 | 69 |
| 796.27 | 69 |
| 796.34 | 69 |
| 796.41 | 69 |
| 796.47 | 69.25 |
| 796.54 | 69.25 |
| 796.61 | 69.5 |
| 796.68 | 69.5 |
| 796.75 | 69.5 |
| 796.82 | 69.5 |
| 796.88 | 69.75 |
| 796.95 | 69.75 |
| 797.02 | 69.75 |
| 797.09 | 69.75 |
| 797.16 | 69.75 |
| 797.23 | 69.75 |
| 797.29 | 69.75 |
| 797.36 | 70 |
| 797.43 | 70 |
| 797.5 | 70 |
| 797.57 | 70 |
| 797.64 | 70 |
| 797.7 | 70 |
| 797.77 | 70 |
| 797.84 | 70 |
| 797.91 | 69.75 |
| 797.98 | 69.75 |
| 798.04 | 69.75 |
| 798.11 | 69.75 |
| 798.18 | 69.5 |
| 798.25 | 69.5 |
| 798.32 | 69.5 |
| 798.39 | 69.5 |
| 798.45 | 69.5 |
| 798.52 | 69.25 |
| 798.59 | 69.25 |
| 798.66 | 69.25 |
| 798.73 | 69.25 |
| 798.8 | 69 |
| 798.86 | 69 |
| 798.93 | 69 |
| 799.0 | 69 |
| 799.07 | 68.75 |
| 799.14 | 68.75 |
| 799.21 | 68.75 |
| 799.27 | 68.75 |
| 799.34 | 68.5 |
| 799.41 | 68.5 |
| 799.48 | 68.5 |
| 799.55 | 68.25 |
| 799.62 | 68.25 |
| 799.68 | 68.25 |
| 799.75 | 68.25 |
| 799.82 | 68 |
| 799.89 | 68 |
| 799.96 | 68 |
| 800.02 | 68 |
| 800.09 | 68 |
| 800.16 | 67.75 |
| 800.23 | 67.75 |
| 800.3 | 67.75 |
| 800.36 | 67.75 |
| 800.43 | 67.5 |
| 800.5 | 67.5 |
| 800.57 | 67.5 |
| 800.64 | 67.5 |
| 800.71 | 67.5 |
| 800.78 | 67.5 |
| 800.84 | 67.5 |
| 800.91 | 67.5 |
| 800.98 | 67.75 |
| 801.05 | 68 |
| 801.12 | 68.25 |
| 801.18 | 69 |
| 801.25 | 69.25 |
| 801.32 | 69.75 |
| 801.39 | 70.25 |
| 801.46 | 70.5 |
| 801.52 | 70.75 |
| 801.59 | 71.25 |
| 801.66 | 71.5 |
| 801.73 | 71.5 |
| 801.8 | 71.75 |
| 801.86 | 72 |
| 801.93 | 72.5 |
| 802.0 | 72.75 |
| 802.07 | 73 |
| 802.14 | 73.5 |
| 802.21 | 73.75 |
| 802.28 | 74.25 |
| 802.34 | 74.25 |
| 802.41 | 74.75 |
| 802.48 | 75 |
| 802.55 | 75 |
| 802.62 | 75.25 |
| 802.68 | 75.75 |
| 802.75 | 76 |
| 802.82 | 76.25 |
| 802.89 | 76.5 |
| 802.96 | 76.75 |
| 803.02 | 77 |
| 803.09 | 77.25 |
| 803.16 | 77.5 |
| 803.23 | 78 |
| 803.3 | 78.25 |
| 803.36 | 78.25 |
| 803.43 | 78.5 |
| 803.5 | 78.75 |
| 803.57 | 79 |
| 803.64 | 79.25 |
| 803.71 | 79.5 |
| 803.77 | 80 |
| 803.84 | 80.25 |
| 803.91 | 80.25 |
| 803.98 | 80.75 |
| 804.05 | 80.75 |
| 804.11 | 81 |
| 804.18 | 81 |
| 804.25 | 81.5 |
| 804.32 | 81.75 |
| 804.39 | 81.75 |
| 804.46 | 82 |
| 804.53 | 82.25 |
| 804.59 | 82.75 |
| 804.66 | 82.75 |
| 804.73 | 83 |
| 804.8 | 83.25 |
| 804.87 | 83.5 |
| 804.93 | 83.75 |
| 805.0 | 83.75 |
| 805.07 | 84 |
| 805.14 | 84.25 |
| 805.21 | 84.5 |
| 805.27 | 84.75 |
| 805.34 | 85 |
| 805.41 | 85 |
| 805.48 | 85.25 |
| 805.55 | 85.5 |
| 805.61 | 85.75 |
| 805.68 | 85.75 |
| 805.75 | 86 |
| 805.82 | 86 |
| 805.89 | 86.25 |
| 805.96 | 86.5 |
| 806.02 | 86.5 |
| 806.09 | 87 |
| 806.16 | 87 |
| 806.23 | 87.25 |
| 806.3 | 87.5 |
| 806.36 | 87.75 |
| 806.43 | 87.75 |
| 806.5 | 88 |
| 806.57 | 88.25 |
| 806.64 | 88.25 |
| 806.71 | 88.5 |
| 806.77 | 88.5 |
| 806.84 | 88.75 |
| 806.91 | 89 |
| 806.98 | 89.25 |
| 807.05 | 89.25 |
| 807.11 | 89.5 |
| 807.18 | 89.75 |
| 807.25 | 90 |
| 807.32 | 90 |
| 807.39 | 90.25 |
| 807.46 | 90.25 |
| 807.52 | 90.5 |
| 807.59 | 90.5 |
| 807.66 | 90.75 |
| 807.73 | 91 |
| 807.8 | 91 |
| 807.86 | 91.25 |
| 807.93 | 91.5 |
| 808.0 | 91.75 |
| 808.07 | 91.75 |
| 808.14 | 92 |
| 808.21 | 92.25 |
| 808.27 | 92.25 |
| 808.34 | 92.25 |
| 808.41 | 92.5 |
| 808.48 | 92.75 |
| 808.55 | 92.75 |
| 808.61 | 93 |
| 808.68 | 93 |
| 808.75 | 93.25 |
| 808.82 | 93.25 |
| 808.89 | 93.5 |
| 808.96 | 93.75 |
| 809.02 | 94 |
| 809.09 | 94 |
| 809.16 | 94 |
| 809.23 | 94.25 |
| 809.3 | 94.25 |
| 809.36 | 94.5 |
| 809.43 | 94.75 |
| 809.5 | 94.75 |
| 809.57 | 95 |
| 809.64 | 95.25 |
| 809.71 | 95.25 |
| 809.77 | 95.5 |
| 809.84 | 95.75 |
| 809.91 | 95.75 |
| 809.98 | 95.75 |
| 810.05 | 96 |
| 810.11 | 96 |
| 810.18 | 96.25 |
| 810.25 | 96.25 |
| 810.32 | 96.5 |
| 810.39 | 96.5 |
| 810.46 | 96.75 |
| 810.52 | 97 |
| 810.59 | 97 |
| 810.66 | 97 |
| 810.73 | 97 |
| 810.8 | 97.25 |
| 810.86 | 97.5 |
| 810.93 | 97.5 |
| 811.0 | 97.75 |
| 811.07 | 97.75 |
| 811.14 | 98 |
| 811.21 | 98 |
| 811.27 | 98.25 |
| 811.34 | 98.5 |
| 811.41 | 98.5 |
| 811.48 | 98.75 |
| 811.55 | 98.75 |
| 811.61 | 98.75 |
| 811.68 | 99 |
| 811.75 | 99 |
| 811.82 | 99.25 |
| 811.89 | 99.25 |
| 811.96 | 99.5 |
| 812.02 | 99.5 |
| 812.09 | 99.75 |
| 812.16 | 99.75 |
| 812.23 | 99.75 |
| 812.3 | 100 |
| 812.36 | 100 |
| 812.43 | 100.25 |
| 812.5 | 100.25 |
| 812.57 | 100.25 |
| 812.64 | 100.5 |
| 812.71 | 100.5 |
| 812.78 | 100.5 |
| 812.84 | 100.75 |
| 812.91 | 100.75 |
| 812.98 | 101 |
| 813.05 | 101 |
| 813.12 | 101 |
| 813.19 | 101 |
| 813.25 | 101 |
| 813.32 | 101.25 |
| 813.39 | 101.25 |
| 813.46 | 101.25 |
| 813.53 | 101.25 |
| 813.59 | 101.25 |
| 813.66 | 101.25 |
| 813.73 | 101.25 |
| 813.8 | 101 |
| 813.87 | 101 |
| 813.94 | 101 |
| 814.0 | 101 |
| 814.07 | 100.5 |
| 814.14 | 100 |
| 814.21 | 99.75 |
| 814.28 | 99.75 |
| 814.34 | 99.25 |
| 814.41 | 99 |
| 814.48 | 98.5 |
| 814.55 | 98 |
| 814.62 | 97.5 |
| 814.69 | 97 |
| 814.75 | 96.5 |
| 814.82 | 96.5 |
| 814.89 | 96 |
| 814.96 | 95.5 |
| 815.03 | 95 |
| 815.09 | 94.25 |
| 815.16 | 93.75 |
| 815.23 | 93.25 |
| 815.3 | 92.5 |
| 815.37 | 92.25 |
| 815.43 | 91.5 |
| 815.5 | 91 |
| 815.57 | 90.5 |
| 815.64 | 90.5 |
| 815.71 | 90 |
| 815.78 | 89.5 |
| 815.84 | 89 |
| 815.91 | 88.5 |
| 815.98 | 88 |
| 816.05 | 87.5 |
| 816.12 | 87 |
| 816.18 | 86.5 |
| 816.25 | 86 |
| 816.32 | 85.5 |
| 816.39 | 85.25 |
| 816.46 | 85.25 |
| 816.53 | 84.75 |
| 816.59 | 84.5 |
| 816.66 | 84 |
| 816.73 | 83.75 |
| 816.8 | 83.25 |
| 816.86 | 82.75 |
| 816.93 | 82.5 |
| 817.0 | 82 |
| 817.07 | 81.75 |
| 817.14 | 81.25 |
| 817.21 | 81 |
| 817.27 | 81 |
| 817.34 | 80.75 |
| 817.41 | 80.25 |
| 817.48 | 80 |
| 817.55 | 79.75 |
| 817.61 | 79.25 |
| 817.68 | 79 |
| 817.75 | 78.75 |
| 817.82 | 78.25 |
| 817.89 | 78 |
| 817.96 | 77.75 |
| 818.02 | 77.5 |
| 818.09 | 77.5 |
| 818.16 | 77.25 |
| 818.23 | 76.75 |
| 818.29 | 76.5 |
| 818.36 | 76.25 |
| 818.43 | 76 |
| 818.5 | 75.75 |
| 818.57 | 75.25 |
| 818.64 | 75 |
| 818.71 | 74.75 |
| 818.77 | 74.5 |
| 818.84 | 74.25 |
| 818.91 | 74.25 |
| 818.98 | 74 |
| 819.04 | 73.75 |
| 819.11 | 73.5 |
| 819.18 | 73.25 |
| 819.25 | 73 |
| 819.32 | 72.75 |
| 819.39 | 72.5 |
| 819.45 | 72.25 |
| 819.52 | 72 |
| 819.59 | 71.75 |
| 819.66 | 71.5 |
| 819.73 | 71.5 |
| 819.79 | 71.25 |
| 819.86 | 71 |
| 819.93 | 71 |
| 820.0 | 70.75 |
| 820.07 | 70.5 |
| 820.14 | 70.25 |
| 820.2 | 70 |
| 820.27 | 69.75 |
| 820.34 | 69.5 |
| 820.41 | 69.25 |
| 820.47 | 69 |
| 820.54 | 69 |
| 820.61 | 68.75 |
| 820.68 | 68.5 |
| 820.75 | 68.5 |
| 820.82 | 68.25 |
| 820.89 | 68.25 |
| 820.95 | 68.25 |
| 821.02 | 68.5 |
| 821.09 | 68.5 |
| 821.16 | 68.5 |
| 821.23 | 68.75 |
| 821.29 | 68.75 |
| 821.36 | 68.75 |
| 821.43 | 68.75 |
| 821.5 | 69 |
| 821.57 | 69 |
| 821.64 | 69 |
| 821.7 | 69.25 |
| 821.77 | 69.25 |
| 821.84 | 69.25 |
| 821.91 | 69.25 |
| 821.98 | 69.5 |
| 822.04 | 69.5 |
| 822.11 | 69.75 |
| 822.18 | 69.75 |
| 822.25 | 69.75 |
| 822.32 | 69.75 |
| 822.39 | 69.75 |
| 822.46 | 69.75 |
| 822.52 | 69.75 |
| 822.59 | 69.75 |
| 822.66 | 69.75 |
| 822.73 | 69.75 |
| 822.8 | 70 |
| 822.86 | 70 |
| 822.93 | 70 |
| 823.0 | 70 |
| 823.07 | 69.75 |
| 823.14 | 70 |
| 823.21 | 69.75 |
| 823.27 | 69.75 |
| 823.34 | 69.75 |
| 823.41 | 69.75 |
| 823.48 | 69.75 |
| 823.55 | 69.75 |
| 823.62 | 69.5 |
| 823.68 | 69.5 |
| 823.75 | 69.25 |
| 823.82 | 69.25 |
| 823.89 | 69.25 |
| 823.96 | 69.25 |
| 824.03 | 69.25 |
| 824.09 | 69.25 |
| 824.16 | 69 |
| 824.23 | 69 |
| 824.3 | 69 |
| 824.37 | 68.75 |
| 824.43 | 68.75 |
| 824.5 | 68.75 |
| 824.57 | 68.75 |
| 824.64 | 68.75 |
| 824.71 | 68.5 |
| 824.78 | 68.5 |
| 824.84 | 68.5 |
| 824.91 | 68.5 |
| 824.98 | 68.25 |
| 825.05 | 68.25 |
| 825.12 | 68.25 |
| 825.19 | 68.25 |
| 825.25 | 68 |
| 825.32 | 68 |
| 825.39 | 68 |
| 825.46 | 68 |
| 825.53 | 67.75 |
| 825.59 | 67.75 |
| 825.66 | 67.75 |
| 825.73 | 67.75 |
| 825.8 | 67.75 |
| 825.87 | 67.5 |
| 825.94 | 67.5 |
| 826.0 | 67.5 |
| 826.07 | 67.5 |
| 826.14 | 67.5 |
| 826.21 | 67.75 |
| 826.28 | 67.75 |
| 826.34 | 68 |
| 826.41 | 68.25 |
| 826.48 | 68.75 |
| 826.55 | 69.25 |
| 826.62 | 69.5 |
| 826.69 | 70 |
| 826.75 | 70.5 |
| 826.82 | 70.75 |
| 826.89 | 71 |
| 826.96 | 71.25 |
| 827.03 | 71.75 |
| 827.09 | 71.75 |
| 827.16 | 72 |
| 827.23 | 72.25 |
| 827.3 | 72.5 |
| 827.37 | 73 |
| 827.44 | 73.25 |
| 827.5 | 73.5 |
| 827.57 | 73.75 |
| 827.64 | 74 |
| 827.71 | 74.25 |
| 827.78 | 74.75 |
| 827.84 | 75 |
| 827.91 | 75 |
| 827.98 | 75.25 |
| 828.05 | 75.5 |
| 828.12 | 76 |
| 828.19 | 76.25 |
| 828.25 | 76.5 |
| 828.32 | 76.75 |
| 828.39 | 77 |
| 828.46 | 77.25 |
| 828.53 | 77.5 |
| 828.59 | 77.75 |
| 828.66 | 78 |
| 828.73 | 78 |
| 828.8 | 78.25 |
| 828.87 | 78.75 |
| 828.94 | 78.75 |
| 829.0 | 79.25 |
| 829.07 | 79.5 |
| 829.14 | 79.75 |
| 829.21 | 80 |
| 829.28 | 80.25 |
| 829.34 | 80.5 |
| 829.41 | 80.75 |
| 829.48 | 81 |
| 829.55 | 81 |
| 829.62 | 81.25 |
| 829.69 | 81.5 |
| 829.75 | 81.75 |
| 829.82 | 82 |
| 829.89 | 82 |
| 829.96 | 82.25 |
| 830.03 | 82.5 |
| 830.09 | 82.75 |
| 830.16 | 83 |
| 830.23 | 83.25 |
| 830.3 | 83.5 |
| 830.37 | 83.5 |
| 830.44 | 83.75 |
| 830.5 | 84 |
| 830.57 | 84.25 |
| 830.64 | 84.5 |
| 830.71 | 84.5 |
| 830.78 | 84.75 |
| 830.84 | 85 |
| 830.91 | 85 |
| 830.98 | 85.5 |
| 831.05 | 85.5 |
| 831.12 | 85.75 |
| 831.19 | 85.75 |
| 831.25 | 86 |
| 831.32 | 86.25 |
| 831.39 | 86.5 |
| 831.46 | 86.5 |
| 831.53 | 86.75 |
| 831.59 | 87 |
| 831.66 | 87 |
| 831.73 | 87.25 |
| 831.8 | 87.5 |
| 831.87 | 87.75 |
| 831.94 | 87.75 |
| 832.0 | 87.75 |
| 832.07 | 88 |
| 832.14 | 88 |
| 832.21 | 88.25 |
| 832.28 | 88.5 |
| 832.34 | 88.5 |
| 832.41 | 89 |
| 832.48 | 89 |
| 832.55 | 89 |
| 832.62 | 89.25 |
| 832.69 | 89.5 |
| 832.75 | 89.5 |
| 832.82 | 89.5 |
| 832.89 | 89.75 |
| 832.96 | 90 |
| 833.03 | 90.25 |
| 833.09 | 90.25 |
| 833.16 | 90.5 |
| 833.23 | 90.5 |
| 833.3 | 90.75 |
| 833.37 | 91 |
| 833.44 | 91 |
| 833.5 | 91.25 |
| 833.57 | 91.5 |
| 833.64 | 91.5 |
| 833.71 | 91.75 |
| 833.78 | 91.75 |
| 833.84 | 92 |
| 833.91 | 92.25 |
| 833.98 | 92.25 |
| 834.05 | 92.5 |
| 834.12 | 92.75 |
| 834.19 | 92.75 |
| 834.25 | 93 |
| 834.32 | 93.25 |
| 834.39 | 93.25 |
| 834.46 | 93.25 |
| 834.53 | 93.5 |
| 834.59 | 93.5 |
| 834.66 | 93.75 |
| 834.73 | 93.75 |
| 834.8 | 94 |
| 834.87 | 94.25 |
| 834.94 | 94.25 |
| 835.0 | 94.5 |
| 835.07 | 94.5 |
| 835.14 | 94.75 |
| 835.21 | 95 |
| 835.28 | 95 |
| 835.34 | 95 |
| 835.41 | 95.25 |
| 835.48 | 95.25 |
| 835.55 | 95.5 |
| 835.62 | 95.75 |
| 835.69 | 95.75 |
| 835.75 | 96 |
| 835.82 | 96 |
| 835.89 | 96.25 |
| 835.96 | 96.5 |
| 836.03 | 96.5 |
| 836.09 | 96.5 |
| 836.16 | 96.75 |
| 836.23 | 96.75 |
| 836.3 | 97 |
| 836.37 | 97 |
| 836.43 | 97.25 |
| 836.5 | 97.25 |
| 836.57 | 97.5 |
| 836.64 | 97.75 |
| 836.71 | 97.75 |
| 836.78 | 97.75 |
| 836.84 | 98 |
| 836.91 | 98 |
| 836.98 | 98 |
| 837.05 | 98.25 |
| 837.12 | 98.5 |
| 837.19 | 98.5 |
| 837.25 | 98.5 |
| 837.32 | 98.75 |
| 837.39 | 99 |
| 837.46 | 99 |
| 837.53 | 99.25 |
| 837.59 | 99.25 |
| 837.66 | 99.5 |
| 837.73 | 99.5 |
| 837.8 | 99.5 |
| 837.87 | 99.5 |
| 837.94 | 99.75 |
| 838.0 | 99.75 |
| 838.07 | 100 |
| 838.14 | 100 |
| 838.21 | 100 |
| 838.28 | 100.25 |
| 838.34 | 100.25 |
| 838.41 | 100.5 |
| 838.48 | 100.5 |
| 838.55 | 100.5 |
| 838.62 | 100.5 |
| 838.69 | 100.75 |
| 838.76 | 100.75 |
| 838.82 | 100.75 |
| 838.89 | 101 |
| 838.96 | 101 |
| 839.03 | 101 |
| 839.1 | 101 |
| 839.16 | 101 |
| 839.23 | 101 |
| 839.3 | 101 |
| 839.37 | 101 |
| 839.44 | 101 |
| 839.51 | 101 |
| 839.57 | 101 |
| 839.64 | 101 |
| 839.71 | 101 |
| 839.78 | 100.25 |
| 839.85 | 100 |
| 839.91 | 99.75 |
| 839.98 | 99.5 |
| 840.05 | 99.25 |
| 840.12 | 98.75 |
| 840.19 | 98.25 |
| 840.26 | 98.25 |
| 840.32 | 97.75 |
| 840.39 | 97.5 |
| 840.46 | 96.75 |
| 840.53 | 96.25 |
| 840.6 | 95.75 |
| 840.66 | 95.25 |
| 840.73 | 94.75 |
| 840.8 | 94.25 |
| 840.87 | 93.75 |
| 840.94 | 93.25 |
| 841.01 | 92.5 |
| 841.07 | 92.5 |
| 841.14 | 92 |
| 841.21 | 91.5 |
| 841.28 | 91 |
| 841.35 | 90.5 |
| 841.41 | 90 |
| 841.48 | 89.5 |
| 841.55 | 89 |
| 841.62 | 88.25 |
| 841.69 | 88 |
| 841.75 | 87.5 |
| 841.82 | 87 |
| 841.89 | 87 |
| 841.96 | 86.5 |
| 842.03 | 86 |
| 842.09 | 85.5 |
| 842.16 | 85 |
| 842.23 | 84.75 |
| 842.3 | 84.5 |
| 842.37 | 84 |
| 842.44 | 83.5 |
| 842.5 | 83 |
| 842.57 | 82.75 |
| 842.64 | 82.5 |
| 842.71 | 82.5 |
| 842.78 | 82.25 |
| 842.84 | 81.75 |
| 842.91 | 81.25 |
| 842.98 | 81 |
| 843.05 | 80.5 |
| 843.12 | 80.25 |
| 843.19 | 80 |
| 843.25 | 79.5 |
| 843.32 | 79.25 |
| 843.39 | 78.75 |
| 843.46 | 78.75 |
| 843.53 | 78.75 |
| 843.59 | 78.25 |
| 843.66 | 78 |
| 843.73 | 77.5 |
| 843.8 | 77.25 |
| 843.87 | 77 |
| 843.93 | 76.75 |
| 844.0 | 76.5 |
| 844.07 | 76.25 |
| 844.14 | 76 |
| 844.21 | 75.5 |
| 844.28 | 75.5 |
| 844.34 | 75.25 |
| 844.41 | 75 |
| 844.48 | 74.75 |
| 844.55 | 74.5 |
| 844.62 | 74.25 |
| 844.68 | 74 |
| 844.75 | 73.75 |
| 844.82 | 73.5 |
| 844.89 | 73.25 |
| 844.96 | 73 |
| 845.03 | 72.75 |
| 845.09 | 72.75 |
| 845.16 | 72.5 |
| 845.23 | 72.25 |
| 845.3 | 72 |
| 845.36 | 71.75 |
| 845.43 | 71.5 |
| 845.5 | 71.5 |
| 845.57 | 71.25 |
| 845.64 | 71 |
| 845.71 | 70.75 |
| 845.77 | 70.5 |
| 845.84 | 70.25 |
| 845.91 | 70.25 |
| 845.98 | 70 |
| 846.05 | 69.75 |
| 846.11 | 69.5 |
| 846.18 | 69.25 |
| 846.25 | 69 |
| 846.32 | 68.75 |
| 846.39 | 68.75 |
| 846.46 | 68.5 |
| 846.52 | 68.25 |
| 846.59 | 68 |
| 846.66 | 68.25 |
| 846.73 | 68.25 |
| 846.8 | 68.25 |
| 846.86 | 68.5 |
| 846.93 | 68.5 |
| 847.0 | 68.75 |
| 847.07 | 68.75 |
| 847.14 | 68.75 |
| 847.21 | 69 |
| 847.28 | 69 |
| 847.34 | 69.25 |
| 847.41 | 69.25 |
| 847.48 | 69.25 |
| 847.55 | 69.25 |
| 847.62 | 69.5 |
| 847.68 | 69.5 |
| 847.75 | 69.75 |
| 847.82 | 69.75 |
| 847.89 | 69.75 |
| 847.96 | 70 |
| 848.03 | 70 |
| 848.09 | 70.25 |
| 848.16 | 70.25 |
| 848.23 | 70.25 |
| 848.3 | 70.5 |
| 848.37 | 70.5 |
| 848.44 | 70.5 |
| 848.5 | 70.5 |
| 848.57 | 70.5 |
| 848.64 | 70.5 |
| 848.71 | 70.5 |
| 848.78 | 70.5 |
| 848.84 | 70.5 |
| 848.91 | 70.25 |
| 848.98 | 70.25 |
| 849.05 | 70.25 |
| 849.12 | 70.25 |
| 849.19 | 70 |
| 849.25 | 70 |
| 849.32 | 70 |
| 849.39 | 69.75 |
| 849.46 | 69.75 |
| 849.53 | 69.75 |
| 849.59 | 69.75 |
| 849.66 | 69.5 |
| 849.73 | 69.5 |
| 849.8 | 69.25 |
| 849.87 | 69.25 |
| 849.94 | 69.25 |
| 850.0 | 69.25 |
| 850.07 | 69.25 |
| 850.14 | 69.25 |
| 850.21 | 69.25 |
| 850.28 | 69 |
| 850.34 | 69 |
| 850.41 | 68.75 |
| 850.48 | 68.75 |
| 850.55 | 68.75 |
| 850.62 | 68.5 |
| 850.69 | 68.5 |
| 850.76 | 68.5 |
| 850.82 | 68.5 |
| 850.89 | 68.5 |
| 850.96 | 68.25 |
| 851.03 | 68.25 |
| 851.1 | 68.25 |
| 851.16 | 68.25 |
| 851.23 | 68.25 |
| 851.3 | 68 |
| 851.37 | 68 |
| 851.44 | 67.75 |
| 851.51 | 67.75 |
| 851.57 | 67.75 |
| 851.64 | 67.75 |
| 851.71 | 67.75 |
| 851.78 | 67.5 |
| 851.85 | 67.5 |
| 851.91 | 67.75 |
| 851.98 | 67.75 |
| 852.05 | 68 |
| 852.12 | 68.25 |
| 852.19 | 68.5 |
| 852.26 | 69.25 |
| 852.32 | 69.5 |
| 852.39 | 70 |
| 852.46 | 70.5 |
| 852.53 | 70.5 |
| 852.6 | 70.75 |
| 852.66 | 71 |
| 852.73 | 71.5 |
| 852.8 | 71.75 |
| 852.87 | 72 |
| 852.94 | 72.25 |
| 853.01 | 72.75 |
| 853.07 | 73 |
| 853.14 | 73.25 |
| 853.21 | 73.5 |
| 853.28 | 74 |
| 853.35 | 74 |
| 853.41 | 74.25 |
| 853.48 | 74.5 |
| 853.55 | 74.75 |
| 853.62 | 75 |
| 853.69 | 75.5 |
| 853.76 | 75.75 |
| 853.82 | 76 |
| 853.89 | 76.25 |
| 853.96 | 76.5 |
| 854.03 | 76.75 |
| 854.1 | 77.25 |
| 854.16 | 77.25 |
| 854.23 | 77.25 |
| 854.3 | 77.75 |
| 854.37 | 78 |
| 854.44 | 78.25 |
| 854.51 | 78.5 |
| 854.57 | 78.75 |
| 854.64 | 79 |
| 854.71 | 79.25 |
| 854.78 | 79.5 |
| 854.85 | 79.75 |
| 854.91 | 80 |
| 854.98 | 80 |
| 855.05 | 80.25 |
| 855.12 | 80.5 |
| 855.19 | 80.75 |
| 855.26 | 81 |
| 855.32 | 81.25 |
| 855.39 | 81.5 |
| 855.46 | 81.75 |
| 855.53 | 82.25 |
| 855.6 | 82.25 |
| 855.66 | 82.5 |
| 855.73 | 82.75 |
| 855.8 | 82.75 |
| 855.87 | 83 |
| 855.94 | 83.25 |
| 856.01 | 83.5 |
| 856.07 | 83.75 |
| 856.14 | 83.75 |
| 856.21 | 84 |
| 856.28 | 84.25 |
| 856.35 | 84.5 |
| 856.41 | 84.75 |
| 856.48 | 85 |
| 856.55 | 85.25 |
| 856.62 | 85.25 |
| 856.69 | 85.25 |
| 856.76 | 85.75 |
| 856.82 | 85.75 |
| 856.89 | 86 |
| 856.96 | 86.25 |
| 857.03 | 86.5 |
| 857.1 | 86.75 |
| 857.16 | 87 |
| 857.23 | 87 |
| 857.3 | 87.25 |
| 857.37 | 87.5 |
| 857.44 | 87.5 |
| 857.51 | 87.75 |
| 857.57 | 87.75 |
| 857.64 | 88 |
| 857.71 | 88.25 |
| 857.78 | 88.5 |
| 857.85 | 88.75 |
| 857.91 | 88.75 |
| 857.98 | 89 |
| 858.05 | 89.25 |
| 858.12 | 89.5 |
| 858.19 | 89.5 |
| 858.26 | 89.5 |
| 858.32 | 89.75 |
| 858.39 | 90 |
| 858.46 | 90 |
| 858.53 | 90.25 |
| 858.6 | 90.5 |
| 858.66 | 90.75 |
| 858.73 | 90.75 |
| 858.8 | 91 |
| 858.87 | 91.25 |
| 858.94 | 91.25 |
| 859.01 | 91.5 |
| 859.07 | 91.5 |
| 859.14 | 91.75 |
| 859.21 | 91.75 |
| 859.28 | 92 |
| 859.35 | 92.25 |
| 859.41 | 92.5 |
| 859.48 | 92.5 |
| 859.55 | 92.75 |
| 859.62 | 92.75 |
| 859.69 | 93 |
| 859.76 | 93.25 |
| 859.82 | 93.25 |
| 859.89 | 93.25 |
| 859.96 | 93.5 |
| 860.03 | 93.5 |
| 860.1 | 93.75 |
| 860.16 | 94 |
| 860.23 | 94 |
| 860.3 | 94.25 |
| 860.37 | 94.5 |
| 860.44 | 94.5 |
| 860.51 | 94.75 |
| 860.57 | 95 |
| 860.64 | 95 |
| 860.71 | 95 |
| 860.78 | 95 |
| 860.85 | 95.25 |
| 860.91 | 95.5 |
| 860.98 | 95.75 |
| 861.05 | 95.75 |
| 861.12 | 96 |
| 861.19 | 96 |
| 861.26 | 96.25 |
| 861.32 | 96.25 |
| 861.39 | 96.5 |
| 861.46 | 96.5 |
| 861.53 | 96.5 |
| 861.6 | 97 |
| 861.66 | 97 |
| 861.73 | 97 |
| 861.8 | 97.25 |
| 861.87 | 97.25 |
| 861.94 | 97.5 |
| 862.01 | 97.5 |
| 862.07 | 97.75 |
| 862.14 | 97.75 |
| 862.21 | 98 |
| 862.28 | 98 |
| 862.35 | 98 |
| 862.41 | 98.25 |
| 862.48 | 98.25 |
| 862.55 | 98.5 |
| 862.62 | 98.75 |
| 862.69 | 98.75 |
| 862.76 | 99 |
| 862.82 | 99 |
| 862.89 | 99.25 |
| 862.96 | 99.25 |
| 863.03 | 99.5 |
| 863.1 | 99.5 |
| 863.16 | 99.5 |
| 863.23 | 99.75 |
| 863.3 | 99.75 |
| 863.37 | 99.75 |
| 863.44 | 100 |
| 863.51 | 100.25 |
| 863.58 | 100.25 |
| 863.64 | 100.25 |
| 863.71 | 100.5 |
| 863.78 | 100.5 |
| 863.85 | 100.5 |
| 863.92 | 100.75 |
| 863.98 | 100.75 |
| 864.05 | 100.75 |
| 864.12 | 100.75 |
| 864.19 | 101 |
| 864.26 | 101 |
| 864.33 | 101 |
| 864.39 | 101 |
| 864.46 | 101 |
| 864.53 | 101 |
| 864.6 | 101 |
| 864.67 | 101 |
| 864.74 | 101 |
| 864.8 | 101 |
| 864.87 | 101 |
| 864.94 | 101 |
| 865.01 | 101 |
| 865.08 | 100.75 |
| 865.14 | 100.25 |
| 865.21 | 99.75 |
| 865.28 | 99.75 |
| 865.35 | 99.25 |
| 865.42 | 99 |
| 865.48 | 98.75 |
| 865.55 | 98.25 |
| 865.62 | 98.25 |
| 865.69 | 97.75 |
| 865.76 | 97.25 |
| 865.83 | 97 |
| 865.89 | 96.25 |
| 865.96 | 95.75 |
| 866.03 | 95.25 |
| 866.1 | 94.75 |
| 866.17 | 94 |
| 866.23 | 93.5 |
| 866.3 | 93 |
| 866.37 | 92.5 |
| 866.44 | 92.5 |
| 866.51 | 92 |
| 866.58 | 91.5 |
| 866.64 | 90.75 |
| 866.71 | 90.25 |
| 866.78 | 89.75 |
| 866.85 | 89.25 |
| 866.92 | 88.75 |
| 866.98 | 88.25 |
| 867.05 | 87.75 |
| 867.12 | 87.25 |
| 867.19 | 86.75 |
| 867.26 | 86.75 |
| 867.33 | 86.25 |
| 867.39 | 85.75 |
| 867.46 | 85.25 |
| 867.53 | 85 |
| 867.6 | 84.5 |
| 867.66 | 84 |
| 867.73 | 83.75 |
| 867.8 | 83.25 |
| 867.87 | 82.75 |
| 867.94 | 82.5 |
| 868.01 | 82.25 |
| 868.07 | 82.25 |
| 868.14 | 81.75 |
| 868.21 | 81.5 |
| 868.28 | 81 |
| 868.35 | 80.75 |
| 868.41 | 80.25 |
| 868.48 | 80 |
| 868.55 | 79.75 |
| 868.62 | 79.25 |
| 868.69 | 79 |
| 868.76 | 78.5 |
| 868.82 | 78.25 |
| 868.89 | 78.25 |
| 868.96 | 78 |
| 869.03 | 77.5 |
| 869.1 | 77.25 |
| 869.16 | 77 |
| 869.23 | 76.75 |
| 869.3 | 76.5 |
| 869.37 | 76.25 |
| 869.44 | 75.75 |
| 869.51 | 75.5 |
| 869.57 | 75.25 |
| 869.64 | 75 |
| 869.71 | 75 |
| 869.78 | 74.75 |
| 869.85 | 74.5 |
| 869.91 | 74.25 |
| 869.98 | 74 |
| 870.05 | 73.75 |
| 870.12 | 73.5 |
| 870.19 | 73.25 |
| 870.26 | 73 |
| 870.32 | 72.75 |
| 870.39 | 72.25 |
| 870.46 | 72.25 |
| 870.53 | 72.25 |
| 870.59 | 71.75 |
| 870.66 | 71.5 |
| 870.73 | 71.5 |
| 870.8 | 71.25 |
| 870.87 | 71 |
| 870.94 | 70.75 |
| 871.0 | 70.5 |
| 871.07 | 70.25 |
| 871.14 | 70 |
| 871.21 | 69.75 |
| 871.28 | 69.5 |
| 871.34 | 69.5 |
| 871.41 | 69.25 |
| 871.48 | 69 |
| 871.55 | 68.75 |
| 871.62 | 68.5 |
| 871.69 | 68.5 |
| 871.75 | 68.25 |
| 871.82 | 68.25 |
| 871.89 | 68.25 |
| 871.96 | 68.5 |
| 872.03 | 68.5 |
| 872.09 | 68.5 |
| 872.16 | 68.5 |
| 872.23 | 68.75 |
| 872.3 | 68.75 |
| 872.37 | 68.75 |
| 872.44 | 69 |
| 872.5 | 69 |
| 872.57 | 69.25 |
| 872.64 | 69.25 |
| 872.71 | 69.25 |
| 872.78 | 69.25 |
| 872.85 | 69.5 |
| 872.91 | 69.5 |
| 872.98 | 69.5 |
| 873.05 | 69.75 |
| 873.12 | 69.75 |
| 873.19 | 69.75 |
| 873.26 | 69.75 |
| 873.32 | 70 |
| 873.39 | 70 |
| 873.46 | 70 |
| 873.53 | 70 |
| 873.6 | 70.25 |
| 873.66 | 70.25 |
| 873.73 | 70.25 |
| 873.8 | 70.25 |
| 873.87 | 70.25 |
| 873.94 | 70.25 |
| 874.01 | 70.25 |
| 874.08 | 70 |
| 874.14 | 70 |
| 874.21 | 70 |
| 874.28 | 70 |
| 874.35 | 69.75 |
| 874.42 | 69.75 |
| 874.48 | 69.75 |
| 874.55 | 69.5 |
| 874.62 | 69.5 |
| 874.69 | 69.5 |
| 874.76 | 69.5 |
| 874.83 | 69.5 |
| 874.89 | 69.25 |
| 874.96 | 69.25 |
| 875.03 | 69.25 |
| 875.1 | 69 |
| 875.17 | 69 |
| 875.23 | 69 |
| 875.3 | 69 |
| 875.37 | 68.75 |
| 875.44 | 68.75 |
| 875.51 | 68.75 |
| 875.58 | 68.75 |
| 875.64 | 68.5 |
| 875.71 | 68.5 |
| 875.78 | 68.5 |
| 875.85 | 68.25 |
| 875.92 | 68.25 |
| 875.98 | 68.25 |
| 876.05 | 68.25 |
| 876.12 | 68 |
| 876.19 | 68 |
| 876.26 | 68 |
| 876.33 | 68 |
| 876.39 | 68 |
| 876.46 | 67.75 |
| 876.53 | 67.75 |
| 876.6 | 67.75 |
| 876.67 | 67.75 |
| 876.74 | 67.5 |
| 876.8 | 67.5 |
| 876.87 | 67.5 |
| 876.94 | 67.5 |
| 877.01 | 67.5 |
| 877.08 | 67.5 |
| 877.15 | 67.5 |
| 877.21 | 67.75 |
| 877.28 | 68 |
| 877.35 | 68.25 |
| 877.42 | 68.75 |
| 877.49 | 69.25 |
| 877.55 | 69.75 |
| 877.62 | 70 |
| 877.69 | 70.5 |
| 877.76 | 70.75 |
| 877.83 | 71 |
| 877.89 | 71 |
| 877.96 | 71.25 |
| 878.03 | 71.75 |
| 878.1 | 72 |
| 878.17 | 72.25 |
| 878.23 | 72.75 |
| 878.3 | 73 |
| 878.37 | 73.25 |
| 878.44 | 73.75 |
| 878.51 | 74 |
| 878.58 | 74.25 |
| 878.65 | 74.5 |
| 878.71 | 74.5 |
| 878.78 | 74.75 |
| 878.85 | 75 |
| 878.92 | 75.5 |
| 878.99 | 75.75 |
| 879.05 | 76 |
| 879.12 | 76.25 |
| 879.19 | 76.75 |
| 879.26 | 77 |
| 879.33 | 77.25 |
| 879.39 | 77.5 |
| 879.46 | 77.75 |
| 879.53 | 77.75 |
| 879.6 | 78 |
| 879.67 | 78.25 |
| 879.73 | 78.75 |
| 879.8 | 78.75 |
| 879.87 | 79.25 |
| 879.94 | 79.5 |
| 880.01 | 79.75 |
| 880.08 | 80 |
| 880.15 | 80.25 |
| 880.21 | 80.5 |
| 880.28 | 80.75 |
| 880.35 | 80.75 |
| 880.42 | 80.75 |
| 880.49 | 81.25 |
| 880.55 | 81.5 |
| 880.62 | 81.75 |
| 880.69 | 82 |
| 880.76 | 82.25 |
| 880.83 | 82.5 |
| 880.89 | 82.75 |
| 880.96 | 83 |
| 881.03 | 83 |
| 881.1 | 83.25 |
| 881.17 | 83.25 |
| 881.23 | 83.5 |
| 881.3 | 83.75 |
| 881.37 | 84 |
| 881.44 | 84.25 |
| 881.51 | 84.5 |
| 881.58 | 84.75 |
| 881.64 | 85 |
| 881.71 | 85 |
| 881.78 | 85.25 |
| 881.85 | 85.5 |
| 881.92 | 85.5 |
| 881.98 | 85.5 |
| 882.05 | 85.75 |
| 882.12 | 86 |
| 882.19 | 86.25 |
| 882.26 | 86.5 |
| 882.33 | 86.75 |
| 882.4 | 87 |
| 882.46 | 87.25 |
| 882.53 | 87.25 |
| 882.6 | 87.75 |
| 882.67 | 87.75 |
| 882.74 | 88 |
| 882.8 | 88 |
| 882.87 | 88 |
| 882.94 | 88.25 |
| 883.01 | 88.5 |
| 883.08 | 88.75 |
| 883.14 | 89 |
| 883.21 | 89.25 |
| 883.28 | 89.25 |
| 883.35 | 89.5 |
| 883.42 | 89.75 |
| 883.48 | 89.75 |
| 883.55 | 90 |
| 883.62 | 90 |
| 883.69 | 90.25 |
| 883.76 | 90.5 |
| 883.83 | 90.5 |
| 883.9 | 90.75 |
| 883.96 | 91 |
| 884.03 | 91.25 |
| 884.1 | 91.5 |
| 884.17 | 91.5 |
| 884.23 | 91.75 |
| 884.3 | 92 |
| 884.37 | 92.25 |
| 884.44 | 92.25 |
| 884.51 | 92.25 |
| 884.58 | 92.5 |
| 884.64 | 92.75 |
| 884.71 | 92.75 |
| 884.78 | 93 |
| 884.85 | 93.25 |
| 884.92 | 93.25 |
| 884.98 | 93.5 |
| 885.05 | 93.75 |
| 885.12 | 94 |
| 885.19 | 94 |
| 885.26 | 94 |
| 885.33 | 94.25 |
| 885.39 | 94.25 |
| 885.46 | 94.5 |
| 885.53 | 94.75 |
| 885.6 | 94.75 |
| 885.67 | 95 |
| 885.73 | 95.25 |
| 885.8 | 95.25 |
| 885.87 | 95.5 |
| 885.94 | 95.75 |
| 886.01 | 96 |
| 886.08 | 96 |
| 886.15 | 96 |
| 886.21 | 96.25 |
| 886.28 | 96.25 |
| 886.35 | 96.5 |
| 886.42 | 96.5 |
| 886.48 | 96.75 |
| 886.55 | 96.75 |
| 886.62 | 97 |
| 886.69 | 97 |
| 886.76 | 97.25 |
| 886.83 | 97.5 |
| 886.89 | 97.5 |
| 886.96 | 97.75 |
| 887.03 | 97.75 |
| 887.1 | 98 |
| 887.17 | 98 |
| 887.23 | 98.25 |
| 887.3 | 98.25 |
| 887.37 | 98.5 |
| 887.44 | 98.5 |
| 887.51 | 98.75 |
| 887.58 | 99 |
| 887.64 | 99 |
| 887.71 | 99 |
| 887.78 | 99.25 |
| 887.85 | 99.25 |
| 887.92 | 99.5 |
| 887.98 | 99.5 |
| 888.05 | 99.75 |
| 888.12 | 99.75 |
| 888.19 | 100 |
| 888.26 | 100 |
| 888.33 | 100.25 |
| 888.39 | 100.25 |
| 888.46 | 100.25 |
| 888.53 | 100.5 |
| 888.6 | 100.5 |
| 888.67 | 100.5 |
| 888.74 | 100.75 |
| 888.8 | 100.75 |
| 888.87 | 100.75 |
| 888.94 | 101 |
| 889.01 | 101 |
| 889.08 | 101 |
| 889.15 | 101 |
| 889.21 | 101.25 |
| 889.28 | 101 |
| 889.35 | 101.25 |
| 889.42 | 101.25 |
| 889.49 | 101 |
| 889.55 | 101 |
| 889.62 | 101 |
| 889.69 | 101 |
| 889.76 | 101 |
| 889.83 | 101 |
| 889.9 | 100.25 |
| 889.97 | 100 |
| 890.03 | 99.75 |
| 890.1 | 99.5 |
| 890.17 | 99 |
| 890.24 | 99 |
| 890.31 | 98.75 |
| 890.37 | 98.25 |
| 890.44 | 97.75 |
| 890.51 | 97.25 |
| 890.58 | 96.75 |
| 890.65 | 96.25 |
| 890.72 | 95.75 |
| 890.78 | 95.25 |
| 890.85 | 94.5 |
| 890.92 | 94 |
| 890.99 | 93.5 |
| 891.05 | 93.5 |
| 891.12 | 93 |
| 891.19 | 92.25 |
| 891.26 | 91.75 |
| 891.33 | 91.25 |
| 891.4 | 90.75 |
| 891.46 | 90.25 |
| 891.53 | 89.75 |
| 891.6 | 89.25 |
| 891.67 | 88.5 |
| 891.74 | 88 |
| 891.8 | 87.75 |
| 891.87 | 87.75 |
| 891.94 | 87.25 |
| 892.01 | 86.75 |
| 892.08 | 86.25 |
| 892.15 | 85.75 |
| 892.21 | 85.25 |
| 892.28 | 85 |
| 892.35 | 84.5 |
| 892.42 | 84 |
| 892.49 | 83.5 |
| 892.55 | 83.25 |
| 892.62 | 82.75 |
| 892.69 | 82.75 |
| 892.76 | 82.25 |
| 892.83 | 82 |
| 892.9 | 81.5 |
| 892.96 | 81.25 |
| 893.03 | 80.75 |
| 893.1 | 80.5 |
| 893.17 | 80.25 |
| 893.24 | 79.75 |
| 893.3 | 79.5 |
| 893.37 | 79.25 |
| 893.44 | 79.25 |
| 893.51 | 78.75 |
| 893.58 | 78.5 |
| 893.64 | 78.25 |
| 893.71 | 77.75 |
| 893.78 | 77.5 |
| 893.85 | 77.25 |
| 893.92 | 77 |
| 893.98 | 76.5 |
| 894.05 | 76.5 |
| 894.12 | 76 |
| 894.19 | 75.75 |
| 894.26 | 75.75 |
| 894.33 | 75.5 |
| 894.39 | 75.25 |
| 894.46 | 75 |
| 894.53 | 74.75 |
| 894.6 | 74.25 |
| 894.67 | 74.25 |
| 894.73 | 73.75 |
| 894.8 | 73.5 |
| 894.87 | 73.25 |
| 894.94 | 73 |
| 895.01 | 72.75 |
| 895.08 | 72.75 |
| 895.14 | 72.5 |
| 895.21 | 72.25 |
| 895.28 | 72 |
| 895.35 | 71.75 |
| 895.42 | 71.5 |
| 895.48 | 71.25 |
| 895.55 | 71 |
| 895.62 | 70.75 |
| 895.69 | 70.75 |
| 895.76 | 70.5 |
| 895.82 | 70 |
| 895.89 | 70 |
| 895.96 | 70 |
| 896.03 | 69.75 |
| 896.1 | 69.5 |
| 896.16 | 69.25 |
| 896.23 | 69 |
| 896.3 | 68.75 |
| 896.37 | 68.5 |
| 896.44 | 68.5 |
| 896.51 | 68.25 |
| 896.57 | 68.25 |
| 896.64 | 68.5 |
| 896.71 | 68.5 |
| 896.78 | 68.5 |
| 896.85 | 68.75 |
| 896.91 | 68.75 |
| 896.98 | 68.75 |
| 897.05 | 68.75 |
| 897.12 | 69 |
| 897.19 | 69 |
| 897.26 | 69.25 |
| 897.33 | 69.25 |
| 897.39 | 69.25 |
| 897.46 | 69.5 |
| 897.53 | 69.5 |
| 897.6 | 69.5 |
| 897.67 | 69.75 |
| 897.73 | 69.75 |
| 897.8 | 69.75 |
| 897.87 | 70 |
| 897.94 | 70 |
| 898.01 | 70 |
| 898.08 | 70 |
| 898.14 | 70 |
| 898.21 | 70.25 |
| 898.28 | 70.25 |
| 898.35 | 70.25 |
| 898.42 | 70.25 |
| 898.48 | 70.25 |
| 898.55 | 70.25 |
| 898.62 | 70.25 |
| 898.69 | 70 |
| 898.76 | 70 |
| 898.83 | 70 |
| 898.89 | 70 |
| 898.96 | 70 |
| 899.03 | 70 |
| 899.1 | 69.75 |
| 899.17 | 69.75 |
| 899.24 | 69.75 |
| 899.3 | 69.75 |
| 899.37 | 69.75 |
| 899.44 | 69.5 |
| 899.51 | 69.5 |
| 899.58 | 69.5 |
| 899.65 | 69.25 |
| 899.71 | 69.25 |
| 899.78 | 69.25 |
| 899.85 | 69.25 |
| 899.92 | 69 |
| 899.99 | 69 |
| 900.06 | 69 |
| 900.12 | 69 |
| 900.19 | 68.75 |
| 900.26 | 68.75 |
| 900.33 | 68.75 |
| 900.4 | 68.5 |
| 900.47 | 68.5 |
| 900.53 | 68.5 |
| 900.6 | 68.5 |
| 900.67 | 68.25 |
| 900.74 | 68.25 |
| 900.81 | 68.25 |
| 900.88 | 68.25 |
| 900.94 | 68.25 |
| 901.01 | 68 |
| 901.08 | 68 |
| 901.15 | 68 |
| 901.22 | 68 |
| 901.28 | 68 |
| 901.35 | 67.75 |
| 901.42 | 67.75 |
| 901.49 | 67.5 |
| 901.56 | 67.5 |
| 901.62 | 67.5 |
| 901.69 | 67.5 |
| 901.76 | 67.5 |
| 901.83 | 67.5 |
| 901.9 | 67.75 |
| 901.97 | 68 |
| 902.03 | 68.25 |
| 902.1 | 68.5 |
| 902.17 | 69 |
| 902.24 | 69.5 |
| 902.31 | 69.75 |
| 902.38 | 70.25 |
| 902.44 | 70.75 |
| 902.51 | 70.75 |
| 902.58 | 71 |
| 902.65 | 71.5 |
| 902.72 | 71.75 |
| 902.78 | 72 |
| 902.85 | 72.25 |
| 902.92 | 72.75 |
| 902.99 | 73 |
| 903.06 | 73.25 |
| 903.12 | 73.75 |
| 903.19 | 74 |
| 903.26 | 74.25 |
| 903.33 | 74.25 |
| 903.4 | 74.5 |
| 903.47 | 75 |
| 903.53 | 75.25 |
| 903.6 | 75.5 |
| 903.67 | 76 |
| 903.74 | 76.25 |
| 903.81 | 76.5 |
| 903.87 | 76.75 |
| 903.94 | 77 |
| 904.01 | 77.25 |
| 904.08 | 77.75 |
| 904.15 | 77.75 |
| 904.22 | 78 |
| 904.28 | 78.25 |
| 904.35 | 78.5 |
| 904.42 | 78.75 |
| 904.49 | 79 |
| 904.56 | 79.25 |
| 904.63 | 79.5 |
| 904.69 | 80 |
| 904.76 | 80.25 |
| 904.83 | 80.25 |
| 904.9 | 80.5 |
| 904.97 | 80.5 |
| 905.03 | 80.75 |
| 905.1 | 81 |
| 905.17 | 81.25 |
| 905.24 | 81.5 |
| 905.31 | 81.75 |
| 905.37 | 82.25 |
| 905.44 | 82.25 |
| 905.51 | 82.5 |
| 905.58 | 82.75 |
| 905.65 | 83 |
| 905.72 | 83.25 |
| 905.78 | 83.25 |
| 905.85 | 83.5 |
| 905.92 | 83.75 |
| 905.99 | 84 |
| 906.06 | 84.25 |
| 906.13 | 84.25 |
| 906.19 | 84.5 |
| 906.26 | 84.75 |
| 906.33 | 85 |
| 906.4 | 85.25 |
| 906.47 | 85.25 |
| 906.53 | 85.5 |
| 906.6 | 85.5 |
| 906.67 | 85.75 |
| 906.74 | 86 |
| 906.81 | 86.25 |
| 906.87 | 86.5 |
| 906.94 | 86.75 |
| 907.01 | 86.75 |
| 907.08 | 87 |
| 907.15 | 87.25 |
| 907.22 | 87.5 |
| 907.28 | 87.5 |
| 907.35 | 87.75 |
| 907.42 | 87.75 |
| 907.49 | 88 |
| 907.56 | 88.25 |
| 907.62 | 88.25 |
| 907.69 | 88.5 |
| 907.76 | 88.75 |
| 907.83 | 89 |
| 907.9 | 89.25 |
| 907.97 | 89.25 |
| 908.03 | 89.5 |
| 908.1 | 89.75 |
| 908.17 | 89.75 |
| 908.24 | 89.75 |
| 908.31 | 90 |
| 908.38 | 90.25 |
| 908.44 | 90.5 |
| 908.51 | 90.5 |
| 908.58 | 90.75 |
| 908.65 | 91 |
| 908.72 | 91 |
| 908.78 | 91.25 |
| 908.85 | 91.5 |
| 908.92 | 91.5 |
| 908.99 | 91.75 |
| 909.06 | 91.75 |
| 909.12 | 92 |
| 909.19 | 92 |
| 909.26 | 92.25 |
| 909.33 | 92.5 |
| 909.4 | 92.5 |
| 909.47 | 92.75 |
| 909.53 | 93 |
| 909.6 | 93.25 |
| 909.67 | 93.25 |
| 909.74 | 93.5 |
| 909.81 | 93.5 |
| 909.87 | 93.5 |
| 909.94 | 93.75 |
| 910.01 | 94 |
| 910.08 | 94 |
| 910.15 | 94.25 |
| 910.22 | 94.25 |
| 910.28 | 94.5 |
| 910.35 | 94.75 |
| 910.42 | 94.75 |
| 910.49 | 95 |
| 910.56 | 95 |
| 910.62 | 95.25 |
| 910.69 | 95.25 |
| 910.76 | 95.5 |
| 910.83 | 95.5 |
| 910.9 | 95.75 |
| 910.97 | 95.75 |
| 911.03 | 96 |
| 911.1 | 96 |
| 911.17 | 96.25 |
| 911.24 | 96.25 |
| 911.31 | 96.5 |
| 911.37 | 96.5 |
| 911.44 | 96.75 |
| 911.51 | 96.75 |
| 911.58 | 96.75 |
| 911.65 | 97 |
| 911.72 | 97 |
| 911.78 | 97.25 |
| 911.85 | 97.25 |
| 911.92 | 97.5 |
| 911.99 | 97.5 |
| 912.06 | 97.75 |
| 912.12 | 98 |
| 912.19 | 98 |
| 912.26 | 98 |
| 912.33 | 98 |
| 912.4 | 98.25 |
| 912.46 | 98.5 |
| 912.53 | 98.5 |
| 912.6 | 98.5 |
| 912.67 | 98.75 |
| 912.74 | 99 |
| 912.8 | 99 |
| 912.87 | 99.25 |
| 912.94 | 99.25 |
| 913.01 | 99.5 |
| 913.08 | 99.5 |
| 913.15 | 99.5 |
| 913.22 | 99.75 |
| 913.28 | 99.75 |
| 913.35 | 100 |
| 913.42 | 100 |
| 913.49 | 100 |
| 913.56 | 100.25 |
| 913.63 | 100.25 |
| 913.69 | 100.5 |
| 913.76 | 100.5 |
| 913.83 | 100.5 |
| 913.9 | 100.5 |
| 913.97 | 100.5 |
| 914.03 | 100.75 |
| 914.1 | 100.75 |
| 914.17 | 100.75 |
| 914.24 | 101 |
| 914.31 | 101 |
| 914.38 | 101 |
| 914.45 | 101 |
| 914.51 | 101 |
| 914.58 | 101 |
| 914.65 | 101 |
| 914.72 | 101 |
| 914.79 | 101 |
| 914.85 | 101 |
| 914.92 | 101 |
| 914.99 | 100.75 |
| 915.06 | 100.25 |
| 915.13 | 100 |
| 915.2 | 99.5 |
| 915.26 | 99.5 |
| 915.33 | 99 |
| 915.4 | 98.5 |
| 915.47 | 98.25 |
| 915.53 | 97.75 |
| 915.6 | 97.75 |
| 915.67 | 97.25 |
| 915.74 | 96.75 |
| 915.81 | 96.25 |
| 915.88 | 95.75 |
| 915.95 | 95 |
| 916.01 | 94.5 |
| 916.08 | 94 |
| 916.15 | 93.5 |
| 916.22 | 92.75 |
| 916.28 | 92.25 |
| 916.35 | 91.75 |
| 916.42 | 91.75 |
| 916.49 | 91.25 |
| 916.56 | 90.75 |
| 916.63 | 90.25 |
| 916.69 | 89.5 |
| 916.76 | 89 |
| 916.83 | 88.5 |
| 916.9 | 88 |
| 916.97 | 87.75 |
| 917.03 | 87.25 |
| 917.1 | 86.75 |
| 917.17 | 86.25 |
| 917.24 | 86.25 |
| 917.31 | 85.75 |
| 917.38 | 85.25 |
| 917.44 | 84.75 |
| 917.51 | 84.5 |
| 917.58 | 84 |
| 917.65 | 83.5 |
| 917.72 | 83.25 |
| 917.78 | 82.75 |
| 917.85 | 82.5 |
| 917.92 | 82 |
| 917.99 | 81.75 |
| 918.06 | 81.75 |
| 918.13 | 81.25 |
| 918.19 | 81 |
| 918.26 | 80.5 |
| 918.33 | 80.25 |
| 918.4 | 80 |
| 918.47 | 79.5 |
| 918.53 | 79.25 |
| 918.6 | 79 |
| 918.67 | 78.5 |
| 918.74 | 78.25 |
| 918.81 | 78 |
| 918.87 | 78 |
| 918.94 | 77.75 |
| 919.01 | 77.25 |
| 919.08 | 77 |
| 919.15 | 76.75 |
| 919.22 | 76.5 |
| 919.28 | 76.25 |
| 919.35 | 76 |
| 919.42 | 75.5 |
| 919.49 | 75.25 |
| 919.56 | 75 |
| 919.62 | 74.75 |
| 919.69 | 74.75 |
| 919.76 | 74.5 |
| 919.83 | 74.25 |
| 919.9 | 74 |
| 919.96 | 73.75 |
| 920.03 | 73.5 |
| 920.1 | 73.25 |
| 920.17 | 73 |
| 920.24 | 72.75 |
| 920.3 | 72.5 |
| 920.37 | 72.25 |
| 920.44 | 72 |
| 920.51 | 72 |
| 920.58 | 71.75 |
| 920.65 | 71.5 |
| 920.71 | 71.25 |
| 920.78 | 71 |
| 920.85 | 70.75 |
| 920.92 | 70.75 |
| 920.99 | 70.5 |
| 921.05 | 70 |
| 921.12 | 69.75 |
| 921.19 | 69.75 |
| 921.26 | 69.5 |
| 921.33 | 69.5 |
| 921.4 | 69.25 |
| 921.46 | 69 |
| 921.53 | 68.75 |
| 921.6 | 68.5 |
| 921.67 | 68.25 |
| 921.74 | 68.25 |
| 921.8 | 68 |
| 921.87 | 68.25 |
| 921.94 | 68.5 |
| 922.01 | 68.75 |
| 922.08 | 68.75 |
| 922.15 | 68.75 |
| 922.21 | 68.75 |
| 922.28 | 69 |
| 922.35 | 69 |
| 922.42 | 69.25 |
| 922.49 | 69.25 |
| 922.55 | 69.25 |
| 922.62 | 69.5 |
| 922.69 | 69.5 |
| 922.76 | 69.75 |
| 922.83 | 69.75 |
| 922.9 | 69.75 |
| 922.96 | 69.75 |
| 923.03 | 69.75 |
| 923.1 | 70 |
| 923.17 | 70 |
| 923.24 | 70 |
| 923.3 | 70.25 |
| 923.37 | 70.25 |
| 923.44 | 70.25 |
| 923.51 | 70.5 |
| 923.58 | 70.25 |
| 923.65 | 70.5 |
| 923.72 | 70.25 |
| 923.78 | 70.25 |
| 923.85 | 70.25 |
| 923.92 | 70.25 |
| 923.99 | 70.25 |
| 924.06 | 70.25 |
| 924.13 | 70.25 |
| 924.19 | 70.25 |
| 924.26 | 70 |
| 924.33 | 70 |
| 924.4 | 69.75 |
| 924.47 | 69.75 |
| 924.53 | 69.75 |
| 924.6 | 69.75 |
| 924.67 | 69.75 |
| 924.74 | 69.5 |
| 924.81 | 69.5 |
| 924.88 | 69.5 |
| 924.94 | 69.25 |
| 925.01 | 69.25 |
| 925.08 | 69.25 |
| 925.15 | 69.25 |
| 925.22 | 69 |
| 925.28 | 69 |
| 925.35 | 69 |
| 925.42 | 69 |
| 925.49 | 69 |
| 925.56 | 68.75 |
| 925.63 | 68.75 |
| 925.69 | 68.75 |
| 925.76 | 68.5 |
| 925.83 | 68.5 |
| 925.9 | 68.5 |
| 925.97 | 68.25 |
| 926.04 | 68.25 |
| 926.1 | 68.25 |
| 926.17 | 68.25 |
| 926.24 | 68 |
| 926.31 | 68 |
| 926.38 | 68 |
| 926.45 | 68 |
| 926.51 | 68 |
| 926.58 | 68 |
| 926.65 | 67.75 |
| 926.72 | 67.75 |
| 926.79 | 67.75 |
| 926.85 | 67.5 |
| 926.92 | 67.5 |
| 926.99 | 67.75 |
| 927.06 | 67.75 |
| 927.13 | 67.75 |
| 927.2 | 68 |
| 927.26 | 68.25 |
| 927.33 | 68.5 |
| 927.4 | 69 |
| 927.47 | 69.5 |
| 927.54 | 69.75 |
| 927.6 | 70.5 |
| 927.67 | 70.75 |
| 927.74 | 71 |
| 927.81 | 71.5 |
| 927.88 | 71.75 |
| 927.95 | 71.75 |
| 928.01 | 72 |
| 928.08 | 72.5 |
| 928.15 | 72.75 |
| 928.22 | 73 |
| 928.29 | 73.5 |
| 928.35 | 73.75 |
| 928.42 | 74 |
| 928.49 | 74.5 |
| 928.56 | 74.75 |
| 928.63 | 75 |
| 928.7 | 75.25 |
| 928.76 | 75.25 |
| 928.83 | 75.5 |
| 928.9 | 76 |
| 928.97 | 76.25 |
| 929.04 | 76.5 |
| 929.1 | 76.75 |
| 929.17 | 77.25 |
| 929.24 | 77.5 |
| 929.31 | 77.75 |
| 929.38 | 78 |
| 929.45 | 78.25 |
| 929.51 | 78.75 |
| 929.58 | 78.75 |
| 929.65 | 79 |
| 929.72 | 79.25 |
| 929.79 | 79.5 |
| 929.85 | 79.75 |
| 929.92 | 80 |
| 929.99 | 80.25 |
| 930.06 | 80.5 |
| 930.13 | 80.75 |
| 930.2 | 81 |
| 930.26 | 81.25 |
| 930.33 | 81.5 |
| 930.4 | 81.5 |
| 930.47 | 81.75 |
| 930.54 | 82 |
| 930.6 | 82.25 |
| 930.67 | 82.5 |
| 930.74 | 82.75 |
| 930.81 | 83 |
| 930.88 | 83.25 |
| 930.95 | 83.5 |
| 931.01 | 83.75 |
| 931.08 | 84 |
| 931.15 | 84 |
| 931.22 | 84.25 |
| 931.29 | 84.25 |
| 931.35 | 84.5 |
| 931.42 | 84.75 |
| 931.49 | 85 |
| 931.56 | 85.25 |
| 931.63 | 85.25 |
| 931.7 | 85.5 |
| 931.76 | 85.75 |
| 931.83 | 86 |
| 931.9 | 86.25 |
| 931.97 | 86.25 |
| 932.04 | 86.5 |
| 932.1 | 86.75 |
| 932.17 | 86.75 |
| 932.24 | 87 |
| 932.31 | 87.25 |
| 932.38 | 87.5 |
| 932.45 | 87.75 |
| 932.51 | 87.75 |
| 932.58 | 88 |
| 932.65 | 88.25 |
| 932.72 | 88.5 |
| 932.79 | 88.5 |
| 932.85 | 88.5 |
| 932.92 | 88.75 |
| 932.99 | 89 |
| 933.06 | 89.25 |
| 933.13 | 89.5 |
| 933.2 | 89.5 |
| 933.26 | 89.75 |
| 933.33 | 90 |
| 933.4 | 90.25 |
| 933.47 | 90.5 |
| 933.54 | 90.5 |
| 933.6 | 90.75 |
| 933.67 | 90.75 |
| 933.74 | 91 |
| 933.81 | 91 |
| 933.88 | 91.25 |
| 933.95 | 91.25 |
| 934.01 | 91.5 |
| 934.08 | 91.75 |
| 934.15 | 91.75 |
| 934.22 | 92 |
| 934.29 | 92.25 |
| 934.35 | 92.5 |
| 934.42 | 92.75 |
| 934.49 | 92.75 |
| 934.56 | 92.75 |
| 934.63 | 93 |
| 934.69 | 93.25 |
| 934.76 | 93.25 |
| 934.83 | 93.5 |
| 934.9 | 93.75 |
| 934.97 | 93.75 |
| 935.04 | 94 |
| 935.1 | 94.25 |
| 935.17 | 94.25 |
| 935.24 | 94.5 |
| 935.31 | 94.5 |
| 935.38 | 94.5 |
| 935.45 | 94.75 |
| 935.51 | 95 |
| 935.58 | 95.25 |
| 935.65 | 95.25 |
| 935.72 | 95.5 |
| 935.79 | 95.5 |
| 935.85 | 95.75 |
| 935.92 | 96 |
| 935.99 | 96 |
| 936.06 | 96.25 |
| 936.13 | 96.25 |
| 936.2 | 96.25 |
| 936.26 | 96.5 |
| 936.33 | 96.75 |
| 936.4 | 97 |
| 936.47 | 97 |
| 936.54 | 97 |
| 936.6 | 97.25 |
| 936.67 | 97.5 |
| 936.74 | 97.5 |
| 936.81 | 97.75 |
| 936.88 | 98 |
| 936.95 | 98 |
| 937.01 | 98 |
| 937.08 | 98.25 |
| 937.15 | 98.25 |
| 937.22 | 98.5 |
| 937.29 | 98.5 |
| 937.35 | 98.75 |
| 937.42 | 99 |
| 937.49 | 99 |
| 937.56 | 99.25 |
| 937.63 | 99.25 |
| 937.7 | 99.5 |
| 937.76 | 99.5 |
| 937.83 | 99.5 |
| 937.9 | 99.75 |
| 937.97 | 100 |
| 938.04 | 100 |
| 938.1 | 100 |
| 938.17 | 100.25 |
| 938.24 | 100.25 |
| 938.31 | 100.25 |
| 938.38 | 100.5 |
| 938.45 | 100.5 |
| 938.52 | 100.75 |
| 938.58 | 100.75 |
| 938.65 | 100.75 |
| 938.72 | 100.75 |
| 938.79 | 100.75 |
| 938.86 | 101 |
| 938.92 | 101 |
| 938.99 | 101 |
| 939.06 | 101 |
| 939.13 | 101 |
| 939.2 | 101 |
| 939.27 | 101.25 |
| 939.33 | 101 |
| 939.4 | 101 |
| 939.47 | 101 |
| 939.54 | 101.25 |
| 939.61 | 101 |
| 939.67 | 101 |
| 939.74 | 100.5 |
| 939.81 | 100 |
| 939.88 | 99.75 |
| 939.95 | 99.5 |
| 940.02 | 99.25 |
| 940.08 | 98.75 |
| 940.15 | 98.25 |
| 940.22 | 98.25 |
| 940.29 | 98 |
| 940.36 | 97.25 |
| 940.42 | 97 |
| 940.49 | 96.25 |
| 940.56 | 95.75 |
| 940.63 | 95 |
| 940.7 | 94.5 |
| 940.77 | 94 |
| 940.83 | 93.5 |
| 940.9 | 93 |
| 940.97 | 92.25 |
| 941.04 | 92.25 |
| 941.11 | 91.75 |
| 941.17 | 91.25 |
| 941.24 | 90.75 |
| 941.31 | 90.25 |
| 941.38 | 89.75 |
| 941.45 | 89 |
| 941.52 | 88.5 |
| 941.58 | 88 |
| 941.65 | 87.5 |
| 941.72 | 87 |
| 941.79 | 86.5 |
| 941.85 | 86.5 |
| 941.92 | 86.25 |
| 941.99 | 85.75 |
| 942.06 | 85.25 |
| 942.13 | 85 |
| 942.2 | 84.25 |
| 942.27 | 84 |
| 942.33 | 83.5 |
| 942.4 | 83 |
| 942.47 | 82.75 |
| 942.54 | 82.25 |
| 942.6 | 82 |
| 942.67 | 82 |
| 942.74 | 81.5 |
| 942.81 | 81.25 |
| 942.88 | 80.75 |
| 942.95 | 80.5 |
| 943.01 | 80.25 |
| 943.08 | 79.75 |
| 943.15 | 79.5 |
| 943.22 | 79 |
| 943.29 | 78.75 |
| 943.35 | 78.5 |
| 943.42 | 78 |
| 943.49 | 78 |
| 943.56 | 77.75 |
| 943.63 | 77.5 |
| 943.7 | 77.25 |
| 943.76 | 77 |
| 943.83 | 76.5 |
| 943.9 | 76.5 |
| 943.97 | 76 |
| 944.03 | 75.75 |
| 944.1 | 75.5 |
| 944.17 | 75.25 |
| 944.24 | 74.75 |
| 944.31 | 74.75 |
| 944.38 | 74.5 |
| 944.45 | 74.25 |
| 944.51 | 74 |
| 944.58 | 73.75 |
| 944.65 | 73.5 |
| 944.72 | 73.25 |
| 944.78 | 73 |
| 944.85 | 72.75 |
| 944.92 | 72.5 |
| 944.99 | 72.25 |
| 945.06 | 72.25 |
| 945.13 | 72 |
| 945.2 | 71.75 |
| 945.26 | 71.5 |
| 945.33 | 71.25 |
| 945.4 | 71 |
| 945.47 | 70.75 |
| 945.53 | 70.75 |
| 945.6 | 70.5 |
| 945.67 | 70 |
| 945.74 | 69.75 |
| 945.81 | 69.5 |
| 945.88 | 69.5 |
| 945.94 | 69.5 |
| 946.01 | 69.25 |
| 946.08 | 69 |
| 946.15 | 68.75 |
| 946.22 | 68.5 |
| 946.28 | 68.5 |
| 946.35 | 68.25 |
| 946.42 | 68.25 |
| 946.49 | 68.5 |
| 946.56 | 68.5 |
| 946.63 | 68.5 |
| 946.69 | 68.5 |
| 946.76 | 68.75 |
| 946.83 | 68.75 |
| 946.9 | 68.75 |
| 946.97 | 69 |
| 947.03 | 69 |
| 947.1 | 69.25 |
| 947.17 | 69.25 |
| 947.24 | 69.5 |
| 947.31 | 69.5 |
| 947.38 | 69.5 |
| 947.44 | 69.75 |
| 947.51 | 69.75 |
| 947.58 | 69.75 |
| 947.65 | 69.75 |
| 947.72 | 69.75 |
| 947.79 | 70 |
| 947.85 | 70 |
| 947.92 | 70.25 |
| 947.99 | 70 |
| 948.06 | 70.25 |
| 948.13 | 70.25 |
| 948.2 | 70.25 |
| 948.26 | 70.25 |
| 948.33 | 70.25 |
| 948.4 | 70.25 |
| 948.47 | 70.25 |
| 948.54 | 70.25 |
| 948.6 | 70.25 |
| 948.67 | 70.25 |
| 948.74 | 70.25 |
| 948.81 | 70 |
| 948.88 | 70 |
| 948.95 | 70 |
| 949.02 | 69.75 |
| 949.08 | 69.75 |
| 949.15 | 69.75 |
| 949.22 | 69.75 |
| 949.29 | 69.75 |
| 949.36 | 69.75 |
| 949.42 | 69.5 |
| 949.49 | 69.5 |
| 949.56 | 69.5 |
| 949.63 | 69.25 |
| 949.7 | 69.25 |
| 949.77 | 69 |
| 949.83 | 69 |
| 949.9 | 69 |
| 949.97 | 68.75 |
| 950.04 | 68.75 |
| 950.11 | 68.75 |
| 950.17 | 68.75 |
| 950.24 | 68.75 |
| 950.31 | 68.5 |
| 950.38 | 68.5 |
| 950.45 | 68.5 |
| 950.52 | 68.25 |
| 950.59 | 68.25 |
| 950.65 | 68.25 |
| 950.72 | 68.25 |
| 950.79 | 68 |
| 950.86 | 68 |
| 950.93 | 68 |
| 950.99 | 68 |
| 951.06 | 68 |
| 951.13 | 68 |
| 951.2 | 67.75 |
| 951.27 | 67.75 |
| 951.34 | 67.75 |
| 951.4 | 67.5 |
| 951.47 | 67.5 |
| 951.54 | 67.5 |
| 951.61 | 67.75 |
| 951.67 | 67.75 |
| 951.74 | 68 |
| 951.81 | 68.25 |
| 951.88 | 68.5 |
| 951.95 | 69 |
| 952.02 | 69.5 |
| 952.09 | 69.75 |
| 952.15 | 70.25 |
| 952.22 | 70.75 |
| 952.29 | 71 |
| 952.36 | 71.25 |
| 952.43 | 71.75 |
| 952.49 | 71.75 |
| 952.56 | 72 |
| 952.63 | 72.25 |
| 952.7 | 72.5 |
| 952.77 | 73 |
| 952.84 | 73.25 |
| 952.9 | 73.5 |
| 952.97 | 73.75 |
| 953.04 | 74 |
| 953.11 | 74.5 |
| 953.18 | 74.75 |
| 953.24 | 75 |
| 953.31 | 75 |
| 953.38 | 75.25 |
| 953.45 | 75.75 |
| 953.52 | 76 |
| 953.59 | 76.25 |
| 953.65 | 76.5 |
| 953.72 | 76.75 |
| 953.79 | 77.25 |
| 953.86 | 77.25 |
| 953.93 | 77.5 |
| 953.99 | 77.75 |
| 954.06 | 78.25 |
| 954.13 | 78.25 |
| 954.2 | 78.25 |
| 954.27 | 78.75 |
| 954.34 | 79 |
| 954.4 | 79.25 |
| 954.47 | 79.5 |
| 954.54 | 79.75 |
| 954.61 | 80 |
| 954.68 | 80.25 |
| 954.74 | 80.5 |
| 954.81 | 80.75 |
| 954.88 | 81 |
| 954.95 | 81 |
| 955.02 | 81.25 |
| 955.08 | 81.5 |
| 955.15 | 81.75 |
| 955.22 | 82 |
| 955.29 | 82 |
| 955.36 | 82.25 |
| 955.42 | 82.5 |
| 955.49 | 82.75 |
| 955.56 | 83 |
| 955.63 | 83.25 |
| 955.7 | 83.5 |
| 955.77 | 83.5 |
| 955.84 | 83.75 |
| 955.9 | 83.75 |
| 955.97 | 84 |
| 956.04 | 84.25 |
| 956.11 | 84.5 |
| 956.18 | 84.75 |
| 956.24 | 85 |
| 956.31 | 85 |
| 956.38 | 85.25 |
| 956.45 | 85.5 |
| 956.52 | 85.5 |
| 956.58 | 85.5 |
| 956.65 | 85.75 |
| 956.72 | 86 |
| 956.79 | 86.25 |
| 956.86 | 86.5 |
| 956.92 | 86.75 |
| 956.99 | 86.75 |
| 957.06 | 87 |
| 957.13 | 87.25 |
| 957.2 | 87.5 |
| 957.27 | 87.5 |
| 957.33 | 87.75 |
| 957.4 | 87.75 |
| 957.47 | 88 |
| 957.54 | 88.25 |
| 957.61 | 88.25 |
| 957.67 | 88.5 |
| 957.74 | 88.75 |
| 957.81 | 88.75 |
| 957.88 | 89 |
| 957.95 | 89.25 |
| 958.02 | 89.5 |
| 958.09 | 89.5 |
| 958.15 | 89.75 |
| 958.22 | 89.75 |
| 958.29 | 90 |
| 958.36 | 90.25 |
| 958.43 | 90.25 |
| 958.49 | 90.5 |
| 958.56 | 90.75 |
| 958.63 | 91 |
| 958.7 | 91 |
| 958.77 | 91 |
| 958.83 | 91.25 |
| 958.9 | 91.5 |
| 958.97 | 91.75 |
| 959.04 | 91.75 |
| 959.11 | 91.75 |
| 959.17 | 92 |
| 959.24 | 92.25 |
| 959.31 | 92.5 |
| 959.38 | 92.5 |
| 959.45 | 92.75 |
| 959.52 | 93 |
| 959.59 | 93 |
| 959.65 | 93.25 |
| 959.72 | 93.5 |
| 959.79 | 93.5 |
| 959.86 | 93.5 |
| 959.93 | 93.75 |
| 959.99 | 94 |
| 960.06 | 94 |
| 960.13 | 94.25 |
| 960.2 | 94.25 |
| 960.27 | 94.5 |
| 960.33 | 94.5 |
| 960.4 | 94.75 |
| 960.47 | 95 |
| 960.54 | 95 |
| 960.61 | 95.25 |
| 960.67 | 95.25 |
| 960.74 | 95.25 |
| 960.81 | 95.5 |
| 960.88 | 95.75 |
| 960.95 | 95.75 |
| 961.02 | 96 |
| 961.08 | 96.25 |
| 961.15 | 96.25 |
| 961.22 | 96.5 |
| 961.29 | 96.5 |
| 961.36 | 96.75 |
| 961.42 | 96.75 |
| 961.49 | 96.75 |
| 961.56 | 97 |
| 961.63 | 97 |
| 961.7 | 97.25 |
| 961.77 | 97.25 |
| 961.84 | 97.5 |
| 961.9 | 97.75 |
| 961.97 | 97.75 |
| 962.04 | 98 |
| 962.11 | 98 |
| 962.18 | 98.25 |
| 962.24 | 98.25 |
| 962.31 | 98.25 |
| 962.38 | 98.5 |
| 962.45 | 98.75 |
| 962.52 | 98.75 |
| 962.58 | 99 |
| 962.65 | 99 |
| 962.72 | 99.25 |
| 962.79 | 99.25 |
| 962.86 | 99.5 |
| 962.92 | 99.75 |
| 962.99 | 99.75 |
| 963.06 | 99.75 |
| 963.13 | 99.75 |
| 963.2 | 100 |
| 963.27 | 100 |
| 963.34 | 100 |
| 963.4 | 100.25 |
| 963.47 | 100.25 |
| 963.54 | 100.5 |
| 963.61 | 100.5 |
| 963.68 | 100.5 |
| 963.74 | 100.75 |
| 963.81 | 100.75 |
| 963.88 | 100.75 |
| 963.95 | 100.75 |
| 964.02 | 101 |
| 964.09 | 101 |
| 964.16 | 101 |
| 964.22 | 101 |
| 964.29 | 101 |
| 964.36 | 101 |
| 964.43 | 101 |
| 964.5 | 101 |
| 964.56 | 101 |
| 964.63 | 101 |
| 964.7 | 100.75 |
| 964.77 | 100.75 |
| 964.84 | 100.75 |
| 964.91 | 100.5 |
| 964.97 | 100 |
| 965.04 | 99.75 |
| 965.11 | 99.5 |
| 965.18 | 99 |
| 965.25 | 98.75 |
| 965.31 | 98.25 |
| 965.38 | 97.75 |
| 965.45 | 97.25 |
| 965.52 | 96.75 |
| 965.59 | 96.25 |
| 965.66 | 96.25 |
| 965.72 | 95.75 |
| 965.79 | 95.25 |
| 965.86 | 94.5 |
| 965.93 | 94 |
| 966.0 | 93.5 |
| 966.06 | 93 |
| 966.13 | 92.25 |
| 966.2 | 91.75 |
| 966.27 | 91.25 |
| 966.34 | 90.75 |
| 966.41 | 90.75 |
| 966.47 | 90.25 |
| 966.54 | 89.5 |
| 966.61 | 89 |
| 966.68 | 88.5 |
| 966.75 | 88 |
| 966.81 | 87.5 |
| 966.88 | 87 |
| 966.95 | 86.5 |
| 967.02 | 86.25 |
| 967.09 | 85.5 |
| 967.15 | 85.25 |
| 967.22 | 85.25 |
| 967.29 | 84.75 |
| 967.36 | 84.25 |
| 967.43 | 84 |
| 967.49 | 83.5 |
| 967.56 | 83 |
| 967.63 | 82.75 |
| 967.7 | 82.25 |
| 967.77 | 82 |
| 967.84 | 81.5 |
| 967.9 | 81.25 |
| 967.97 | 80.75 |
| 968.04 | 80.75 |
| 968.11 | 80.5 |
| 968.17 | 80.25 |
| 968.24 | 79.75 |
| 968.31 | 79.5 |
| 968.38 | 79.25 |
| 968.45 | 78.75 |
| 968.52 | 78.5 |
| 968.59 | 78 |
| 968.65 | 77.75 |
| 968.72 | 77.5 |
| 968.79 | 77.25 |
| 968.86 | 77.25 |
| 968.92 | 77 |
| 968.99 | 76.75 |
| 969.06 | 76.25 |
| 969.13 | 76 |
| 969.2 | 75.75 |
| 969.27 | 75.5 |
| 969.33 | 75.25 |
| 969.4 | 75 |
| 969.47 | 74.5 |
| 969.54 | 74.5 |
| 969.61 | 74.25 |
| 969.67 | 74.25 |
| 969.74 | 73.75 |
| 969.81 | 73.5 |
| 969.88 | 73.25 |
| 969.95 | 73 |
| 970.02 | 72.75 |
| 970.08 | 72.5 |
| 970.15 | 72.25 |
| 970.22 | 72 |
| 970.29 | 71.75 |
| 970.35 | 71.5 |
| 970.42 | 71.5 |
| 970.49 | 71.5 |
| 970.56 | 71.25 |
| 970.63 | 71 |
| 970.7 | 70.75 |
| 970.77 | 70.5 |
| 970.83 | 70.25 |
| 970.9 | 70 |
| 970.97 | 69.75 |
| 971.04 | 69.5 |
| 971.1 | 69.25 |
| 971.17 | 69 |
| 971.24 | 68.75 |
| 971.31 | 68.75 |
| 971.38 | 68.75 |
| 971.45 | 68.5 |
| 971.51 | 68.25 |
| 971.58 | 68 |
| 971.65 | 68 |
| 971.72 | 68.25 |
| 971.79 | 68.5 |
| 971.85 | 68.5 |
| 971.92 | 68.5 |
| 971.99 | 68.5 |
| 972.06 | 68.75 |
| 972.13 | 68.75 |
| 972.2 | 68.75 |
| 972.27 | 69 |
| 972.33 | 69 |
| 972.4 | 69.25 |
| 972.47 | 69.25 |
| 972.54 | 69.25 |
| 972.61 | 69.5 |
| 972.67 | 69.5 |
| 972.74 | 69.75 |
| 972.81 | 69.75 |
| 972.88 | 69.75 |
| 972.95 | 69.75 |
| 973.02 | 70 |
| 973.08 | 70 |
| 973.15 | 70 |
| 973.22 | 70.25 |
| 973.29 | 70.25 |
| 973.36 | 70.25 |
| 973.42 | 70.25 |
| 973.49 | 70.25 |
| 973.56 | 70.25 |
| 973.63 | 70.5 |
| 973.7 | 70.25 |
| 973.77 | 70.25 |
| 973.84 | 70.25 |
| 973.9 | 70.25 |
| 973.97 | 70.25 |
| 974.04 | 70.25 |
| 974.11 | 70.25 |
| 974.18 | 70 |
| 974.24 | 70 |
| 974.31 | 70 |
| 974.38 | 70 |
| 974.45 | 69.75 |
| 974.52 | 69.75 |
| 974.59 | 69.75 |
| 974.65 | 69.5 |
| 974.72 | 69.5 |
| 974.79 | 69.5 |
| 974.86 | 69.5 |
| 974.93 | 69.25 |
| 975.0 | 69.25 |
| 975.06 | 69.25 |
| 975.13 | 69.25 |
| 975.2 | 69 |
| 975.27 | 69 |
| 975.34 | 69 |
| 975.41 | 68.75 |
| 975.47 | 68.75 |
| 975.54 | 68.75 |
| 975.61 | 68.75 |
| 975.68 | 68.75 |
| 975.75 | 68.5 |
| 975.81 | 68.5 |
| 975.88 | 68.5 |
| 975.95 | 68.25 |
| 976.02 | 68.25 |
| 976.09 | 68.25 |
| 976.16 | 68.25 |
| 976.22 | 68 |
| 976.29 | 68 |
| 976.36 | 68 |
| 976.43 | 68 |
| 976.5 | 67.75 |
| 976.57 | 67.75 |
| 976.63 | 67.75 |
| 976.7 | 67.75 |
| 976.77 | 67.75 |
| 976.84 | 67.75 |
| 976.91 | 68 |
| 976.97 | 68.25 |
| 977.04 | 68.75 |
| 977.11 | 68.75 |
| 977.18 | 69 |
| 977.25 | 69.5 |
| 977.31 | 70 |
| 977.38 | 70.5 |
| 977.45 | 70.75 |
| 977.52 | 71 |
| 977.59 | 71.5 |
| 977.66 | 71.75 |
| 977.72 | 72 |
| 977.79 | 72.25 |
| 977.86 | 72.5 |
| 977.93 | 72.5 |
| 978.0 | 73 |
| 978.06 | 73.25 |
| 978.13 | 73.5 |
| 978.2 | 74 |
| 978.27 | 74.25 |
| 978.34 | 74.5 |
| 978.41 | 74.75 |
| 978.47 | 75.25 |
| 978.54 | 75.5 |
| 978.61 | 75.75 |
| 978.68 | 76 |
| 978.75 | 76 |
| 978.81 | 76.25 |
| 978.88 | 76.75 |
| 978.95 | 76.75 |
| 979.02 | 77.25 |
| 979.09 | 77.5 |
| 979.16 | 77.75 |
| 979.22 | 78 |
| 979.29 | 78.25 |
| 979.36 | 78.5 |
| 979.43 | 79 |
| 979.5 | 79.25 |
| 979.56 | 79.25 |
| 979.63 | 79.5 |
| 979.7 | 79.75 |
| 979.77 | 80 |
| 979.84 | 80.25 |
| 979.91 | 80.5 |
| 979.97 | 80.75 |
| 980.04 | 81 |
| 980.11 | 81.25 |
| 980.18 | 81.5 |
| 980.25 | 81.75 |
| 980.32 | 82 |
| 980.38 | 82 |
| 980.45 | 82.25 |
| 980.52 | 82.5 |
| 980.59 | 82.75 |
| 980.66 | 83 |
| 980.72 | 83.25 |
| 980.79 | 83.5 |
| 980.86 | 83.75 |
| 980.93 | 84 |
| 981.0 | 84.25 |
| 981.06 | 84.5 |
| 981.13 | 84.5 |
| 981.2 | 84.5 |
| 981.27 | 85 |
| 981.34 | 85 |
| 981.41 | 85.25 |
| 981.47 | 85.5 |
| 981.54 | 85.75 |
| 981.61 | 86 |
| 981.68 | 86 |
| 981.75 | 86.25 |
| 981.81 | 86.5 |
| 981.88 | 86.75 |
| 981.95 | 87 |
| 982.02 | 87 |
| 982.09 | 87 |
| 982.16 | 87.25 |
| 982.22 | 87.5 |
| 982.29 | 87.75 |
| 982.36 | 88 |
| 982.43 | 88 |
| 982.5 | 88.25 |
| 982.56 | 88.5 |
| 982.63 | 88.75 |
| 982.7 | 88.75 |
| 982.77 | 89 |
| 982.84 | 89 |
| 982.91 | 89.25 |
| 982.97 | 89.5 |
| 983.04 | 89.5 |
| 983.11 | 89.75 |
| 983.18 | 90 |
| 983.25 | 90.25 |
| 983.31 | 90.25 |
| 983.38 | 90.5 |
| 983.45 | 90.75 |
| 983.52 | 91 |
| 983.59 | 91 |
| 983.66 | 91 |
| 983.72 | 91.25 |
| 983.79 | 91.25 |
| 983.86 | 91.5 |
| 983.93 | 91.75 |
| 984.0 | 92 |
| 984.07 | 92.25 |
| 984.13 | 92.25 |
| 984.2 | 92.5 |
| 984.27 | 92.75 |
| 984.34 | 92.75 |
| 984.4 | 93 |
| 984.47 | 93 |
| 984.54 | 93.25 |
| 984.61 | 93.25 |
| 984.68 | 93.5 |
| 984.75 | 93.75 |
| 984.81 | 93.75 |
| 984.88 | 94 |
| 984.95 | 94 |
| 985.02 | 94.25 |
| 985.09 | 94.5 |
| 985.16 | 94.5 |
| 985.22 | 94.75 |
| 985.29 | 94.75 |
| 985.36 | 95 |
| 985.43 | 95 |
| 985.5 | 95.25 |
| 985.56 | 95.5 |
| 985.63 | 95.5 |
| 985.7 | 95.75 |
| 985.77 | 95.75 |
| 985.84 | 96 |
| 985.91 | 96.25 |
| 985.97 | 96.25 |
| 986.04 | 96.5 |
| 986.11 | 96.5 |
| 986.18 | 96.5 |
| 986.25 | 96.75 |
| 986.31 | 97 |
| 986.38 | 97 |
| 986.45 | 97.25 |
| 986.52 | 97.25 |
| 986.59 | 97.25 |
| 986.66 | 97.5 |
| 986.72 | 97.5 |
| 986.79 | 97.75 |
| 986.86 | 98 |
| 986.93 | 98 |
| 987.0 | 98 |
| 987.06 | 98.25 |
| 987.13 | 98.25 |
| 987.2 | 98.5 |
| 987.27 | 98.75 |
| 987.34 | 98.75 |
| 987.41 | 99 |
| 987.47 | 99 |
| 987.54 | 99.25 |
| 987.61 | 99.5 |
| 987.68 | 99.5 |
| 987.75 | 99.5 |
| 987.81 | 99.5 |
| 987.88 | 99.75 |
| 987.95 | 99.75 |
| 988.02 | 100 |
| 988.09 | 100 |
| 988.16 | 100.25 |
| 988.22 | 100.25 |
| 988.29 | 100.25 |
| 988.36 | 100.5 |
| 988.43 | 100.5 |
| 988.5 | 100.5 |
| 988.57 | 100.5 |
| 988.63 | 100.75 |
| 988.7 | 100.75 |
| 988.77 | 100.75 |
| 988.84 | 100.75 |
| 988.91 | 100.75 |
| 988.97 | 100.75 |
| 989.04 | 101 |
| 989.11 | 101 |
| 989.18 | 101 |
| 989.25 | 101 |
| 989.32 | 101 |
| 989.38 | 101 |
| 989.45 | 101 |
| 989.52 | 101 |
| 989.59 | 101 |
| 989.66 | 101 |
| 989.72 | 100.25 |
| 989.79 | 100 |
| 989.86 | 99.75 |
| 989.93 | 99.5 |
| 990.0 | 99 |
| 990.07 | 98.75 |
| 990.14 | 98.25 |
| 990.2 | 98.25 |
| 990.27 | 98 |
| 990.34 | 97.25 |
| 990.41 | 97 |
| 990.47 | 96.25 |
| 990.54 | 95.75 |
| 990.61 | 95.25 |
| 990.68 | 94.5 |
| 990.75 | 94 |
| 990.82 | 93.5 |
| 990.88 | 93 |
| 990.95 | 92.5 |
| 991.02 | 92.5 |
| 991.09 | 91.75 |
| 991.16 | 91.25 |
| 991.22 | 90.75 |
| 991.29 | 90.25 |
| 991.36 | 89.75 |
| 991.43 | 89.25 |
| 991.5 | 88.75 |
| 991.57 | 88.25 |
| 991.63 | 87.75 |
| 991.7 | 87.25 |
| 991.77 | 86.75 |
| 991.84 | 86.75 |
| 991.91 | 86.25 |
| 991.97 | 85.75 |
| 992.04 | 85.25 |
| 992.11 | 85 |
| 992.18 | 84.5 |
| 992.25 | 84.25 |
| 992.32 | 83.75 |
| 992.38 | 83.25 |
| 992.45 | 82.75 |
| 992.52 | 82.5 |
| 992.59 | 82.25 |
| 992.66 | 82.25 |
| 992.72 | 81.75 |
| 992.79 | 81.25 |
| 992.86 | 81 |
| 992.93 | 80.75 |
| 993.0 | 80.25 |
| 993.06 | 80 |
| 993.13 | 79.75 |
| 993.2 | 79.25 |
| 993.27 | 79 |
| 993.34 | 78.75 |
| 993.4 | 78.25 |
| 993.47 | 78.25 |
| 993.54 | 78 |
| 993.61 | 77.75 |
| 993.68 | 77.5 |
| 993.75 | 77.25 |
| 993.81 | 76.75 |
| 993.88 | 76.5 |
| 993.95 | 76.25 |
| 994.02 | 76 |
| 994.09 | 75.75 |
| 994.15 | 75.5 |
| 994.22 | 75 |
| 994.29 | 75 |
| 994.36 | 75 |
| 994.43 | 74.5 |
| 994.5 | 74.25 |
| 994.56 | 74 |
| 994.63 | 73.75 |
| 994.7 | 73.5 |
| 994.77 | 73.25 |
| 994.84 | 73 |
| 994.9 | 72.75 |
| 994.97 | 72.5 |
| 995.04 | 72.5 |
| 995.11 | 72.25 |
| 995.18 | 72 |
| 995.25 | 71.75 |
| 995.31 | 71.5 |
| 995.38 | 71.25 |
| 995.45 | 71 |
| 995.52 | 71 |
| 995.59 | 70.75 |
| 995.65 | 70.5 |
| 995.72 | 70.25 |
| 995.79 | 70 |
| 995.86 | 70 |
| 995.93 | 69.75 |
| 995.99 | 69.5 |
| 996.06 | 69.25 |
| 996.13 | 69 |
| 996.2 | 68.75 |
| 996.27 | 68.5 |
| 996.33 | 68.5 |
| 996.4 | 68.25 |
| 996.47 | 68.25 |
| 996.54 | 68.5 |
| 996.61 | 68.5 |
| 996.67 | 68.5 |
| 996.74 | 68.75 |
| 996.81 | 68.75 |
| 996.88 | 69 |
| 996.95 | 69 |
| 997.02 | 69 |
| 997.09 | 69.25 |
| 997.15 | 69.25 |
| 997.22 | 69.5 |
| 997.29 | 69.5 |
| 997.36 | 69.5 |
| 997.43 | 69.75 |
| 997.49 | 69.75 |
| 997.56 | 69.75 |
| 997.63 | 69.75 |
| 997.7 | 70 |
| 997.77 | 70 |
| 997.84 | 70 |
| 997.9 | 70.25 |
| 997.97 | 70.25 |
| 998.04 | 70.25 |
| 998.11 | 70.25 |
| 998.18 | 70.25 |
| 998.25 | 70.25 |
| 998.31 | 70.25 |
| 998.38 | 70.25 |
| 998.45 | 70.25 |
| 998.52 | 70.25 |
| 998.59 | 70.25 |
| 998.65 | 70.25 |
| 998.72 | 70.25 |
| 998.79 | 70.25 |
| 998.86 | 70 |
| 998.93 | 70 |
| 999.0 | 70 |
| 999.06 | 69.75 |
| 999.13 | 69.75 |
| 999.2 | 69.75 |
| 999.27 | 69.75 |
| 999.34 | 69.75 |
| 999.41 | 69.5 |
| 999.47 | 69.5 |
| 999.54 | 69.5 |
| 999.61 | 69.25 |
| 999.68 | 69.25 |
| 999.75 | 69.25 |
| 999.82 | 69 |
| 999.88 | 69 |
| 999.95 | 69 |
| 1000.02 | 69 |
| 1000.09 | 68.75 |
| 1000.16 | 68.75 |
| 1000.22 | 68.75 |
| 1000.29 | 68.75 |
| 1000.36 | 68.5 |
| 1000.43 | 68.5 |
| 1000.5 | 68.5 |
| 1000.57 | 68.5 |
| 1000.64 | 68.25 |
| 1000.7 | 68.25 |
| 1000.77 | 68.25 |
| 1000.84 | 68.25 |
| 1000.91 | 68.25 |
| 1000.98 | 68 |
| 1001.04 | 68 |
| 1001.11 | 68 |
| 1001.18 | 67.75 |
| 1001.25 | 67.75 |
| 1001.32 | 67.75 |
| 1001.39 | 67.75 |
| 1001.45 | 67.5 |
| 1001.52 | 67.5 |
| 1001.59 | 67.5 |
| 1001.66 | 67.5 |
| 1001.73 | 67.75 |
| 1001.79 | 68 |
| 1001.86 | 68.25 |
| 1001.93 | 68.75 |
| 1002.0 | 69 |
| 1002.07 | 69.5 |
| 1002.14 | 70 |
| 1002.21 | 70.5 |
| 1002.27 | 70.75 |
| 1002.34 | 71 |
| 1002.41 | 71.5 |
| 1002.48 | 71.5 |
| 1002.55 | 71.75 |
| 1002.61 | 72 |
| 1002.68 | 72.25 |
| 1002.75 | 72.75 |
| 1002.82 | 73 |
| 1002.89 | 73.25 |
| 1002.96 | 73.75 |
| 1003.02 | 74 |
| 1003.09 | 74.25 |
| 1003.16 | 74.5 |
| 1003.23 | 75 |
| 1003.3 | 75 |
| 1003.36 | 75.25 |
| 1003.43 | 75.5 |
| 1003.5 | 75.75 |
| 1003.57 | 76 |
| 1003.64 | 76.5 |
| 1003.71 | 76.75 |
| 1003.77 | 77 |
| 1003.84 | 77.25 |
| 1003.91 | 77.5 |
| 1003.98 | 77.75 |
| 1004.05 | 78.25 |
| 1004.11 | 78.5 |
| 1004.18 | 78.5 |
| 1004.25 | 78.75 |
| 1004.32 | 79 |
| 1004.39 | 79.25 |
| 1004.46 | 79.5 |
| 1004.52 | 79.75 |
| 1004.59 | 80 |
| 1004.66 | 80.25 |
| 1004.73 | 80.5 |
| 1004.8 | 80.75 |
| 1004.86 | 81 |
| 1004.93 | 81.25 |
| 1005.0 | 81.25 |
| 1005.07 | 81.5 |
| 1005.14 | 81.75 |
| 1005.21 | 82 |
| 1005.28 | 82.25 |
| 1005.34 | 82.5 |
| 1005.41 | 82.75 |
| 1005.48 | 82.75 |
| 1005.55 | 83 |
| 1005.62 | 83.25 |
| 1005.68 | 83.5 |
| 1005.75 | 83.75 |
| 1005.82 | 83.75 |
| 1005.89 | 84 |
| 1005.96 | 84.25 |
| 1006.03 | 84.5 |
| 1006.09 | 84.5 |
| 1006.16 | 84.75 |
| 1006.23 | 85 |
| 1006.3 | 85.25 |
| 1006.37 | 85.5 |
| 1006.44 | 85.5 |
| 1006.5 | 85.75 |
| 1006.57 | 86 |
| 1006.64 | 86 |
| 1006.71 | 86.25 |
| 1006.78 | 86.25 |
| 1006.84 | 86.5 |
| 1006.91 | 86.75 |
| 1006.98 | 87 |
| 1007.05 | 87.25 |
| 1007.12 | 87.25 |
| 1007.18 | 87.5 |
| 1007.25 | 87.75 |
| 1007.32 | 88 |
| 1007.39 | 88 |
| 1007.46 | 88 |
| 1007.53 | 88.25 |
| 1007.59 | 88.5 |
| 1007.66 | 88.75 |
| 1007.73 | 88.75 |
| 1007.8 | 89 |
| 1007.87 | 89.25 |
| 1007.94 | 89.25 |
| 1008.0 | 89.5 |
| 1008.07 | 89.75 |
| 1008.14 | 90 |
| 1008.21 | 90 |
| 1008.28 | 90 |
| 1008.34 | 90.25 |
| 1008.41 | 90.5 |
| 1008.48 | 90.5 |
| 1008.55 | 90.75 |
| 1008.62 | 91 |
| 1008.69 | 91.25 |
| 1008.75 | 91.25 |
| 1008.82 | 91.5 |
| 1008.89 | 91.5 |
| 1008.96 | 91.75 |
| 1009.03 | 92 |
| 1009.09 | 92 |
| 1009.16 | 92 |
| 1009.23 | 92.25 |
| 1009.3 | 92.5 |
| 1009.37 | 92.5 |
| 1009.44 | 92.75 |
| 1009.5 | 93 |
| 1009.57 | 93 |
| 1009.64 | 93.25 |
| 1009.71 | 93.5 |
| 1009.78 | 93.5 |
| 1009.85 | 93.75 |
| 1009.91 | 93.75 |
| 1009.98 | 93.75 |
| 1010.05 | 94 |
| 1010.12 | 94 |
| 1010.19 | 94.25 |
| 1010.26 | 94.5 |
| 1010.32 | 94.5 |
| 1010.39 | 94.75 |
| 1010.46 | 95 |
| 1010.53 | 95 |
| 1010.6 | 95.25 |
| 1010.66 | 95.5 |
| 1010.73 | 95.5 |
| 1010.8 | 95.5 |
| 1010.87 | 95.75 |
| 1010.94 | 95.75 |
| 1011.01 | 96 |
| 1011.07 | 96.25 |
| 1011.14 | 96.25 |
| 1011.21 | 96.25 |
| 1011.28 | 96.5 |
| 1011.35 | 96.75 |
| 1011.41 | 96.75 |
| 1011.48 | 97 |
| 1011.55 | 97 |
| 1011.62 | 97 |
| 1011.69 | 97 |
| 1011.76 | 97.25 |
| 1011.82 | 97.5 |
| 1011.89 | 97.5 |
| 1011.96 | 97.75 |
| 1012.03 | 97.75 |
| 1012.1 | 98 |
| 1012.16 | 98 |
| 1012.23 | 98.25 |
| 1012.3 | 98.5 |
| 1012.37 | 98.5 |
| 1012.44 | 98.5 |
| 1012.51 | 98.75 |
| 1012.58 | 98.75 |
| 1012.64 | 99 |
| 1012.71 | 99 |
| 1012.78 | 99.25 |
| 1012.85 | 99.5 |
| 1012.92 | 99.5 |
| 1012.98 | 99.5 |
| 1013.05 | 99.75 |
| 1013.12 | 99.75 |
| 1013.19 | 100 |
| 1013.26 | 100 |
| 1013.33 | 100 |
| 1013.39 | 100.25 |
| 1013.46 | 100.25 |
| 1013.53 | 100.25 |
| 1013.6 | 100.5 |
| 1013.67 | 100.5 |
| 1013.74 | 100.75 |
| 1013.8 | 100.75 |
| 1013.87 | 100.75 |
| 1013.94 | 101 |
| 1014.01 | 101 |
| 1014.08 | 101 |
| 1014.15 | 101 |
| 1014.21 | 101 |
| 1014.28 | 101 |
| 1014.35 | 101.25 |
| 1014.42 | 101.25 |
| 1014.49 | 101.25 |
| 1014.56 | 101.25 |
| 1014.63 | 101 |
| 1014.69 | 101.25 |
| 1014.76 | 101 |
| 1014.83 | 101 |
| 1014.9 | 101 |
| 1014.97 | 100.5 |
| 1015.03 | 100.25 |
| 1015.1 | 100 |
| 1015.17 | 99.5 |
| 1015.24 | 99.25 |
| 1015.31 | 99 |
| 1015.37 | 98.5 |
| 1015.44 | 98 |
| 1015.51 | 97.5 |
| 1015.58 | 97 |
| 1015.65 | 96.5 |
| 1015.72 | 96.5 |
| 1015.78 | 96 |
| 1015.85 | 95.5 |
| 1015.92 | 95 |
| 1015.99 | 94.25 |
| 1016.06 | 93.75 |
| 1016.13 | 93.25 |
| 1016.19 | 92.75 |
| 1016.26 | 92.25 |
| 1016.33 | 91.5 |
| 1016.4 | 91 |
| 1016.47 | 90.5 |
| 1016.53 | 90.5 |
| 1016.6 | 90 |
| 1016.67 | 89.5 |
| 1016.74 | 89 |
| 1016.81 | 88.25 |
| 1016.88 | 88 |
| 1016.94 | 87.25 |
| 1017.01 | 87 |
| 1017.08 | 86.5 |
| 1017.15 | 86 |
| 1017.22 | 85.5 |
| 1017.28 | 85.25 |
| 1017.35 | 85.25 |
| 1017.42 | 84.75 |
| 1017.49 | 84.25 |
| 1017.56 | 83.75 |
| 1017.62 | 83.5 |
| 1017.69 | 83 |
| 1017.76 | 82.5 |
| 1017.83 | 82.25 |
| 1017.9 | 81.75 |
| 1017.97 | 81.5 |
| 1018.03 | 81 |
| 1018.1 | 80.75 |
| 1018.17 | 80.75 |
| 1018.24 | 80.25 |
| 1018.31 | 80 |
| 1018.38 | 79.75 |
| 1018.44 | 79.25 |
| 1018.51 | 79 |
| 1018.58 | 78.75 |
| 1018.65 | 78.5 |
| 1018.72 | 78 |
| 1018.78 | 77.75 |
| 1018.85 | 77.5 |
| 1018.92 | 77.25 |
| 1018.99 | 77.25 |
| 1019.06 | 76.75 |
| 1019.12 | 76.75 |
| 1019.19 | 76.25 |
| 1019.26 | 76 |
| 1019.33 | 75.75 |
| 1019.4 | 75.5 |
| 1019.47 | 75.25 |
| 1019.53 | 75 |
| 1019.6 | 74.5 |
| 1019.67 | 74.5 |
| 1019.74 | 74.25 |
| 1019.81 | 74.25 |
| 1019.87 | 74 |
| 1019.94 | 73.5 |
| 1020.01 | 73.25 |
| 1020.08 | 73 |
| 1020.15 | 73 |
| 1020.22 | 72.5 |
| 1020.28 | 72.5 |
| 1020.35 | 72 |
| 1020.42 | 72 |
| 1020.49 | 71.75 |
| 1020.56 | 71.5 |
| 1020.62 | 71.5 |
| 1020.69 | 71.25 |
| 1020.76 | 71 |
| 1020.83 | 70.75 |
| 1020.9 | 70.5 |
| 1020.97 | 70.25 |
| 1021.03 | 70 |
| 1021.1 | 69.75 |
| 1021.17 | 69.5 |
| 1021.24 | 69.25 |
| 1021.3 | 69 |
| 1021.37 | 68.75 |
| 1021.44 | 68.75 |
| 1021.51 | 68.75 |
| 1021.58 | 68.5 |
| 1021.65 | 68.25 |
| 1021.72 | 68 |
| 1021.78 | 68 |
| 1021.85 | 68.25 |
| 1021.92 | 68.5 |
| 1021.99 | 68.25 |
| 1022.06 | 68.5 |
| 1022.13 | 68.5 |
| 1022.19 | 68.75 |
| 1022.26 | 68.75 |
| 1022.33 | 68.75 |
| 1022.4 | 68.75 |
| 1022.47 | 69 |
| 1022.53 | 69 |
| 1022.6 | 69.25 |
| 1022.67 | 69.25 |
| 1022.74 | 69.5 |
| 1022.81 | 69.5 |
| 1022.88 | 69.5 |
| 1022.95 | 69.5 |
| 1023.01 | 69.75 |
| 1023.08 | 69.75 |
| 1023.15 | 69.75 |
| 1023.22 | 69.75 |
| 1023.29 | 70 |
| 1023.35 | 70 |
| 1023.42 | 70 |
| 1023.49 | 70 |
| 1023.56 | 70.25 |
| 1023.63 | 70.25 |
| 1023.7 | 70.25 |
| 1023.76 | 70.25 |
| 1023.83 | 70.5 |
| 1023.9 | 70.25 |
| 1023.97 | 70.25 |
| 1024.04 | 70.25 |
| 1024.1 | 70.25 |
| 1024.17 | 70.25 |
| 1024.24 | 70.25 |
| 1024.31 | 70.25 |
| 1024.38 | 70 |
| 1024.45 | 70 |
| 1024.52 | 70 |
| 1024.58 | 69.75 |
| 1024.65 | 69.75 |
| 1024.72 | 69.75 |
| 1024.79 | 69.75 |
| 1024.86 | 69.75 |
| 1024.93 | 69.5 |
| 1024.99 | 69.5 |
| 1025.06 | 69.5 |
| 1025.13 | 69.25 |
| 1025.2 | 69.25 |
| 1025.27 | 69.25 |
| 1025.33 | 69 |
| 1025.4 | 69 |
| 1025.47 | 69 |
| 1025.54 | 68.75 |
| 1025.61 | 68.75 |
| 1025.68 | 68.75 |
| 1025.74 | 68.75 |
| 1025.81 | 68.75 |
| 1025.88 | 68.5 |
| 1025.95 | 68.5 |
| 1026.02 | 68.5 |
| 1026.09 | 68.5 |
| 1026.15 | 68.5 |
| 1026.22 | 68.25 |
| 1026.29 | 68.25 |
| 1026.36 | 68.25 |
| 1026.43 | 68.25 |
| 1026.5 | 68 |
| 1026.56 | 68 |
| 1026.63 | 68 |
| 1026.7 | 68 |
| 1026.77 | 67.75 |
| 1026.84 | 67.75 |
| 1026.91 | 67.75 |
| 1026.97 | 67.75 |
| 1027.04 | 68 |
| 1027.11 | 68.25 |
| 1027.18 | 68.75 |
| 1027.25 | 69 |
| 1027.31 | 69 |
| 1027.38 | 69.5 |
| 1027.45 | 70 |
| 1027.52 | 70.5 |
| 1027.59 | 70.75 |
| 1027.66 | 71 |
| 1027.72 | 71.5 |
| 1027.79 | 71.75 |
| 1027.86 | 72 |
| 1027.93 | 72.5 |
| 1028.0 | 72.75 |
| 1028.06 | 73 |
| 1028.13 | 73 |
| 1028.2 | 73.25 |
| 1028.27 | 73.75 |
| 1028.34 | 74 |
| 1028.41 | 74.25 |
| 1028.47 | 74.5 |
| 1028.54 | 75 |
| 1028.61 | 75.25 |
| 1028.68 | 75.5 |
| 1028.75 | 75.75 |
| 1028.81 | 76.25 |
| 1028.88 | 76.5 |
| 1028.95 | 76.5 |
| 1029.02 | 76.75 |
| 1029.09 | 77 |
| 1029.16 | 77.25 |
| 1029.22 | 77.5 |
| 1029.29 | 77.75 |
| 1029.36 | 78 |
| 1029.43 | 78.25 |
| 1029.5 | 78.5 |
| 1029.57 | 79 |
| 1029.63 | 79.25 |
| 1029.7 | 79.5 |
| 1029.77 | 79.5 |
| 1029.84 | 79.75 |
| 1029.91 | 80 |
| 1029.98 | 80.25 |
| 1030.04 | 80.5 |
| 1030.11 | 80.75 |
| 1030.18 | 81 |
| 1030.25 | 81.25 |
| 1030.32 | 81.5 |
| 1030.38 | 81.75 |
| 1030.45 | 82 |
| 1030.52 | 82.25 |
| 1030.59 | 82.25 |
| 1030.66 | 82.5 |
| 1030.72 | 82.75 |
| 1030.79 | 83 |
| 1030.86 | 83.25 |
| 1030.93 | 83.5 |
| 1031.0 | 83.5 |
| 1031.07 | 84 |
| 1031.14 | 84 |
| 1031.2 | 84.25 |
| 1031.27 | 84.5 |
| 1031.34 | 84.75 |
| 1031.41 | 84.75 |
| 1031.48 | 85 |
| 1031.54 | 85.25 |
| 1031.61 | 85.25 |
| 1031.68 | 85.75 |
| 1031.75 | 85.75 |
| 1031.82 | 86 |
| 1031.89 | 86.25 |
| 1031.95 | 86.5 |
| 1032.02 | 86.75 |
| 1032.09 | 86.75 |
| 1032.16 | 87 |
| 1032.23 | 87 |
| 1032.3 | 87.25 |
| 1032.36 | 87.5 |
| 1032.43 | 87.75 |
| 1032.5 | 87.75 |
| 1032.57 | 88 |
| 1032.64 | 88.25 |
| 1032.7 | 88.25 |
| 1032.77 | 88.5 |
| 1032.84 | 88.75 |
| 1032.91 | 89 |
| 1032.98 | 89.25 |
| 1033.05 | 89.25 |
| 1033.11 | 89.25 |
| 1033.18 | 89.5 |
| 1033.25 | 89.75 |
| 1033.32 | 90 |
| 1033.39 | 90.25 |
| 1033.45 | 90.25 |
| 1033.52 | 90.5 |
| 1033.59 | 90.75 |
| 1033.66 | 90.75 |
| 1033.73 | 91 |
| 1033.8 | 91.25 |
| 1033.86 | 91.25 |
| 1033.93 | 91.25 |
| 1034.0 | 91.5 |
| 1034.07 | 91.5 |
| 1034.14 | 91.75 |
| 1034.2 | 91.75 |
| 1034.27 | 92 |
| 1034.34 | 92.25 |
| 1034.41 | 92.25 |
| 1034.48 | 92.5 |
| 1034.55 | 92.5 |
| 1034.61 | 92.75 |
| 1034.68 | 92.75 |
| 1034.75 | 92.75 |
| 1034.82 | 93 |
| 1034.89 | 93 |
| 1034.95 | 93.25 |
| 1035.02 | 93.5 |
| 1035.09 | 93.5 |
| 1035.16 | 93.5 |
| 1035.23 | 93.75 |
| 1035.3 | 94 |
| 1035.36 | 94 |
| 1035.43 | 94.25 |
| 1035.5 | 94.25 |
| 1035.57 | 94.25 |
| 1035.64 | 94.5 |
| 1035.71 | 94.5 |
| 1035.77 | 94.75 |
| 1035.84 | 94.75 |
| 1035.91 | 95 |
| 1035.98 | 95 |
| 1036.05 | 95.25 |
| 1036.11 | 95.5 |
| 1036.18 | 95.5 |
| 1036.25 | 95.75 |
| 1036.32 | 95.75 |
| 1036.39 | 96 |
| 1036.46 | 96 |
| 1036.53 | 96.25 |
| 1036.59 | 96.25 |
| 1036.66 | 96.5 |
| 1036.73 | 96.5 |
| 1036.8 | 96.75 |
| 1036.87 | 97 |
| 1036.94 | 97 |
| 1037.0 | 97.25 |
| 1037.07 | 97.25 |
| 1037.14 | 97.5 |
| 1037.21 | 97.5 |
| 1037.28 | 97.5 |
| 1037.34 | 97.75 |
| 1037.41 | 98 |
| 1037.48 | 98 |
| 1037.55 | 98 |
| 1037.62 | 98.25 |
| 1037.69 | 98.5 |
| 1037.75 | 98.5 |
| 1037.82 | 98.75 |
| 1037.89 | 98.75 |
| 1037.96 | 99 |
| 1038.03 | 99 |
| 1038.09 | 99 |
| 1038.16 | 99.25 |
| 1038.23 | 99.5 |
| 1038.3 | 99.5 |
| 1038.37 | 99.75 |
| 1038.44 | 99.75 |
| 1038.5 | 99.75 |
| 1038.57 | 100 |
| 1038.64 | 100 |
| 1038.71 | 100.25 |
| 1038.78 | 100.25 |
| 1038.84 | 100.25 |
| 1038.91 | 100.5 |
| 1038.98 | 100.5 |
| 1039.05 | 100.5 |
| 1039.12 | 100.5 |
| 1039.19 | 100.75 |
| 1039.26 | 100.75 |
| 1039.32 | 100.75 |
| 1039.39 | 100.75 |
| 1039.46 | 100.75 |
| 1039.53 | 100.75 |
| 1039.6 | 101 |
| 1039.67 | 101 |
| 1039.73 | 101 |
| 1039.8 | 101 |
| 1039.87 | 101 |
| 1039.94 | 101 |
| 1040.01 | 101 |
| 1040.07 | 101 |
| 1040.14 | 100.75 |
| 1040.21 | 100.75 |
| 1040.28 | 100 |
| 1040.35 | 100 |
| 1040.42 | 99.5 |
| 1040.48 | 99.5 |
| 1040.55 | 99.25 |
| 1040.62 | 99 |
| 1040.69 | 98.5 |
| 1040.76 | 98 |
| 1040.83 | 97.5 |
| 1040.89 | 97 |
| 1040.96 | 96.5 |
| 1041.03 | 96 |
| 1041.1 | 95.5 |
| 1041.17 | 94.75 |
| 1041.23 | 94.25 |
| 1041.3 | 94.25 |
| 1041.37 | 93.75 |
| 1041.44 | 93.25 |
| 1041.51 | 92.75 |
| 1041.57 | 92.25 |
| 1041.64 | 91.5 |
| 1041.71 | 91 |
| 1041.78 | 90.5 |
| 1041.85 | 90 |
| 1041.92 | 89.5 |
| 1041.98 | 89 |
| 1042.05 | 88.5 |
| 1042.12 | 88.5 |
| 1042.19 | 88 |
| 1042.26 | 87.5 |
| 1042.32 | 87 |
| 1042.39 | 86.75 |
| 1042.46 | 86.25 |
| 1042.53 | 85.75 |
| 1042.6 | 85.25 |
| 1042.67 | 84.75 |
| 1042.73 | 84.5 |
| 1042.8 | 84 |
| 1042.87 | 83.5 |
| 1042.94 | 83.5 |
| 1043.01 | 83 |
| 1043.08 | 82.75 |
| 1043.14 | 82.25 |
| 1043.21 | 82 |
| 1043.28 | 81.5 |
| 1043.35 | 81.25 |
| 1043.42 | 81 |
| 1043.48 | 80.5 |
| 1043.55 | 80.25 |
| 1043.62 | 80 |
| 1043.69 | 79.5 |
| 1043.76 | 79.5 |
| 1043.82 | 79.25 |
| 1043.89 | 79 |
| 1043.96 | 78.5 |
| 1044.03 | 78.25 |
| 1044.1 | 78 |
| 1044.17 | 77.5 |
| 1044.23 | 77.25 |
| 1044.3 | 77 |
| 1044.37 | 76.75 |
| 1044.44 | 76.5 |
| 1044.51 | 76.25 |
| 1044.58 | 76.25 |
| 1044.64 | 75.75 |
| 1044.71 | 75.5 |
| 1044.78 | 75.25 |
| 1044.85 | 75 |
| 1044.92 | 74.75 |
| 1044.98 | 74.5 |
| 1045.05 | 74.25 |
| 1045.12 | 74 |
| 1045.19 | 73.5 |
| 1045.26 | 73.5 |
| 1045.32 | 73 |
| 1045.39 | 73 |
| 1045.46 | 72.75 |
| 1045.53 | 72.75 |
| 1045.6 | 72.25 |
| 1045.67 | 72 |
| 1045.73 | 72 |
| 1045.8 | 71.5 |
| 1045.87 | 71.5 |
| 1045.94 | 71.25 |
| 1046.01 | 71 |
| 1046.07 | 70.75 |
| 1046.14 | 70.5 |
| 1046.21 | 70.5 |
| 1046.28 | 70.25 |
| 1046.35 | 70 |
| 1046.42 | 69.75 |
| 1046.48 | 69.5 |
| 1046.55 | 69.25 |
| 1046.62 | 69.25 |
| 1046.69 | 69 |
| 1046.76 | 68.75 |
| 1046.82 | 68.5 |
| 1046.89 | 68.25 |
| 1046.96 | 68 |
| 1047.03 | 68 |
| 1047.1 | 68.25 |
| 1047.17 | 68.5 |
| 1047.23 | 68.5 |
| 1047.3 | 68.75 |
| 1047.37 | 68.75 |
| 1047.44 | 69 |
| 1047.51 | 69 |
| 1047.58 | 69.25 |
| 1047.65 | 69.25 |
| 1047.71 | 69.25 |
| 1047.78 | 69.5 |
| 1047.85 | 69.5 |
| 1047.92 | 69.5 |
| 1047.99 | 69.75 |
| 1048.05 | 69.75 |
| 1048.12 | 69.75 |
| 1048.19 | 70 |
| 1048.26 | 70 |
| 1048.33 | 70 |
| 1048.4 | 70.25 |
| 1048.46 | 70.25 |
| 1048.53 | 70.25 |
| 1048.6 | 70.25 |
| 1048.67 | 70.5 |
| 1048.74 | 70.5 |
| 1048.81 | 70.5 |
| 1048.87 | 70.5 |
| 1048.94 | 70.5 |
| 1049.01 | 70.5 |
| 1049.08 | 70.5 |
| 1049.15 | 70.5 |
| 1049.22 | 70.5 |
| 1049.28 | 70.25 |
| 1049.35 | 70.25 |
| 1049.42 | 70 |
| 1049.49 | 70 |
| 1049.56 | 70 |
| 1049.63 | 70 |
| 1049.69 | 69.75 |
| 1049.76 | 69.75 |
| 1049.83 | 69.75 |
| 1049.9 | 69.75 |
| 1049.97 | 69.5 |
| 1050.04 | 69.5 |
| 1050.1 | 69.5 |
| 1050.17 | 69.25 |
| 1050.24 | 69.25 |
| 1050.31 | 69.25 |
| 1050.38 | 69.25 |
| 1050.44 | 69.25 |
| 1050.51 | 69 |
| 1050.58 | 69 |
| 1050.65 | 69 |
| 1050.72 | 68.75 |
| 1050.79 | 68.75 |
| 1050.85 | 68.75 |
| 1050.92 | 68.75 |
| 1050.99 | 68.5 |
| 1051.06 | 68.5 |
| 1051.13 | 68.5 |
| 1051.2 | 68.5 |
| 1051.27 | 68.5 |
| 1051.33 | 68.5 |
| 1051.4 | 68.25 |
| 1051.47 | 68.25 |
| 1051.54 | 68 |
| 1051.61 | 68 |
| 1051.67 | 68 |
| 1051.74 | 68 |
| 1051.81 | 68 |
| 1051.88 | 67.75 |
| 1051.95 | 67.75 |
| 1052.02 | 67.75 |
| 1052.08 | 67.75 |
| 1052.15 | 67.75 |
| 1052.22 | 67.75 |
| 1052.29 | 67.75 |
| 1052.36 | 68 |
| 1052.43 | 68.5 |
| 1052.49 | 69 |
| 1052.56 | 69.25 |
| 1052.63 | 69.75 |
| 1052.7 | 70.25 |
| 1052.77 | 70.75 |
| 1052.83 | 71 |
| 1052.9 | 71 |
| 1052.97 | 71.25 |
| 1053.04 | 71.5 |
| 1053.11 | 72 |
| 1053.18 | 72.25 |
| 1053.24 | 72.5 |
| 1053.31 | 73 |
| 1053.38 | 73.25 |
| 1053.45 | 73.5 |
| 1053.52 | 74 |
| 1053.58 | 74.25 |
| 1053.65 | 74.5 |
| 1053.72 | 74.5 |
| 1053.79 | 75 |
| 1053.86 | 75.25 |
| 1053.93 | 75.5 |
| 1053.99 | 75.75 |
| 1054.06 | 76 |
| 1054.13 | 76.5 |
| 1054.2 | 76.75 |
| 1054.27 | 77 |
| 1054.33 | 77.25 |
| 1054.4 | 77.5 |
| 1054.47 | 77.75 |
| 1054.54 | 77.75 |
| 1054.61 | 78.25 |
| 1054.68 | 78.5 |
| 1054.74 | 78.75 |
| 1054.81 | 79 |
| 1054.88 | 79.25 |
| 1054.95 | 79.5 |
| 1055.02 | 79.75 |
| 1055.08 | 80 |
| 1055.15 | 80.5 |
| 1055.22 | 80.75 |
| 1055.29 | 81 |
| 1055.36 | 81 |
| 1055.43 | 81.25 |
| 1055.5 | 81.5 |
| 1055.56 | 81.75 |
| 1055.63 | 82 |
| 1055.7 | 82.25 |
| 1055.77 | 82.25 |
| 1055.84 | 82.5 |
| 1055.9 | 83 |
| 1055.97 | 83 |
| 1056.04 | 83.25 |
| 1056.11 | 83.5 |
| 1056.18 | 83.5 |
| 1056.25 | 83.75 |
| 1056.31 | 84 |
| 1056.38 | 84.25 |
| 1056.45 | 84.5 |
| 1056.52 | 84.75 |
| 1056.59 | 85 |
| 1056.65 | 85.25 |
| 1056.72 | 85.25 |
| 1056.79 | 85.5 |
| 1056.86 | 85.75 |
| 1056.93 | 86 |
| 1057.0 | 86 |
| 1057.06 | 86.25 |
| 1057.13 | 86.5 |
| 1057.2 | 86.5 |
| 1057.27 | 86.75 |
| 1057.34 | 87 |
| 1057.4 | 87.25 |
| 1057.47 | 87.5 |
| 1057.54 | 87.5 |
| 1057.61 | 87.75 |
| 1057.68 | 88 |
| 1057.75 | 88.25 |
| 1057.81 | 88.25 |
| 1057.88 | 88.25 |
| 1057.95 | 88.5 |
| 1058.02 | 88.75 |
| 1058.09 | 89 |
| 1058.16 | 89 |
| 1058.22 | 89.25 |
| 1058.29 | 89.5 |
| 1058.36 | 89.75 |
| 1058.43 | 90 |
| 1058.5 | 90.25 |
| 1058.56 | 90.25 |
| 1058.63 | 90.25 |
| 1058.7 | 90.5 |
| 1058.77 | 90.75 |
| 1058.84 | 90.75 |
| 1058.91 | 91 |
| 1058.97 | 91.25 |
| 1059.04 | 91.25 |
| 1059.11 | 91.5 |
| 1059.18 | 91.75 |
| 1059.25 | 92 |
| 1059.31 | 92 |
| 1059.38 | 92.25 |
| 1059.45 | 92.25 |
| 1059.52 | 92.5 |
| 1059.59 | 92.5 |
| 1059.66 | 92.75 |
| 1059.72 | 93 |
| 1059.79 | 93 |
| 1059.86 | 93.25 |
| 1059.93 | 93.5 |
| 1060.0 | 93.5 |
| 1060.07 | 93.75 |
| 1060.13 | 94 |
| 1060.2 | 94 |
| 1060.27 | 94.25 |
| 1060.34 | 94.25 |
| 1060.41 | 94.25 |
| 1060.47 | 94.5 |
| 1060.54 | 94.75 |
| 1060.61 | 95 |
| 1060.68 | 95 |
| 1060.75 | 95.25 |
| 1060.82 | 95.25 |
| 1060.88 | 95.5 |
| 1060.95 | 95.75 |
| 1061.02 | 95.75 |
| 1061.09 | 96 |
| 1061.16 | 96 |
| 1061.23 | 96 |
| 1061.29 | 96.25 |
| 1061.36 | 96.5 |
| 1061.43 | 96.5 |
| 1061.5 | 96.75 |
| 1061.57 | 96.75 |
| 1061.64 | 97 |
| 1061.7 | 97.25 |
| 1061.77 | 97.25 |
| 1061.84 | 97.25 |
| 1061.91 | 97.5 |
| 1061.98 | 97.5 |
| 1062.04 | 97.75 |
| 1062.11 | 97.75 |
| 1062.18 | 98 |
| 1062.25 | 98 |
| 1062.32 | 98.25 |
| 1062.39 | 98.5 |
| 1062.45 | 98.5 |
| 1062.52 | 98.5 |
| 1062.59 | 98.75 |
| 1062.66 | 98.75 |
| 1062.73 | 99 |
| 1062.8 | 99 |
| 1062.86 | 99 |
| 1062.93 | 99.25 |
| 1063.0 | 99.25 |
| 1063.07 | 99.5 |
| 1063.14 | 99.5 |
| 1063.2 | 99.75 |
| 1063.27 | 99.75 |
| 1063.34 | 100 |
| 1063.41 | 100 |
| 1063.48 | 100 |
| 1063.55 | 100.25 |
| 1063.61 | 100.25 |
| 1063.68 | 100.25 |
| 1063.75 | 100.25 |
| 1063.82 | 100.5 |
| 1063.89 | 100.5 |
| 1063.96 | 100.75 |
| 1064.03 | 100.75 |
| 1064.09 | 100.75 |
| 1064.16 | 100.75 |
| 1064.23 | 100.75 |
| 1064.3 | 101 |
| 1064.37 | 100.75 |
| 1064.43 | 100.75 |
| 1064.5 | 101 |
| 1064.57 | 101 |
| 1064.64 | 101 |
| 1064.71 | 100.75 |
| 1064.78 | 101 |
| 1064.84 | 100.75 |
| 1064.91 | 101 |
| 1064.98 | 100.75 |
| 1065.05 | 100.5 |
| 1065.12 | 100.25 |
| 1065.19 | 99.75 |
| 1065.25 | 99.5 |
| 1065.32 | 99.5 |
| 1065.39 | 99.25 |
| 1065.46 | 98.75 |
| 1065.53 | 98.5 |
| 1065.59 | 98 |
| 1065.66 | 97.5 |
| 1065.73 | 97 |
| 1065.8 | 96.5 |
| 1065.87 | 96 |
| 1065.94 | 95.5 |
| 1066.0 | 94.75 |
| 1066.07 | 94.25 |
| 1066.14 | 94.25 |
| 1066.21 | 93.75 |
| 1066.28 | 93.25 |
| 1066.34 | 92.75 |
| 1066.41 | 92.25 |
| 1066.48 | 91.5 |
| 1066.55 | 91 |
| 1066.62 | 90.5 |
| 1066.69 | 90 |
| 1066.75 | 89.5 |
| 1066.82 | 89 |
| 1066.89 | 88.5 |
| 1066.96 | 88.5 |
| 1067.03 | 88 |
| 1067.09 | 87.5 |
| 1067.16 | 87 |
| 1067.23 | 86.5 |
| 1067.3 | 86 |
| 1067.37 | 85.5 |
| 1067.44 | 85.25 |
| 1067.5 | 84.75 |
| 1067.57 | 84.25 |
| 1067.64 | 84 |
| 1067.71 | 83.5 |
| 1067.78 | 83.5 |
| 1067.84 | 83 |
| 1067.91 | 82.75 |
| 1067.98 | 82.25 |
| 1068.05 | 81.75 |
| 1068.12 | 81.5 |
| 1068.19 | 81.25 |
| 1068.25 | 80.75 |
| 1068.32 | 80.5 |
| 1068.39 | 80.25 |
| 1068.46 | 79.75 |
| 1068.53 | 79.75 |
| 1068.59 | 79.5 |
| 1068.66 | 79.25 |
| 1068.73 | 78.75 |
| 1068.8 | 78.5 |
| 1068.87 | 78 |
| 1068.94 | 77.75 |
| 1069.0 | 77.5 |
| 1069.07 | 77.25 |
| 1069.14 | 76.75 |
| 1069.21 | 76.5 |
| 1069.28 | 76.25 |
| 1069.34 | 76.25 |
| 1069.41 | 76 |
| 1069.48 | 75.75 |
| 1069.55 | 75.25 |
| 1069.62 | 75 |
| 1069.69 | 74.75 |
| 1069.75 | 74.5 |
| 1069.82 | 74.25 |
| 1069.89 | 74 |
| 1069.96 | 73.75 |
| 1070.03 | 73.5 |
| 1070.09 | 73.25 |
| 1070.16 | 73.25 |
| 1070.23 | 73 |
| 1070.3 | 72.75 |
| 1070.37 | 72.5 |
| 1070.44 | 72.25 |
| 1070.5 | 72 |
| 1070.57 | 71.75 |
| 1070.64 | 71.5 |
| 1070.71 | 71.25 |
| 1070.78 | 71 |
| 1070.84 | 70.75 |
| 1070.91 | 70.5 |
| 1070.98 | 70.5 |
| 1071.05 | 70.5 |
| 1071.12 | 70.25 |
| 1071.19 | 69.75 |
| 1071.25 | 69.75 |
| 1071.32 | 69.5 |
| 1071.39 | 69.25 |
| 1071.46 | 69 |
| 1071.53 | 68.75 |
| 1071.59 | 68.5 |
| 1071.66 | 68.5 |
| 1071.73 | 68.25 |
| 1071.8 | 68.25 |
| 1071.87 | 68.25 |
| 1071.94 | 68.5 |
| 1072.0 | 68.75 |
| 1072.07 | 68.75 |
| 1072.14 | 68.75 |
| 1072.21 | 69 |
| 1072.28 | 69 |
| 1072.35 | 69.25 |
| 1072.41 | 69.25 |
| 1072.48 | 69.25 |
| 1072.55 | 69.5 |
| 1072.62 | 69.5 |
| 1072.69 | 69.5 |
| 1072.76 | 69.5 |
| 1072.82 | 69.75 |
| 1072.89 | 69.75 |
| 1072.96 | 69.75 |
| 1073.03 | 70 |
| 1073.1 | 70 |
| 1073.17 | 70 |
| 1073.23 | 70 |
| 1073.3 | 70.25 |
| 1073.37 | 70.25 |
| 1073.44 | 70.25 |
| 1073.51 | 70.25 |
| 1073.57 | 70.5 |
| 1073.64 | 70.5 |
| 1073.71 | 70.5 |
| 1073.78 | 70.5 |
| 1073.85 | 70.25 |
| 1073.92 | 70.25 |
| 1073.98 | 70.25 |
| 1074.05 | 70.25 |
| 1074.12 | 70.25 |
| 1074.19 | 70.25 |
| 1074.26 | 70 |
| 1074.33 | 70 |
| 1074.4 | 70 |
| 1074.46 | 69.75 |
| 1074.53 | 69.75 |
| 1074.6 | 69.75 |
| 1074.67 | 69.75 |
| 1074.74 | 69.5 |
| 1074.8 | 69.5 |
| 1074.87 | 69.25 |
| 1074.94 | 69.25 |
| 1075.01 | 69.25 |
| 1075.08 | 69.25 |
| 1075.15 | 69.25 |
| 1075.21 | 69.25 |
| 1075.28 | 69 |
| 1075.35 | 69 |
| 1075.42 | 69 |
| 1075.49 | 68.75 |
| 1075.56 | 68.75 |
| 1075.62 | 68.75 |
| 1075.69 | 68.5 |
| 1075.76 | 68.5 |
| 1075.83 | 68.5 |
| 1075.9 | 68.5 |
| 1075.96 | 68.25 |
| 1076.03 | 68.25 |
| 1076.1 | 68.25 |
| 1076.17 | 68.25 |
| 1076.24 | 68.25 |
| 1076.31 | 68 |
| 1076.38 | 68 |
| 1076.44 | 68 |
| 1076.51 | 68 |
| 1076.58 | 67.75 |
| 1076.65 | 67.75 |
| 1076.72 | 67.75 |
| 1076.79 | 67.5 |
| 1076.85 | 67.5 |
| 1076.92 | 67.5 |
| 1076.99 | 67.75 |
| 1077.06 | 67.75 |
| 1077.13 | 68 |
| 1077.19 | 68.25 |
| 1077.26 | 68.75 |
| 1077.33 | 69.25 |
| 1077.4 | 69.75 |
| 1077.47 | 70 |
| 1077.54 | 70.5 |
| 1077.6 | 70.75 |
| 1077.67 | 70.75 |
| 1077.74 | 71.25 |
| 1077.81 | 71.5 |
| 1077.88 | 71.75 |
| 1077.94 | 72 |
| 1078.01 | 72.25 |
| 1078.08 | 72.75 |
| 1078.15 | 73 |
| 1078.22 | 73.5 |
| 1078.29 | 73.75 |
| 1078.35 | 74 |
| 1078.42 | 74.25 |
| 1078.49 | 74.25 |
| 1078.56 | 74.5 |
| 1078.63 | 75 |
| 1078.69 | 75.25 |
| 1078.76 | 75.5 |
| 1078.83 | 76 |
| 1078.9 | 76 |
| 1078.97 | 76.5 |
| 1079.04 | 76.75 |
| 1079.1 | 77 |
| 1079.17 | 77.25 |
| 1079.24 | 77.5 |
| 1079.31 | 77.5 |
| 1079.38 | 77.75 |
| 1079.44 | 78 |
| 1079.51 | 78.5 |
| 1079.58 | 78.75 |
| 1079.65 | 79 |
| 1079.72 | 79.25 |
| 1079.79 | 79.5 |
| 1079.85 | 79.75 |
| 1079.92 | 80 |
| 1079.99 | 80.25 |
| 1080.06 | 80.5 |
| 1080.13 | 80.5 |
| 1080.2 | 80.75 |
| 1080.26 | 81 |
| 1080.33 | 81.25 |
| 1080.4 | 81.5 |
| 1080.47 | 81.75 |
| 1080.54 | 82 |
| 1080.6 | 82.25 |
| 1080.67 | 82.25 |
| 1080.74 | 82.5 |
| 1080.81 | 82.75 |
| 1080.88 | 83 |
| 1080.95 | 83 |
| 1081.01 | 83.25 |
| 1081.08 | 83.5 |
| 1081.15 | 83.75 |
| 1081.22 | 84 |
| 1081.29 | 84.25 |
| 1081.35 | 84.5 |
| 1081.42 | 84.5 |
| 1081.49 | 84.75 |
| 1081.56 | 85 |
| 1081.63 | 85.25 |
| 1081.7 | 85.25 |
| 1081.76 | 85.25 |
| 1081.83 | 85.5 |
| 1081.9 | 85.75 |
| 1081.97 | 86 |
| 1082.04 | 86.25 |
| 1082.1 | 86.25 |
| 1082.17 | 86.5 |
| 1082.24 | 86.75 |
| 1082.31 | 87 |
| 1082.38 | 87 |
| 1082.45 | 87.5 |
| 1082.52 | 87.5 |
| 1082.58 | 87.5 |
| 1082.65 | 87.75 |
| 1082.72 | 87.75 |
| 1082.79 | 88 |
| 1082.86 | 88.25 |
| 1082.93 | 88.25 |
| 1082.99 | 88.5 |
| 1083.06 | 88.75 |
| 1083.13 | 88.75 |
| 1083.2 | 89 |
| 1083.27 | 89.25 |
| 1083.33 | 89.5 |
| 1083.4 | 89.5 |
| 1083.47 | 89.5 |
| 1083.54 | 89.75 |
| 1083.61 | 90 |
| 1083.68 | 90 |
| 1083.74 | 90.25 |
| 1083.81 | 90.5 |
| 1083.88 | 90.75 |
| 1083.95 | 90.75 |
| 1084.02 | 91 |
| 1084.08 | 91.25 |
| 1084.15 | 91.25 |
| 1084.22 | 91.5 |
| 1084.29 | 91.5 |
| 1084.36 | 91.5 |
| 1084.43 | 91.75 |
| 1084.49 | 92 |
| 1084.56 | 92 |
| 1084.63 | 92.25 |
| 1084.7 | 92.5 |
| 1084.77 | 92.5 |
| 1084.83 | 92.75 |
| 1084.9 | 92.75 |
| 1084.97 | 93 |
| 1085.04 | 93.25 |
| 1085.11 | 93.25 |
| 1085.18 | 93.25 |
| 1085.24 | 93.5 |
| 1085.31 | 93.75 |
| 1085.38 | 93.75 |
| 1085.45 | 94 |
| 1085.52 | 94 |
| 1085.58 | 94.25 |
| 1085.65 | 94.5 |
| 1085.72 | 94.5 |
| 1085.79 | 94.75 |
| 1085.86 | 95 |
| 1085.93 | 95 |
| 1086.0 | 95 |
| 1086.06 | 95.25 |
| 1086.13 | 95.25 |
| 1086.2 | 95.5 |
| 1086.27 | 95.75 |
| 1086.34 | 95.75 |
| 1086.4 | 96 |
| 1086.47 | 96 |
| 1086.54 | 96.25 |
| 1086.61 | 96.25 |
| 1086.68 | 96.5 |
| 1086.75 | 96.5 |
| 1086.81 | 96.5 |
| 1086.88 | 96.75 |
| 1086.95 | 97 |
| 1087.02 | 97 |
| 1087.09 | 97.25 |
| 1087.15 | 97.25 |
| 1087.22 | 97.5 |
| 1087.29 | 97.5 |
| 1087.36 | 97.75 |
| 1087.43 | 97.75 |
| 1087.5 | 98 |
| 1087.56 | 98 |
| 1087.63 | 98 |
| 1087.7 | 98.25 |
| 1087.77 | 98.5 |
| 1087.84 | 98.5 |
| 1087.9 | 98.5 |
| 1087.97 | 98.75 |
| 1088.04 | 99 |
| 1088.11 | 99 |
| 1088.18 | 99.25 |
| 1088.25 | 99.25 |
| 1088.31 | 99.5 |
| 1088.38 | 99.5 |
| 1088.45 | 99.5 |
| 1088.52 | 99.75 |
| 1088.59 | 99.75 |
| 1088.66 | 100 |
| 1088.72 | 100 |
| 1088.79 | 100.25 |
| 1088.86 | 100.25 |
| 1088.93 | 100.25 |
| 1089.0 | 100.5 |
| 1089.06 | 100.5 |
| 1089.13 | 100.75 |
| 1089.2 | 100.75 |
| 1089.27 | 100.75 |
| 1089.34 | 100.75 |
| 1089.41 | 101 |
| 1089.47 | 101 |
| 1089.54 | 101 |
| 1089.61 | 101 |
| 1089.68 | 101 |
| 1089.75 | 101 |
| 1089.82 | 101.25 |
| 1089.89 | 101.25 |
| 1089.95 | 101 |
| 1090.02 | 101.25 |
| 1090.09 | 101.25 |
| 1090.16 | 101 |
| 1090.23 | 101 |
| 1090.3 | 101 |
| 1090.36 | 101 |
| 1090.43 | 100.25 |
| 1090.5 | 100 |
| 1090.57 | 99.75 |
| 1090.64 | 99.5 |
| 1090.7 | 99 |
| 1090.77 | 98.75 |
| 1090.84 | 98.25 |
| 1090.91 | 98.25 |
| 1090.98 | 97.75 |
| 1091.05 | 97.25 |
| 1091.11 | 97 |
| 1091.18 | 96.25 |
| 1091.25 | 95.75 |
| 1091.32 | 95.25 |
| 1091.39 | 94.75 |
| 1091.45 | 94.25 |
| 1091.52 | 93.5 |
| 1091.59 | 93 |
| 1091.66 | 92.5 |
| 1091.73 | 92.5 |
| 1091.8 | 92 |
| 1091.86 | 91.25 |
| 1091.93 | 91 |
| 1092.0 | 90.5 |
| 1092.07 | 89.75 |
| 1092.14 | 89.25 |
| 1092.2 | 88.75 |
| 1092.27 | 88.25 |
| 1092.34 | 87.75 |
| 1092.41 | 87.5 |
| 1092.48 | 86.75 |
| 1092.55 | 86.75 |
| 1092.61 | 86.25 |
| 1092.68 | 86 |
| 1092.75 | 85.5 |
| 1092.82 | 85 |
| 1092.89 | 84.75 |
| 1092.95 | 84.25 |
| 1093.02 | 84 |
| 1093.09 | 83.5 |
| 1093.16 | 83 |
| 1093.23 | 82.75 |
| 1093.3 | 82.25 |
| 1093.36 | 82.25 |
| 1093.43 | 82 |
| 1093.5 | 81.5 |
| 1093.57 | 81.25 |
| 1093.64 | 81 |
| 1093.7 | 80.5 |
| 1093.77 | 80.25 |
| 1093.84 | 79.75 |
| 1093.91 | 79.5 |
| 1093.98 | 79.25 |
| 1094.05 | 79 |
| 1094.11 | 78.5 |
| 1094.18 | 78.5 |
| 1094.25 | 78 |
| 1094.32 | 77.75 |
| 1094.39 | 77.5 |
| 1094.45 | 77.25 |
| 1094.52 | 77 |
| 1094.59 | 76.75 |
| 1094.66 | 76.5 |
| 1094.73 | 76.25 |
| 1094.8 | 76 |
| 1094.86 | 75.5 |
| 1094.93 | 75.25 |
| 1095.0 | 75.25 |
| 1095.07 | 75 |
| 1095.14 | 74.75 |
| 1095.2 | 74.5 |
| 1095.27 | 74.25 |
| 1095.34 | 74 |
| 1095.41 | 73.75 |
| 1095.48 | 73.5 |
| 1095.54 | 73 |
| 1095.61 | 73 |
| 1095.68 | 72.75 |
| 1095.75 | 72.25 |
| 1095.82 | 72.25 |
| 1095.89 | 72 |
| 1095.95 | 72 |
| 1096.02 | 71.75 |
| 1096.09 | 71.5 |
| 1096.16 | 71.25 |
| 1096.23 | 71 |
| 1096.3 | 70.75 |
| 1096.36 | 70.75 |
| 1096.43 | 70.5 |
| 1096.5 | 70 |
| 1096.57 | 69.75 |
| 1096.64 | 69.75 |
| 1096.7 | 69.5 |
| 1096.77 | 69.25 |
| 1096.84 | 69.25 |
| 1096.91 | 69 |
| 1096.98 | 68.75 |
| 1097.04 | 68.5 |
| 1097.11 | 68.25 |
| 1097.18 | 68.25 |
| 1097.25 | 68.25 |
| 1097.32 | 68.25 |
| 1097.39 | 68.5 |
| 1097.45 | 68.5 |
| 1097.52 | 68.5 |
| 1097.59 | 68.75 |
| 1097.66 | 68.75 |
| 1097.73 | 68.75 |
| 1097.8 | 69 |
| 1097.86 | 69 |
| 1097.93 | 69 |
| 1098.0 | 69.25 |
| 1098.07 | 69.25 |
| 1098.14 | 69.25 |
| 1098.21 | 69.5 |
| 1098.27 | 69.5 |
| 1098.34 | 69.5 |
| 1098.41 | 69.5 |
| 1098.48 | 69.75 |
| 1098.55 | 69.75 |
| 1098.61 | 69.75 |
| 1098.68 | 69.75 |
| 1098.75 | 70 |
| 1098.82 | 70 |
| 1098.89 | 70 |
| 1098.96 | 70.25 |
| 1099.03 | 70.25 |
| 1099.09 | 70.25 |
| 1099.16 | 70 |
| 1099.23 | 70 |
| 1099.3 | 70 |
| 1099.37 | 70 |
| 1099.44 | 70.25 |
| 1099.5 | 70 |
| 1099.57 | 70 |
| 1099.64 | 70 |
| 1099.71 | 70 |
| 1099.78 | 70 |
| 1099.84 | 69.75 |
| 1099.91 | 69.75 |
| 1099.98 | 69.75 |
| 1100.05 | 69.75 |
| 1100.12 | 69.5 |
| 1100.19 | 69.5 |
| 1100.26 | 69.5 |
| 1100.32 | 69.5 |
| 1100.39 | 69.25 |
| 1100.46 | 69.25 |
| 1100.53 | 69.25 |
| 1100.6 | 69 |
| 1100.66 | 69 |
| 1100.73 | 69 |
| 1100.8 | 69 |
| 1100.87 | 69 |
| 1100.94 | 68.75 |
| 1101.01 | 68.75 |
| 1101.07 | 68.75 |
| 1101.14 | 68.5 |
| 1101.21 | 68.5 |
| 1101.28 | 68.5 |
| 1101.35 | 68.5 |
| 1101.42 | 68.5 |
| 1101.48 | 68.25 |
| 1101.55 | 68.25 |
| 1101.62 | 68.25 |
| 1101.69 | 68.25 |
| 1101.76 | 68 |
| 1101.83 | 68 |
| 1101.89 | 68 |
| 1101.96 | 67.75 |
| 1102.03 | 67.75 |
| 1102.1 | 67.75 |
| 1102.17 | 67.5 |
| 1102.23 | 67.5 |
| 1102.3 | 67.5 |
| 1102.37 | 67.5 |
| 1102.44 | 67.5 |
| 1102.51 | 67.5 |
| 1102.58 | 67.75 |
| 1102.64 | 67.75 |
| 1102.71 | 68.25 |
| 1102.78 | 68.5 |
| 1102.85 | 69 |
| 1102.92 | 69.5 |
| 1102.99 | 70 |
| 1103.05 | 70.25 |
| 1103.12 | 70.75 |
| 1103.19 | 71 |
| 1103.26 | 71 |
| 1103.33 | 71.25 |
| 1103.39 | 71.5 |
| 1103.46 | 72 |
| 1103.53 | 72.25 |
| 1103.6 | 72.5 |
| 1103.67 | 73 |
| 1103.73 | 73.25 |
| 1103.8 | 73.5 |
| 1103.87 | 73.75 |
| 1103.94 | 74.25 |
| 1104.01 | 74.5 |
| 1104.08 | 74.5 |
| 1104.15 | 74.75 |
| 1104.21 | 75 |
| 1104.28 | 75.5 |
| 1104.35 | 75.75 |
| 1104.42 | 76 |
| 1104.49 | 76.25 |
| 1104.56 | 76.5 |
| 1104.62 | 77 |
| 1104.69 | 77.25 |
| 1104.76 | 77.5 |
| 1104.83 | 77.75 |
| 1104.9 | 77.75 |
| 1104.96 | 78 |
| 1105.03 | 78.25 |
| 1105.1 | 78.5 |
| 1105.17 | 79 |
| 1105.24 | 79.25 |
| 1105.31 | 79.5 |
| 1105.37 | 79.75 |
| 1105.44 | 80 |
| 1105.51 | 80.25 |
| 1105.58 | 80.5 |
| 1105.65 | 80.75 |
| 1105.71 | 80.75 |
| 1105.78 | 81 |
| 1105.85 | 81.25 |
| 1105.92 | 81.5 |
| 1105.99 | 81.75 |
| 1106.06 | 82 |
| 1106.12 | 82.25 |
| 1106.19 | 82.25 |
| 1106.26 | 82.5 |
| 1106.33 | 82.75 |
| 1106.4 | 83 |
| 1106.46 | 83.25 |
| 1106.53 | 83.25 |
| 1106.6 | 83.5 |
| 1106.67 | 83.75 |
| 1106.74 | 84 |
| 1106.81 | 84.25 |
| 1106.87 | 84.5 |
| 1106.94 | 84.75 |
| 1107.01 | 85 |
| 1107.08 | 85 |
| 1107.15 | 85.25 |
| 1107.21 | 85.5 |
| 1107.28 | 85.75 |
| 1107.35 | 85.75 |
| 1107.42 | 85.75 |
| 1107.49 | 86 |
| 1107.56 | 86.25 |
| 1107.62 | 86.5 |
| 1107.69 | 86.75 |
| 1107.76 | 86.75 |
| 1107.83 | 87 |
| 1107.9 | 87.25 |
| 1107.96 | 87.5 |
| 1108.03 | 87.75 |
| 1108.1 | 87.75 |
| 1108.17 | 88 |
| 1108.24 | 88 |
| 1108.31 | 88.25 |
| 1108.38 | 88.25 |
| 1108.44 | 88.5 |
| 1108.51 | 88.75 |
| 1108.58 | 89 |
| 1108.65 | 89 |
| 1108.72 | 89.25 |
| 1108.79 | 89.5 |
| 1108.85 | 89.75 |
| 1108.92 | 89.75 |
| 1108.99 | 90 |
| 1109.06 | 90 |
| 1109.13 | 90.25 |
| 1109.19 | 90.25 |
| 1109.26 | 90.5 |
| 1109.33 | 90.75 |
| 1109.4 | 90.75 |
| 1109.47 | 91 |
| 1109.54 | 91.25 |
| 1109.6 | 91.25 |
| 1109.67 | 91.25 |
| 1109.74 | 91.5 |
| 1109.81 | 91.75 |
| 1109.88 | 91.75 |
| 1109.94 | 92 |
| 1110.01 | 92 |
| 1110.08 | 92.25 |
| 1110.15 | 92.25 |
| 1110.22 | 92.5 |
| 1110.29 | 92.5 |
| 1110.35 | 92.75 |
| 1110.42 | 93 |
| 1110.49 | 93 |
| 1110.56 | 93.25 |
| 1110.63 | 93.25 |
| 1110.69 | 93.25 |
| 1110.76 | 93.5 |
| 1110.83 | 93.5 |
| 1110.9 | 93.75 |
| 1110.97 | 94 |
| 1111.04 | 94 |
| 1111.1 | 94.25 |
| 1111.17 | 94.5 |
| 1111.24 | 94.5 |
| 1111.31 | 94.75 |
| 1111.38 | 95 |
| 1111.44 | 95 |
| 1111.51 | 95 |
| 1111.58 | 95.25 |
| 1111.65 | 95.25 |
| 1111.72 | 95.5 |
| 1111.79 | 95.75 |
| 1111.85 | 95.75 |
| 1111.92 | 95.75 |
| 1111.99 | 96 |
| 1112.06 | 96.25 |
| 1112.13 | 96.5 |
| 1112.2 | 96.5 |
| 1112.26 | 96.75 |
| 1112.33 | 96.75 |
| 1112.4 | 96.75 |
| 1112.47 | 97 |
| 1112.54 | 97 |
| 1112.6 | 97 |
| 1112.67 | 97.25 |
| 1112.74 | 97.25 |
| 1112.81 | 97.5 |
| 1112.88 | 97.75 |
| 1112.95 | 98 |
| 1113.02 | 98 |
| 1113.08 | 98 |
| 1113.15 | 98 |
| 1113.22 | 98.25 |
| 1113.29 | 98.5 |
| 1113.36 | 98.5 |
| 1113.42 | 98.75 |
| 1113.49 | 98.75 |
| 1113.56 | 99 |
| 1113.63 | 99 |
| 1113.7 | 99.25 |
| 1113.77 | 99.25 |
| 1113.83 | 99.5 |
| 1113.9 | 99.5 |
| 1113.97 | 99.5 |
| 1114.04 | 99.75 |
| 1114.11 | 99.75 |
| 1114.18 | 100 |
| 1114.24 | 100 |
| 1114.31 | 100.25 |
| 1114.38 | 100.25 |
| 1114.45 | 100.25 |
| 1114.52 | 100.5 |
| 1114.58 | 100.5 |
| 1114.65 | 100.5 |
| 1114.72 | 100.75 |
| 1114.79 | 100.75 |
| 1114.86 | 100.75 |
| 1114.93 | 100.75 |
| 1115.0 | 101 |
| 1115.06 | 101 |
| 1115.13 | 101 |
| 1115.2 | 101 |
| 1115.27 | 101 |
| 1115.34 | 101 |
| 1115.41 | 101 |
| 1115.47 | 101 |
| 1115.54 | 101 |
| 1115.61 | 101 |
| 1115.68 | 101 |
| 1115.75 | 101 |
| 1115.81 | 101 |
| 1115.88 | 100.5 |
| 1115.95 | 100 |
| 1116.02 | 99.75 |
| 1116.09 | 99.5 |
| 1116.16 | 99.25 |
| 1116.22 | 98.75 |
| 1116.29 | 98.25 |
| 1116.36 | 98 |
| 1116.43 | 97.5 |
| 1116.5 | 97.5 |
| 1116.56 | 97 |
| 1116.63 | 96.5 |
| 1116.7 | 96 |
| 1116.77 | 95.5 |
| 1116.84 | 94.75 |
| 1116.91 | 94.25 |
| 1116.97 | 93.75 |
| 1117.04 | 93.25 |
| 1117.11 | 92.5 |
| 1117.18 | 92 |
| 1117.25 | 91.5 |
| 1117.31 | 91.5 |
| 1117.38 | 91 |
| 1117.45 | 90.5 |
| 1117.52 | 90 |
| 1117.59 | 89.5 |
| 1117.66 | 88.75 |
| 1117.72 | 88.25 |
| 1117.79 | 88 |
| 1117.86 | 87.5 |
| 1117.93 | 87 |
| 1118.0 | 86.5 |
| 1118.06 | 86 |
| 1118.13 | 86 |
| 1118.2 | 85.5 |
| 1118.27 | 85.25 |
| 1118.34 | 84.75 |
| 1118.41 | 84.25 |
| 1118.47 | 84 |
| 1118.54 | 83.5 |
| 1118.61 | 83 |
| 1118.68 | 82.75 |
| 1118.75 | 82.25 |
| 1118.81 | 82 |
| 1118.88 | 81.75 |
| 1118.95 | 81.75 |
| 1119.02 | 81.25 |
| 1119.09 | 80.75 |
| 1119.16 | 80.5 |
| 1119.22 | 80.25 |
| 1119.29 | 80 |
| 1119.36 | 79.5 |
| 1119.43 | 79.25 |
| 1119.5 | 79 |
| 1119.56 | 78.5 |
| 1119.63 | 78.25 |
| 1119.7 | 78 |
| 1119.77 | 78 |
| 1119.84 | 77.5 |
| 1119.91 | 77.25 |
| 1119.97 | 77 |
| 1120.04 | 76.75 |
| 1120.11 | 76.5 |
| 1120.18 | 76.25 |
| 1120.25 | 76 |
| 1120.31 | 75.5 |
| 1120.38 | 75.25 |
| 1120.45 | 75 |
| 1120.52 | 74.75 |
| 1120.59 | 74.75 |
| 1120.66 | 74.5 |
| 1120.72 | 74.25 |
| 1120.79 | 74 |
| 1120.86 | 73.75 |
| 1120.93 | 73.5 |
| 1121.0 | 73.25 |
| 1121.06 | 73 |
| 1121.13 | 72.75 |
| 1121.2 | 72.5 |
| 1121.27 | 72.25 |
| 1121.34 | 72 |
| 1121.41 | 72 |
| 1121.47 | 71.75 |
| 1121.54 | 71.5 |
| 1121.61 | 71.25 |
| 1121.68 | 71 |
| 1121.75 | 70.75 |
| 1121.81 | 70.75 |
| 1121.88 | 70.5 |
| 1121.95 | 70 |
| 1122.02 | 69.75 |
| 1122.09 | 69.75 |
| 1122.16 | 69.5 |
| 1122.22 | 69.5 |
| 1122.29 | 69.25 |
| 1122.36 | 69 |
| 1122.43 | 68.75 |
| 1122.5 | 68.5 |
| 1122.56 | 68.25 |
| 1122.63 | 68.25 |
| 1122.7 | 68 |
| 1122.77 | 68.5 |
| 1122.84 | 68.5 |
| 1122.91 | 68.5 |
| 1122.97 | 68.75 |
| 1123.04 | 68.75 |
| 1123.11 | 68.75 |
| 1123.18 | 69 |
| 1123.25 | 69 |
| 1123.31 | 69.25 |
| 1123.38 | 69.25 |
| 1123.45 | 69.25 |
| 1123.52 | 69.5 |
| 1123.59 | 69.5 |
| 1123.66 | 69.75 |
| 1123.72 | 69.75 |
| 1123.79 | 69.75 |
| 1123.86 | 69.75 |
| 1123.93 | 69.75 |
| 1124.0 | 70 |
| 1124.07 | 70 |
| 1124.14 | 70 |
| 1124.2 | 70.25 |
| 1124.27 | 70.25 |
| 1124.34 | 70.25 |
| 1124.41 | 70.25 |
| 1124.48 | 70.25 |
| 1124.55 | 70.5 |
| 1124.61 | 70.5 |
| 1124.68 | 70.5 |
| 1124.75 | 70.5 |
| 1124.82 | 70.25 |
| 1124.89 | 70.25 |
| 1124.95 | 70.25 |
| 1125.02 | 70.25 |
| 1125.09 | 70.25 |
| 1125.16 | 70 |
| 1125.23 | 70 |
| 1125.3 | 70 |
| 1125.36 | 69.75 |
| 1125.43 | 69.75 |
| 1125.5 | 69.75 |
| 1125.57 | 69.75 |
| 1125.64 | 69.5 |
| 1125.71 | 69.5 |
| 1125.77 | 69.5 |
| 1125.84 | 69.25 |
| 1125.91 | 69.25 |
| 1125.98 | 69.25 |
| 1126.05 | 69.25 |
| 1126.12 | 69.25 |
| 1126.18 | 69 |
| 1126.25 | 68.75 |
| 1126.32 | 68.75 |
| 1126.39 | 68.75 |
| 1126.46 | 68.75 |
| 1126.53 | 68.75 |
| 1126.59 | 68.75 |
| 1126.66 | 68.5 |
| 1126.73 | 68.5 |
| 1126.8 | 68.5 |
| 1126.87 | 68.25 |
| 1126.94 | 68.25 |
| 1127.0 | 68.25 |
| 1127.07 | 68.25 |
| 1127.14 | 68 |
| 1127.21 | 68 |
| 1127.28 | 68 |
| 1127.34 | 68 |
| 1127.41 | 68 |
| 1127.48 | 67.75 |
| 1127.55 | 67.75 |
| 1127.62 | 67.75 |
| 1127.69 | 67.5 |
| 1127.75 | 67.5 |
| 1127.82 | 67.5 |
| 1127.89 | 67.5 |
| 1127.96 | 67.75 |
| 1128.03 | 67.75 |
| 1128.09 | 68 |
| 1128.16 | 68.25 |
| 1128.23 | 68.5 |
| 1128.3 | 69 |
| 1128.37 | 69.5 |
| 1128.44 | 70 |
| 1128.51 | 70.25 |
| 1128.57 | 70.75 |
| 1128.64 | 71 |
| 1128.71 | 71.5 |
| 1128.78 | 71.75 |
| 1128.85 | 71.75 |
| 1128.91 | 72 |
| 1128.98 | 72.25 |
| 1129.05 | 72.75 |
| 1129.12 | 73 |
| 1129.19 | 73.25 |
| 1129.26 | 73.75 |
| 1129.32 | 74 |
| 1129.39 | 74.25 |
| 1129.46 | 74.5 |
| 1129.53 | 75 |
| 1129.6 | 75.25 |
| 1129.67 | 75.25 |
| 1129.73 | 75.5 |
| 1129.8 | 75.75 |
| 1129.87 | 76 |
| 1129.94 | 76.5 |
| 1130.01 | 76.75 |
| 1130.07 | 77 |
| 1130.14 | 77.25 |
| 1130.21 | 77.5 |
| 1130.28 | 77.75 |
| 1130.35 | 78.25 |
| 1130.42 | 78.5 |
| 1130.48 | 78.5 |
| 1130.55 | 78.75 |
| 1130.62 | 79 |
| 1130.69 | 79.25 |
| 1130.76 | 79.5 |
| 1130.82 | 79.75 |
| 1130.89 | 80.25 |
| 1130.96 | 80.25 |
| 1131.03 | 80.5 |
| 1131.1 | 80.75 |
| 1131.17 | 81.25 |
| 1131.23 | 81.5 |
| 1131.3 | 81.5 |
| 1131.37 | 81.5 |
| 1131.44 | 81.75 |
| 1131.51 | 82.25 |
| 1131.57 | 82.25 |
| 1131.64 | 82.5 |
| 1131.71 | 82.75 |
| 1131.78 | 83 |
| 1131.85 | 83.25 |
| 1131.92 | 83.5 |
| 1131.98 | 83.75 |
| 1132.05 | 84 |
| 1132.12 | 84.25 |
| 1132.19 | 84.25 |
| 1132.26 | 84.5 |
| 1132.32 | 84.75 |
| 1132.39 | 85 |
| 1132.46 | 85.25 |
| 1132.53 | 85.25 |
| 1132.6 | 85.5 |
| 1132.67 | 85.75 |
| 1132.73 | 85.75 |
| 1132.8 | 86.25 |
| 1132.87 | 86.5 |
| 1132.94 | 86.5 |
| 1133.01 | 86.5 |
| 1133.08 | 86.75 |
| 1133.15 | 87 |
| 1133.21 | 87.25 |
| 1133.28 | 87.5 |
| 1133.35 | 87.5 |
| 1133.42 | 87.75 |
| 1133.49 | 88 |
| 1133.55 | 88.25 |
| 1133.62 | 88.25 |
| 1133.69 | 88.5 |
| 1133.76 | 88.75 |
| 1133.83 | 88.75 |
| 1133.9 | 89 |
| 1133.96 | 89 |
| 1134.03 | 89.25 |
| 1134.1 | 89.5 |
| 1134.17 | 89.5 |
| 1134.24 | 89.75 |
| 1134.3 | 90 |
| 1134.37 | 90.25 |
| 1134.44 | 90.5 |
| 1134.51 | 90.5 |
| 1134.58 | 90.75 |
| 1134.65 | 90.75 |
| 1134.71 | 91 |
| 1134.78 | 91 |
| 1134.85 | 91.25 |
| 1134.92 | 91.5 |
| 1134.99 | 91.5 |
| 1135.05 | 91.75 |
| 1135.12 | 92 |
| 1135.19 | 92.25 |
| 1135.26 | 92.25 |
| 1135.33 | 92.5 |
| 1135.4 | 92.75 |
| 1135.46 | 92.75 |
| 1135.53 | 92.75 |
| 1135.6 | 93 |
| 1135.67 | 93 |
| 1135.74 | 93.25 |
| 1135.81 | 93.5 |
| 1135.87 | 93.5 |
| 1135.94 | 93.75 |
| 1136.01 | 94 |
| 1136.08 | 94 |
| 1136.15 | 94.25 |
| 1136.21 | 94.5 |
| 1136.28 | 94.5 |
| 1136.35 | 94.5 |
| 1136.42 | 94.75 |
| 1136.49 | 95 |
| 1136.56 | 95 |
| 1136.62 | 95.25 |
| 1136.69 | 95.25 |
| 1136.76 | 95.5 |
| 1136.83 | 95.5 |
| 1136.9 | 95.75 |
| 1136.96 | 96 |
| 1137.03 | 96 |
| 1137.1 | 96 |
| 1137.17 | 96.25 |
| 1137.24 | 96.25 |
| 1137.31 | 96.5 |
| 1137.37 | 96.75 |
| 1137.44 | 96.75 |
| 1137.51 | 97 |
| 1137.58 | 97 |
| 1137.65 | 97.25 |
| 1137.72 | 97.25 |
| 1137.78 | 97.5 |
| 1137.85 | 97.5 |
| 1137.92 | 97.5 |
| 1137.99 | 97.75 |
| 1138.06 | 98 |
| 1138.12 | 98 |
| 1138.19 | 98.25 |
| 1138.26 | 98.25 |
| 1138.33 | 98.5 |
| 1138.4 | 98.75 |
| 1138.46 | 98.75 |
| 1138.53 | 99 |
| 1138.6 | 99 |
| 1138.67 | 99.25 |
| 1138.74 | 99.25 |
| 1138.81 | 99.5 |
| 1138.88 | 99.5 |
| 1138.94 | 99.75 |
| 1139.01 | 99.75 |
| 1139.08 | 100 |
| 1139.15 | 100 |
| 1139.22 | 100 |
| 1139.29 | 100.25 |
| 1139.35 | 100.25 |
| 1139.42 | 100.25 |
| 1139.49 | 100.5 |
| 1139.56 | 100.5 |
| 1139.63 | 100.5 |
| 1139.69 | 100.75 |
| 1139.76 | 100.75 |
| 1139.83 | 100.75 |
| 1139.9 | 101 |
| 1139.97 | 101 |
| 1140.04 | 101 |
| 1140.11 | 101 |
| 1140.17 | 101 |
| 1140.24 | 101 |
| 1140.31 | 101.25 |
| 1140.38 | 101.25 |
| 1140.45 | 101.25 |
| 1140.52 | 101.25 |
| 1140.58 | 101 |
| 1140.65 | 101 |
| 1140.72 | 101 |
| 1140.79 | 101 |
| 1140.86 | 100.75 |
| 1140.93 | 100.25 |
| 1140.99 | 100 |
| 1141.06 | 99.75 |
| 1141.13 | 99.5 |
| 1141.2 | 99 |
| 1141.27 | 99 |
| 1141.33 | 98.75 |
| 1141.4 | 98.25 |
| 1141.47 | 97.75 |
| 1141.54 | 97.25 |
| 1141.61 | 97 |
| 1141.68 | 96.25 |
| 1141.74 | 95.75 |
| 1141.81 | 95.25 |
| 1141.88 | 94.5 |
| 1141.95 | 94 |
| 1142.02 | 93.5 |
| 1142.08 | 93.5 |
| 1142.15 | 92.75 |
| 1142.22 | 92.25 |
| 1142.29 | 91.75 |
| 1142.36 | 91.25 |
| 1142.43 | 90.75 |
| 1142.49 | 90.25 |
| 1142.56 | 89.75 |
| 1142.63 | 89.25 |
| 1142.7 | 88.75 |
| 1142.77 | 88.25 |
| 1142.83 | 87.75 |
| 1142.9 | 87.75 |
| 1142.97 | 87.25 |
| 1143.04 | 86.75 |
| 1143.11 | 86.25 |
| 1143.18 | 85.75 |
| 1143.24 | 85.25 |
| 1143.31 | 85 |
| 1143.38 | 84.5 |
| 1143.45 | 84 |
| 1143.52 | 83.75 |
| 1143.58 | 83.25 |
| 1143.65 | 83 |
| 1143.72 | 83 |
| 1143.79 | 82.5 |
| 1143.86 | 82.25 |
| 1143.92 | 81.75 |
| 1143.99 | 81.25 |
| 1144.06 | 81 |
| 1144.13 | 80.5 |
| 1144.2 | 80.25 |
| 1144.27 | 80 |
| 1144.33 | 79.75 |
| 1144.4 | 79.25 |
| 1144.47 | 79 |
| 1144.54 | 79 |
| 1144.61 | 78.75 |
| 1144.68 | 78.25 |
| 1144.74 | 78 |
| 1144.81 | 77.75 |
| 1144.88 | 77.5 |
| 1144.95 | 77.25 |
| 1145.02 | 77 |
| 1145.08 | 76.5 |
| 1145.15 | 76.25 |
| 1145.22 | 76 |
| 1145.29 | 75.75 |
| 1145.36 | 75.75 |
| 1145.42 | 75.5 |
| 1145.49 | 75.25 |
| 1145.56 | 74.75 |
| 1145.63 | 74.5 |
| 1145.7 | 74.5 |
| 1145.77 | 74 |
| 1145.83 | 73.75 |
| 1145.9 | 73.5 |
| 1145.97 | 73.25 |
| 1146.04 | 73 |
| 1146.11 | 72.75 |
| 1146.17 | 72.75 |
| 1146.24 | 72.5 |
| 1146.31 | 72.25 |
| 1146.38 | 72 |
| 1146.45 | 71.75 |
| 1146.52 | 71.5 |
| 1146.58 | 71.25 |
| 1146.65 | 71 |
| 1146.72 | 70.75 |
| 1146.79 | 70.75 |
| 1146.86 | 70.5 |
| 1146.93 | 70.25 |
| 1146.99 | 70.25 |
| 1147.06 | 70 |
| 1147.13 | 69.75 |
| 1147.2 | 69.5 |
| 1147.27 | 69.25 |
| 1147.33 | 69 |
| 1147.4 | 68.75 |
| 1147.47 | 68.5 |
| 1147.54 | 68.5 |
| 1147.61 | 68.25 |
| 1147.67 | 68.25 |
| 1147.74 | 68.5 |
| 1147.81 | 68.5 |
| 1147.88 | 68.5 |
| 1147.95 | 68.75 |
| 1148.02 | 68.75 |
| 1148.08 | 68.75 |
| 1148.15 | 68.75 |
| 1148.22 | 69 |
| 1148.29 | 69 |
| 1148.36 | 69.25 |
| 1148.43 | 69.25 |
| 1148.49 | 69.25 |
| 1148.56 | 69.5 |
| 1148.63 | 69.5 |
| 1148.7 | 69.5 |
| 1148.77 | 69.5 |
| 1148.83 | 69.75 |
| 1148.9 | 69.75 |
| 1148.97 | 69.75 |
| 1149.04 | 70 |
| 1149.11 | 69.75 |
| 1149.18 | 70 |
| 1149.25 | 70 |
| 1149.31 | 70 |
| 1149.38 | 70 |
| 1149.45 | 70 |
| 1149.52 | 70 |
| 1149.59 | 70 |
| 1149.66 | 70 |
| 1149.72 | 70 |
| 1149.79 | 70 |
| 1149.86 | 70 |
| 1149.93 | 70 |
| 1150.0 | 70 |
| 1150.06 | 70 |
| 1150.13 | 70 |
| 1150.2 | 69.75 |
| 1150.27 | 69.75 |
| 1150.34 | 69.75 |
| 1150.41 | 69.75 |
| 1150.47 | 69.5 |
| 1150.54 | 69.5 |
| 1150.61 | 69.5 |
| 1150.68 | 69.5 |
| 1150.75 | 69.25 |
| 1150.82 | 69.25 |
| 1150.88 | 69.25 |
| 1150.95 | 69 |
| 1151.02 | 69 |
| 1151.09 | 69 |
| 1151.16 | 69 |
| 1151.22 | 68.75 |
| 1151.29 | 68.75 |
| 1151.36 | 68.75 |
| 1151.43 | 68.75 |
| 1151.5 | 68.5 |
| 1151.57 | 68.5 |
| 1151.64 | 68.5 |
| 1151.7 | 68.25 |
| 1151.77 | 68.5 |
| 1151.84 | 68.25 |
| 1151.91 | 68.25 |
| 1151.98 | 68.25 |
| 1152.05 | 68.25 |
| 1152.11 | 68 |
| 1152.18 | 68 |
| 1152.25 | 68 |
| 1152.32 | 68 |
| 1152.39 | 67.75 |
| 1152.45 | 67.75 |
| 1152.52 | 67.75 |
| 1152.59 | 67.5 |
| 1152.66 | 67.5 |
| 1152.73 | 67.5 |
| 1152.8 | 67.5 |
| 1152.86 | 67.5 |
| 1152.93 | 67.75 |
| 1153.0 | 68 |
| 1153.07 | 68.25 |
| 1153.14 | 68.75 |
| 1153.21 | 69 |
| 1153.27 | 69.5 |
| 1153.34 | 70 |
| 1153.41 | 70.5 |
| 1153.48 | 70.75 |
| 1153.55 | 71.25 |
| 1153.61 | 71.25 |
| 1153.68 | 71.5 |
| 1153.75 | 71.75 |
| 1153.82 | 72 |
| 1153.89 | 72.25 |
| 1153.95 | 72.75 |
| 1154.02 | 73 |
| 1154.09 | 73.5 |
| 1154.16 | 73.75 |
| 1154.23 | 74 |
| 1154.3 | 74.25 |
| 1154.36 | 74.5 |
| 1154.43 | 74.5 |
| 1154.5 | 75 |
| 1154.57 | 75.25 |
| 1154.64 | 75.5 |
| 1154.71 | 76 |
| 1154.78 | 76.25 |
| 1154.84 | 76.5 |
| 1154.91 | 76.75 |
| 1154.98 | 77 |
| 1155.05 | 77.25 |
| 1155.12 | 77.5 |
| 1155.18 | 77.75 |
| 1155.25 | 78.25 |
| 1155.32 | 78.25 |
| 1155.39 | 78.5 |
| 1155.46 | 78.75 |
| 1155.53 | 79 |
| 1155.59 | 79.25 |
| 1155.66 | 79.5 |
| 1155.73 | 80 |
| 1155.8 | 80.25 |
| 1155.87 | 80.5 |
| 1155.94 | 80.5 |
| 1156.0 | 81 |
| 1156.07 | 81.25 |
| 1156.14 | 81.25 |
| 1156.21 | 81.5 |
| 1156.28 | 81.75 |
| 1156.34 | 81.75 |
| 1156.41 | 82 |
| 1156.48 | 82.25 |
| 1156.55 | 82.5 |
| 1156.62 | 82.75 |
| 1156.69 | 83 |
| 1156.75 | 83.25 |
| 1156.82 | 83.5 |
| 1156.89 | 83.75 |
| 1156.96 | 83.75 |
| 1157.03 | 84 |
| 1157.09 | 84.25 |
| 1157.16 | 84.5 |
| 1157.23 | 84.5 |
| 1157.3 | 84.75 |
| 1157.37 | 85 |
| 1157.44 | 85.25 |
| 1157.5 | 85.25 |
| 1157.57 | 85.5 |
| 1157.64 | 85.75 |
| 1157.71 | 86 |
| 1157.78 | 86 |
| 1157.84 | 86.25 |
| 1157.91 | 86.5 |
| 1157.98 | 86.75 |
| 1158.05 | 86.75 |
| 1158.12 | 87 |
| 1158.19 | 87.25 |
| 1158.25 | 87.5 |
| 1158.32 | 87.75 |
| 1158.39 | 87.75 |
| 1158.46 | 88 |
| 1158.53 | 88.25 |
| 1158.59 | 88.25 |
| 1158.66 | 88.5 |
| 1158.73 | 88.75 |
| 1158.8 | 88.75 |
| 1158.87 | 89 |
| 1158.94 | 89.25 |
| 1159.01 | 89.25 |
| 1159.07 | 89.5 |
| 1159.14 | 89.75 |
| 1159.21 | 90 |
| 1159.28 | 90.25 |
| 1159.35 | 90.25 |
| 1159.41 | 90.25 |
| 1159.48 | 90.5 |
| 1159.55 | 90.75 |
| 1159.62 | 90.75 |
| 1159.69 | 91 |
| 1159.76 | 91.25 |
| 1159.82 | 91.25 |
| 1159.89 | 91.5 |
| 1159.96 | 91.75 |
| 1160.03 | 92 |
| 1160.1 | 92 |
| 1160.17 | 92.25 |
| 1160.23 | 92.25 |
| 1160.3 | 92.5 |
| 1160.37 | 92.5 |
| 1160.44 | 92.75 |
| 1160.51 | 93 |
| 1160.57 | 93 |
| 1160.64 | 93.25 |
| 1160.71 | 93.25 |
| 1160.78 | 93.5 |
| 1160.85 | 93.5 |
| 1160.92 | 94 |
| 1160.98 | 94 |
| 1161.05 | 94 |
| 1161.12 | 94 |
| 1161.19 | 94.25 |
| 1161.26 | 94.25 |
| 1161.32 | 94.5 |
| 1161.39 | 94.75 |
| 1161.46 | 95 |
| 1161.53 | 95 |
| 1161.6 | 95.25 |
| 1161.67 | 95.25 |
| 1161.73 | 95.5 |
| 1161.8 | 95.5 |
| 1161.87 | 95.5 |
| 1161.94 | 95.75 |
| 1162.01 | 96 |
| 1162.07 | 96 |
| 1162.14 | 96.25 |
| 1162.21 | 96.25 |
| 1162.28 | 96.5 |
| 1162.35 | 96.5 |
| 1162.42 | 96.75 |
| 1162.48 | 97 |
| 1162.55 | 97 |
| 1162.62 | 97.25 |
| 1162.69 | 97.25 |
| 1162.76 | 97.25 |
| 1162.82 | 97.5 |
| 1162.89 | 97.5 |
| 1162.96 | 97.75 |
| 1163.03 | 97.75 |
| 1163.1 | 98 |
| 1163.17 | 98 |
| 1163.23 | 98.25 |
| 1163.3 | 98.5 |
| 1163.37 | 98.5 |
| 1163.44 | 98.75 |
| 1163.51 | 98.75 |
| 1163.58 | 98.75 |
| 1163.64 | 98.75 |
| 1163.71 | 99 |
| 1163.78 | 99.25 |
| 1163.85 | 99.25 |
| 1163.92 | 99.5 |
| 1163.98 | 99.5 |
| 1164.05 | 99.75 |
| 1164.12 | 99.75 |
| 1164.19 | 100 |
| 1164.26 | 100 |
| 1164.33 | 100.25 |
| 1164.4 | 100.25 |
| 1164.46 | 100.25 |
| 1164.53 | 100.5 |
| 1164.6 | 100.5 |
| 1164.67 | 100.5 |
| 1164.74 | 100.5 |
| 1164.81 | 100.75 |
| 1164.87 | 100.75 |
| 1164.94 | 101 |
| 1165.01 | 101 |
| 1165.08 | 101 |
| 1165.15 | 101 |
| 1165.21 | 101 |
| 1165.28 | 101 |
| 1165.35 | 101 |
| 1165.42 | 101 |
| 1165.49 | 101 |
| 1165.56 | 101 |
| 1165.63 | 101 |
| 1165.69 | 101 |
| 1165.76 | 101 |
| 1165.83 | 101 |
| 1165.9 | 100.75 |
| 1165.97 | 100.5 |
| 1166.04 | 100.5 |
| 1166.1 | 100 |
| 1166.17 | 99.75 |
| 1166.24 | 99.5 |
| 1166.31 | 99.25 |
| 1166.38 | 98.75 |
| 1166.44 | 98.5 |
| 1166.51 | 98 |
| 1166.58 | 97.5 |
| 1166.65 | 97 |
| 1166.72 | 96.5 |
| 1166.79 | 95.75 |
| 1166.85 | 95.75 |
| 1166.92 | 95.25 |
| 1166.99 | 94.75 |
| 1167.06 | 94 |
| 1167.13 | 93.5 |
| 1167.19 | 93 |
| 1167.26 | 92.5 |
| 1167.33 | 92 |
| 1167.4 | 91.25 |
| 1167.47 | 91 |
| 1167.54 | 90.25 |
| 1167.6 | 90 |
| 1167.67 | 90 |
| 1167.74 | 89.25 |
| 1167.81 | 88.75 |
| 1167.88 | 88.25 |
| 1167.94 | 87.75 |
| 1168.01 | 87.25 |
| 1168.08 | 87 |
| 1168.15 | 86.5 |
| 1168.22 | 86 |
| 1168.29 | 85.5 |
| 1168.35 | 85 |
| 1168.42 | 84.75 |
| 1168.49 | 84.75 |
| 1168.56 | 84.25 |
| 1168.63 | 83.75 |
| 1168.69 | 83.5 |
| 1168.76 | 83 |
| 1168.83 | 82.75 |
| 1168.9 | 82.25 |
| 1168.97 | 81.75 |
| 1169.04 | 81.5 |
| 1169.1 | 81.25 |
| 1169.17 | 80.75 |
| 1169.24 | 80.5 |
| 1169.31 | 80.5 |
| 1169.38 | 80 |
| 1169.44 | 79.75 |
| 1169.51 | 79.25 |
| 1169.58 | 79 |
| 1169.65 | 78.75 |
| 1169.72 | 78.25 |
| 1169.79 | 78 |
| 1169.85 | 77.75 |
| 1169.92 | 77.25 |
| 1169.99 | 77 |
| 1170.06 | 76.75 |
| 1170.13 | 76.75 |
| 1170.19 | 76.5 |
| 1170.26 | 76.25 |
| 1170.33 | 76 |
| 1170.4 | 75.75 |
| 1170.47 | 75.25 |
| 1170.54 | 75 |
| 1170.6 | 74.75 |
| 1170.67 | 74.5 |
| 1170.74 | 74.25 |
| 1170.81 | 74 |
| 1170.88 | 73.75 |
| 1170.94 | 73.75 |
| 1171.01 | 73.5 |
| 1171.08 | 73.25 |
| 1171.15 | 73 |
| 1171.22 | 72.75 |
| 1171.28 | 72.5 |
| 1171.35 | 72.25 |
| 1171.42 | 72 |
| 1171.49 | 71.75 |
| 1171.56 | 71.5 |
| 1171.63 | 71.25 |
| 1171.69 | 71 |
| 1171.76 | 71 |
| 1171.83 | 70.75 |
| 1171.9 | 70.5 |
| 1171.97 | 70.25 |
| 1172.04 | 70 |
| 1172.1 | 69.75 |
| 1172.17 | 69.5 |
| 1172.24 | 69.25 |
| 1172.31 | 69 |
| 1172.38 | 69 |
| 1172.44 | 68.75 |
| 1172.51 | 68.5 |
| 1172.58 | 68.5 |
| 1172.65 | 68.25 |
| 1172.72 | 68 |
| 1172.79 | 68.25 |
| 1172.85 | 68.5 |
| 1172.92 | 68.5 |
| 1172.99 | 68.5 |
| 1173.06 | 68.75 |
| 1173.13 | 68.75 |
| 1173.19 | 68.75 |
| 1173.26 | 69 |
| 1173.33 | 69 |
| 1173.4 | 69 |
| 1173.47 | 69 |
| 1173.54 | 69.25 |
| 1173.6 | 69.25 |
| 1173.67 | 69.25 |
| 1173.74 | 69.5 |
| 1173.81 | 69.5 |
| 1173.88 | 69.5 |
| 1173.95 | 69.5 |
| 1174.01 | 69.75 |
| 1174.08 | 69.75 |
| 1174.15 | 69.75 |
| 1174.22 | 69.75 |
| 1174.29 | 69.75 |
| 1174.36 | 70 |
| 1174.42 | 70 |
| 1174.49 | 70 |
| 1174.56 | 70 |
| 1174.63 | 70 |
| 1174.7 | 70 |
| 1174.77 | 70 |
| 1174.83 | 70 |
| 1174.9 | 70 |
| 1174.97 | 70 |
| 1175.04 | 70 |
| 1175.11 | 70 |
| 1175.18 | 70 |
| 1175.24 | 70 |
| 1175.31 | 70 |
| 1175.38 | 69.75 |
| 1175.45 | 69.75 |
| 1175.52 | 69.5 |
| 1175.58 | 69.5 |
| 1175.65 | 69.5 |
| 1175.72 | 69.5 |
| 1175.79 | 69.25 |
| 1175.86 | 69.25 |
| 1175.93 | 69.25 |
| 1176.0 | 69.25 |
| 1176.06 | 69.25 |
| 1176.13 | 69 |
| 1176.2 | 69 |
| 1176.27 | 69 |
| 1176.34 | 68.75 |
| 1176.4 | 68.75 |
| 1176.47 | 68.75 |
| 1176.54 | 68.75 |
| 1176.61 | 68.5 |
| 1176.68 | 68.5 |
| 1176.75 | 68.5 |
| 1176.81 | 68.5 |
| 1176.88 | 68.5 |
| 1176.95 | 68.25 |
| 1177.02 | 68.25 |
| 1177.09 | 68.25 |
| 1177.16 | 68 |
| 1177.22 | 68 |
| 1177.29 | 68 |
| 1177.36 | 67.75 |
| 1177.43 | 67.75 |
| 1177.5 | 67.75 |
| 1177.57 | 67.75 |
| 1177.63 | 67.75 |
| 1177.7 | 67.5 |
| 1177.77 | 67.5 |
| 1177.84 | 67.5 |
| 1177.91 | 67.5 |
| 1177.97 | 67.5 |
| 1178.04 | 67.75 |
| 1178.11 | 68 |
| 1178.18 | 68.25 |
| 1178.25 | 68.75 |
| 1178.32 | 69.25 |
| 1178.38 | 69.75 |
| 1178.45 | 69.75 |
| 1178.52 | 70 |
| 1178.59 | 70.5 |
| 1178.66 | 70.75 |
| 1178.73 | 71.25 |
| 1178.79 | 71.5 |
| 1178.86 | 71.75 |
| 1178.93 | 72 |
| 1179.0 | 72.5 |
| 1179.07 | 72.75 |
| 1179.13 | 73 |
| 1179.2 | 73.25 |
| 1179.27 | 73.25 |
| 1179.34 | 73.75 |
| 1179.41 | 74 |
| 1179.48 | 74.25 |
| 1179.54 | 74.5 |
| 1179.61 | 74.75 |
| 1179.68 | 75.25 |
| 1179.75 | 75.5 |
| 1179.82 | 75.75 |
| 1179.89 | 76 |
| 1179.95 | 76.5 |
| 1180.02 | 76.75 |
| 1180.09 | 76.75 |
| 1180.16 | 77 |
| 1180.23 | 77.25 |
| 1180.3 | 77.5 |
| 1180.36 | 77.75 |
| 1180.43 | 78 |
| 1180.5 | 78.25 |
| 1180.57 | 78.5 |
| 1180.64 | 78.75 |
| 1180.7 | 79 |
| 1180.77 | 79.25 |
| 1180.84 | 79.5 |
| 1180.91 | 79.5 |
| 1180.98 | 79.75 |
| 1181.05 | 80.25 |
| 1181.11 | 80.5 |
| 1181.18 | 80.5 |
| 1181.25 | 80.75 |
| 1181.32 | 81 |
| 1181.39 | 81.25 |
| 1181.45 | 81.5 |
| 1181.52 | 81.75 |
| 1181.59 | 82 |
| 1181.66 | 82.25 |
| 1181.73 | 82.25 |
| 1181.8 | 82.5 |
| 1181.86 | 82.5 |
| 1181.93 | 83 |
| 1182.0 | 83.25 |
| 1182.07 | 83.25 |
| 1182.14 | 83.5 |
| 1182.2 | 83.75 |
| 1182.27 | 84 |
| 1182.34 | 84.25 |
| 1182.41 | 84.25 |
| 1182.48 | 84.5 |
| 1182.55 | 84.5 |
| 1182.61 | 84.75 |
| 1182.68 | 85 |
| 1182.75 | 85.25 |
| 1182.82 | 85.5 |
| 1182.89 | 85.5 |
| 1182.95 | 85.75 |
| 1183.02 | 86 |
| 1183.09 | 86.25 |
| 1183.16 | 86.25 |
| 1183.23 | 86.5 |
| 1183.3 | 86.75 |
| 1183.36 | 86.75 |
| 1183.43 | 87 |
| 1183.5 | 87 |
| 1183.57 | 87.25 |
| 1183.64 | 87.5 |
| 1183.71 | 87.75 |
| 1183.77 | 87.75 |
| 1183.84 | 88.25 |
| 1183.91 | 88.25 |
| 1183.98 | 88.5 |
| 1184.05 | 88.5 |
| 1184.11 | 88.75 |
| 1184.18 | 88.75 |
| 1184.25 | 89 |
| 1184.32 | 89.25 |
| 1184.39 | 89.25 |
| 1184.46 | 89.5 |
| 1184.53 | 89.5 |
| 1184.59 | 89.75 |
| 1184.66 | 90 |
| 1184.73 | 90.25 |
| 1184.8 | 90.25 |
| 1184.87 | 90.5 |
| 1184.93 | 90.75 |
| 1185.0 | 90.75 |
| 1185.07 | 90.75 |
| 1185.14 | 91 |
| 1185.21 | 91.25 |
| 1185.28 | 91.25 |
| 1185.34 | 91.5 |
| 1185.41 | 91.75 |
| 1185.48 | 91.75 |
| 1185.55 | 92 |
| 1185.62 | 92.25 |
| 1185.69 | 92.25 |
| 1185.75 | 92.5 |
| 1185.82 | 92.75 |
| 1185.89 | 92.75 |
| 1185.96 | 92.75 |
| 1186.03 | 93 |
| 1186.09 | 93.25 |
| 1186.16 | 93.25 |
| 1186.23 | 93.5 |
| 1186.3 | 93.5 |
| 1186.37 | 93.75 |
| 1186.44 | 94 |
| 1186.5 | 94 |
| 1186.57 | 94.25 |
| 1186.64 | 94.5 |
| 1186.71 | 94.5 |
| 1186.78 | 94.5 |
| 1186.84 | 94.75 |
| 1186.91 | 94.75 |
| 1186.98 | 95 |
| 1187.05 | 95 |
| 1187.12 | 95.25 |
| 1187.19 | 95.25 |
| 1187.25 | 95.5 |
| 1187.32 | 95.75 |
| 1187.39 | 95.75 |
| 1187.46 | 96 |
| 1187.53 | 96 |
| 1187.59 | 96.25 |
| 1187.66 | 96.25 |
| 1187.73 | 96.5 |
| 1187.8 | 96.5 |
| 1187.87 | 96.5 |
| 1187.94 | 96.75 |
| 1188.0 | 97 |
| 1188.07 | 97 |
| 1188.14 | 97.25 |
| 1188.21 | 97.25 |
| 1188.28 | 97.5 |
| 1188.34 | 97.5 |
| 1188.41 | 97.5 |
| 1188.48 | 97.75 |
| 1188.55 | 97.75 |
| 1188.62 | 98 |
| 1188.69 | 98 |
| 1188.76 | 98.25 |
| 1188.82 | 98.25 |
| 1188.89 | 98.5 |
| 1188.96 | 98.5 |
| 1189.03 | 98.75 |
| 1189.1 | 98.75 |
| 1189.16 | 98.75 |
| 1189.23 | 99 |
| 1189.3 | 99.25 |
| 1189.37 | 99.25 |
| 1189.44 | 99.5 |
| 1189.51 | 99.5 |
| 1189.57 | 99.75 |
| 1189.64 | 99.75 |
| 1189.71 | 100 |
| 1189.78 | 100 |
| 1189.85 | 100.25 |
| 1189.92 | 100.25 |
| 1189.98 | 100.25 |
| 1190.05 | 100.5 |
| 1190.12 | 100.5 |
| 1190.19 | 100.5 |
| 1190.26 | 100.75 |
| 1190.33 | 100.75 |
| 1190.39 | 100.75 |
| 1190.46 | 100.75 |
| 1190.53 | 101 |
| 1190.6 | 101 |
| 1190.67 | 101 |
| 1190.73 | 101 |
| 1190.8 | 101 |
| 1190.87 | 101.25 |
| 1190.94 | 101.25 |
| 1191.01 | 101.25 |
| 1191.08 | 101.25 |
| 1191.15 | 101.25 |
| 1191.21 | 101.25 |
| 1191.28 | 101 |
| 1191.35 | 101 |
| 1191.42 | 101 |
| 1191.49 | 100.75 |
| 1191.56 | 100.5 |
| 1191.62 | 100 |
| 1191.69 | 100 |
| 1191.76 | 100 |
| 1191.83 | 99.5 |
| 1191.9 | 99.25 |
| 1191.96 | 99 |
| 1192.03 | 98.5 |
| 1192.1 | 98 |
| 1192.17 | 97.5 |
| 1192.24 | 97 |
| 1192.31 | 96.5 |
| 1192.37 | 96 |
| 1192.44 | 95.25 |
| 1192.51 | 95.25 |
| 1192.58 | 95 |
| 1192.65 | 94.25 |
| 1192.71 | 93.75 |
| 1192.78 | 93.25 |
| 1192.85 | 92.75 |
| 1192.92 | 92 |
| 1192.99 | 91.5 |
| 1193.06 | 91 |
| 1193.12 | 90.5 |
| 1193.19 | 90 |
| 1193.26 | 89.5 |
| 1193.33 | 89.5 |
| 1193.4 | 89 |
| 1193.46 | 88.5 |
| 1193.53 | 88 |
| 1193.6 | 87.5 |
| 1193.67 | 87 |
| 1193.74 | 86.5 |
| 1193.81 | 86 |
| 1193.87 | 85.75 |
| 1193.94 | 85.25 |
| 1194.01 | 84.75 |
| 1194.08 | 84.25 |
| 1194.15 | 84.25 |
| 1194.21 | 84 |
| 1194.28 | 83.5 |
| 1194.35 | 83 |
| 1194.42 | 82.75 |
| 1194.49 | 82.25 |
| 1194.56 | 82 |
| 1194.62 | 81.5 |
| 1194.69 | 81.25 |
| 1194.76 | 81 |
| 1194.83 | 80.5 |
| 1194.9 | 80.25 |
| 1194.96 | 80.25 |
| 1195.03 | 79.75 |
| 1195.1 | 79.5 |
| 1195.17 | 79.25 |
| 1195.24 | 78.75 |
| 1195.3 | 78.5 |
| 1195.37 | 78.25 |
| 1195.44 | 78 |
| 1195.51 | 77.5 |
| 1195.58 | 77.25 |
| 1195.65 | 77 |
| 1195.71 | 76.75 |
| 1195.78 | 76.75 |
| 1195.85 | 76.5 |
| 1195.92 | 76.25 |
| 1195.99 | 75.75 |
| 1196.06 | 75.5 |
| 1196.12 | 75.25 |
| 1196.19 | 75 |
| 1196.26 | 74.75 |
| 1196.33 | 74.5 |
| 1196.4 | 74.25 |
| 1196.46 | 74 |
| 1196.53 | 73.75 |
| 1196.6 | 73.75 |
| 1196.67 | 73.5 |
| 1196.74 | 73.25 |
| 1196.81 | 73 |
| 1196.87 | 72.5 |
| 1196.94 | 72.5 |
| 1197.01 | 72.25 |
| 1197.08 | 72 |
| 1197.15 | 71.75 |
| 1197.21 | 71.5 |
| 1197.28 | 71.25 |
| 1197.35 | 71 |
| 1197.42 | 71 |
| 1197.49 | 70.75 |
| 1197.56 | 70.5 |
| 1197.62 | 70.25 |
| 1197.69 | 70 |
| 1197.76 | 69.75 |
| 1197.83 | 69.75 |
| 1197.9 | 69.5 |
| 1197.96 | 69.25 |
| 1198.03 | 69 |
| 1198.1 | 68.75 |
| 1198.17 | 68.5 |
| 1198.24 | 68.5 |
| 1198.31 | 68.25 |
| 1198.37 | 68.25 |
| 1198.44 | 68.25 |
| 1198.51 | 68.5 |
| 1198.58 | 68.75 |
| 1198.65 | 68.75 |
| 1198.71 | 68.75 |
| 1198.78 | 68.75 |
| 1198.85 | 68.75 |
| 1198.92 | 68.75 |
| 1198.99 | 69 |
| 1199.06 | 69 |
| 1199.12 | 69 |
| 1199.19 | 69 |
| 1199.26 | 69.25 |
| 1199.33 | 69.25 |
| 1199.4 | 69.5 |
| 1199.47 | 69.5 |
| 1199.54 | 69.5 |
| 1199.6 | 69.5 |
| 1199.67 | 69.5 |
| 1199.74 | 69.75 |
| 1199.81 | 69.75 |
| 1199.88 | 69.75 |
| 1199.94 | 69.75 |
| 1200.01 | 69.75 |
| 1200.08 | 70 |
| 1200.15 | 70 |
| 1200.22 | 69.75 |
| 1200.29 | 70 |
| 1200.35 | 70 |
| 1200.42 | 70 |
| 1200.49 | 70 |
| 1200.56 | 69.75 |
| 1200.63 | 69.75 |
| 1200.69 | 69.75 |
| 1200.76 | 69.75 |
| 1200.83 | 69.75 |
| 1200.9 | 69.75 |
| 1200.97 | 69.75 |
| 1201.04 | 69.5 |
| 1201.1 | 69.5 |
| 1201.17 | 69.5 |
| 1201.24 | 69.5 |
| 1201.31 | 69.25 |
| 1201.38 | 69.25 |
| 1201.45 | 69.25 |
| 1201.52 | 69 |
| 1201.58 | 69 |
| 1201.65 | 69 |
| 1201.72 | 69 |
| 1201.79 | 68.75 |
| 1201.86 | 68.75 |
| 1201.93 | 68.75 |
| 1201.99 | 68.75 |
| 1202.06 | 68.75 |
| 1202.13 | 68.5 |
| 1202.2 | 68.5 |
| 1202.27 | 68.5 |
| 1202.33 | 68.5 |
| 1202.4 | 68.5 |
| 1202.47 | 68.25 |
| 1202.54 | 68.25 |
| 1202.61 | 68.25 |
| 1202.68 | 68 |
| 1202.74 | 68 |
| 1202.81 | 68 |
| 1202.88 | 68 |
| 1202.95 | 68 |
| 1203.02 | 67.75 |
| 1203.08 | 67.75 |
| 1203.15 | 67.75 |
| 1203.22 | 67.75 |
| 1203.29 | 67.5 |
| 1203.36 | 67.5 |
| 1203.43 | 67.5 |
| 1203.49 | 67.25 |
| 1203.56 | 67.5 |
| 1203.63 | 67.5 |
| 1203.7 | 67.75 |
| 1203.77 | 68 |
| 1203.84 | 68.5 |
| 1203.9 | 68.75 |
| 1203.97 | 69.25 |
| 1204.04 | 69.25 |
| 1204.11 | 69.5 |
| 1204.18 | 70 |
| 1204.25 | 70.5 |
| 1204.31 | 71 |
| 1204.38 | 71.25 |
| 1204.45 | 71.5 |
| 1204.52 | 71.75 |
| 1204.59 | 72.25 |
| 1204.66 | 72.5 |
| 1204.72 | 73 |
| 1204.79 | 73.25 |
| 1204.86 | 73.25 |
| 1204.93 | 73.5 |
| 1205.0 | 73.75 |
| 1205.06 | 74 |
| 1205.13 | 74.5 |
| 1205.2 | 74.75 |
| 1205.27 | 75 |
| 1205.34 | 75.5 |
| 1205.41 | 75.75 |
| 1205.47 | 76 |
| 1205.54 | 76.25 |
| 1205.61 | 76.5 |
| 1205.68 | 76.5 |
| 1205.75 | 76.75 |
| 1205.81 | 77.25 |
| 1205.88 | 77.5 |
| 1205.95 | 77.75 |
| 1206.02 | 78 |
| 1206.09 | 78.25 |
| 1206.16 | 78.5 |
| 1206.22 | 78.75 |
| 1206.29 | 79 |
| 1206.36 | 79.5 |
| 1206.43 | 79.75 |
| 1206.5 | 79.75 |
| 1206.56 | 80 |
| 1206.63 | 80.25 |
| 1206.7 | 80.5 |
| 1206.77 | 80.75 |
| 1206.84 | 81 |
| 1206.91 | 81.25 |
| 1206.97 | 81.5 |
| 1207.04 | 81.75 |
| 1207.11 | 82 |
| 1207.18 | 82.25 |
| 1207.25 | 82.5 |
| 1207.31 | 82.5 |
| 1207.38 | 82.75 |
| 1207.45 | 83 |
| 1207.52 | 83.25 |
| 1207.59 | 83.25 |
| 1207.66 | 83.5 |
| 1207.72 | 83.75 |
| 1207.79 | 84.25 |
| 1207.86 | 84.25 |
| 1207.93 | 84.5 |
| 1208.0 | 84.75 |
| 1208.07 | 85 |
| 1208.13 | 85 |
| 1208.2 | 85.25 |
| 1208.27 | 85.5 |
| 1208.34 | 85.5 |
| 1208.41 | 85.75 |
| 1208.47 | 86 |
| 1208.54 | 86.25 |
| 1208.61 | 86.5 |
| 1208.68 | 86.75 |
| 1208.75 | 86.75 |
| 1208.82 | 87 |
| 1208.89 | 87.25 |
| 1208.95 | 87.5 |
| 1209.02 | 87.5 |
| 1209.09 | 87.5 |
| 1209.16 | 88 |
| 1209.23 | 88 |
| 1209.29 | 88.25 |
| 1209.36 | 88.25 |
| 1209.43 | 88.5 |
| 1209.5 | 88.75 |
| 1209.57 | 89 |
| 1209.63 | 89 |
| 1209.7 | 89.25 |
| 1209.77 | 89.5 |
| 1209.84 | 89.5 |
| 1209.91 | 89.75 |
| 1209.98 | 90 |
| 1210.04 | 90 |
| 1210.11 | 90.25 |
| 1210.18 | 90.5 |
| 1210.25 | 90.5 |
| 1210.32 | 90.75 |
| 1210.39 | 91 |
| 1210.45 | 91 |
| 1210.52 | 91.25 |
| 1210.59 | 91.5 |
| 1210.66 | 91.5 |
| 1210.73 | 91.75 |
| 1210.8 | 91.75 |
| 1210.86 | 92 |
| 1210.93 | 92.25 |
| 1211.0 | 92.25 |
| 1211.07 | 92.5 |
| 1211.14 | 92.75 |
| 1211.2 | 92.75 |
| 1211.27 | 93 |
| 1211.34 | 93.25 |
| 1211.41 | 93.25 |
| 1211.48 | 93.25 |
| 1211.55 | 93.5 |
| 1211.61 | 93.75 |
| 1211.68 | 93.75 |
| 1211.75 | 94 |
| 1211.82 | 94.25 |
| 1211.89 | 94.25 |
| 1211.95 | 94.5 |
| 1212.02 | 94.5 |
| 1212.09 | 94.75 |
| 1212.16 | 95 |
| 1212.23 | 95 |
| 1212.3 | 95 |
| 1212.36 | 95.25 |
| 1212.43 | 95.25 |
| 1212.5 | 95.5 |
| 1212.57 | 95.75 |
| 1212.64 | 96 |
| 1212.7 | 96 |
| 1212.77 | 96 |
| 1212.84 | 96.25 |
| 1212.91 | 96.25 |
| 1212.98 | 96.5 |
| 1213.05 | 96.75 |
| 1213.11 | 96.75 |
| 1213.18 | 96.75 |
| 1213.25 | 97 |
| 1213.32 | 97.25 |
| 1213.39 | 97.25 |
| 1213.45 | 97.5 |
| 1213.52 | 97.5 |
| 1213.59 | 97.5 |
| 1213.66 | 97.75 |
| 1213.73 | 98 |
| 1213.8 | 98 |
| 1213.86 | 98.25 |
| 1213.93 | 98.25 |
| 1214.0 | 98.25 |
| 1214.07 | 98.5 |
| 1214.14 | 98.5 |
| 1214.2 | 98.75 |
| 1214.27 | 98.75 |
| 1214.34 | 99 |
| 1214.41 | 99 |
| 1214.48 | 99.25 |
| 1214.55 | 99.5 |
| 1214.61 | 99.5 |
| 1214.68 | 99.75 |
| 1214.75 | 99.75 |
| 1214.82 | 99.75 |
| 1214.89 | 100 |
| 1214.96 | 100 |
| 1215.03 | 100 |
| 1215.09 | 100.25 |
| 1215.16 | 100.25 |
| 1215.23 | 100.25 |
| 1215.3 | 100.5 |
| 1215.37 | 100.5 |
| 1215.44 | 100.5 |
| 1215.5 | 100.75 |
| 1215.57 | 100.75 |
| 1215.64 | 100.75 |
| 1215.71 | 100.75 |
| 1215.78 | 100.75 |
| 1215.84 | 101 |
| 1215.91 | 101 |
| 1215.98 | 101 |
| 1216.05 | 101 |
| 1216.12 | 101 |
| 1216.19 | 101 |
| 1216.26 | 101 |
| 1216.32 | 101 |
| 1216.39 | 101 |
| 1216.46 | 101 |
| 1216.53 | 100.75 |
| 1216.6 | 100.75 |
| 1216.67 | 100.75 |
| 1216.73 | 100.25 |
| 1216.8 | 100 |
| 1216.87 | 99.75 |
| 1216.94 | 99.5 |
| 1217.01 | 99 |
| 1217.07 | 98.75 |
| 1217.14 | 98.25 |
| 1217.21 | 97.75 |
| 1217.28 | 97.75 |
| 1217.35 | 97.25 |
| 1217.42 | 96.75 |
| 1217.48 | 96.25 |
| 1217.55 | 95.75 |
| 1217.62 | 95 |
| 1217.69 | 94.5 |
| 1217.76 | 94 |
| 1217.82 | 93.5 |
| 1217.89 | 92.75 |
| 1217.96 | 92.25 |
| 1218.03 | 91.75 |
| 1218.1 | 91.75 |
| 1218.17 | 91.25 |
| 1218.23 | 90.75 |
| 1218.3 | 90.25 |
| 1218.37 | 89.5 |
| 1218.44 | 89 |
| 1218.51 | 88.5 |
| 1218.57 | 88.25 |
| 1218.64 | 87.75 |
| 1218.71 | 87.25 |
| 1218.78 | 86.75 |
| 1218.85 | 86.25 |
| 1218.92 | 86.25 |
| 1218.98 | 85.75 |
| 1219.05 | 85.25 |
| 1219.12 | 85 |
| 1219.19 | 84.5 |
| 1219.26 | 84.25 |
| 1219.32 | 83.75 |
| 1219.39 | 83.25 |
| 1219.46 | 83 |
| 1219.53 | 82.5 |
| 1219.6 | 82 |
| 1219.66 | 81.75 |
| 1219.73 | 81.75 |
| 1219.8 | 81.5 |
| 1219.87 | 81 |
| 1219.94 | 80.75 |
| 1220.01 | 80.25 |
| 1220.07 | 80 |
| 1220.14 | 79.75 |
| 1220.21 | 79.25 |
| 1220.28 | 79 |
| 1220.35 | 78.75 |
| 1220.41 | 78.25 |
| 1220.48 | 78 |
| 1220.55 | 78 |
| 1220.62 | 77.75 |
| 1220.69 | 77.5 |
| 1220.76 | 77 |
| 1220.82 | 76.75 |
| 1220.89 | 76.5 |
| 1220.96 | 76.25 |
| 1221.03 | 76 |
| 1221.1 | 75.5 |
| 1221.17 | 75.25 |
| 1221.23 | 75 |
| 1221.3 | 74.75 |
| 1221.37 | 74.75 |
| 1221.44 | 74.5 |
| 1221.51 | 74.25 |
| 1221.57 | 74 |
| 1221.64 | 73.75 |
| 1221.71 | 73.5 |
| 1221.78 | 73.25 |
| 1221.85 | 73 |
| 1221.91 | 72.75 |
| 1221.98 | 72.5 |
| 1222.05 | 72.25 |
| 1222.12 | 72 |
| 1222.19 | 72 |
| 1222.26 | 71.75 |
| 1222.32 | 71.5 |
| 1222.39 | 71.25 |
| 1222.46 | 71 |
| 1222.53 | 70.75 |
| 1222.6 | 70.75 |
| 1222.66 | 70.25 |
| 1222.73 | 70 |
| 1222.8 | 70 |
| 1222.87 | 69.5 |
| 1222.94 | 69.5 |
| 1223.01 | 69.5 |
| 1223.07 | 69.25 |
| 1223.14 | 69 |
| 1223.21 | 68.75 |
| 1223.28 | 68.5 |
| 1223.35 | 68.5 |
| 1223.41 | 68 |
| 1223.48 | 68 |
| 1223.55 | 68.5 |
| 1223.62 | 68.5 |
| 1223.69 | 68.75 |
| 1223.76 | 68.5 |
| 1223.82 | 68.5 |
| 1223.89 | 68.75 |
| 1223.96 | 68.75 |
| 1224.03 | 69 |
| 1224.1 | 69 |
| 1224.17 | 69 |
| 1224.23 | 69.25 |
| 1224.3 | 69.25 |
| 1224.37 | 69.25 |
| 1224.44 | 69.5 |
| 1224.51 | 69.5 |
| 1224.58 | 69.5 |
| 1224.64 | 69.5 |
| 1224.71 | 69.75 |
| 1224.78 | 69.75 |
| 1224.85 | 69.75 |
| 1224.92 | 70 |
| 1224.98 | 70 |
| 1225.05 | 70 |
| 1225.12 | 70 |
| 1225.19 | 70 |
| 1225.26 | 70 |
| 1225.33 | 70 |
| 1225.4 | 70 |
| 1225.46 | 70 |
| 1225.53 | 70 |
| 1225.6 | 70 |
| 1225.67 | 70 |
| 1225.74 | 70 |
| 1225.8 | 70 |
| 1225.87 | 70 |
| 1225.94 | 70 |
| 1226.01 | 70 |
| 1226.08 | 69.75 |
| 1226.15 | 69.75 |
| 1226.21 | 69.75 |
| 1226.28 | 69.75 |
| 1226.35 | 69.5 |
| 1226.42 | 69.5 |
| 1226.49 | 69.5 |
| 1226.56 | 69.5 |
| 1226.62 | 69.25 |
| 1226.69 | 69.25 |
| 1226.76 | 69.25 |
| 1226.83 | 69 |
| 1226.9 | 69 |
| 1226.97 | 69 |
| 1227.03 | 68.75 |
| 1227.1 | 68.75 |
| 1227.17 | 68.75 |
| 1227.24 | 68.75 |
| 1227.31 | 68.5 |
| 1227.38 | 68.5 |
| 1227.44 | 68.5 |
| 1227.51 | 68.5 |
| 1227.58 | 68.5 |
| 1227.65 | 68.25 |
| 1227.72 | 68.25 |
| 1227.79 | 68.25 |
| 1227.85 | 68 |
| 1227.92 | 68 |
| 1227.99 | 68 |
| 1228.06 | 68 |
| 1228.13 | 67.75 |
| 1228.19 | 67.75 |
| 1228.26 | 67.75 |
| 1228.33 | 67.75 |
| 1228.4 | 67.5 |
| 1228.47 | 67.5 |
| 1228.54 | 67.5 |
| 1228.6 | 67.5 |
| 1228.67 | 67.5 |
| 1228.74 | 67.75 |
| 1228.81 | 67.75 |
| 1228.88 | 67.75 |
| 1228.94 | 68.25 |
| 1229.01 | 68.5 |
| 1229.08 | 69 |
| 1229.15 | 69.25 |
| 1229.22 | 69.75 |
| 1229.29 | 70 |
| 1229.35 | 70.5 |
| 1229.42 | 71 |
| 1229.49 | 71.25 |
| 1229.56 | 71.75 |
| 1229.63 | 71.75 |
| 1229.7 | 71.75 |
| 1229.76 | 72.25 |
| 1229.83 | 72.5 |
| 1229.9 | 72.75 |
| 1229.97 | 73.25 |
| 1230.04 | 73.5 |
| 1230.1 | 73.75 |
| 1230.17 | 74.25 |
| 1230.24 | 74.5 |
| 1230.31 | 74.75 |
| 1230.38 | 75 |
| 1230.45 | 75 |
| 1230.51 | 75.5 |
| 1230.58 | 75.75 |
| 1230.65 | 76 |
| 1230.72 | 76.25 |
| 1230.79 | 76.5 |
| 1230.85 | 77 |
| 1230.92 | 77.25 |
| 1230.99 | 77.5 |
| 1231.06 | 77.75 |
| 1231.13 | 78 |
| 1231.2 | 78.25 |
| 1231.26 | 78.25 |
| 1231.33 | 78.5 |
| 1231.4 | 78.75 |
| 1231.47 | 79.25 |
| 1231.54 | 79.5 |
| 1231.6 | 79.75 |
| 1231.67 | 80 |
| 1231.74 | 80.25 |
| 1231.81 | 80.5 |
| 1231.88 | 80.75 |
| 1231.95 | 81 |
| 1232.02 | 81.25 |
| 1232.08 | 81.25 |
| 1232.15 | 81.5 |
| 1232.22 | 81.75 |
| 1232.29 | 82 |
| 1232.36 | 82 |
| 1232.42 | 82.5 |
| 1232.49 | 82.5 |
| 1232.56 | 82.75 |
| 1232.63 | 83 |
| 1232.7 | 83.25 |
| 1232.77 | 83.5 |
| 1232.83 | 83.75 |
| 1232.9 | 83.75 |
| 1232.97 | 84 |
| 1233.04 | 84.25 |
| 1233.11 | 84.5 |
| 1233.17 | 84.75 |
| 1233.24 | 84.75 |
| 1233.31 | 85 |
| 1233.38 | 85.25 |
| 1233.45 | 85.5 |
| 1233.52 | 85.5 |
| 1233.58 | 85.75 |
| 1233.65 | 86 |
| 1233.72 | 86 |
| 1233.79 | 86.25 |
| 1233.86 | 86.5 |
| 1233.93 | 86.5 |
| 1233.99 | 87 |
| 1234.06 | 87 |
| 1234.13 | 87.25 |
| 1234.2 | 87.5 |
| 1234.27 | 87.75 |
| 1234.33 | 87.75 |
| 1234.4 | 88 |
| 1234.47 | 88.25 |
| 1234.54 | 88.25 |
| 1234.61 | 88.25 |
| 1234.68 | 88.5 |
| 1234.74 | 88.75 |
| 1234.81 | 89 |
| 1234.88 | 89.25 |
| 1234.95 | 89.25 |
| 1235.02 | 89.5 |
| 1235.08 | 89.75 |
| 1235.15 | 89.75 |
| 1235.22 | 90 |
| 1235.29 | 90.25 |
| 1235.36 | 90.5 |
| 1235.43 | 90.5 |
| 1235.49 | 90.75 |
| 1235.56 | 90.75 |
| 1235.63 | 91 |
| 1235.7 | 91 |
| 1235.77 | 91.25 |
| 1235.83 | 91.5 |
| 1235.9 | 91.75 |
| 1235.97 | 91.75 |
| 1236.04 | 92 |
| 1236.11 | 92.25 |
| 1236.18 | 92.25 |
| 1236.24 | 92.25 |
| 1236.31 | 92.5 |
| 1236.38 | 92.75 |
| 1236.45 | 92.75 |
| 1236.52 | 93 |
| 1236.58 | 93 |
| 1236.65 | 93.25 |
| 1236.72 | 93.5 |
| 1236.79 | 93.5 |
| 1236.86 | 93.75 |
| 1236.93 | 93.75 |
| 1237.0 | 94 |
| 1237.06 | 94 |
| 1237.13 | 94.25 |
| 1237.2 | 94.25 |
| 1237.27 | 94.5 |
| 1237.34 | 94.5 |
| 1237.4 | 94.75 |
| 1237.47 | 95 |
| 1237.54 | 95 |
| 1237.61 | 95.25 |
| 1237.68 | 95.25 |
| 1237.75 | 95.5 |
| 1237.81 | 95.75 |
| 1237.88 | 95.75 |
| 1237.95 | 95.75 |
| 1238.02 | 96 |
| 1238.09 | 96 |
| 1238.16 | 96.25 |
| 1238.22 | 96.5 |
| 1238.29 | 96.5 |
| 1238.36 | 96.75 |
| 1238.43 | 96.75 |
| 1238.5 | 97 |
| 1238.56 | 97 |
| 1238.63 | 97.25 |
| 1238.7 | 97.25 |
| 1238.77 | 97.5 |
| 1238.84 | 97.5 |
| 1238.91 | 97.75 |
| 1238.97 | 97.75 |
| 1239.04 | 98 |
| 1239.11 | 98 |
| 1239.18 | 98.25 |
| 1239.25 | 98.25 |
| 1239.31 | 98.5 |
| 1239.38 | 98.5 |
| 1239.45 | 98.75 |
| 1239.52 | 98.75 |
| 1239.59 | 98.75 |
| 1239.66 | 99 |
| 1239.72 | 99.25 |
| 1239.79 | 99.25 |
| 1239.86 | 99.25 |
| 1239.93 | 99.5 |
| 1240.0 | 99.75 |
| 1240.06 | 99.75 |
| 1240.13 | 100 |
| 1240.2 | 100 |
| 1240.27 | 100 |
| 1240.34 | 100 |
| 1240.41 | 100.25 |
| 1240.47 | 100.25 |
| 1240.54 | 100.5 |
| 1240.61 | 100.5 |
| 1240.68 | 100.5 |
| 1240.75 | 100.75 |
| 1240.82 | 100.75 |
| 1240.89 | 100.75 |
| 1240.95 | 100.75 |
| 1241.02 | 101 |
| 1241.09 | 101 |
| 1241.16 | 101 |
| 1241.23 | 101 |
| 1241.29 | 101 |
| 1241.36 | 101 |
| 1241.43 | 101 |
| 1241.5 | 101 |
| 1241.57 | 101 |
| 1241.64 | 101 |
| 1241.7 | 101 |
| 1241.77 | 101 |
| 1241.84 | 101 |
| 1241.91 | 100.75 |
| 1241.98 | 100.25 |
| 1242.05 | 100.25 |
| 1242.11 | 100 |
| 1242.18 | 99.75 |
| 1242.25 | 99.25 |
| 1242.32 | 99 |
| 1242.39 | 98.5 |
| 1242.45 | 98.25 |
| 1242.52 | 97.5 |
| 1242.59 | 97.25 |
| 1242.66 | 96.75 |
| 1242.73 | 96 |
| 1242.8 | 95.5 |
| 1242.86 | 95.5 |
| 1242.93 | 95 |
| 1243.0 | 94.5 |
| 1243.07 | 93.75 |
| 1243.14 | 93.25 |
| 1243.2 | 92.75 |
| 1243.27 | 92.25 |
| 1243.34 | 91.5 |
| 1243.41 | 91 |
| 1243.48 | 90.5 |
| 1243.55 | 90 |
| 1243.61 | 89.5 |
| 1243.68 | 89.5 |
| 1243.75 | 89 |
| 1243.82 | 88.25 |
| 1243.89 | 88 |
| 1243.95 | 87.5 |
| 1244.02 | 87 |
| 1244.09 | 86.5 |
| 1244.16 | 86 |
| 1244.23 | 85.5 |
| 1244.3 | 85.25 |
| 1244.36 | 84.75 |
| 1244.43 | 84.25 |
| 1244.5 | 84.25 |
| 1244.57 | 83.75 |
| 1244.64 | 83.5 |
| 1244.7 | 83 |
| 1244.77 | 82.75 |
| 1244.84 | 82.25 |
| 1244.91 | 82 |
| 1244.98 | 81.75 |
| 1245.05 | 81.25 |
| 1245.11 | 81 |
| 1245.18 | 80.5 |
| 1245.25 | 80.25 |
| 1245.32 | 80.25 |
| 1245.39 | 80 |
| 1245.45 | 79.5 |
| 1245.52 | 79.25 |
| 1245.59 | 79 |
| 1245.66 | 78.5 |
| 1245.73 | 78.25 |
| 1245.8 | 77.75 |
| 1245.86 | 77.5 |
| 1245.93 | 77.25 |
| 1246.0 | 77 |
| 1246.07 | 76.75 |
| 1246.14 | 76.75 |
| 1246.2 | 76.5 |
| 1246.27 | 76.25 |
| 1246.34 | 75.75 |
| 1246.41 | 75.75 |
| 1246.48 | 75.25 |
| 1246.55 | 75 |
| 1246.61 | 74.75 |
| 1246.68 | 74.5 |
| 1246.75 | 74.25 |
| 1246.82 | 74 |
| 1246.89 | 73.75 |
| 1246.95 | 73.75 |
| 1247.02 | 73.5 |
| 1247.09 | 73.25 |
| 1247.16 | 73 |
| 1247.23 | 72.5 |
| 1247.3 | 72.5 |
| 1247.36 | 72.25 |
| 1247.43 | 71.75 |
| 1247.5 | 71.75 |
| 1247.57 | 71.5 |
| 1247.64 | 71.25 |
| 1247.7 | 71 |
| 1247.77 | 71 |
| 1247.84 | 70.75 |
| 1247.91 | 70.5 |
| 1247.98 | 70.25 |
| 1248.05 | 70 |
| 1248.11 | 69.75 |
| 1248.18 | 69.5 |
| 1248.25 | 69.25 |
| 1248.32 | 69.25 |
| 1248.39 | 69 |
| 1248.45 | 68.75 |
| 1248.52 | 68.5 |
| 1248.59 | 68.5 |
| 1248.66 | 68.25 |
| 1248.73 | 68.25 |
| 1248.8 | 68.25 |
| 1248.86 | 68.5 |
| 1248.93 | 68.5 |
| 1249.0 | 68.75 |
| 1249.07 | 68.75 |
| 1249.14 | 68.75 |
| 1249.2 | 69 |
| 1249.27 | 69 |
| 1249.34 | 69 |
| 1249.41 | 69 |
| 1249.48 | 69.25 |
| 1249.55 | 69.25 |
| 1249.61 | 69.5 |
| 1249.68 | 69.5 |
| 1249.75 | 69.5 |
| 1249.82 | 69.5 |
| 1249.89 | 69.75 |
| 1249.96 | 70 |
| 1250.02 | 70 |
| 1250.09 | 70 |
| 1250.16 | 70 |
| 1250.23 | 70 |
| 1250.3 | 70 |
| 1250.37 | 70 |
| 1250.43 | 70.25 |
| 1250.5 | 70 |
| 1250.57 | 70.25 |
| 1250.64 | 70.25 |
| 1250.71 | 70 |
| 1250.78 | 70 |
| 1250.84 | 70.25 |
| 1250.91 | 70 |
| 1250.98 | 70 |
| 1251.05 | 70 |
| 1251.12 | 70 |
| 1251.19 | 70 |
| 1251.25 | 69.75 |
| 1251.32 | 69.75 |
| 1251.39 | 69.75 |
| 1251.46 | 69.5 |
| 1251.53 | 69.5 |
| 1251.59 | 69.5 |
| 1251.66 | 69.5 |
| 1251.73 | 69.5 |
| 1251.8 | 69.25 |
| 1251.87 | 69.25 |
| 1251.94 | 69.25 |
| 1252.0 | 69.25 |
| 1252.07 | 69.25 |
| 1252.14 | 69 |
| 1252.21 | 69 |
| 1252.28 | 68.75 |
| 1252.35 | 68.75 |
| 1252.41 | 68.75 |
| 1252.48 | 68.75 |
| 1252.55 | 68.5 |
| 1252.62 | 68.5 |
| 1252.69 | 68.5 |
| 1252.76 | 68.5 |
| 1252.82 | 68.5 |
| 1252.89 | 68.25 |
| 1252.96 | 68.25 |
| 1253.03 | 68.25 |
| 1253.1 | 68 |
| 1253.17 | 68 |
| 1253.23 | 68 |
| 1253.3 | 68 |
| 1253.37 | 68 |
| 1253.44 | 67.75 |
| 1253.51 | 67.75 |
| 1253.57 | 67.75 |
| 1253.64 | 67.75 |
| 1253.71 | 67.5 |
| 1253.78 | 67.5 |
| 1253.85 | 67.5 |
| 1253.92 | 67.5 |
| 1253.98 | 67.5 |
| 1254.05 | 67.75 |
| 1254.12 | 68 |
| 1254.19 | 68.25 |
| 1254.26 | 68.75 |
| 1254.33 | 69.25 |
| 1254.39 | 69.25 |
| 1254.46 | 69.75 |
| 1254.53 | 70 |
| 1254.6 | 70.5 |
| 1254.67 | 70.75 |
| 1254.73 | 71.25 |
| 1254.8 | 71.5 |
| 1254.87 | 71.75 |
| 1254.94 | 72 |
| 1255.01 | 72.5 |
| 1255.08 | 72.75 |
| 1255.14 | 73.25 |
| 1255.21 | 73.25 |
| 1255.28 | 73.5 |
| 1255.35 | 73.75 |
| 1255.42 | 74.25 |
| 1255.48 | 74.5 |
| 1255.55 | 74.75 |
| 1255.62 | 75 |
| 1255.69 | 75.25 |
| 1255.76 | 75.5 |
| 1255.83 | 76 |
| 1255.9 | 76.25 |
| 1255.96 | 76.5 |
| 1256.03 | 76.5 |
| 1256.1 | 76.75 |
| 1256.17 | 77 |
| 1256.24 | 77.5 |
| 1256.3 | 77.75 |
| 1256.37 | 78 |
| 1256.44 | 78.25 |
| 1256.51 | 78.5 |
| 1256.58 | 78.75 |
| 1256.65 | 79 |
| 1256.71 | 79.5 |
| 1256.78 | 79.75 |
| 1256.85 | 79.75 |
| 1256.92 | 80 |
| 1256.99 | 80.25 |
| 1257.06 | 80.5 |
| 1257.12 | 80.5 |
| 1257.19 | 81 |
| 1257.26 | 81 |
| 1257.33 | 81.5 |
| 1257.4 | 81.75 |
| 1257.46 | 82 |
| 1257.53 | 82.25 |
| 1257.6 | 82.5 |
| 1257.67 | 82.5 |
| 1257.74 | 82.5 |
| 1257.8 | 83 |
| 1257.87 | 83 |
| 1257.94 | 83.25 |
| 1258.01 | 83.5 |
| 1258.08 | 83.75 |
| 1258.15 | 84 |
| 1258.21 | 84.25 |
| 1258.28 | 84.5 |
| 1258.35 | 84.75 |
| 1258.42 | 85 |
| 1258.49 | 85 |
| 1258.56 | 85.25 |
| 1258.62 | 85.25 |
| 1258.69 | 85.5 |
| 1258.76 | 85.75 |
| 1258.83 | 86 |
| 1258.9 | 86.25 |
| 1258.96 | 86.5 |
| 1259.03 | 86.5 |
| 1259.1 | 86.75 |
| 1259.17 | 87 |
| 1259.24 | 87.25 |
| 1259.31 | 87.25 |
| 1259.37 | 87.25 |
| 1259.44 | 87.5 |
| 1259.51 | 87.75 |
| 1259.58 | 88 |
| 1259.65 | 88 |
| 1259.71 | 88.25 |
| 1259.78 | 88.5 |
| 1259.85 | 88.5 |
| 1259.92 | 88.75 |
| 1259.99 | 89 |
| 1260.06 | 89.25 |
| 1260.12 | 89.25 |
| 1260.19 | 89.25 |
| 1260.26 | 89.5 |
| 1260.33 | 89.75 |
| 1260.4 | 89.75 |
| 1260.47 | 90 |
| 1260.53 | 90.25 |
| 1260.6 | 90.25 |
| 1260.67 | 90.5 |
| 1260.74 | 90.75 |
| 1260.81 | 90.75 |
| 1260.87 | 91 |
| 1260.94 | 91.25 |
| 1261.01 | 91.25 |
| 1261.08 | 91.5 |
| 1261.15 | 91.5 |
| 1261.21 | 91.75 |
| 1261.28 | 91.75 |
| 1261.35 | 92 |
| 1261.42 | 92.25 |
| 1261.49 | 92.25 |
| 1261.56 | 92.5 |
| 1261.63 | 92.5 |
| 1261.69 | 92.75 |
| 1261.76 | 93 |
| 1261.83 | 93 |
| 1261.9 | 93 |
| 1261.97 | 93.25 |
| 1262.03 | 93.25 |
| 1262.1 | 93.5 |
| 1262.17 | 93.5 |
| 1262.24 | 93.75 |
| 1262.31 | 94 |
| 1262.38 | 94 |
| 1262.44 | 94.25 |
| 1262.51 | 94.25 |
| 1262.58 | 94.5 |
| 1262.65 | 94.5 |
| 1262.72 | 94.5 |
| 1262.79 | 94.75 |
| 1262.85 | 95 |
| 1262.92 | 95 |
| 1262.99 | 95.25 |
| 1263.06 | 95.25 |
| 1263.13 | 95.5 |
| 1263.19 | 95.75 |
| 1263.26 | 96 |
| 1263.33 | 96 |
| 1263.4 | 96 |
| 1263.47 | 96 |
| 1263.54 | 96.25 |
| 1263.6 | 96.5 |
| 1263.67 | 96.5 |
| 1263.74 | 96.75 |
| 1263.81 | 96.75 |
| 1263.88 | 97 |
| 1263.94 | 97 |
| 1264.01 | 97.25 |
| 1264.08 | 97.25 |
| 1264.15 | 97.5 |
| 1264.22 | 97.5 |
| 1264.29 | 97.5 |
| 1264.35 | 97.75 |
| 1264.42 | 97.75 |
| 1264.49 | 98 |
| 1264.56 | 98 |
| 1264.63 | 98.25 |
| 1264.69 | 98.25 |
| 1264.76 | 98.5 |
| 1264.83 | 98.75 |
| 1264.9 | 98.75 |
| 1264.97 | 98.75 |
| 1265.04 | 99 |
| 1265.1 | 99 |
| 1265.17 | 99.25 |
| 1265.24 | 99.25 |
| 1265.31 | 99.5 |
| 1265.38 | 99.5 |
| 1265.44 | 99.75 |
| 1265.51 | 99.75 |
| 1265.58 | 100 |
| 1265.65 | 100 |
| 1265.72 | 100 |
| 1265.79 | 100.25 |
| 1265.86 | 100.25 |
| 1265.93 | 100.25 |
| 1265.99 | 100.5 |
| 1266.06 | 100.5 |
| 1266.13 | 100.5 |
| 1266.2 | 100.5 |
| 1266.27 | 100.75 |
| 1266.33 | 100.75 |
| 1266.4 | 100.75 |
| 1266.47 | 101 |
| 1266.54 | 101 |
| 1266.61 | 101 |
| 1266.68 | 101 |
| 1266.74 | 101 |
| 1266.81 | 101 |
| 1266.88 | 101 |
| 1266.95 | 101 |
| 1267.02 | 101 |
| 1267.09 | 101 |
| 1267.15 | 101 |
| 1267.22 | 101 |
| 1267.29 | 100.75 |
| 1267.36 | 100.25 |
| 1267.43 | 100 |
| 1267.5 | 99.75 |
| 1267.56 | 99.25 |
| 1267.63 | 99.25 |
| 1267.7 | 99 |
| 1267.77 | 98.5 |
| 1267.83 | 98 |
| 1267.9 | 97.75 |
| 1267.97 | 97.25 |
| 1268.04 | 96.75 |
| 1268.11 | 96.25 |
| 1268.18 | 95.75 |
| 1268.25 | 95 |
| 1268.31 | 94.5 |
| 1268.38 | 94 |
| 1268.45 | 94 |
| 1268.52 | 93.5 |
| 1268.59 | 92.75 |
| 1268.65 | 92.25 |
| 1268.72 | 91.75 |
| 1268.79 | 91.25 |
| 1268.86 | 90.75 |
| 1268.93 | 90.25 |
| 1269.0 | 89.5 |
| 1269.06 | 89.25 |
| 1269.13 | 88.5 |
| 1269.2 | 88.25 |
| 1269.27 | 88.25 |
| 1269.34 | 87.75 |
| 1269.4 | 87.25 |
| 1269.47 | 86.75 |
| 1269.54 | 86.25 |
| 1269.61 | 85.75 |
| 1269.68 | 85.25 |
| 1269.75 | 85 |
| 1269.81 | 84.5 |
| 1269.88 | 84.25 |
| 1269.95 | 83.75 |
| 1270.02 | 83.25 |
| 1270.08 | 83.25 |
| 1270.15 | 83 |
| 1270.22 | 82.5 |
| 1270.29 | 82.25 |
| 1270.36 | 81.75 |
| 1270.43 | 81.5 |
| 1270.5 | 81.25 |
| 1270.56 | 80.75 |
| 1270.63 | 80.5 |
| 1270.7 | 80 |
| 1270.77 | 79.75 |
| 1270.84 | 79.5 |
| 1270.9 | 79.5 |
| 1270.97 | 79 |
| 1271.04 | 78.75 |
| 1271.11 | 78.5 |
| 1271.18 | 78.25 |
| 1271.24 | 77.75 |
| 1271.31 | 77.5 |
| 1271.38 | 77.25 |
| 1271.45 | 77 |
| 1271.52 | 76.5 |
| 1271.58 | 76.25 |
| 1271.65 | 76 |
| 1271.72 | 76 |
| 1271.79 | 75.75 |
| 1271.86 | 75.5 |
| 1271.93 | 75.25 |
| 1271.99 | 75 |
| 1272.06 | 74.75 |
| 1272.13 | 74.5 |
| 1272.2 | 74 |
| 1272.27 | 73.75 |
| 1272.33 | 73.75 |
| 1272.4 | 73.5 |
| 1272.47 | 73 |
| 1272.54 | 73 |
| 1272.61 | 72.75 |
| 1272.68 | 72.5 |
| 1272.74 | 72.25 |
| 1272.81 | 72 |
| 1272.88 | 71.75 |
| 1272.95 | 71.75 |
| 1273.02 | 71.5 |
| 1273.08 | 71.25 |
| 1273.15 | 71 |
| 1273.22 | 70.75 |
| 1273.29 | 70.5 |
| 1273.36 | 70.5 |
| 1273.43 | 70.25 |
| 1273.49 | 70 |
| 1273.56 | 69.75 |
| 1273.63 | 69.5 |
| 1273.7 | 69.25 |
| 1273.77 | 69 |
| 1273.83 | 68.75 |
| 1273.9 | 68.75 |
| 1273.97 | 68.5 |
| 1274.04 | 68.25 |
| 1274.11 | 68 |
| 1274.18 | 68 |
| 1274.25 | 68.25 |
| 1274.31 | 68.5 |
| 1274.38 | 68.5 |
| 1274.45 | 68.75 |
| 1274.52 | 68.75 |
| 1274.59 | 69 |
| 1274.65 | 69 |
| 1274.72 | 69 |
| 1274.79 | 69.25 |
| 1274.86 | 69.5 |
| 1274.93 | 69.5 |
| 1275.0 | 69.5 |
| 1275.06 | 69.5 |
| 1275.13 | 69.75 |
| 1275.2 | 69.75 |
| 1275.27 | 70 |
| 1275.34 | 70 |
| 1275.41 | 70 |
| 1275.47 | 70.25 |
| 1275.54 | 70.25 |
| 1275.61 | 70.25 |
| 1275.68 | 70.25 |
| 1275.75 | 70.25 |
| 1275.81 | 70.25 |
| 1275.88 | 70.5 |
| 1275.95 | 70.5 |
| 1276.02 | 70.5 |
| 1276.09 | 70.5 |
| 1276.16 | 70.5 |
| 1276.22 | 70.5 |
| 1276.29 | 70.5 |
| 1276.36 | 70.25 |
| 1276.43 | 70.25 |
| 1276.5 | 70.25 |
| 1276.57 | 70 |
| 1276.64 | 70 |
| 1276.7 | 70 |
| 1276.77 | 70 |
| 1276.84 | 70 |
| 1276.91 | 69.75 |
| 1276.98 | 69.75 |
| 1277.04 | 69.5 |
| 1277.11 | 69.5 |
| 1277.18 | 69.5 |
| 1277.25 | 69.5 |
| 1277.32 | 69.5 |
| 1277.39 | 69.25 |
| 1277.45 | 69.25 |
| 1277.52 | 69.25 |
| 1277.59 | 69 |
| 1277.66 | 69 |
| 1277.73 | 69 |
| 1277.8 | 69 |
| 1277.86 | 68.75 |
| 1277.93 | 68.75 |
| 1278.0 | 68.75 |
| 1278.07 | 68.75 |
| 1278.14 | 68.5 |
| 1278.2 | 68.5 |
| 1278.27 | 68.5 |
| 1278.34 | 68.5 |
| 1278.41 | 68.5 |
| 1278.48 | 68.25 |
| 1278.55 | 68.25 |
| 1278.61 | 68.25 |
| 1278.68 | 68 |
| 1278.75 | 68 |
| 1278.82 | 68 |
| 1278.89 | 68 |
| 1278.96 | 67.75 |
| 1279.03 | 67.75 |
| 1279.09 | 67.75 |
| 1279.16 | 67.75 |
| 1279.23 | 67.5 |
| 1279.3 | 67.5 |
| 1279.37 | 67.5 |
| 1279.43 | 67.5 |
| 1279.5 | 67.75 |
| 1279.57 | 68 |
| 1279.64 | 68.5 |
| 1279.71 | 68.75 |
| 1279.78 | 69.5 |
| 1279.84 | 70 |
| 1279.91 | 70.25 |
| 1279.98 | 70.25 |
| 1280.05 | 70.75 |
| 1280.12 | 71 |
| 1280.19 | 71.5 |
| 1280.25 | 71.75 |
| 1280.32 | 72.25 |
| 1280.39 | 72.5 |
| 1280.46 | 72.75 |
| 1280.53 | 73.25 |
| 1280.59 | 73.5 |
| 1280.66 | 74 |
| 1280.73 | 74.25 |
| 1280.8 | 74.25 |
| 1280.87 | 74.5 |
| 1280.93 | 75 |
| 1281.0 | 75.25 |
| 1281.07 | 75.5 |
| 1281.14 | 76 |
| 1281.21 | 76.25 |
| 1281.28 | 76.75 |
| 1281.34 | 77 |
| 1281.41 | 77.25 |
| 1281.48 | 77.5 |
| 1281.55 | 77.75 |
| 1281.62 | 77.75 |
| 1281.69 | 78.25 |
| 1281.75 | 78.5 |
| 1281.82 | 78.75 |
| 1281.89 | 79 |
| 1281.96 | 79.25 |
| 1282.03 | 79.75 |
| 1282.09 | 80 |
| 1282.16 | 80.25 |
| 1282.23 | 80.5 |
| 1282.3 | 80.75 |
| 1282.37 | 81 |
| 1282.44 | 81 |
| 1282.5 | 81.25 |
| 1282.57 | 81.75 |
| 1282.64 | 82 |
| 1282.71 | 82.25 |
| 1282.78 | 82.5 |
| 1282.84 | 82.75 |
| 1282.91 | 83 |
| 1282.98 | 83.25 |
| 1283.05 | 83.5 |
| 1283.12 | 83.75 |
| 1283.19 | 84 |
| 1283.25 | 84 |
| 1283.32 | 84.25 |
| 1283.39 | 84.5 |
| 1283.46 | 84.75 |
| 1283.53 | 85 |
| 1283.6 | 85.25 |
| 1283.66 | 85.5 |
| 1283.73 | 85.75 |
| 1283.8 | 86 |
| 1283.87 | 86 |
| 1283.94 | 86.25 |
| 1284.0 | 86.5 |
| 1284.07 | 86.5 |
| 1284.14 | 86.75 |
| 1284.21 | 87 |
| 1284.28 | 87.25 |
| 1284.34 | 87.5 |
| 1284.41 | 87.5 |
| 1284.48 | 88 |
| 1284.55 | 88 |
| 1284.62 | 88.25 |
| 1284.69 | 88.5 |
| 1284.76 | 88.75 |
| 1284.82 | 89 |
| 1284.89 | 89 |
| 1284.96 | 89 |
| 1285.03 | 89.25 |
| 1285.1 | 89.5 |
| 1285.17 | 89.75 |
| 1285.23 | 90 |
| 1285.3 | 90.25 |
| 1285.37 | 90.25 |
| 1285.44 | 90.5 |
| 1285.51 | 90.75 |
| 1285.57 | 91 |
| 1285.64 | 91.25 |
| 1285.71 | 91.25 |
| 1285.78 | 91.25 |
| 1285.85 | 91.5 |
| 1285.92 | 91.75 |
| 1285.98 | 92 |
| 1286.05 | 92 |
| 1286.12 | 92.25 |
| 1286.19 | 92.5 |
| 1286.26 | 92.75 |
| 1286.32 | 92.75 |
| 1286.39 | 93 |
| 1286.46 | 93 |
| 1286.53 | 93.25 |
| 1286.6 | 93.25 |
| 1286.67 | 93.5 |
| 1286.73 | 93.5 |
| 1286.8 | 93.75 |
| 1286.87 | 94 |
| 1286.94 | 94 |
| 1287.01 | 94.25 |
| 1287.07 | 94.25 |
| 1287.14 | 94.5 |
| 1287.21 | 94.5 |
| 1287.28 | 94.75 |
| 1287.35 | 95 |
| 1287.42 | 95 |
| 1287.48 | 95.25 |
| 1287.55 | 95.25 |
| 1287.62 | 95.5 |
| 1287.69 | 95.75 |
| 1287.76 | 95.75 |
| 1287.82 | 96 |
| 1287.89 | 96 |
| 1287.96 | 96.25 |
| 1288.03 | 96.5 |
| 1288.1 | 96.5 |
| 1288.17 | 96.75 |
| 1288.23 | 96.75 |
| 1288.3 | 97 |
| 1288.37 | 97 |
| 1288.44 | 97.25 |
| 1288.51 | 97.25 |
| 1288.58 | 97.5 |
| 1288.64 | 97.75 |
| 1288.71 | 97.75 |
| 1288.78 | 98 |
| 1288.85 | 98 |
| 1288.92 | 98.25 |
| 1288.98 | 98.5 |
| 1289.05 | 98.5 |
| 1289.12 | 98.5 |
| 1289.19 | 98.75 |
| 1289.26 | 99 |
| 1289.33 | 99 |
| 1289.4 | 99.25 |
| 1289.46 | 99.25 |
| 1289.53 | 99.5 |
| 1289.6 | 99.75 |
| 1289.67 | 99.75 |
| 1289.74 | 100 |
| 1289.8 | 100 |
| 1289.87 | 100 |
| 1289.94 | 100.25 |
| 1290.01 | 100.25 |
| 1290.08 | 100.5 |
| 1290.15 | 100.5 |
| 1290.21 | 100.75 |
| 1290.28 | 100.75 |
| 1290.35 | 100.75 |
| 1290.42 | 101 |
| 1290.49 | 101 |
| 1290.56 | 101 |
| 1290.63 | 101 |
| 1290.69 | 101 |
| 1290.76 | 101.25 |
| 1290.83 | 101.25 |
| 1290.9 | 101.25 |
| 1290.97 | 101.25 |
| 1291.03 | 101.25 |
| 1291.1 | 101.25 |
| 1291.17 | 101.25 |
| 1291.24 | 101.25 |
| 1291.31 | 101.25 |
| 1291.38 | 101 |
| 1291.44 | 101 |
| 1291.51 | 100.5 |
| 1291.58 | 100.5 |
| 1291.65 | 100.25 |
| 1291.72 | 100 |
| 1291.79 | 99.75 |
| 1291.85 | 99.25 |
| 1291.92 | 99 |
| 1291.99 | 98.5 |
| 1292.06 | 98 |
| 1292.13 | 97.5 |
| 1292.19 | 97 |
| 1292.26 | 96.5 |
| 1292.33 | 96 |
| 1292.4 | 96 |
| 1292.47 | 95.5 |
| 1292.54 | 94.75 |
| 1292.6 | 94.25 |
| 1292.67 | 93.75 |
| 1292.74 | 93.25 |
| 1292.81 | 92.5 |
| 1292.88 | 92 |
| 1292.94 | 91.5 |
| 1293.01 | 91 |
| 1293.08 | 90.5 |
| 1293.15 | 89.75 |
| 1293.22 | 89.75 |
| 1293.29 | 89.25 |
| 1293.35 | 88.75 |
| 1293.42 | 88.25 |
| 1293.49 | 87.75 |
| 1293.56 | 87.25 |
| 1293.63 | 86.75 |
| 1293.69 | 86.25 |
| 1293.76 | 85.75 |
| 1293.83 | 85.5 |
| 1293.9 | 85 |
| 1293.97 | 84.5 |
| 1294.03 | 84.5 |
| 1294.1 | 84.25 |
| 1294.17 | 83.75 |
| 1294.24 | 83.25 |
| 1294.31 | 83 |
| 1294.38 | 82.5 |
| 1294.44 | 82 |
| 1294.51 | 81.75 |
| 1294.58 | 81.5 |
| 1294.65 | 81 |
| 1294.72 | 80.75 |
| 1294.79 | 80.25 |
| 1294.85 | 80.25 |
| 1294.92 | 80 |
| 1294.99 | 79.5 |
| 1295.06 | 79.25 |
| 1295.13 | 79 |
| 1295.19 | 78.5 |
| 1295.26 | 78.25 |
| 1295.33 | 77.75 |
| 1295.4 | 77.5 |
| 1295.47 | 77.25 |
| 1295.54 | 77 |
| 1295.6 | 76.75 |
| 1295.67 | 76.75 |
| 1295.74 | 76.5 |
| 1295.81 | 76.25 |
| 1295.88 | 75.75 |
| 1295.94 | 75.5 |
| 1296.01 | 75.25 |
| 1296.08 | 75 |
| 1296.15 | 74.75 |
| 1296.22 | 74.5 |
| 1296.28 | 74.25 |
| 1296.35 | 74 |
| 1296.42 | 74 |
| 1296.49 | 73.75 |
| 1296.56 | 73.5 |
| 1296.63 | 73.25 |
| 1296.69 | 73 |
| 1296.76 | 72.5 |
| 1296.83 | 72.25 |
| 1296.9 | 72 |
| 1296.97 | 71.75 |
| 1297.04 | 71.75 |
| 1297.1 | 71.25 |
| 1297.17 | 71.25 |
| 1297.24 | 71.25 |
| 1297.31 | 71 |
| 1297.38 | 70.75 |
| 1297.44 | 70.5 |
| 1297.51 | 70.25 |
| 1297.58 | 70 |
| 1297.65 | 69.75 |
| 1297.72 | 69.5 |
| 1297.78 | 69.25 |
| 1297.85 | 69 |
| 1297.92 | 68.75 |
| 1297.99 | 68.5 |
| 1298.06 | 68.5 |
| 1298.13 | 68.5 |
| 1298.19 | 68.25 |
| 1298.26 | 68.5 |
| 1298.33 | 68.5 |
| 1298.4 | 68.75 |
| 1298.47 | 68.75 |
| 1298.54 | 68.75 |
| 1298.6 | 69 |
| 1298.67 | 69 |
| 1298.74 | 69 |
| 1298.81 | 69.25 |
| 1298.88 | 69.25 |
| 1298.94 | 69.25 |
| 1299.01 | 69.5 |
| 1299.08 | 69.5 |
| 1299.15 | 69.5 |
| 1299.22 | 69.5 |
| 1299.29 | 69.75 |
| 1299.35 | 69.75 |
| 1299.42 | 69.75 |
| 1299.49 | 69.75 |
| 1299.56 | 70 |
| 1299.63 | 70 |
| 1299.7 | 70 |
| 1299.77 | 70 |
| 1299.83 | 70 |
| 1299.9 | 70 |
| 1299.97 | 70 |
| 1300.04 | 70 |
| 1300.11 | 70 |
| 1300.17 | 70 |
| 1300.24 | 70 |
| 1300.31 | 70 |
| 1300.38 | 70 |
| 1300.45 | 69.75 |
| 1300.52 | 69.75 |
| 1300.58 | 69.75 |
| 1300.65 | 69.75 |
| 1300.72 | 69.75 |
| 1300.79 | 69.5 |
| 1300.86 | 69.5 |
| 1300.93 | 69.5 |
| 1300.99 | 69.5 |
| 1301.06 | 69.25 |
| 1301.13 | 69.25 |
| 1301.2 | 69.25 |
| 1301.27 | 69.25 |
| 1301.34 | 69 |
| 1301.4 | 69 |
| 1301.47 | 69 |
| 1301.54 | 68.75 |
| 1301.61 | 68.75 |
| 1301.68 | 68.75 |
| 1301.75 | 68.75 |
| 1301.81 | 68.75 |
| 1301.88 | 68.5 |
| 1301.95 | 68.5 |
| 1302.02 | 68.5 |
| 1302.09 | 68.5 |
| 1302.16 | 68.25 |
| 1302.22 | 68.25 |
| 1302.29 | 68.25 |
| 1302.36 | 68.25 |
| 1302.43 | 68.25 |
| 1302.5 | 68 |
| 1302.56 | 68 |
| 1302.63 | 67.75 |
| 1302.7 | 67.75 |
| 1302.77 | 67.75 |
| 1302.84 | 67.75 |
| 1302.91 | 67.5 |
| 1302.97 | 67.5 |
| 1303.04 | 67.5 |
| 1303.11 | 67.5 |
| 1303.18 | 67.5 |
| 1303.25 | 67.5 |
| 1303.31 | 67.25 |
| 1303.38 | 67.5 |
| 1303.45 | 67.75 |
| 1303.52 | 68 |
| 1303.59 | 68.25 |
| 1303.66 | 68.75 |
| 1303.72 | 69.5 |
| 1303.79 | 69.75 |
| 1303.86 | 70.25 |
| 1303.93 | 70.25 |
| 1304.0 | 70.75 |
| 1304.07 | 71 |
| 1304.13 | 71.25 |
| 1304.2 | 71.75 |
| 1304.27 | 72 |
| 1304.34 | 72.5 |
| 1304.41 | 72.75 |
| 1304.47 | 73 |
| 1304.54 | 73.5 |
| 1304.61 | 73.75 |
| 1304.68 | 74 |
| 1304.75 | 74 |
| 1304.82 | 74.5 |
| 1304.88 | 74.75 |
| 1304.95 | 75 |
| 1305.02 | 75.5 |
| 1305.09 | 75.75 |
| 1305.16 | 76 |
| 1305.22 | 76.5 |
| 1305.29 | 76.75 |
| 1305.36 | 77 |
| 1305.43 | 77.25 |
| 1305.5 | 77.5 |
| 1305.57 | 77.5 |
| 1305.63 | 78 |
| 1305.7 | 78.25 |
| 1305.77 | 78.5 |
| 1305.84 | 79 |
| 1305.91 | 79.25 |
| 1305.97 | 79.5 |
| 1306.04 | 79.75 |
| 1306.11 | 80 |
| 1306.18 | 80.5 |
| 1306.25 | 80.75 |
| 1306.32 | 81 |
| 1306.39 | 81 |
| 1306.45 | 81.25 |
| 1306.52 | 81.5 |
| 1306.59 | 81.75 |
| 1306.66 | 82 |
| 1306.73 | 82.25 |
| 1306.8 | 82.5 |
| 1306.86 | 82.75 |
| 1306.93 | 83 |
| 1307.0 | 83.25 |
| 1307.07 | 83.5 |
| 1307.14 | 83.75 |
| 1307.2 | 83.75 |
| 1307.27 | 84.25 |
| 1307.34 | 84.5 |
| 1307.41 | 84.75 |
| 1307.48 | 85 |
| 1307.55 | 85.25 |
| 1307.61 | 85.25 |
| 1307.68 | 85.5 |
| 1307.75 | 85.75 |
| 1307.82 | 86 |
| 1307.89 | 86.25 |
| 1307.95 | 86.5 |
| 1308.02 | 86.5 |
| 1308.09 | 86.75 |
| 1308.16 | 87 |
| 1308.23 | 87.25 |
| 1308.3 | 87.5 |
| 1308.36 | 87.5 |
| 1308.43 | 88 |
| 1308.5 | 88.25 |
| 1308.57 | 88.25 |
| 1308.64 | 88.5 |
| 1308.7 | 88.75 |
| 1308.77 | 89 |
| 1308.84 | 89 |
| 1308.91 | 89.25 |
| 1308.98 | 89.5 |
| 1309.05 | 89.5 |
| 1309.11 | 89.75 |
| 1309.18 | 90 |
| 1309.25 | 90.25 |
| 1309.32 | 90.5 |
| 1309.39 | 90.75 |
| 1309.45 | 91 |
| 1309.52 | 91 |
| 1309.59 | 91.25 |
| 1309.66 | 91.25 |
| 1309.73 | 91.5 |
| 1309.8 | 91.75 |
| 1309.86 | 91.75 |
| 1309.93 | 92 |
| 1310.0 | 92.25 |
| 1310.07 | 92.5 |
| 1310.14 | 92.75 |
| 1310.2 | 93 |
| 1310.27 | 93 |
| 1310.34 | 93.25 |
| 1310.41 | 93.5 |
| 1310.48 | 93.5 |
| 1310.55 | 93.5 |
| 1310.61 | 93.75 |
| 1310.68 | 94 |
| 1310.75 | 94.25 |
| 1310.82 | 94.25 |
| 1310.89 | 94.5 |
| 1310.96 | 94.5 |
| 1311.02 | 94.75 |
| 1311.09 | 95 |
| 1311.16 | 95.25 |
| 1311.23 | 95.5 |
| 1311.3 | 95.75 |
| 1311.37 | 95.75 |
| 1311.43 | 95.75 |
| 1311.5 | 96 |
| 1311.57 | 96 |
| 1311.64 | 96.25 |
| 1311.71 | 96.5 |
| 1311.77 | 96.5 |
| 1311.84 | 96.75 |
| 1311.91 | 97 |
| 1311.98 | 97 |
| 1312.05 | 97.25 |
| 1312.11 | 97.5 |
| 1312.18 | 97.5 |
| 1312.25 | 97.5 |
| 1312.32 | 97.75 |
| 1312.39 | 98 |
| 1312.46 | 98 |
| 1312.53 | 98.25 |
| 1312.59 | 98.25 |
| 1312.66 | 98.5 |
| 1312.73 | 98.75 |
| 1312.8 | 98.75 |
| 1312.87 | 99 |
| 1312.93 | 99.25 |
| 1313.0 | 99.25 |
| 1313.07 | 99.5 |
| 1313.14 | 99.5 |
| 1313.21 | 99.75 |
| 1313.28 | 99.75 |
| 1313.34 | 100 |
| 1313.41 | 100 |
| 1313.48 | 100.25 |
| 1313.55 | 100.25 |
| 1313.62 | 100.5 |
| 1313.69 | 100.5 |
| 1313.75 | 100.5 |
| 1313.82 | 100.5 |
| 1313.89 | 100.75 |
| 1313.96 | 100.75 |
| 1314.03 | 101 |
| 1314.1 | 101 |
| 1314.16 | 101 |
| 1314.23 | 101 |
| 1314.3 | 101.25 |
| 1314.37 | 101.25 |
| 1314.44 | 101.25 |
| 1314.51 | 101.25 |
| 1314.57 | 101.25 |
| 1314.64 | 101.25 |
| 1314.71 | 101.25 |
| 1314.78 | 101.25 |
| 1314.85 | 101.25 |
| 1314.92 | 101.25 |
| 1314.98 | 101 |
| 1315.05 | 101 |
| 1315.12 | 100.75 |
| 1315.19 | 100.25 |
| 1315.26 | 100 |
| 1315.32 | 99.75 |
| 1315.39 | 99.5 |
| 1315.46 | 99.25 |
| 1315.53 | 99.25 |
| 1315.6 | 98.75 |
| 1315.67 | 98.25 |
| 1315.73 | 97.75 |
| 1315.8 | 97.25 |
| 1315.87 | 96.75 |
| 1315.94 | 96.25 |
| 1316.01 | 95.75 |
| 1316.07 | 95.25 |
| 1316.14 | 94.5 |
| 1316.21 | 94 |
| 1316.28 | 93.5 |
| 1316.35 | 93.5 |
| 1316.42 | 92.75 |
| 1316.48 | 92.25 |
| 1316.55 | 91.75 |
| 1316.62 | 91.25 |
| 1316.69 | 90.75 |
| 1316.76 | 90.25 |
| 1316.82 | 89.75 |
| 1316.89 | 89.25 |
| 1316.96 | 88.75 |
| 1317.03 | 88 |
| 1317.1 | 88 |
| 1317.17 | 87.5 |
| 1317.23 | 87 |
| 1317.3 | 86.75 |
| 1317.37 | 86.25 |
| 1317.44 | 85.75 |
| 1317.51 | 85.25 |
| 1317.57 | 84.75 |
| 1317.64 | 84.5 |
| 1317.71 | 84 |
| 1317.78 | 83.5 |
| 1317.85 | 83.25 |
| 1317.92 | 83.25 |
| 1317.98 | 82.75 |
| 1318.05 | 82.5 |
| 1318.12 | 82 |
| 1318.19 | 81.5 |
| 1318.26 | 81.25 |
| 1318.32 | 81 |
| 1318.39 | 80.5 |
| 1318.46 | 80.25 |
| 1318.53 | 79.75 |
| 1318.6 | 79.5 |
| 1318.67 | 79 |
| 1318.73 | 79 |
| 1318.8 | 78.75 |
| 1318.87 | 78.5 |
| 1318.94 | 78.25 |
| 1319.01 | 77.75 |
| 1319.07 | 77.5 |
| 1319.14 | 77.25 |
| 1319.21 | 77 |
| 1319.28 | 76.5 |
| 1319.35 | 76.25 |
| 1319.42 | 76 |
| 1319.48 | 75.75 |
| 1319.55 | 75.75 |
| 1319.62 | 75.5 |
| 1319.69 | 75 |
| 1319.76 | 75 |
| 1319.82 | 74.5 |
| 1319.89 | 74.25 |
| 1319.96 | 74 |
| 1320.03 | 73.75 |
| 1320.1 | 73.5 |
| 1320.17 | 73.25 |
| 1320.23 | 73 |
| 1320.3 | 72.75 |
| 1320.37 | 72.75 |
| 1320.44 | 72.5 |
| 1320.51 | 72.25 |
| 1320.57 | 72 |
| 1320.64 | 71.75 |
| 1320.71 | 71.5 |
| 1320.78 | 71.25 |
| 1320.85 | 71 |
| 1320.92 | 70.75 |
| 1320.98 | 70.5 |
| 1321.05 | 70.25 |
| 1321.12 | 70 |
| 1321.19 | 70 |
| 1321.26 | 69.75 |
| 1321.32 | 69.5 |
| 1321.39 | 69.25 |
| 1321.46 | 69 |
| 1321.53 | 69 |
| 1321.6 | 68.75 |
| 1321.67 | 68.5 |
| 1321.73 | 68.25 |
| 1321.8 | 68 |
| 1321.87 | 68.25 |
| 1321.94 | 68.25 |
| 1322.01 | 68.25 |
| 1322.07 | 68.5 |
| 1322.14 | 68.5 |
| 1322.21 | 68.5 |
| 1322.28 | 68.75 |
| 1322.35 | 68.75 |
| 1322.42 | 68.75 |
| 1322.48 | 68.75 |
| 1322.55 | 69 |
| 1322.62 | 69 |
| 1322.69 | 69.25 |
| 1322.76 | 69.25 |
| 1322.83 | 69.5 |
| 1322.89 | 69.5 |
| 1322.96 | 69.5 |
| 1323.03 | 69.5 |
| 1323.1 | 69.5 |
| 1323.17 | 69.75 |
| 1323.24 | 69.75 |
| 1323.3 | 69.75 |
| 1323.37 | 69.75 |
| 1323.44 | 70 |
| 1323.51 | 69.75 |
| 1323.58 | 70 |
| 1323.65 | 70 |
| 1323.71 | 70 |
| 1323.78 | 70 |
| 1323.85 | 70 |
| 1323.92 | 70 |
| 1323.99 | 70 |
| 1324.06 | 70 |
| 1324.12 | 70 |
| 1324.19 | 70 |
| 1324.26 | 69.75 |
| 1324.33 | 69.75 |
| 1324.4 | 69.75 |
| 1324.47 | 69.5 |
| 1324.53 | 69.5 |
| 1324.6 | 69.5 |
| 1324.67 | 69.5 |
| 1324.74 | 69.5 |
| 1324.81 | 69.25 |
| 1324.88 | 69.25 |
| 1324.94 | 69.25 |
| 1325.01 | 69.25 |
| 1325.08 | 69 |
| 1325.15 | 69 |
| 1325.22 | 69 |
| 1325.29 | 68.75 |
| 1325.35 | 68.75 |
| 1325.42 | 68.75 |
| 1325.49 | 68.75 |
| 1325.56 | 68.75 |
| 1325.63 | 68.5 |
| 1325.69 | 68.5 |
| 1325.76 | 68.5 |
| 1325.83 | 68.5 |
| 1325.9 | 68.25 |
| 1325.97 | 68.25 |
| 1326.04 | 68 |
| 1326.1 | 68 |
| 1326.17 | 68 |
| 1326.24 | 68 |
| 1326.31 | 68 |
| 1326.38 | 68 |
| 1326.45 | 67.75 |
| 1326.51 | 67.75 |
| 1326.58 | 67.75 |
| 1326.65 | 67.5 |
| 1326.72 | 67.5 |
| 1326.79 | 67.5 |
| 1326.86 | 67.25 |
| 1326.92 | 67.25 |
| 1326.99 | 67.25 |
| 1327.06 | 67.25 |
| 1327.13 | 67.5 |
| 1327.2 | 67.5 |
| 1327.26 | 67.75 |
| 1327.33 | 68 |
| 1327.4 | 68.5 |
| 1327.47 | 69 |
| 1327.54 | 69.5 |
| 1327.61 | 70 |
| 1327.67 | 70.5 |
| 1327.74 | 70.75 |
| 1327.81 | 71.25 |
| 1327.88 | 71.25 |
| 1327.95 | 71.5 |
| 1328.02 | 71.75 |
| 1328.08 | 72.25 |
| 1328.15 | 72.5 |
| 1328.22 | 72.75 |
| 1328.29 | 73.25 |
| 1328.36 | 73.5 |
| 1328.42 | 74 |
| 1328.49 | 74.25 |
| 1328.56 | 74.5 |
| 1328.63 | 75 |
| 1328.7 | 75 |
| 1328.77 | 75.25 |
| 1328.83 | 75.5 |
| 1328.9 | 76 |
| 1328.97 | 76.25 |
| 1329.04 | 76.75 |
| 1329.11 | 77 |
| 1329.18 | 77.25 |
| 1329.24 | 77.5 |
| 1329.31 | 77.75 |
| 1329.38 | 78 |
| 1329.45 | 78.5 |
| 1329.52 | 78.5 |
| 1329.58 | 78.75 |
| 1329.65 | 79.25 |
| 1329.72 | 79.5 |
| 1329.79 | 79.75 |
| 1329.86 | 80 |
| 1329.93 | 80.25 |
| 1329.99 | 80.5 |
| 1330.06 | 80.75 |
| 1330.13 | 81 |
| 1330.2 | 81.5 |
| 1330.27 | 81.75 |
| 1330.33 | 81.75 |
| 1330.4 | 81.75 |
| 1330.47 | 82 |
| 1330.54 | 82.25 |
| 1330.61 | 82.5 |
| 1330.68 | 83 |
| 1330.74 | 83 |
| 1330.81 | 83.25 |
| 1330.88 | 83.5 |
| 1330.95 | 83.75 |
| 1331.02 | 84 |
| 1331.08 | 84.25 |
| 1331.15 | 84.25 |
| 1331.22 | 84.5 |
| 1331.29 | 84.75 |
| 1331.36 | 84.75 |
| 1331.43 | 85 |
| 1331.49 | 85.25 |
| 1331.56 | 85.25 |
| 1331.63 | 85.5 |
| 1331.7 | 85.75 |
| 1331.77 | 86 |
| 1331.83 | 86.25 |
| 1331.9 | 86.5 |
| 1331.97 | 86.5 |
| 1332.04 | 86.75 |
| 1332.11 | 87 |
| 1332.18 | 87.25 |
| 1332.25 | 87.5 |
| 1332.31 | 87.5 |
| 1332.38 | 87.75 |
| 1332.45 | 88 |
| 1332.52 | 88.25 |
| 1332.59 | 88.5 |
| 1332.66 | 88.75 |
| 1332.72 | 88.75 |
| 1332.79 | 88.75 |
| 1332.86 | 89 |
| 1332.93 | 89.25 |
| 1333.0 | 89.5 |
| 1333.06 | 89.75 |
| 1333.13 | 90 |
| 1333.2 | 90.25 |
| 1333.27 | 90.25 |
| 1333.34 | 90.5 |
| 1333.41 | 90.75 |
| 1333.47 | 91 |
| 1333.54 | 91 |
| 1333.61 | 91.25 |
| 1333.68 | 91.25 |
| 1333.75 | 91.5 |
| 1333.81 | 91.75 |
| 1333.88 | 91.75 |
| 1333.95 | 92 |
| 1334.02 | 92.25 |
| 1334.09 | 92.5 |
| 1334.16 | 92.5 |
| 1334.22 | 92.75 |
| 1334.29 | 93 |
| 1334.36 | 93.25 |
| 1334.43 | 93.25 |
| 1334.5 | 93.25 |
| 1334.56 | 93.5 |
| 1334.63 | 93.5 |
| 1334.7 | 93.75 |
| 1334.77 | 94 |
| 1334.84 | 94 |
| 1334.91 | 94.25 |
| 1334.97 | 94.5 |
| 1335.04 | 94.75 |
| 1335.11 | 94.75 |
| 1335.18 | 95 |
| 1335.25 | 95.25 |
| 1335.32 | 95.25 |
| 1335.38 | 95.5 |
| 1335.45 | 95.5 |
| 1335.52 | 95.75 |
| 1335.59 | 96 |
| 1335.66 | 96 |
| 1335.72 | 96.25 |
| 1335.79 | 96.5 |
| 1335.86 | 96.5 |
| 1335.93 | 96.75 |
| 1336.0 | 96.75 |
| 1336.07 | 97 |
| 1336.13 | 97 |
| 1336.2 | 97.25 |
| 1336.27 | 97.25 |
| 1336.34 | 97.5 |
| 1336.41 | 97.75 |
| 1336.47 | 97.75 |
| 1336.54 | 98 |
| 1336.61 | 98.25 |
| 1336.68 | 98.25 |
| 1336.75 | 98.25 |
| 1336.82 | 98.5 |
| 1336.89 | 98.75 |
| 1336.95 | 98.75 |
| 1337.02 | 99 |
| 1337.09 | 99 |
| 1337.16 | 99 |
| 1337.23 | 99.5 |
| 1337.29 | 99.5 |
| 1337.36 | 99.75 |
| 1337.43 | 100 |
| 1337.5 | 100 |
| 1337.57 | 100 |
| 1337.64 | 100.25 |
| 1337.7 | 100.25 |
| 1337.77 | 100.25 |
| 1337.84 | 100.5 |
| 1337.91 | 100.5 |
| 1337.98 | 100.75 |
| 1338.05 | 100.75 |
| 1338.11 | 100.75 |
| 1338.18 | 101 |
| 1338.25 | 101 |
| 1338.32 | 101.25 |
| 1338.39 | 101.25 |
| 1338.46 | 101.25 |
| 1338.52 | 101.25 |
| 1338.59 | 101.25 |
| 1338.66 | 101.25 |
| 1338.73 | 101.25 |
| 1338.8 | 101.5 |
| 1338.87 | 101.5 |
| 1338.94 | 101.5 |
| 1339.0 | 101.25 |
| 1339.07 | 101.25 |
| 1339.14 | 101.25 |
| 1339.21 | 101.25 |
| 1339.28 | 101.25 |
| 1339.34 | 100.75 |
| 1339.41 | 100.25 |
| 1339.48 | 100.25 |
| 1339.55 | 100 |
| 1339.62 | 99.75 |
| 1339.69 | 99.5 |
| 1339.75 | 99 |
| 1339.82 | 98.75 |
| 1339.89 | 98 |
| 1339.96 | 97.75 |
| 1340.03 | 97.25 |
| 1340.09 | 96.5 |
| 1340.16 | 96.25 |
| 1340.23 | 95.75 |
| 1340.3 | 95.75 |
| 1340.37 | 95 |
| 1340.44 | 94.5 |
| 1340.5 | 93.75 |
| 1340.57 | 93.25 |
| 1340.64 | 92.75 |
| 1340.71 | 92.25 |
| 1340.78 | 91.75 |
| 1340.84 | 91 |
| 1340.91 | 90.5 |
| 1340.98 | 90 |
| 1341.05 | 89.5 |
| 1341.12 | 89.5 |
| 1341.19 | 89 |
| 1341.25 | 88.5 |
| 1341.32 | 88 |
| 1341.39 | 87.5 |
| 1341.46 | 87 |
| 1341.53 | 86.5 |
| 1341.59 | 86 |
| 1341.66 | 85.5 |
| 1341.73 | 85.25 |
| 1341.8 | 84.75 |
| 1341.87 | 84.25 |
| 1341.94 | 84.25 |
| 1342.0 | 84 |
| 1342.07 | 83.5 |
| 1342.14 | 83 |
| 1342.21 | 82.75 |
| 1342.28 | 82.25 |
| 1342.34 | 82 |
| 1342.41 | 81.5 |
| 1342.48 | 81.25 |
| 1342.55 | 80.75 |
| 1342.62 | 80.5 |
| 1342.69 | 80 |
| 1342.75 | 80 |
| 1342.82 | 79.75 |
| 1342.89 | 79.5 |
| 1342.96 | 79 |
| 1343.03 | 78.75 |
| 1343.09 | 78.5 |
| 1343.16 | 78 |
| 1343.23 | 77.75 |
| 1343.3 | 77.5 |
| 1343.37 | 77 |
| 1343.43 | 76.75 |
| 1343.5 | 76.5 |
| 1343.57 | 76.5 |
| 1343.64 | 76.25 |
| 1343.71 | 76 |
| 1343.78 | 75.5 |
| 1343.84 | 75.25 |
| 1343.91 | 75.25 |
| 1343.98 | 74.75 |
| 1344.05 | 74.5 |
| 1344.12 | 74.25 |
| 1344.19 | 74 |
| 1344.25 | 73.75 |
| 1344.32 | 73.5 |
| 1344.39 | 73.5 |
| 1344.46 | 73.25 |
| 1344.53 | 73 |
| 1344.59 | 72.5 |
| 1344.66 | 72.25 |
| 1344.73 | 72.25 |
| 1344.8 | 72 |
| 1344.87 | 71.5 |
| 1344.93 | 71.5 |
| 1345.0 | 71.25 |
| 1345.07 | 71 |
| 1345.14 | 70.75 |
| 1345.21 | 70.75 |
| 1345.28 | 70.5 |
| 1345.34 | 70.25 |
| 1345.41 | 70 |
| 1345.48 | 69.75 |
| 1345.55 | 69.5 |
| 1345.62 | 69.5 |
| 1345.68 | 69.25 |
| 1345.75 | 69 |
| 1345.82 | 68.75 |
| 1345.89 | 68.5 |
| 1345.96 | 68.25 |
| 1346.03 | 68.25 |
| 1346.09 | 68 |
| 1346.16 | 68.25 |
| 1346.23 | 68.5 |
| 1346.3 | 68.5 |
| 1346.37 | 68.5 |
| 1346.44 | 68.75 |
| 1346.5 | 68.75 |
| 1346.57 | 68.75 |
| 1346.64 | 68.75 |
| 1346.71 | 68.75 |
| 1346.78 | 69 |
| 1346.84 | 69 |
| 1346.91 | 69 |
| 1346.98 | 69.25 |
| 1347.05 | 69.25 |
| 1347.12 | 69.5 |
| 1347.19 | 69.5 |
| 1347.26 | 69.5 |
| 1347.32 | 69.5 |
| 1347.39 | 69.5 |
| 1347.46 | 69.75 |
| 1347.53 | 69.75 |
| 1347.6 | 69.75 |
| 1347.66 | 69.75 |
| 1347.73 | 69.75 |
| 1347.8 | 69.75 |
| 1347.87 | 70 |
| 1347.94 | 70 |
| 1348.01 | 70 |
| 1348.07 | 70 |
| 1348.14 | 70 |
| 1348.21 | 69.75 |
| 1348.28 | 70 |
| 1348.35 | 69.75 |
| 1348.42 | 69.75 |
| 1348.48 | 69.75 |
| 1348.55 | 69.75 |
| 1348.62 | 69.75 |
| 1348.69 | 69.5 |
| 1348.76 | 69.5 |
| 1348.83 | 69.5 |
| 1348.89 | 69.5 |
| 1348.96 | 69.5 |
| 1349.03 | 69.25 |
| 1349.1 | 69.25 |
| 1349.17 | 69.25 |
| 1349.23 | 69 |
| 1349.3 | 69 |
| 1349.37 | 69 |
| 1349.44 | 69 |
| 1349.51 | 68.75 |
| 1349.58 | 68.75 |
| 1349.65 | 68.75 |
| 1349.71 | 68.75 |
| 1349.78 | 68.75 |
| 1349.85 | 68.5 |
| 1349.92 | 68.5 |
| 1349.99 | 68.5 |
| 1350.06 | 68.25 |
| 1350.12 | 68.25 |
| 1350.19 | 68.25 |
| 1350.26 | 68.25 |
| 1350.33 | 68.25 |
| 1350.4 | 68 |
| 1350.46 | 68 |
| 1350.53 | 68 |
| 1350.6 | 68 |
| 1350.67 | 67.75 |
| 1350.74 | 67.75 |
| 1350.81 | 67.75 |
| 1350.88 | 67.5 |
| 1350.94 | 67.5 |
| 1351.01 | 67.5 |
| 1351.08 | 67.5 |
| 1351.15 | 67.5 |
| 1351.22 | 67.25 |
| 1351.28 | 67.5 |
| 1351.35 | 67.75 |
| 1351.42 | 68 |
| 1351.49 | 68.5 |
| 1351.56 | 69 |
| 1351.63 | 69.25 |
| 1351.69 | 69.75 |
| 1351.76 | 70.25 |
| 1351.83 | 70.25 |
| 1351.9 | 70.75 |
| 1351.97 | 71 |
| 1352.04 | 71.5 |
| 1352.1 | 71.75 |
| 1352.17 | 72 |
| 1352.24 | 72.5 |
| 1352.31 | 73 |
| 1352.38 | 73.25 |
| 1352.44 | 73.5 |
| 1352.51 | 74 |
| 1352.58 | 74.25 |
| 1352.65 | 74.25 |
| 1352.72 | 74.5 |
| 1352.78 | 75 |
| 1352.85 | 75.25 |
| 1352.92 | 75.5 |
| 1352.99 | 76 |
| 1353.06 | 76.25 |
| 1353.13 | 76.75 |
| 1353.19 | 77 |
| 1353.26 | 77.25 |
| 1353.33 | 77.5 |
| 1353.4 | 77.75 |
| 1353.47 | 77.75 |
| 1353.54 | 78.25 |
| 1353.6 | 78.5 |
| 1353.67 | 78.75 |
| 1353.74 | 79.25 |
| 1353.81 | 79.5 |
| 1353.88 | 79.75 |
| 1353.94 | 80 |
| 1354.01 | 80.25 |
| 1354.08 | 80.75 |
| 1354.15 | 81 |
| 1354.22 | 81.25 |
| 1354.29 | 81.25 |
| 1354.35 | 81.5 |
| 1354.42 | 81.75 |
| 1354.49 | 82 |
| 1354.56 | 82.25 |
| 1354.63 | 82.5 |
| 1354.69 | 83 |
| 1354.76 | 83 |
| 1354.83 | 83.5 |
| 1354.9 | 83.75 |
| 1354.97 | 84 |
| 1355.04 | 84.25 |
| 1355.1 | 84.25 |
| 1355.17 | 84.5 |
| 1355.24 | 84.5 |
| 1355.31 | 85 |
| 1355.38 | 85.25 |
| 1355.45 | 85.25 |
| 1355.51 | 85.75 |
| 1355.58 | 85.75 |
| 1355.65 | 86 |
| 1355.72 | 86.25 |
| 1355.79 | 86.75 |
| 1355.85 | 86.75 |
| 1355.92 | 87 |
| 1355.99 | 87 |
| 1356.06 | 87.25 |
| 1356.13 | 87.5 |
| 1356.2 | 87.75 |
| 1356.26 | 87.75 |
| 1356.33 | 88.25 |
| 1356.4 | 88.25 |
| 1356.47 | 88.5 |
| 1356.54 | 88.75 |
| 1356.6 | 89 |
| 1356.67 | 89.25 |
| 1356.74 | 89.5 |
| 1356.81 | 89.5 |
| 1356.88 | 89.5 |
| 1356.95 | 89.75 |
| 1357.02 | 90 |
| 1357.08 | 90.25 |
| 1357.15 | 90.5 |
| 1357.22 | 90.75 |
| 1357.29 | 90.75 |
| 1357.36 | 91 |
| 1357.42 | 91.25 |
| 1357.49 | 91.5 |
| 1357.56 | 91.75 |
| 1357.63 | 91.75 |
| 1357.7 | 91.75 |
| 1357.77 | 92 |
| 1357.83 | 92.25 |
| 1357.9 | 92.5 |
| 1357.97 | 92.75 |
| 1358.04 | 92.75 |
| 1358.11 | 93 |
| 1358.18 | 93.25 |
| 1358.24 | 93.5 |
| 1358.31 | 93.75 |
| 1358.38 | 93.75 |
| 1358.45 | 93.75 |
| 1358.52 | 94 |
| 1358.58 | 94 |
| 1358.65 | 94.25 |
| 1358.72 | 94.5 |
| 1358.79 | 94.75 |
| 1358.86 | 95 |
| 1358.93 | 95 |
| 1358.99 | 95.25 |
| 1359.06 | 95.5 |
| 1359.13 | 95.75 |
| 1359.2 | 95.75 |
| 1359.27 | 95.75 |
| 1359.33 | 96 |
| 1359.4 | 96.25 |
| 1359.47 | 96.25 |
| 1359.54 | 96.5 |
| 1359.61 | 96.75 |
| 1359.68 | 96.75 |
| 1359.74 | 97 |
| 1359.81 | 97.25 |
| 1359.88 | 97.25 |
| 1359.95 | 97.5 |
| 1360.02 | 97.75 |
| 1360.08 | 97.75 |
| 1360.15 | 98 |
| 1360.22 | 98 |
| 1360.29 | 98.25 |
| 1360.36 | 98.25 |
| 1360.43 | 98.5 |
| 1360.49 | 98.75 |
| 1360.56 | 98.75 |
| 1360.63 | 99 |
| 1360.7 | 99.25 |
| 1360.77 | 99.25 |
| 1360.83 | 99.5 |
| 1360.9 | 99.5 |
| 1360.97 | 99.75 |
| 1361.04 | 99.75 |
| 1361.11 | 100 |
| 1361.18 | 100 |
| 1361.25 | 100 |
| 1361.31 | 100.25 |
| 1361.38 | 100.5 |
| 1361.45 | 100.5 |
| 1361.52 | 100.5 |
| 1361.59 | 100.75 |
| 1361.66 | 100.75 |
| 1361.72 | 100.75 |
| 1361.79 | 101 |
| 1361.86 | 101 |
| 1361.93 | 101 |
| 1362.0 | 101 |
| 1362.07 | 101.25 |
| 1362.13 | 101.25 |
| 1362.2 | 101.25 |
| 1362.27 | 101.25 |
| 1362.34 | 101.25 |
| 1362.41 | 101.25 |
| 1362.48 | 101.25 |
| 1362.54 | 101.25 |
| 1362.61 | 101.25 |
| 1362.68 | 101.25 |
| 1362.75 | 101.25 |
| 1362.82 | 101.25 |
| 1362.89 | 101 |
| 1362.95 | 100.5 |
| 1363.02 | 100.25 |
| 1363.09 | 100 |
| 1363.16 | 99.75 |
| 1363.23 | 99.25 |
| 1363.3 | 98.75 |
| 1363.36 | 98.5 |
| 1363.43 | 98.5 |
| 1363.5 | 98 |
| 1363.57 | 97.5 |
| 1363.64 | 97 |
| 1363.7 | 96.5 |
| 1363.77 | 95.75 |
| 1363.84 | 95.5 |
| 1363.91 | 94.75 |
| 1363.98 | 94.25 |
| 1364.04 | 93.75 |
| 1364.11 | 93 |
| 1364.18 | 92.5 |
| 1364.25 | 92.5 |
| 1364.32 | 92 |
| 1364.39 | 91.25 |
| 1364.45 | 90.75 |
| 1364.52 | 90.25 |
| 1364.59 | 89.75 |
| 1364.66 | 89.25 |
| 1364.73 | 88.75 |
| 1364.79 | 88.25 |
| 1364.86 | 87.75 |
| 1364.93 | 87.25 |
| 1365.0 | 86.75 |
| 1365.07 | 86.75 |
| 1365.14 | 86.25 |
| 1365.2 | 85.75 |
| 1365.27 | 85.25 |
| 1365.34 | 85 |
| 1365.41 | 84.5 |
| 1365.48 | 84 |
| 1365.54 | 83.5 |
| 1365.61 | 83 |
| 1365.68 | 82.75 |
| 1365.75 | 82.5 |
| 1365.82 | 82 |
| 1365.89 | 82 |
| 1365.95 | 81.75 |
| 1366.02 | 81.25 |
| 1366.09 | 81 |
| 1366.16 | 80.5 |
| 1366.23 | 80.25 |
| 1366.29 | 80 |
| 1366.36 | 79.5 |
| 1366.43 | 79.25 |
| 1366.5 | 78.75 |
| 1366.57 | 78.5 |
| 1366.64 | 78.25 |
| 1366.7 | 78.25 |
| 1366.77 | 77.75 |
| 1366.84 | 77.5 |
| 1366.91 | 77.25 |
| 1366.98 | 77 |
| 1367.04 | 76.75 |
| 1367.11 | 76.25 |
| 1367.18 | 76 |
| 1367.25 | 75.75 |
| 1367.32 | 75.25 |
| 1367.39 | 75 |
| 1367.45 | 74.75 |
| 1367.52 | 74.75 |
| 1367.59 | 74.5 |
| 1367.66 | 74.25 |
| 1367.73 | 74 |
| 1367.79 | 73.75 |
| 1367.86 | 73.5 |
| 1367.93 | 73.25 |
| 1368.0 | 73 |
| 1368.07 | 72.75 |
| 1368.14 | 72.5 |
| 1368.2 | 72 |
| 1368.27 | 72 |
| 1368.34 | 72 |
| 1368.41 | 71.5 |
| 1368.48 | 71.25 |
| 1368.54 | 71.25 |
| 1368.61 | 71 |
| 1368.68 | 70.75 |
| 1368.75 | 70.5 |
| 1368.82 | 70.25 |
| 1368.89 | 70 |
| 1368.95 | 69.75 |
| 1369.02 | 69.5 |
| 1369.09 | 69.25 |
| 1369.16 | 69.25 |
| 1369.23 | 69 |
| 1369.29 | 68.75 |
| 1369.36 | 68.75 |
| 1369.43 | 68.5 |
| 1369.5 | 68.25 |
| 1369.57 | 68 |
| 1369.64 | 68 |
| 1369.7 | 68.25 |
| 1369.77 | 68.5 |
| 1369.84 | 68.5 |
| 1369.91 | 68.5 |
| 1369.98 | 68.5 |
| 1370.05 | 68.75 |
| 1370.11 | 68.75 |
| 1370.18 | 68.75 |
| 1370.25 | 69 |
| 1370.32 | 69 |
| 1370.39 | 69.25 |
| 1370.45 | 69.25 |
| 1370.52 | 69.5 |
| 1370.59 | 69.5 |
| 1370.66 | 69.5 |
| 1370.73 | 69.75 |
| 1370.8 | 69.75 |
| 1370.86 | 69.75 |
| 1370.93 | 69.75 |
| 1371.0 | 70 |
| 1371.07 | 69.75 |
| 1371.14 | 70 |
| 1371.21 | 70 |
| 1371.27 | 70 |
| 1371.34 | 70 |
| 1371.41 | 70 |
| 1371.48 | 70.25 |
| 1371.55 | 70.25 |
| 1371.62 | 70.25 |
| 1371.68 | 70 |
| 1371.75 | 70.25 |
| 1371.82 | 70 |
| 1371.89 | 70 |
| 1371.96 | 70 |
| 1372.03 | 69.75 |
| 1372.09 | 70 |
| 1372.16 | 69.75 |
| 1372.23 | 69.75 |
| 1372.3 | 69.5 |
| 1372.37 | 69.5 |
| 1372.44 | 69.5 |
| 1372.5 | 69.5 |
| 1372.57 | 69.5 |
| 1372.64 | 69.25 |
| 1372.71 | 69.25 |
| 1372.78 | 69.25 |
| 1372.84 | 69.25 |
| 1372.91 | 69 |
| 1372.98 | 69 |
| 1373.05 | 68.75 |
| 1373.12 | 68.75 |
| 1373.19 | 68.75 |
| 1373.26 | 68.75 |
| 1373.32 | 68.75 |
| 1373.39 | 68.5 |
| 1373.46 | 68.5 |
| 1373.53 | 68.5 |
| 1373.6 | 68.5 |
| 1373.67 | 68.25 |
| 1373.73 | 68.25 |
| 1373.8 | 68.25 |
| 1373.87 | 68 |
| 1373.94 | 68 |
| 1374.01 | 68 |
| 1374.07 | 67.75 |
| 1374.14 | 67.75 |
| 1374.21 | 67.75 |
| 1374.28 | 67.75 |
| 1374.35 | 67.75 |
| 1374.42 | 67.5 |
| 1374.48 | 67.5 |
| 1374.55 | 67.5 |
| 1374.62 | 67.25 |
| 1374.69 | 67.25 |
| 1374.76 | 67.25 |
| 1374.82 | 67.25 |
| 1374.89 | 67.25 |
| 1374.96 | 67.25 |
| 1375.03 | 67.25 |
| 1375.1 | 67 |
| 1375.17 | 67 |
| 1375.23 | 67 |
| 1375.3 | 67 |
| 1375.37 | 66.75 |
| 1375.44 | 66.75 |
| 1375.51 | 67 |
| 1375.58 | 67 |
| 1375.65 | 67 |
| 1375.71 | 67 |
| 1375.78 | 67 |
| 1375.85 | 67 |
| 1375.92 | 67 |
| 1375.99 | 67 |
| 1376.06 | 67 |
| 1376.12 | 67 |
| 1376.19 | 67 |
| 1376.26 | 67 |
| 1376.33 | 67.25 |
| 1376.4 | 67.25 |
| 1376.46 | 67.25 |
| 1376.53 | 67.25 |
| 1376.6 | 67.25 |
| 1376.67 | 67.25 |
| 1376.74 | 67.25 |
| 1376.81 | 67.5 |
| 1376.87 | 67.5 |
| 1376.94 | 67.5 |
| 1377.01 | 67.75 |
| 1377.08 | 67.75 |
| 1377.15 | 67.75 |
| 1377.22 | 67.75 |
| 1377.28 | 68 |
| 1377.35 | 68 |
| 1377.42 | 68 |
| 1377.49 | 68 |
| 1377.56 | 68.25 |
| 1377.63 | 68.25 |
| 1377.69 | 68.25 |
| 1377.76 | 68.5 |
| 1377.83 | 68.5 |
| 1377.9 | 68.5 |
| 1377.97 | 68.5 |
| 1378.04 | 68.75 |
| 1378.1 | 68.75 |
| 1378.17 | 68.75 |
| 1378.24 | 68.75 |
| 1378.31 | 68.75 |
| 1378.38 | 68.75 |
| 1378.44 | 68.75 |
| 1378.51 | 68.75 |
| 1378.58 | 68.75 |
| 1378.65 | 68.75 |
| 1378.72 | 68.75 |
| 1378.79 | 68.75 |
| 1378.85 | 69 |
| 1378.92 | 68.75 |
| 1378.99 | 68.75 |
| 1379.06 | 69 |
| 1379.13 | 69 |
| 1379.2 | 68.75 |
| 1379.27 | 68.75 |
| 1379.33 | 68.75 |
| 1379.4 | 68.75 |
| 1379.47 | 68.75 |
| 1379.54 | 68.75 |
| 1379.61 | 68.75 |
| 1379.68 | 68.75 |
| 1379.74 | 68.75 |
| 1379.81 | 68.75 |
| 1379.88 | 68.5 |
| 1379.95 | 68.5 |
| 1380.02 | 68.5 |
| 1380.08 | 68.5 |
| 1380.15 | 68.5 |
| 1380.22 | 68.5 |
| 1380.29 | 68.25 |
| 1380.36 | 68.25 |
| 1380.43 | 68.25 |
| 1380.49 | 68.25 |
| 1380.56 | 68 |
| 1380.63 | 68 |
| 1380.7 | 68 |
| 1380.77 | 68 |
| 1380.84 | 68 |
| 1380.9 | 68 |
| 1380.97 | 67.75 |
| 1381.04 | 67.75 |
| 1381.11 | 67.75 |
| 1381.18 | 67.5 |
| 1381.25 | 67.5 |
| 1381.31 | 67.5 |
| 1381.38 | 67.5 |
| 1381.45 | 67.25 |
| 1381.52 | 67.5 |
| 1381.59 | 67.25 |
| 1381.66 | 67.25 |
| 1381.72 | 67.25 |
| 1381.79 | 67.25 |
| 1381.86 | 67.25 |
| 1381.93 | 67.25 |
| 1382.0 | 67.25 |
| 1382.06 | 67.25 |
| 1382.13 | 67.25 |
| 1382.2 | 67.25 |
| 1382.27 | 67.25 |
| 1382.34 | 67.25 |
| 1382.41 | 67.25 |
| 1382.47 | 67.25 |
| 1382.54 | 67.25 |
| 1382.61 | 67.25 |
| 1382.68 | 67.25 |
| 1382.75 | 67.25 |
| 1382.82 | 67.25 |
| 1382.89 | 67.25 |
| 1382.95 | 67.25 |
| 1383.02 | 67.25 |
| 1383.09 | 67.25 |
| 1383.16 | 67.25 |
| 1383.23 | 67.5 |
| 1383.29 | 67.5 |
| 1383.36 | 67.5 |
| 1383.43 | 67.5 |
| 1383.5 | 67.5 |
| 1383.57 | 67.5 |
| 1383.64 | 67.75 |
| 1383.7 | 67.75 |
| 1383.77 | 67.75 |
| 1383.84 | 67.75 |
| 1383.91 | 67.75 |
| 1383.98 | 68 |
| 1384.05 | 68 |
| 1384.11 | 68 |
| 1384.18 | 68 |
| 1384.25 | 68 |
| 1384.32 | 68 |
| 1384.39 | 68.25 |
| 1384.46 | 68.25 |
| 1384.52 | 68.25 |
| 1384.59 | 68.5 |
| 1384.66 | 68.5 |
| 1384.73 | 68.5 |
| 1384.8 | 68.5 |
| 1384.86 | 68.5 |
| 1384.93 | 68.5 |
| 1385.0 | 68.5 |
| 1385.07 | 68.5 |
| 1385.14 | 68.75 |
| 1385.21 | 68.75 |
| 1385.28 | 68.75 |
| 1385.34 | 68.75 |
| 1385.41 | 68.75 |
| 1385.48 | 68.75 |
| 1385.55 | 68.75 |
| 1385.62 | 68.75 |
| 1385.68 | 68.75 |
| 1385.75 | 68.75 |
| 1385.82 | 68.75 |
| 1385.89 | 68.75 |
| 1385.96 | 68.75 |
| 1386.03 | 68.75 |
| 1386.09 | 68.75 |
| 1386.16 | 68.75 |
| 1386.23 | 68.75 |
| 1386.3 | 68.75 |
| 1386.37 | 68.75 |
| 1386.44 | 68.5 |
| 1386.51 | 68.5 |
| 1386.57 | 68.5 |
| 1386.64 | 68.5 |
| 1386.71 | 68.5 |
| 1386.78 | 68.5 |
| 1386.85 | 68.5 |
| 1386.91 | 68.25 |
| 1386.98 | 68.25 |
| 1387.05 | 68.25 |
| 1387.12 | 68.25 |
| 1387.19 | 68 |
| 1387.26 | 68 |
| 1387.32 | 68 |
| 1387.39 | 68 |
| 1387.46 | 68 |
| 1387.53 | 68 |
| 1387.6 | 68 |
| 1387.67 | 67.75 |
| 1387.73 | 67.75 |
| 1387.8 | 67.75 |
| 1387.87 | 67.75 |
| 1387.94 | 67.75 |
| 1388.01 | 67.5 |
| 1388.08 | 67.5 |
| 1388.14 | 67.5 |
| 1388.21 | 67.5 |
| 1388.28 | 67.5 |
| 1388.35 | 67.5 |
| 1388.42 | 67.5 |
| 1388.48 | 67.25 |
| 1388.55 | 67.5 |
| 1388.62 | 67.25 |
| 1388.69 | 67.25 |
| 1388.76 | 67.25 |
| 1388.83 | 67.25 |
| 1388.9 | 67.25 |
| 1388.96 | 67.5 |
| 1389.03 | 67.25 |
| 1389.1 | 67.25 |
| 1389.17 | 67.25 |
| 1389.24 | 67.25 |
| 1389.3 | 67.25 |
| 1389.37 | 67.25 |
| 1389.44 | 67.5 |
| 1389.51 | 67.5 |
| 1389.58 | 67.25 |
| 1389.65 | 67.5 |
| 1389.71 | 67.5 |
| 1389.78 | 67.5 |
| 1389.85 | 67.5 |
| 1389.92 | 67.75 |
| 1389.99 | 67.75 |
| 1390.06 | 67.5 |
| 1390.13 | 67.75 |
| 1390.19 | 67.75 |
| 1390.26 | 67.75 |
| 1390.33 | 67.75 |
| 1390.4 | 67.75 |
| 1390.47 | 68 |
| 1390.53 | 68 |
| 1390.6 | 68 |
| 1390.67 | 68 |
| 1390.74 | 68 |
| 1390.81 | 68 |
| 1390.88 | 68 |
| 1390.94 | 68.25 |
| 1391.01 | 68 |
| 1391.08 | 68.25 |
| 1391.15 | 68.25 |
| 1391.22 | 68.25 |
| 1391.29 | 68.5 |
| 1391.35 | 68.5 |
| 1391.42 | 68.5 |
| 1391.49 | 68.5 |
| 1391.56 | 68.5 |
| 1391.63 | 68.5 |
| 1391.69 | 68.5 |
| 1391.76 | 68.5 |
| 1391.83 | 68.5 |
| 1391.9 | 68.5 |
| 1391.97 | 68.5 |
| 1392.04 | 68.5 |
| 1392.1 | 68.5 |
| 1392.17 | 68.5 |
| 1392.24 | 68.5 |
| 1392.31 | 68.5 |
| 1392.38 | 68.5 |
| 1392.45 | 68.5 |
| 1392.51 | 68.5 |
| 1392.58 | 68.5 |
| 1392.65 | 68.5 |
| 1392.72 | 68.5 |
| 1392.79 | 68.5 |
| 1392.86 | 68.5 |
| 1392.92 | 68.5 |
| 1392.99 | 68.5 |
| 1393.06 | 68.5 |
| 1393.13 | 68.25 |
| 1393.2 | 68.25 |
| 1393.27 | 68.25 |
| 1393.33 | 68.25 |
| 1393.4 | 68.25 |
| 1393.47 | 68.25 |
| 1393.54 | 68.25 |
| 1393.61 | 68.25 |
| 1393.68 | 68 |
| 1393.74 | 68.25 |
| 1393.81 | 68 |
| 1393.88 | 68 |
| 1393.95 | 68 |
| 1394.02 | 68 |
| 1394.08 | 68 |
| 1394.15 | 68 |
| 1394.22 | 68 |
| 1394.29 | 67.75 |
| 1394.36 | 67.75 |
| 1394.43 | 67.75 |
| 1394.49 | 67.75 |
| 1394.56 | 67.75 |
| 1394.63 | 67.75 |
| 1394.7 | 67.75 |
| 1394.77 | 67.75 |
| 1394.84 | 67.5 |
| 1394.9 | 67.5 |
| 1394.97 | 67.5 |
| 1395.04 | 67.5 |
| 1395.11 | 67.5 |
| 1395.18 | 67.5 |
| 1395.25 | 67.5 |
| 1395.31 | 67.5 |
| 1395.38 | 67.5 |
| 1395.45 | 67.5 |
| 1395.52 | 67.5 |
| 1395.59 | 67.5 |
| 1395.66 | 67.5 |
| 1395.72 | 67.5 |
| 1395.79 | 67.5 |
| 1395.86 | 67.5 |
| 1395.93 | 67.5 |
| 1396.0 | 67.5 |
| 1396.06 | 67.5 |
| 1396.13 | 67.5 |
| 1396.2 | 67.75 |
| 1396.27 | 67.5 |
| 1396.34 | 67.75 |
| 1396.41 | 67.75 |
| 1396.47 | 67.75 |
| 1396.54 | 67.75 |
| 1396.61 | 67.75 |
| 1396.68 | 67.75 |
| 1396.75 | 67.75 |
| 1396.82 | 67.75 |
| 1396.89 | 68 |
| 1396.95 | 67.75 |
| 1397.02 | 68 |
| 1397.09 | 68 |
| 1397.16 | 68 |
| 1397.23 | 68 |
| 1397.3 | 68 |
| 1397.36 | 68 |
| 1397.43 | 68 |
| 1397.5 | 68 |
| 1397.57 | 68.25 |
| 1397.64 | 68.25 |
| 1397.7 | 68.25 |
| 1397.77 | 68.25 |
| 1397.84 | 68.25 |
| 1397.91 | 68.25 |
| 1397.98 | 68.25 |
| 1398.05 | 68.25 |
| 1398.11 | 68.25 |
| 1398.18 | 68.25 |
| 1398.25 | 68.5 |
| 1398.32 | 68.5 |
| 1398.39 | 68.25 |
| 1398.45 | 68.5 |
| 1398.52 | 68.5 |
| 1398.59 | 68.5 |
| 1398.66 | 68.25 |
| 1398.73 | 68.5 |
| 1398.8 | 68.5 |
| 1398.86 | 68.5 |
| 1398.93 | 68.5 |
| 1399.0 | 68.5 |
| 1399.07 | 68.5 |
| 1399.14 | 68.5 |
| 1399.21 | 68.5 |
| 1399.28 | 68.5 |
| 1399.34 | 68.25 |
| 1399.41 | 68.25 |
| 1399.48 | 68.25 |
| 1399.55 | 68.25 |
| 1399.62 | 68.25 |
| 1399.69 | 68.25 |
| 1399.75 | 68.25 |
| 1399.82 | 68.25 |
| 1399.89 | 68.25 |
| 1399.96 | 68.25 |
| 1400.03 | 68.25 |
| 1400.09 | 68.25 |
| 1400.16 | 68.25 |
| 1400.23 | 68 |
| 1400.3 | 68 |
| 1400.37 | 68 |
| 1400.44 | 68 |
| 1400.5 | 68 |
| 1400.57 | 68 |
| 1400.64 | 68 |
| 1400.71 | 68 |
| 1400.78 | 68 |
| 1400.84 | 68 |
| 1400.91 | 67.75 |
| 1400.98 | 67.75 |
| 1401.05 | 67.75 |
| 1401.12 | 67.75 |
| 1401.19 | 67.75 |
| 1401.25 | 67.75 |
| 1401.32 | 67.5 |
| 1401.39 | 67.75 |
| 1401.46 | 67.5 |
| 1401.53 | 67.75 |
| 1401.6 | 67.75 |
| 1401.67 | 67.75 |
| 1401.73 | 67.5 |
| 1401.8 | 67.75 |
| 1401.87 | 67.5 |
| 1401.94 | 67.5 |
| 1402.01 | 67.5 |
| 1402.07 | 67.5 |
| 1402.14 | 67.5 |
| 1402.21 | 67.5 |
| 1402.28 | 67.5 |
| 1402.35 | 67.75 |
| 1402.42 | 67.5 |
| 1402.48 | 67.75 |
| 1402.55 | 67.75 |
| 1402.62 | 67.75 |
| 1402.69 | 67.75 |
| 1402.76 | 67.75 |
| 1402.82 | 67.75 |
| 1402.89 | 67.75 |
| 1402.96 | 67.75 |
| 1403.03 | 67.75 |
| 1403.1 | 67.75 |
| 1403.17 | 67.75 |
| 1403.24 | 68 |
| 1403.3 | 67.75 |
| 1403.37 | 67.75 |
| 1403.44 | 68 |
| 1403.51 | 68 |
| 1403.58 | 68 |
| 1403.65 | 68 |
| 1403.71 | 68 |
| 1403.78 | 68 |
| 1403.85 | 68 |
| 1403.92 | 68 |
| 1403.99 | 68 |
| 1404.06 | 68 |
| 1404.12 | 68 |
| 1404.19 | 68 |
| 1404.26 | 68.25 |
| 1404.33 | 68.25 |
| 1404.4 | 68.25 |
| 1404.46 | 68.25 |
| 1404.53 | 68.25 |
| 1404.6 | 68.25 |
| 1404.67 | 68.25 |
| 1404.74 | 68.25 |
| 1404.81 | 68.25 |
| 1404.87 | 68.25 |
| 1404.94 | 68.25 |
| 1405.01 | 68.25 |
| 1405.08 | 68.5 |
| 1405.15 | 68.25 |
| 1405.21 | 68.5 |
| 1405.28 | 68.5 |
| 1405.35 | 68.5 |
| 1405.42 | 68.5 |
| 1405.49 | 68.5 |
| 1405.56 | 68.5 |
| 1405.63 | 68.5 |
| 1405.69 | 68.5 |
| 1405.76 | 68.25 |
| 1405.83 | 68.25 |
| 1405.9 | 68.25 |
| 1405.97 | 68.25 |
| 1406.04 | 68.25 |
| 1406.1 | 68.25 |
| 1406.17 | 68.25 |
| 1406.24 | 68.25 |
| 1406.31 | 68.25 |
| 1406.38 | 68.25 |
| 1406.44 | 68.25 |
| 1406.51 | 68.25 |
| 1406.58 | 68.25 |
| 1406.65 | 68 |
| 1406.72 | 68 |
| 1406.79 | 68 |
| 1406.85 | 68 |
| 1406.92 | 68 |
| 1406.99 | 68 |
| 1407.06 | 68 |
| 1407.13 | 68 |
| 1407.2 | 68 |
| 1407.26 | 68 |
| 1407.33 | 68 |
| 1407.4 | 68 |
| 1407.47 | 67.75 |
| 1407.54 | 67.75 |
| 1407.6 | 67.75 |
| 1407.67 | 67.75 |
| 1407.74 | 67.75 |
| 1407.81 | 67.75 |
| 1407.88 | 67.75 |
| 1407.95 | 67.75 |
| 1408.02 | 67.75 |
| 1408.08 | 67.75 |
| 1408.15 | 67.75 |
| 1408.22 | 67.75 |
| 1408.29 | 67.75 |
| 1408.36 | 67.75 |
| 1408.43 | 67.75 |
| 1408.49 | 67.75 |
| 1408.56 | 67.75 |
| 1408.63 | 67.75 |
| 1408.7 | 67.75 |
| 1408.77 | 67.75 |
| 1408.83 | 67.75 |
| 1408.9 | 67.5 |
| 1408.97 | 67.75 |
| 1409.04 | 67.75 |
| 1409.11 | 67.5 |
| 1409.18 | 67.5 |
| 1409.25 | 67.75 |
| 1409.31 | 67.75 |
| 1409.38 | 67.75 |
| 1409.45 | 67.75 |
| 1409.52 | 67.75 |
| 1409.59 | 67.75 |
| 1409.65 | 67.75 |
| 1409.72 | 67.75 |
| 1409.79 | 67.75 |
| 1409.86 | 67.75 |
| 1409.93 | 67.75 |
| 1410.0 | 67.75 |
| 1410.06 | 68 |
| 1410.13 | 68 |
| 1410.2 | 68 |
| 1410.27 | 68 |
| 1410.34 | 68 |
| 1410.41 | 68 |
| 1410.47 | 68 |
| 1410.54 | 68 |
| 1410.61 | 68.25 |
| 1410.68 | 68.25 |
| 1410.75 | 68 |
| 1410.82 | 68.25 |
| 1410.88 | 68.25 |
| 1410.95 | 68.25 |
| 1411.02 | 68.25 |
| 1411.09 | 68.25 |
| 1411.16 | 68.25 |
| 1411.22 | 68.25 |
| 1411.29 | 68.25 |
| 1411.36 | 68.25 |
| 1411.43 | 68.25 |
| 1411.5 | 68.25 |
| 1411.57 | 68.25 |
| 1411.64 | 68.25 |
| 1411.7 | 68.25 |
| 1411.77 | 68.5 |
| 1411.84 | 68.25 |
| 1411.91 | 68.25 |
| 1411.98 | 68.25 |
| 1412.04 | 68.25 |
| 1412.11 | 68.25 |
| 1412.18 | 68.25 |
| 1412.25 | 68.25 |
| 1412.32 | 68.25 |
| 1412.39 | 68.25 |
| 1412.45 | 68.25 |
| 1412.52 | 68.25 |
| 1412.59 | 68.25 |
| 1412.66 | 68.25 |
| 1412.73 | 68.25 |
| 1412.8 | 68.25 |
| 1412.86 | 68.25 |
| 1412.93 | 68.25 |
| 1413.0 | 68.25 |
| 1413.07 | 68 |
| 1413.14 | 68 |
| 1413.21 | 68.25 |
| 1413.27 | 68.25 |
| 1413.34 | 68.25 |
| 1413.41 | 68 |
| 1413.48 | 68 |
| 1413.55 | 68 |
| 1413.61 | 68 |
| 1413.68 | 68 |
| 1413.75 | 68 |
| 1413.82 | 68 |
| 1413.89 | 68 |
| 1413.96 | 68 |
| 1414.03 | 68 |
| 1414.09 | 68 |
| 1414.16 | 68 |
| 1414.23 | 67.75 |
| 1414.3 | 68 |
| 1414.37 | 67.75 |
| 1414.43 | 68 |
| 1414.5 | 67.75 |
| 1414.57 | 67.75 |
| 1414.64 | 67.75 |
| 1414.71 | 67.75 |
| 1414.78 | 67.75 |
| 1414.84 | 67.75 |
| 1414.91 | 67.75 |
| 1414.98 | 67.75 |
| 1415.05 | 67.75 |
| 1415.12 | 67.75 |
| 1415.19 | 67.75 |
| 1415.25 | 67.75 |
| 1415.32 | 67.75 |
| 1415.39 | 67.75 |
| 1415.46 | 67.75 |
| 1415.53 | 67.75 |
| 1415.6 | 67.75 |
| 1415.66 | 67.75 |
| 1415.73 | 67.75 |
| 1415.8 | 67.75 |
| 1415.87 | 67.75 |
| 1415.94 | 67.75 |
| 1416.01 | 67.75 |
| 1416.07 | 67.75 |
| 1416.14 | 68 |
| 1416.21 | 68 |
| 1416.28 | 67.75 |
| 1416.35 | 67.75 |
| 1416.42 | 68 |
| 1416.48 | 68 |
| 1416.55 | 68 |
| 1416.62 | 68 |
| 1416.69 | 68 |
| 1416.76 | 68 |
| 1416.82 | 68 |
| 1416.89 | 68 |
| 1416.96 | 68 |
| 1417.03 | 68.25 |
| 1417.1 | 68 |
| 1417.17 | 68 |
| 1417.23 | 68.25 |
| 1417.3 | 68.25 |
| 1417.37 | 68 |
| 1417.44 | 68 |
| 1417.51 | 68 |
| 1417.57 | 68.25 |
| 1417.64 | 68.25 |
| 1417.71 | 68 |
| 1417.78 | 68.25 |
| 1417.85 | 68.25 |
| 1417.92 | 68.25 |
| 1417.98 | 68.25 |
| 1418.05 | 68.25 |
| 1418.12 | 68.25 |
| 1418.19 | 68.25 |
| 1418.26 | 68.25 |
| 1418.33 | 68.25 |
| 1418.4 | 68.25 |
| 1418.46 | 68.25 |
| 1418.53 | 68.25 |
| 1418.6 | 68.25 |
| 1418.67 | 68.25 |
| 1418.74 | 68.25 |
| 1418.81 | 68.25 |
| 1418.87 | 68.25 |
| 1418.94 | 68.25 |
| 1419.01 | 68 |
| 1419.08 | 68.25 |
| 1419.15 | 68.25 |
| 1419.21 | 68.25 |
| 1419.28 | 68 |
| 1419.35 | 68.25 |
| 1419.42 | 68.25 |
| 1419.49 | 68 |
| 1419.56 | 68.25 |
| 1419.62 | 68 |
| 1419.69 | 68 |
| 1419.76 | 68 |
| 1419.83 | 68 |
| 1419.9 | 68 |
| 1419.96 | 68 |
| 1420.03 | 68 |
| 1420.1 | 68 |
| 1420.17 | 68 |
| 1420.24 | 68 |
| 1420.31 | 67.75 |
| 1420.38 | 67.75 |
| 1420.44 | 67.75 |
| 1420.51 | 67.75 |
| 1420.58 | 67.75 |
| 1420.65 | 67.75 |
| 1420.72 | 67.75 |
| 1420.79 | 67.75 |
| 1420.85 | 67.75 |
| 1420.92 | 67.75 |
| 1420.99 | 67.75 |
| 1421.06 | 67.75 |
| 1421.13 | 67.75 |
| 1421.19 | 67.75 |
| 1421.26 | 67.75 |
| 1421.33 | 67.75 |
| 1421.4 | 67.75 |
| 1421.47 | 67.75 |
| 1421.54 | 67.75 |
| 1421.6 | 67.75 |
| 1421.67 | 67.75 |
| 1421.74 | 67.75 |
| 1421.81 | 67.75 |
| 1421.88 | 67.75 |
| 1421.94 | 67.75 |
| 1422.01 | 67.75 |
| 1422.08 | 67.75 |
| 1422.15 | 67.75 |
| 1422.22 | 67.75 |
| 1422.29 | 68 |
| 1422.35 | 67.75 |
| 1422.42 | 68 |
| 1422.49 | 67.75 |
| 1422.56 | 67.75 |
| 1422.63 | 67.75 |
| 1422.7 | 68 |
| 1422.77 | 68 |
| 1422.83 | 68 |
| 1422.9 | 68 |
| 1422.97 | 68 |
| 1423.04 | 68 |
| 1423.11 | 68 |
| 1423.18 | 68 |
| 1423.24 | 68 |
| 1423.31 | 68.25 |
| 1423.38 | 68.25 |
| 1423.45 | 68.25 |
| 1423.52 | 68.25 |
| 1423.58 | 68.25 |
| 1423.65 | 68.25 |
| 1423.72 | 68 |
| 1423.79 | 68 |
| 1423.86 | 68.25 |
| 1423.93 | 68 |
| 1423.99 | 68 |
| 1424.06 | 68.25 |
| 1424.13 | 68 |
| 1424.2 | 68 |
| 1424.27 | 68.25 |
| 1424.33 | 68 |
| 1424.4 | 68.25 |
| 1424.47 | 68 |
| 1424.54 | 68 |
| 1424.61 | 68 |
| 1424.68 | 68 |
| 1424.75 | 68.25 |
| 1424.81 | 68 |
| 1424.88 | 68 |
| 1424.95 | 68 |
| 1425.02 | 68 |
| 1425.09 | 68 |
| 1425.16 | 68 |
| 1425.22 | 68 |
| 1425.29 | 68 |
| 1425.36 | 68 |
| 1425.43 | 68 |
| 1425.5 | 68 |
| 1425.56 | 68 |
| 1425.63 | 68 |
| 1425.7 | 68 |
| 1425.77 | 68 |
| 1425.84 | 68 |
| 1425.91 | 68.25 |
| 1425.97 | 68 |
| 1426.04 | 68 |
| 1426.11 | 68 |
| 1426.18 | 68 |
| 1426.25 | 68 |
| 1426.32 | 68 |
| 1426.38 | 68 |
| 1426.45 | 68 |
| 1426.52 | 68.25 |
| 1426.59 | 68 |
| 1426.66 | 68 |
| 1426.72 | 68 |
| 1426.79 | 68 |
| 1426.86 | 68 |
| 1426.93 | 68 |
| 1427.0 | 68 |
| 1427.07 | 68 |
| 1427.14 | 68 |
| 1427.2 | 68 |
| 1427.27 | 68 |
| 1427.34 | 68 |
| 1427.41 | 68 |
| 1427.48 | 68 |
| 1427.55 | 68 |
| 1427.61 | 68 |
| 1427.68 | 68 |
| 1427.75 | 68 |
| 1427.82 | 68 |
| 1427.89 | 68 |
| 1427.95 | 68 |
| 1428.02 | 68 |
| 1428.09 | 68 |
| 1428.16 | 68 |
| 1428.23 | 68 |
| 1428.3 | 68 |
| 1428.36 | 68 |
| 1428.43 | 68 |
| 1428.5 | 68 |
| 1428.57 | 68 |
| 1428.64 | 67.75 |
| 1428.7 | 68 |
| 1428.77 | 68 |
| 1428.84 | 68 |
| 1428.91 | 68 |
| 1428.98 | 68 |
| 1429.05 | 68 |
| 1429.11 | 68 |
| 1429.18 | 68 |
| 1429.25 | 68 |
| 1429.32 | 68 |
| 1429.39 | 67.75 |
| 1429.45 | 68 |
| 1429.52 | 68 |
| 1429.59 | 68 |
| 1429.66 | 68 |
| 1429.73 | 68 |
| 1429.8 | 68 |
| 1429.86 | 68 |
| 1429.93 | 68 |
| 1430.0 | 68 |
| 1430.07 | 68 |
| 1430.14 | 68 |
| 1430.21 | 68 |
| 1430.28 | 68 |
| 1430.34 | 68 |
| 1430.41 | 68 |
| 1430.48 | 68 |
| 1430.55 | 68 |
| 1430.62 | 68 |
| 1430.68 | 68 |
| 1430.75 | 68 |
| 1430.82 | 68 |
| 1430.89 | 68 |
| 1430.96 | 68 |
| 1431.03 | 68 |
| 1431.09 | 68 |
| 1431.16 | 68 |
| 1431.23 | 68 |
| 1431.3 | 68 |
| 1431.37 | 68 |
| 1431.44 | 68 |
| 1431.5 | 68 |
| 1431.57 | 68 |
| 1431.64 | 68 |
| 1431.71 | 68 |
| 1431.78 | 68 |
| 1431.84 | 68 |
| 1431.91 | 68 |
| 1431.98 | 68 |
| 1432.05 | 68 |
| 1432.12 | 68 |
| 1432.19 | 68 |
| 1432.26 | 68.25 |
| 1432.32 | 68 |
| 1432.39 | 68 |
| 1432.46 | 68.25 |
| 1432.53 | 68.25 |
| 1432.6 | 68 |
| 1432.67 | 68 |
| 1432.73 | 68.25 |
| 1432.8 | 68.25 |
| 1432.87 | 68 |
| 1432.94 | 68 |
| 1433.01 | 68 |
| 1433.07 | 68 |
| 1433.14 | 68 |
| 1433.21 | 68 |
| 1433.28 | 68 |
| 1433.35 | 68 |
| 1433.42 | 68.25 |
| 1433.48 | 68 |
| 1433.55 | 68.25 |
| 1433.62 | 68 |
| 1433.69 | 68 |
| 1433.76 | 68 |
| 1433.82 | 68.25 |
| 1433.89 | 68 |
| 1433.96 | 68 |
| 1434.03 | 68 |
| 1434.1 | 68 |
| 1434.17 | 68 |
| 1434.23 | 68 |
| 1434.3 | 68 |
| 1434.37 | 68 |
| 1434.44 | 68 |
| 1434.51 | 68 |
| 1434.57 | 68 |
| 1434.64 | 68 |
| 1434.71 | 68 |
| 1434.78 | 68 |
| 1434.85 | 67.75 |
| 1434.92 | 67.75 |
| 1434.98 | 67.75 |
| 1435.05 | 67.75 |
| 1435.12 | 67.5 |
| 1435.19 | 67.5 |
| 1435.26 | 67.25 |
| 1435.33 | 67.25 |
| 1435.39 | 67 |
| 1435.46 | 66.75 |
| 1435.53 | 66.5 |
| 1435.6 | 66.25 |
| 1435.67 | 66 |
| 1435.73 | 65.75 |
| 1435.8 | 65.75 |
| 1435.87 | 65.5 |
| 1435.94 | 65.25 |
| 1436.01 | 65 |
| 1436.08 | 64.75 |
| 1436.14 | 64.25 |
| 1436.21 | 64.25 |
| 1436.28 | 63.75 |
| 1436.35 | 63.5 |
| 1436.42 | 63.25 |
| 1436.48 | 63 |
| 1436.55 | 62.75 |
| 1436.62 | 62.75 |
| 1436.69 | 62.75 |
| 1436.76 | 62.25 |
| 1436.82 | 62 |
| 1436.89 | 61.75 |
| 1436.96 | 61.5 |
| 1437.03 | 61.5 |
| 1437.1 | 61 |
| 1437.17 | 61 |
| 1437.23 | 60.75 |
| 1437.3 | 60.5 |
| 1437.37 | 60.25 |
| 1437.44 | 60.25 |
| 1437.51 | 60 |
| 1437.57 | 60 |
| 1437.64 | 59.75 |
| 1437.71 | 59.5 |
| 1437.78 | 59.25 |
| 1437.85 | 59 |
| 1437.92 | 58.75 |
| 1437.98 | 58.5 |
| 1438.05 | 58.5 |
| 1438.12 | 58.25 |
| 1438.19 | 58 |
| 1438.26 | 58 |
| 1438.32 | 57.75 |
| 1438.39 | 57.75 |
| 1438.46 | 57.5 |
| 1438.53 | 57.25 |
| 1438.6 | 57 |
| 1438.67 | 57 |
| 1438.73 | 56.75 |
| 1438.8 | 56.75 |
| 1438.87 | 56.5 |
| 1438.94 | 56.25 |
| 1439.01 | 56.25 |
| 1439.07 | 56.25 |
| 1439.14 | 56 |
| 1439.21 | 55.75 |
| 1439.28 | 55.75 |
| 1439.35 | 55.5 |
| 1439.42 | 55.25 |
| 1439.48 | 55.25 |
| 1439.55 | 55 |
| 1439.62 | 55 |
| 1439.69 | 54.75 |
| 1439.76 | 54.5 |
| 1439.82 | 54.5 |
| 1439.89 | 54.5 |
| 1439.96 | 54.25 |
| 1440.03 | 54.25 |
| 1440.1 | 54 |
| 1440.17 | 54 |
| 1440.23 | 53.75 |
| 1440.3 | 53.75 |
| 1440.37 | 53.5 |
| 1440.44 | 53.5 |
| 1440.51 | 53.25 |
| 1440.57 | 53 |
| 1440.64 | 53 |
| 1440.71 | 53 |
| 1440.78 | 52.75 |
| 1440.85 | 52.75 |
| 1440.92 | 52.5 |
| 1440.98 | 52.5 |
| 1441.05 | 52.25 |
| 1441.12 | 52 |
| 1441.19 | 52 |
| 1441.26 | 51.75 |
| 1441.32 | 51.75 |
| 1441.39 | 51.5 |
| 1441.46 | 51.5 |
| 1441.53 | 51.5 |
| 1441.6 | 51.25 |
| 1441.67 | 51.25 |
| 1441.73 | 51.25 |
| 1441.8 | 51 |
| 1441.87 | 50.75 |
| 1441.94 | 50.75 |
| 1442.01 | 50.75 |
| 1442.07 | 50.5 |
| 1442.14 | 50.5 |
| 1442.21 | 50.25 |
| 1442.28 | 50.25 |
| 1442.35 | 50.25 |
| 1442.42 | 50 |
| 1442.48 | 50 |
| 1442.55 | 49.75 |
| 1442.62 | 49.75 |
| 1442.69 | 49.5 |
| 1442.76 | 49.5 |
| 1442.82 | 49.25 |
| 1442.89 | 49.25 |
| 1442.96 | 49.25 |
| 1443.03 | 49 |
| 1443.1 | 48.75 |
| 1443.17 | 48.75 |
| 1443.23 | 48.75 |
| 1443.3 | 48.75 |
| 1443.37 | 48.5 |
| 1443.44 | 48.5 |
| 1443.51 | 48.25 |
| 1443.57 | 48.25 |
| 1443.64 | 48 |
| 1443.71 | 48 |
| 1443.78 | 47.75 |
| 1443.85 | 47.75 |
| 1443.92 | 47.75 |
| 1443.98 | 47.75 |
| 1444.05 | 47.5 |
| 1444.12 | 47.5 |
| 1444.19 | 47.25 |
| 1444.26 | 47.25 |
| 1444.32 | 47 |
| 1444.39 | 47 |
| 1444.46 | 46.75 |
| 1444.53 | 46.75 |
| 1444.6 | 46.75 |
| 1444.67 | 46.75 |
| 1444.73 | 46.5 |
| 1444.8 | 46.5 |
| 1444.87 | 46.5 |
| 1444.94 | 46.25 |
| 1445.01 | 46.25 |
| 1445.07 | 46.25 |
| 1445.14 | 46 |
| 1445.21 | 46 |
| 1445.28 | 45.75 |
| 1445.35 | 45.75 |
| 1445.41 | 45.75 |
| 1445.48 | 45.5 |
| 1445.55 | 45.5 |
| 1445.62 | 45.5 |
| 1445.69 | 45.25 |
| 1445.76 | 45.25 |
| 1445.82 | 45 |
| 1445.89 | 45 |
| 1445.96 | 45 |
| 1446.03 | 44.75 |
| 1446.1 | 44.75 |
| 1446.17 | 44.75 |
| 1446.23 | 44.5 |
| 1446.3 | 44.5 |
| 1446.37 | 44.5 |
| 1446.44 | 44.5 |
| 1446.51 | 44.25 |
| 1446.57 | 44.25 |
| 1446.64 | 44 |
| 1446.71 | 44 |
| 1446.78 | 43.75 |
| 1446.85 | 43.75 |
| 1446.92 | 43.75 |
| 1446.98 | 43.5 |
| 1447.05 | 43.5 |
| 1447.12 | 43.5 |
| 1447.19 | 43.25 |
| 1447.26 | 43.25 |
| 1447.32 | 43.25 |
| 1447.39 | 43 |
| 1447.46 | 43 |
| 1447.53 | 43 |
| 1447.6 | 43 |
| 1447.66 | 42.75 |
| 1447.73 | 42.75 |
| 1447.8 | 42.5 |
| 1447.87 | 42.5 |
| 1447.94 | 42.5 |
| 1448.01 | 42.25 |
| 1448.07 | 42.25 |
| 1448.14 | 42.25 |
| 1448.21 | 42.25 |
| 1448.28 | 42 |
| 1448.35 | 42 |
| 1448.41 | 42 |
| 1448.48 | 41.75 |
| 1448.55 | 41.75 |
| 1448.62 | 41.75 |
| 1448.69 | 41.5 |
| 1448.76 | 41.5 |
| 1448.82 | 41.25 |
| 1448.89 | 41.25 |
| 1448.96 | 41.25 |
| 1449.03 | 41.25 |
| 1449.1 | 41 |
| 1449.16 | 41 |
| 1449.23 | 41 |
| 1449.3 | 40.75 |
| 1449.37 | 40.75 |
| 1449.44 | 40.75 |
| 1449.5 | 40.5 |
| 1449.57 | 40.5 |
| 1449.64 | 40.5 |
| 1449.71 | 40.5 |
| 1449.78 | 40.5 |
| 1449.84 | 40.25 |
| 1449.91 | 40.25 |
| 1449.98 | 40.25 |
| 1450.05 | 40 |
| 1450.12 | 40 |
| 1450.19 | 40 |
| 1450.26 | 39.75 |
| 1450.32 | 39.75 |
| 1450.39 | 39.5 |
| 1450.46 | 39.75 |
| 1450.53 | 39.75 |
| 1450.59 | 39.5 |
| 1450.66 | 39.5 |
| 1450.73 | 39.25 |
| 1450.8 | 39.25 |
| 1450.87 | 39.25 |
| 1450.94 | 39 |
| 1451.0 | 39 |
| 1451.07 | 39 |
| 1451.14 | 39 |
| 1451.21 | 38.75 |
| 1451.28 | 38.75 |
| 1451.34 | 38.75 |
| 1451.41 | 38.75 |
| 1451.48 | 38.5 |
| 1451.55 | 38.5 |
| 1451.62 | 38.5 |
| 1451.69 | 38.25 |
| 1451.75 | 38.25 |
| 1451.82 | 38.25 |
| 1451.89 | 38.25 |
| 1451.96 | 38 |
| 1452.03 | 38 |
| 1452.09 | 37.75 |
| 1452.16 | 37.75 |
| 1452.23 | 37.75 |
| 1452.3 | 37.75 |
| 1452.37 | 37.75 |
| 1452.44 | 37.5 |
| 1452.51 | 37.5 |
| 1452.57 | 37.5 |
| 1452.64 | 37.5 |
| 1452.71 | 37.5 |
| 1452.78 | 37.25 |
| 1452.84 | 37.25 |
| 1452.91 | 37 |
| 1452.98 | 37 |
| 1453.05 | 37 |
| 1453.12 | 37 |
| 1453.19 | 37 |
| 1453.25 | 37 |
| 1453.32 | 36.75 |
| 1453.39 | 36.75 |
| 1453.46 | 36.75 |
| 1453.53 | 36.5 |
| 1453.59 | 36.5 |
| 1453.66 | 36.5 |
| 1453.73 | 36.5 |
| 1453.8 | 36.5 |
| 1453.87 | 36.25 |
| 1453.94 | 36.25 |
| 1454.0 | 36.25 |
| 1454.07 | 36.25 |
| 1454.14 | 36 |
| 1454.21 | 36 |
| 1454.28 | 36 |
| 1454.34 | 35.75 |
| 1454.41 | 35.75 |
| 1454.48 | 35.75 |
| 1454.55 | 35.75 |
| 1454.62 | 35.75 |
| 1454.69 | 35.5 |
| 1454.75 | 35.5 |
| 1454.82 | 35.5 |
| 1454.89 | 35.25 |
| 1454.96 | 35.25 |
| 1455.03 | 35.25 |
| 1455.09 | 35.25 |
| 1455.16 | 35.25 |
| 1455.23 | 35 |
| 1455.3 | 35 |
| 1455.37 | 35 |
| 1455.44 | 35 |
| 1455.5 | 34.75 |
| 1455.57 | 34.75 |
| 1455.64 | 34.75 |
| 1455.71 | 34.5 |
| 1455.78 | 34.5 |
| 1455.84 | 34.5 |
| 1455.91 | 34.5 |
| 1455.98 | 34.5 |
| 1456.05 | 34.25 |
| 1456.12 | 34.25 |
| 1456.19 | 34.25 |
| 1456.25 | 34.25 |
| 1456.32 | 34.25 |
| 1456.39 | 34.25 |
| 1456.46 | 34 |
| 1456.53 | 34 |
| 1456.59 | 34 |
| 1456.66 | 34 |
| 1456.73 | 34 |
| 1456.8 | 33.75 |
| 1456.87 | 33.75 |
| 1456.94 | 33.75 |
| 1457.0 | 33.5 |
| 1457.07 | 33.5 |
| 1457.14 | 33.5 |
| 1457.21 | 33.5 |
| 1457.28 | 33.5 |
| 1457.34 | 33.25 |
| 1457.41 | 33.25 |
| 1457.48 | 33.25 |
| 1457.55 | 33.25 |
| 1457.62 | 33 |
| 1457.69 | 33 |
| 1457.75 | 33 |
| 1457.82 | 33 |
| 1457.89 | 33 |
| 1457.96 | 33 |
| 1458.03 | 32.75 |
| 1458.09 | 32.75 |
| 1458.16 | 32.75 |
| 1458.23 | 32.75 |
| 1458.3 | 32.5 |
| 1458.37 | 32.5 |
| 1458.44 | 32.5 |
| 1458.5 | 32.5 |
| 1458.57 | 32.5 |
| 1458.64 | 32.5 |
| 1458.71 | 32.25 |
| 1458.78 | 32.25 |
| 1458.84 | 32.25 |
| 1458.91 | 32.25 |
| 1458.98 | 32 |
| 1459.05 | 32 |
| 1459.12 | 32 |
| 1459.18 | 31.75 |
| 1459.25 | 31.75 |
| 1459.32 | 31.75 |
| 1459.39 | 31.75 |
| 1459.46 | 31.75 |
| 1459.53 | 31.75 |
| 1459.59 | 31.5 |
| 1459.66 | 31.75 |
| 1459.73 | 31.5 |
| 1459.8 | 31.5 |
| 1459.87 | 31.5 |
| 1459.94 | 31.5 |
| 1460.0 | 31.5 |
| 1460.07 | 31.25 |
| 1460.14 | 31.25 |
| 1460.21 | 31.25 |
| 1460.28 | 31.25 |
| 1460.34 | 31.25 |
| 1460.41 | 31.25 |
| 1460.48 | 31 |
| 1460.55 | 31 |
| 1460.62 | 31 |
| 1460.68 | 31 |
| 1460.75 | 31 |
| 1460.82 | 30.75 |
| 1460.89 | 30.75 |
| 1460.96 | 30.75 |
| 1461.03 | 30.75 |
| 1461.09 | 30.75 |
| 1461.16 | 30.75 |
| 1461.23 | 30.5 |
| 1461.3 | 30.5 |
| 1461.37 | 30.5 |
| 1461.43 | 30.5 |
| 1461.5 | 30.25 |
| 1461.57 | 30.5 |
| 1461.64 | 30.25 |
| 1461.71 | 30.25 |
| 1461.78 | 30.25 |
| 1461.84 | 30 |
| 1461.91 | 30 |
| 1461.98 | 30 |
| 1462.05 | 30 |
| 1462.12 | 30 |
| 1462.18 | 30 |
| 1462.25 | 30 |
| 1462.32 | 29.75 |
| 1462.39 | 29.75 |
| 1462.46 | 29.75 |
| 1462.52 | 29.75 |
| 1462.59 | 29.75 |
| 1462.66 | 29.75 |
| 1462.73 | 29.75 |
| 1462.8 | 29.5 |
| 1462.86 | 29.5 |
| 1462.93 | 29.5 |
| 1463.0 | 29.5 |
| 1463.07 | 29.25 |
| 1463.14 | 29.25 |
| 1463.21 | 29.25 |
| 1463.27 | 29.25 |
| 1463.34 | 29.25 |
| 1463.41 | 29 |
| 1463.48 | 29.25 |
| 1463.55 | 29.25 |
| 1463.61 | 29 |
| 1463.68 | 29 |
| 1463.75 | 29 |
| 1463.82 | 29 |
| 1463.89 | 29 |
| 1463.96 | 28.75 |
| 1464.03 | 28.75 |
| 1464.09 | 28.75 |
| 1464.16 | 28.75 |
| 1464.23 | 28.75 |
| 1464.3 | 28.75 |
| 1464.37 | 28.75 |
| 1464.43 | 28.75 |
| 1464.5 | 28.5 |
| 1464.57 | 28.5 |
| 1464.64 | 28.5 |
| 1464.71 | 28.5 |
| 1464.77 | 28.5 |
| 1464.84 | 28.5 |
| 1464.91 | 28.25 |
| 1464.98 | 28.25 |
| 1465.05 | 28.25 |
| 1465.11 | 28 |
| 1465.18 | 28 |
| 1465.25 | 28.25 |
| 1465.32 | 28.25 |
| 1465.39 | 28 |
| 1465.46 | 28 |
| 1465.52 | 28 |
| 1465.59 | 28 |
| 1465.66 | 28 |
| 1465.73 | 28 |
| 1465.8 | 27.75 |
| 1465.86 | 27.75 |
| 1465.93 | 27.75 |
| 1466.0 | 27.75 |
| 1466.07 | 27.75 |
| 1466.14 | 27.75 |
| 1466.21 | 27.5 |
| 1466.27 | 27.75 |
| 1466.34 | 27.5 |
| 1466.41 | 27.5 |
| 1466.48 | 27.5 |
| 1466.55 | 27.5 |
| 1466.61 | 27.5 |
| 1466.68 | 27.25 |
| 1466.75 | 27.25 |
| 1466.82 | 27.25 |
| 1466.89 | 27.25 |
| 1466.95 | 27.25 |
| 1467.02 | 27.25 |
| 1467.09 | 27.25 |
| 1467.16 | 27 |
| 1467.23 | 27 |
| 1467.3 | 27 |
| 1467.36 | 27 |
| 1467.43 | 27 |
| 1467.5 | 27 |
| 1467.57 | 26.75 |
| 1467.64 | 26.75 |
| 1467.71 | 26.75 |
| 1467.77 | 26.75 |
| 1467.84 | 26.75 |
| 1467.91 | 26.75 |
| 1467.98 | 26.5 |
| 1468.05 | 26.5 |
| 1468.11 | 26.5 |
| 1468.18 | 26.5 |
| 1468.25 | 26.5 |
| 1468.32 | 26.5 |
| 1468.39 | 26.5 |
| 1468.45 | 26.5 |
| 1468.52 | 26.25 |
| 1468.59 | 26.25 |
| 1468.66 | 26.25 |
| 1468.73 | 26.25 |
| 1468.8 | 26.25 |
| 1468.86 | 26.25 |
| 1468.93 | 26.25 |
| 1469.0 | 26.25 |
| 1469.07 | 26.25 |
| 1469.14 | 26 |
| 1469.2 | 26 |
| 1469.27 | 26 |
| 1469.34 | 26 |
| 1469.41 | 26 |
| 1469.48 | 26 |
| 1469.55 | 26 |
| 1469.61 | 26 |
| 1469.68 | 26 |
| 1469.75 | 25.75 |
| 1469.82 | 25.75 |
| 1469.89 | 25.75 |
| 1469.95 | 25.75 |
| 1470.02 | 25.75 |
| 1470.09 | 25.75 |
| 1470.16 | 25.75 |
| 1470.23 | 25.75 |
| 1470.3 | 25.75 |
| 1470.36 | 25.75 |
| 1470.43 | 25.75 |
| 1470.5 | 25.5 |
| 1470.57 | 25.5 |
| 1470.64 | 25.5 |
| 1470.7 | 25.5 |
| 1470.77 | 25.5 |
| 1470.84 | 25.5 |
| 1470.91 | 25.5 |
| 1470.98 | 25.25 |
| 1471.05 | 25.25 |
| 1471.11 | 25.25 |
| 1471.18 | 25.25 |
| 1471.25 | 25.25 |
| 1471.32 | 25.25 |
| 1471.39 | 25.25 |
| 1471.45 | 25.25 |
| 1471.52 | 25 |
| 1471.59 | 25 |
| 1471.66 | 25 |
| 1471.73 | 25 |
| 1471.8 | 25 |
| 1471.86 | 25 |
| 1471.93 | 25 |
| 1472.0 | 25 |
| 1472.07 | 25 |
| 1472.14 | 25 |
| 1472.2 | 24.75 |
| 1472.27 | 24.75 |
| 1472.34 | 24.75 |
| 1472.41 | 24.75 |
| 1472.48 | 24.75 |
| 1472.55 | 24.75 |
| 1472.61 | 24.75 |
| 1472.68 | 24.75 |
| 1472.75 | 24.75 |
| 1472.82 | 24.75 |
| 1472.89 | 24.5 |
| 1472.95 | 24.5 |
| 1473.02 | 24.5 |
| 1473.09 | 24.5 |
| 1473.16 | 24.5 |
| 1473.23 | 24.5 |
| 1473.3 | 24.5 |
| 1473.36 | 24.5 |
| 1473.43 | 24.5 |
| 1473.5 | 24.5 |
| 1473.57 | 24.5 |
| 1473.64 | 24.25 |
| 1473.7 | 24.25 |
| 1473.77 | 24.25 |
| 1473.84 | 24.25 |
| 1473.91 | 24.25 |
| 1473.98 | 24.25 |
| 1474.04 | 24.25 |
| 1474.11 | 24.25 |
| 1474.18 | 24.25 |
| 1474.25 | 24.25 |
| 1474.32 | 24 |
| 1474.39 | 24 |
| 1474.45 | 24 |
| 1474.52 | 24 |
| 1474.59 | 24 |
| 1474.66 | 24 |
| 1474.73 | 24 |
| 1474.8 | 24 |
| 1474.86 | 23.75 |
| 1474.93 | 23.75 |
| 1475.0 | 23.75 |
| 1475.07 | 23.75 |
| 1475.14 | 24 |
| 1475.2 | 23.75 |
| 1475.27 | 23.75 |
| 1475.34 | 23.75 |
| 1475.41 | 23.75 |
| 1475.48 | 23.75 |
| 1475.55 | 23.75 |
| 1475.61 | 23.75 |
| 1475.68 | 23.75 |
| 1475.75 | 23.75 |
| 1475.82 | 23.75 |
| 1475.89 | 23.5 |
| 1475.95 | 23.5 |
| 1476.02 | 23.5 |
| 1476.09 | 23.5 |
| 1476.16 | 23.5 |
| 1476.23 | 23.5 |
| 1476.29 | 23.5 |
| 1476.36 | 23.5 |
| 1476.43 | 23.5 |
| 1476.5 | 23.5 |
| 1476.57 | 23.5 |
| 1476.64 | 23.5 |
| 1476.7 | 23.5 |
| 1476.77 | 23.25 |
| 1476.84 | 23.25 |
| 1476.91 | 23.25 |
| 1476.98 | 23.25 |
| 1477.05 | 23.25 |
| 1477.11 | 23.25 |
| 1477.18 | 23.25 |
| 1477.25 | 23.25 |
| 1477.32 | 23.25 |
| 1477.39 | 23.25 |
| 1477.45 | 23.25 |
| 1477.52 | 23 |
| 1477.59 | 23.25 |
| 1477.66 | 23 |
| 1477.73 | 23 |
| 1477.79 | 23 |
| 1477.86 | 23 |
| 1477.93 | 23 |
| 1478.0 | 23 |
| 1478.07 | 23 |
| 1478.14 | 23 |
| 1478.2 | 23 |
| 1478.27 | 23 |
| 1478.34 | 23 |
| 1478.41 | 23 |
| 1478.48 | 23 |
| 1478.54 | 23 |
| 1478.61 | 23 |
| 1478.68 | 23 |
| 1478.75 | 23 |
| 1478.82 | 23 |
| 1478.89 | 23 |
| 1478.95 | 23 |
| 1479.02 | 23 |
| 1479.09 | 23 |
| 1479.16 | 23 |
| 1479.23 | 23 |
| 1479.29 | 23 |
| 1479.36 | 23 |
| 1479.43 | 23 |
| 1479.5 | 23 |
| 1479.57 | 23 |
| 1479.63 | 22.75 |
| 1479.7 | 22.75 |
| 1479.77 | 22.75 |
| 1479.84 | 22.75 |
| 1479.91 | 22.75 |
| 1479.97 | 22.75 |
| 1480.04 | 22.75 |
| 1480.11 | 22.75 |
| 1480.18 | 22.75 |
| 1480.25 | 22.75 |
| 1480.32 | 22.75 |
| 1480.39 | 22.75 |
| 1480.45 | 22.75 |
| 1480.52 | 22.75 |
| 1480.59 | 22.75 |
| 1480.66 | 22.75 |
| 1480.72 | 22.75 |
| 1480.79 | 22.75 |
| 1480.86 | 22.75 |
| 1480.93 | 22.75 |
| 1481.0 | 22.75 |
| 1481.07 | 22.75 |
| 1481.14 | 22.75 |
| 1481.2 | 22.5 |
| 1481.27 | 22.5 |
| 1481.34 | 22.5 |
| 1481.41 | 22.75 |
| 1481.48 | 22.5 |
| 1481.54 | 22.5 |
| 1481.61 | 22.5 |
| 1481.68 | 22.5 |
| 1481.75 | 22.5 |
| 1481.82 | 22.5 |
| 1481.88 | 22.5 |
| 1481.95 | 22.5 |
| 1482.02 | 22.5 |
| 1482.09 | 22.5 |
| 1482.16 | 22.5 |
| 1482.22 | 22.5 |
| 1482.29 | 22.5 |
| 1482.36 | 22.5 |
| 1482.43 | 22.5 |
| 1482.5 | 22.25 |
| 1482.57 | 22.25 |
| 1482.63 | 22.25 |
| 1482.7 | 22.25 |
| 1482.77 | 22.25 |
| 1482.84 | 22.25 |
| 1482.91 | 22.25 |
| 1482.97 | 22.25 |
| 1483.04 | 22.25 |
| 1483.11 | 22.25 |
| 1483.18 | 22.25 |
| 1483.25 | 22 |
| 1483.32 | 22.25 |
| 1483.38 | 22.25 |
| 1483.45 | 22 |
| 1483.52 | 22 |
| 1483.59 | 22 |
| 1483.66 | 22 |
| 1483.72 | 22 |
| 1483.79 | 22 |
| 1483.86 | 22 |
| 1483.93 | 21.75 |
| 1484.0 | 21.75 |
| 1484.06 | 22 |
| 1484.13 | 22 |
| 1484.2 | 22 |
| 1484.27 | 22 |
| 1484.34 | 22 |
| 1484.41 | 22 |
| 1484.47 | 22 |
| 1484.54 | 22 |
| 1484.61 | 22 |
| 1484.68 | 22 |
| 1484.75 | 22 |
| 1484.81 | 22 |
| 1484.88 | 22 |
| 1484.95 | 22 |
| 1485.02 | 21.75 |
| 1485.09 | 22 |
| 1485.16 | 22 |
| 1485.22 | 22 |
| 1485.29 | 21.75 |
| 1485.36 | 22 |
| 1485.43 | 22 |
| 1485.5 | 22 |
| 1485.56 | 21.75 |
| 1485.63 | 21.75 |
| 1485.7 | 21.75 |
| 1485.77 | 22 |
| 1485.84 | 21.75 |
| 1485.91 | 21.75 |
| 1485.97 | 21.75 |
| 1486.04 | 21.75 |
| 1486.11 | 21.75 |
| 1486.18 | 21.75 |
| 1486.25 | 21.75 |
| 1486.31 | 21.75 |
| 1486.38 | 21.75 |
| 1486.45 | 21.75 |
| 1486.52 | 21.75 |
| 1486.59 | 21.75 |
| 1486.66 | 21.75 |
| 1486.72 | 21.75 |
| 1486.79 | 21.75 |
| 1486.86 | 21.75 |
| 1486.93 | 21.75 |
| 1487.0 | 21.75 |
| 1487.06 | 21.75 |
| 1487.13 | 21.75 |
| 1487.2 | 21.75 |
| 1487.27 | 21.75 |
| 1487.34 | 21.5 |
| 1487.41 | 21.75 |
| 1487.47 | 21.5 |
| 1487.54 | 21.75 |
| 1487.61 | 21.5 |
| 1487.68 | 21.5 |
| 1487.75 | 21.75 |
| 1487.81 | 21.75 |
| 1487.88 | 21.75 |
| 1487.95 | 21.75 |
| 1488.02 | 21.5 |
| 1488.09 | 21.5 |
| 1488.16 | 21.75 |
| 1488.22 | 21.5 |
| 1488.29 | 21.5 |
| 1488.36 | 21.5 |
| 1488.43 | 21.5 |
| 1488.5 | 21.5 |
| 1488.56 | 21.75 |
| 1488.63 | 21.5 |
| 1488.7 | 21.5 |
| 1488.77 | 21.5 |
| 1488.84 | 21.5 |
| 1488.91 | 21.5 |
| 1488.97 | 21.5 |
| 1489.04 | 21.5 |
| 1489.11 | 21.5 |
| 1489.18 | 21.5 |
| 1489.25 | 21.5 |
| 1489.31 | 21.5 |
| 1489.38 | 21.5 |
| 1489.45 | 21.5 |
| 1489.52 | 21.5 |
| 1489.59 | 21.5 |
| 1489.66 | 21.5 |
| 1489.72 | 21.5 |
| 1489.79 | 21.5 |
| 1489.86 | 21.5 |
| 1489.93 | 21.5 |
| 1490.0 | 21.5 |
| 1490.06 | 21.5 |
| 1490.13 | 21.5 |
| 1490.2 | 21.5 |
| 1490.27 | 21.5 |
| 1490.34 | 21.5 |
| 1490.41 | 21.5 |
| 1490.47 | 21.25 |
| 1490.54 | 21.25 |
| 1490.61 | 21.5 |
| 1490.68 | 21.5 |
| 1490.75 | 21.25 |
| 1490.81 | 21.5 |
| 1490.88 | 21.5 |
| 1490.95 | 21.5 |
| 1491.02 | 21.5 |
| 1491.09 | 21.25 |
| 1491.15 | 21.5 |
| 1491.22 | 21.5 |
| 1491.29 | 21.5 |
| 1491.36 | 21.5 |
| 1491.43 | 21.25 |
| 1491.5 | 21.25 |
| 1491.56 | 21.5 |
| 1491.63 | 21.25 |
| 1491.7 | 21.25 |
| 1491.77 | 21.25 |
| 1491.84 | 21.5 |
| 1491.91 | 21.25 |
| 1491.97 | 21.25 |
| 1492.04 | 21.25 |
| 1492.11 | 21.25 |
| 1492.18 | 21.25 |
| 1492.25 | 21.25 |
| 1492.31 | 21.25 |
| 1492.38 | 21.25 |
| 1492.45 | 21.25 |
| 1492.52 | 21.25 |
| 1492.59 | 21.25 |
| 1492.66 | 21.25 |
| 1492.72 | 21.25 |
| 1492.79 | 21.25 |
| 1492.86 | 21.25 |
| 1492.93 | 21.25 |
| 1493.0 | 21.25 |
| 1493.06 | 21.25 |
| 1493.13 | 21.25 |